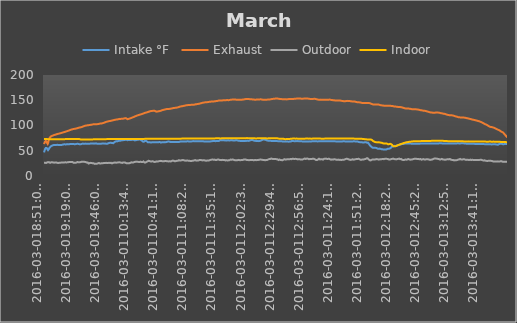
| Category | Intake °F  | Exhaust | Outdoor | Indoor |
|---|---|---|---|---|
| 2016-03-018:51:02 AM | 46.738 | 63.275 | 26.038 | 73.512 |
| 2016-03-018:51:06 AM | 47.412 | 63.725 | 26.15 | 73.512 |
| 2016-03-018:51:10 AM | 47.975 | 64.062 | 26.15 | 73.512 |
| 2016-03-018:51:14 AM | 48.538 | 64.512 | 26.15 | 73.512 |
| 2016-03-018:51:18 AM | 49.1 | 64.963 | 26.262 | 73.512 |
| 2016-03-018:51:23 AM | 49.438 | 65.3 | 26.15 | 73.512 |
| 2016-03-018:51:27 AM | 50 | 65.638 | 26.15 | 73.4 |
| 2016-03-018:51:31 AM | 50.338 | 65.975 | 26.15 | 73.4 |
| 2016-03-018:51:35 AM | 50.788 | 66.2 | 26.038 | 73.4 |
| 2016-03-018:51:39 AM | 51.238 | 66.425 | 26.038 | 73.512 |
| 2016-03-018:51:43 AM | 51.575 | 66.762 | 26.038 | 73.4 |
| 2016-03-018:51:47 AM | 52.025 | 66.988 | 26.038 | 73.4 |
| 2016-03-018:51:51 AM | 52.362 | 67.212 | 26.15 | 73.4 |
| 2016-03-018:51:56 AM | 52.7 | 67.55 | 26.15 | 73.4 |
| 2016-03-018:52:00 AM | 53.038 | 67.662 | 26.262 | 73.4 |
| 2016-03-018:52:04 AM | 53.375 | 67.888 | 26.262 | 73.4 |
| 2016-03-018:52:08 AM | 53.6 | 68.338 | 26.15 | 73.4 |
| 2016-03-018:52:12 AM | 53.938 | 68.45 | 26.15 | 73.4 |
| 2016-03-018:52:16 AM | 54.388 | 68.562 | 26.262 | 73.4 |
| 2016-03-018:52:20 AM | 54.725 | 68.788 | 26.262 | 73.4 |
| 2016-03-018:52:24 AM | 54.838 | 68.9 | 26.262 | 73.4 |
| 2016-03-018:52:29 AM | 55.062 | 69.125 | 26.038 | 73.4 |
| 2016-03-018:52:33 AM | 55.288 | 69.35 | 26.15 | 73.4 |
| 2016-03-018:52:37 AM | 55.4 | 69.462 | 26.038 | 73.4 |
| 2016-03-018:52:41 AM | 55.512 | 69.688 | 25.925 | 73.288 |
| 2016-03-018:52:53 AM | 55.625 | 69.8 | 25.812 | 73.4 |
| 2016-03-018:52:57 AM | 55.738 | 69.8 | 25.812 | 73.288 |
| 2016-03-018:53:02 AM | 55.738 | 69.575 | 25.7 | 73.4 |
| 2016-03-018:53:06 AM | 56.075 | 69.238 | 25.7 | 73.4 |
| 2016-03-018:53:10 AM | 56.075 | 68.9 | 25.812 | 73.288 |
| 2016-03-018:53:21 AM | 56.075 | 68.675 | 25.812 | 73.288 |
| 2016-03-018:53:26 AM | 56.075 | 68.45 | 25.925 | 73.288 |
| 2016-03-018:53:30 AM | 55.962 | 68.225 | 26.038 | 73.288 |
| 2016-03-018:53:34 AM | 55.85 | 67.888 | 26.038 | 73.288 |
| 2016-03-018:53:38 AM | 55.738 | 67.662 | 26.15 | 73.288 |
| 2016-03-018:53:41 AM | 55.512 | 67.438 | 26.15 | 73.175 |
| 2016-03-018:53:45 AM | 55.4 | 67.1 | 26.15 | 73.175 |
| 2016-03-018:53:50 AM | 55.288 | 66.875 | 26.262 | 73.175 |
| 2016-03-018:53:54 AM | 54.95 | 66.65 | 26.375 | 73.175 |
| 2016-03-018:53:58 AM | 54.838 | 66.312 | 26.488 | 73.175 |
| 2016-03-018:54:02 AM | 54.612 | 66.088 | 26.488 | 73.175 |
| 2016-03-018:54:06 AM | 54.388 | 65.862 | 26.6 | 73.175 |
| 2016-03-018:54:10 AM | 54.275 | 65.638 | 26.712 | 73.062 |
| 2016-03-018:54:15 AM | 53.938 | 65.412 | 26.712 | 73.062 |
| 2016-03-018:54:19 AM | 53.712 | 65.188 | 26.712 | 73.062 |
| 2016-03-018:54:23 AM | 53.488 | 64.963 | 26.712 | 73.062 |
| 2016-03-018:54:27 AM | 53.262 | 64.738 | 26.825 | 73.062 |
| 2016-03-018:54:31 AM | 53.038 | 64.512 | 26.938 | 73.062 |
| 2016-03-018:54:35 AM | 52.812 | 64.4 | 26.938 | 73.062 |
| 2016-03-018:54:39 AM | 52.588 | 63.838 | 26.938 | 73.062 |
| 2016-03-018:54:44 AM | 52.362 | 63.613 | 27.05 | 72.95 |
| 2016-03-018:54:48 AM | 52.138 | 63.5 | 27.162 | 72.95 |
| 2016-03-018:54:52 AM | 51.912 | 63.275 | 27.162 | 72.95 |
| 2016-03-018:54:56 AM | 51.688 | 63.05 | 27.275 | 72.95 |
| 2016-03-018:55:00 AM | 51.462 | 62.938 | 27.388 | 72.95 |
| 2016-03-018:55:04 AM | 51.238 | 63.725 | 27.388 | 72.95 |
| 2016-03-018:55:08 AM | 50.9 | 64.738 | 27.5 | 72.95 |
| 2016-03-018:55:13 AM | 50.788 | 65.75 | 27.612 | 72.95 |
| 2016-03-018:55:20 AM | 51.012 | 66.65 | 27.725 | 72.95 |
| 2016-03-018:55:25 AM | 51.238 | 67.325 | 27.725 | 72.95 |
| 2016-03-018:55:29 AM | 51.462 | 68.112 | 27.725 | 72.95 |
| 2016-03-018:55:33 AM | 51.688 | 68.788 | 27.612 | 72.95 |
| 2016-03-018:55:37 AM | 52.138 | 69.462 | 27.5 | 72.95 |
| 2016-03-018:55:41 AM | 52.362 | 70.025 | 27.388 | 72.95 |
| 2016-03-018:55:45 AM | 52.7 | 70.7 | 27.275 | 72.95 |
| 2016-03-018:55:50 AM | 52.925 | 71.15 | 27.162 | 72.95 |
| 2016-03-018:55:54 AM | 53.15 | 71.712 | 27.275 | 72.95 |
| 2016-03-018:55:58 AM | 53.488 | 72.162 | 27.275 | 72.95 |
| 2016-03-018:56:02 AM | 53.712 | 72.612 | 27.275 | 72.95 |
| 2016-03-018:56:06 AM | 54.05 | 72.95 | 27.275 | 72.838 |
| 2016-03-018:56:10 AM | 54.275 | 73.4 | 27.275 | 72.838 |
| 2016-03-018:56:15 AM | 54.5 | 73.738 | 27.162 | 72.838 |
| 2016-03-018:56:19 AM | 54.838 | 74.075 | 27.05 | 72.838 |
| 2016-03-018:56:23 AM | 55.175 | 74.412 | 26.938 | 72.838 |
| 2016-03-018:56:27 AM | 55.288 | 74.638 | 26.825 | 72.838 |
| 2016-03-018:56:31 AM | 55.625 | 74.862 | 26.825 | 72.838 |
| 2016-03-018:56:35 AM | 55.85 | 75.088 | 26.712 | 72.838 |
| 2016-03-018:56:39 AM | 56.075 | 75.312 | 26.6 | 72.838 |
| 2016-03-018:56:48 AM | 56.3 | 75.538 | 26.375 | 72.725 |
| 2016-03-018:56:52 AM | 56.638 | 75.762 | 26.375 | 72.725 |
| 2016-03-018:56:56 AM | 56.75 | 75.988 | 26.262 | 72.725 |
| 2016-03-018:57:00 AM | 56.975 | 76.325 | 26.262 | 72.725 |
| 2016-03-018:57:04 AM | 57.088 | 76.438 | 26.262 | 72.725 |
| 2016-03-018:57:09 AM | 57.2 | 76.662 | 26.15 | 72.725 |
| 2016-03-018:57:13 AM | 57.312 | 76.888 | 26.15 | 72.725 |
| 2016-03-018:57:17 AM | 57.425 | 77 | 26.262 | 72.725 |
| 2016-03-018:57:21 AM | 57.538 | 77.112 | 26.15 | 72.725 |
| 2016-03-018:57:25 AM | 57.65 | 77.225 | 26.262 | 72.725 |
| 2016-03-018:57:29 AM | 57.762 | 77.338 | 26.375 | 72.725 |
| 2016-03-018:57:33 AM | 57.988 | 77.45 | 26.375 | 72.725 |
| 2016-03-018:57:37 AM | 58.1 | 77.675 | 26.488 | 72.725 |
| 2016-03-018:57:42 AM | 58.325 | 77.788 | 26.488 | 72.725 |
| 2016-03-018:57:46 AM | 58.55 | 77.9 | 26.6 | 72.725 |
| 2016-03-018:57:50 AM | 58.662 | 78.012 | 26.6 | 72.612 |
| 2016-03-018:57:54 AM | 58.775 | 78.125 | 26.825 | 72.612 |
| 2016-03-018:57:58 AM | 59 | 78.125 | 26.825 | 72.725 |
| 2016-03-018:58:02 AM | 59.112 | 78.238 | 26.938 | 72.612 |
| 2016-03-018:58:06 AM | 59.225 | 78.35 | 26.938 | 72.725 |
| 2016-03-018:58:10 AM | 59.338 | 78.462 | 27.05 | 72.612 |
| 2016-03-018:58:14 AM | 59.45 | 78.8 | 27.05 | 72.725 |
| 2016-03-018:58:18 AM | 59.45 | 78.912 | 27.05 | 72.612 |
| 2016-03-018:58:22 AM | 59.45 | 78.912 | 27.05 | 72.725 |
| 2016-03-018:58:26 AM | 59.562 | 79.025 | 27.162 | 72.612 |
| 2016-03-018:58:31 AM | 59.562 | 79.025 | 27.05 | 72.725 |
| 2016-03-018:58:35 AM | 59.675 | 79.025 | 27.05 | 72.612 |
| 2016-03-018:58:39 AM | 59.675 | 79.138 | 27.162 | 72.725 |
| 2016-03-018:58:43 AM | 59.788 | 79.25 | 27.162 | 72.612 |
| 2016-03-018:58:47 AM | 59.9 | 79.25 | 27.275 | 72.725 |
| 2016-03-018:58:51 AM | 60.012 | 79.362 | 27.388 | 72.612 |
| 2016-03-018:58:55 AM | 60.012 | 79.362 | 27.388 | 72.725 |
| 2016-03-018:59:02 AM | 60.125 | 79.475 | 27.275 | 72.725 |
| 2016-03-018:59:06 AM | 60.238 | 79.588 | 27.275 | 72.725 |
| 2016-03-018:59:11 AM | 60.238 | 79.7 | 27.275 | 72.725 |
| 2016-03-018:59:15 AM | 60.238 | 79.7 | 27.162 | 72.725 |
| 2016-03-018:59:19 AM | 60.35 | 79.7 | 27.05 | 72.725 |
| 2016-03-018:59:23 AM | 60.35 | 79.812 | 27.05 | 72.725 |
| 2016-03-018:59:27 AM | 60.462 | 79.812 | 27.05 | 72.725 |
| 2016-03-018:59:31 AM | 60.575 | 79.812 | 27.05 | 72.725 |
| 2016-03-018:59:35 AM | 60.575 | 79.925 | 26.938 | 72.725 |
| 2016-03-018:59:43 AM | 60.688 | 80.038 | 26.938 | 72.725 |
| 2016-03-018:59:47 AM | 60.8 | 80.15 | 26.825 | 72.725 |
| 2016-03-018:59:51 AM | 60.8 | 80.262 | 26.712 | 72.725 |
| 2016-03-018:59:56 AM | 60.8 | 80.262 | 26.712 | 72.725 |
| 2016-03-018:59:59 AM | 60.912 | 80.375 | 26.712 | 72.725 |
| 2016-03-019:00:03 AM | 60.912 | 80.488 | 26.712 | 72.725 |
| 2016-03-019:00:07 AM | 61.025 | 80.375 | 26.712 | 72.612 |
| 2016-03-019:00:12 AM | 61.025 | 80.375 | 26.712 | 72.612 |
| 2016-03-019:00:16 AM | 61.138 | 80.488 | 26.712 | 72.612 |
| 2016-03-019:00:20 AM | 61.138 | 80.488 | 26.6 | 72.612 |
| 2016-03-019:00:24 AM | 61.138 | 80.6 | 26.6 | 72.5 |
| 2016-03-019:00:28 AM | 61.138 | 80.712 | 26.6 | 72.5 |
| 2016-03-019:00:32 AM | 61.25 | 80.712 | 26.6 | 72.5 |
| 2016-03-019:00:36 AM | 61.25 | 80.712 | 26.488 | 72.5 |
| 2016-03-019:00:40 AM | 61.25 | 80.825 | 26.375 | 72.5 |
| 2016-03-019:00:44 AM | 61.25 | 80.825 | 26.262 | 72.5 |
| 2016-03-019:00:48 AM | 61.25 | 80.825 | 26.15 | 72.5 |
| 2016-03-019:00:53 AM | 61.138 | 80.938 | 26.375 | 72.612 |
| 2016-03-019:01:00 AM | 61.138 | 80.938 | 26.262 | 72.5 |
| 2016-03-019:01:05 AM | 61.138 | 80.938 | 26.262 | 72.5 |
| 2016-03-019:01:09 AM | 61.138 | 81.05 | 26.262 | 72.612 |
| 2016-03-019:01:13 AM | 61.138 | 81.162 | 26.375 | 72.612 |
| 2016-03-019:01:17 AM | 61.138 | 81.275 | 26.375 | 72.5 |
| 2016-03-019:01:21 AM | 61.138 | 81.275 | 26.375 | 72.612 |
| 2016-03-019:01:29 AM | 61.25 | 81.388 | 26.375 | 72.612 |
| 2016-03-019:01:33 AM | 61.25 | 81.388 | 26.262 | 72.612 |
| 2016-03-019:01:37 AM | 61.25 | 81.5 | 26.262 | 72.612 |
| 2016-03-019:01:41 AM | 61.363 | 81.5 | 26.262 | 72.612 |
| 2016-03-019:01:46 AM | 61.363 | 81.5 | 26.488 | 72.612 |
| 2016-03-019:01:50 AM | 61.363 | 81.612 | 26.375 | 72.612 |
| 2016-03-019:01:54 AM | 61.25 | 81.612 | 26.488 | 72.612 |
| 2016-03-019:01:58 AM | 61.138 | 81.612 | 26.6 | 72.612 |
| 2016-03-019:02:02 AM | 61.025 | 81.725 | 26.6 | 72.612 |
| 2016-03-019:02:10 AM | 61.025 | 81.725 | 26.825 | 72.612 |
| 2016-03-019:02:14 AM | 61.025 | 81.838 | 26.938 | 72.612 |
| 2016-03-019:02:18 AM | 61.138 | 81.838 | 26.825 | 72.612 |
| 2016-03-019:02:23 AM | 61.138 | 81.838 | 26.825 | 72.612 |
| 2016-03-019:02:27 AM | 61.138 | 81.838 | 26.938 | 72.612 |
| 2016-03-019:02:31 AM | 61.138 | 81.95 | 27.05 | 72.612 |
| 2016-03-019:02:35 AM | 61.138 | 81.95 | 27.162 | 72.612 |
| 2016-03-019:02:39 AM | 61.25 | 81.95 | 27.162 | 72.612 |
| 2016-03-019:02:43 AM | 61.363 | 82.062 | 27.162 | 72.612 |
| 2016-03-019:02:47 AM | 61.363 | 82.062 | 27.162 | 72.612 |
| 2016-03-019:02:51 AM | 61.475 | 82.062 | 27.162 | 72.612 |
| 2016-03-019:02:55 AM | 61.475 | 82.175 | 27.05 | 72.612 |
| 2016-03-019:03:00 AM | 61.475 | 82.175 | 26.825 | 72.612 |
| 2016-03-019:03:04 AM | 61.588 | 82.175 | 26.825 | 72.612 |
| 2016-03-019:03:08 AM | 61.588 | 82.288 | 26.712 | 72.612 |
| 2016-03-019:03:12 AM | 61.7 | 82.288 | 26.712 | 72.612 |
| 2016-03-019:03:16 AM | 61.588 | 82.4 | 26.825 | 72.612 |
| 2016-03-019:03:20 AM | 61.588 | 82.512 | 26.712 | 72.612 |
| 2016-03-019:03:24 AM | 61.588 | 82.512 | 26.375 | 72.612 |
| 2016-03-019:03:28 AM | 61.588 | 82.512 | 26.262 | 72.612 |
| 2016-03-019:03:32 AM | 61.588 | 82.512 | 26.375 | 72.612 |
| 2016-03-019:03:36 AM | 61.588 | 82.512 | 26.488 | 72.612 |
| 2016-03-019:03:40 AM | 61.588 | 82.625 | 26.488 | 72.725 |
| 2016-03-019:03:45 AM | 61.588 | 82.625 | 26.6 | 72.612 |
| 2016-03-019:03:49 AM | 61.588 | 82.738 | 26.712 | 72.612 |
| 2016-03-019:03:53 AM | 61.475 | 82.738 | 26.6 | 72.612 |
| 2016-03-019:03:57 AM | 61.475 | 82.85 | 26.488 | 72.725 |
| 2016-03-019:04:01 AM | 61.588 | 82.85 | 26.262 | 72.725 |
| 2016-03-019:04:05 AM | 61.588 | 82.962 | 26.15 | 72.725 |
| 2016-03-019:04:09 AM | 61.588 | 82.962 | 26.15 | 72.725 |
| 2016-03-019:04:13 AM | 61.588 | 83.075 | 26.15 | 72.612 |
| 2016-03-019:04:17 AM | 61.7 | 83.075 | 26.038 | 72.612 |
| 2016-03-019:04:21 AM | 61.7 | 83.188 | 26.038 | 72.725 |
| 2016-03-019:04:25 AM | 61.7 | 83.188 | 25.925 | 72.725 |
| 2016-03-019:04:29 AM | 61.7 | 83.188 | 26.038 | 72.725 |
| 2016-03-019:04:33 AM | 61.812 | 83.188 | 25.925 | 72.725 |
| 2016-03-019:04:37 AM | 61.7 | 83.3 | 25.7 | 72.725 |
| 2016-03-019:04:41 AM | 61.7 | 83.3 | 25.7 | 72.725 |
| 2016-03-019:04:45 AM | 61.7 | 83.3 | 25.7 | 72.725 |
| 2016-03-019:04:49 AM | 61.588 | 83.3 | 25.7 | 72.838 |
| 2016-03-019:04:53 AM | 61.475 | 83.3 | 25.588 | 72.838 |
| 2016-03-019:04:57 AM | 61.363 | 83.412 | 25.588 | 72.838 |
| 2016-03-019:05:02 AM | 61.25 | 83.412 | 25.588 | 72.838 |
| 2016-03-019:05:06 AM | 61.363 | 83.412 | 25.588 | 72.725 |
| 2016-03-019:05:10 AM | 61.363 | 83.525 | 25.7 | 72.838 |
| 2016-03-019:05:14 AM | 61.363 | 83.525 | 25.812 | 72.838 |
| 2016-03-019:05:18 AM | 61.363 | 83.638 | 25.925 | 72.838 |
| 2016-03-019:05:22 AM | 61.363 | 83.638 | 26.038 | 72.838 |
| 2016-03-019:05:26 AM | 61.25 | 83.638 | 26.038 | 72.838 |
| 2016-03-019:05:30 AM | 61.138 | 83.75 | 26.038 | 72.838 |
| 2016-03-019:05:34 AM | 61.138 | 83.638 | 26.15 | 72.838 |
| 2016-03-019:05:38 AM | 61.25 | 83.75 | 26.15 | 72.725 |
| 2016-03-019:05:42 AM | 61.25 | 83.75 | 26.262 | 72.725 |
| 2016-03-019:05:46 AM | 61.363 | 83.75 | 26.375 | 72.838 |
| 2016-03-019:05:50 AM | 61.363 | 83.862 | 26.375 | 72.838 |
| 2016-03-019:05:54 AM | 61.363 | 83.862 | 26.375 | 72.838 |
| 2016-03-019:05:58 AM | 61.363 | 83.975 | 26.375 | 72.838 |
| 2016-03-019:06:02 AM | 61.25 | 83.975 | 26.488 | 72.838 |
| 2016-03-019:06:06 AM | 61.25 | 83.975 | 26.375 | 72.725 |
| 2016-03-019:06:10 AM | 61.363 | 84.088 | 26.375 | 72.838 |
| 2016-03-019:06:14 AM | 61.363 | 84.088 | 26.375 | 72.838 |
| 2016-03-019:06:19 AM | 61.25 | 84.088 | 26.262 | 72.838 |
| 2016-03-019:06:23 AM | 61.25 | 84.2 | 26.15 | 72.838 |
| 2016-03-019:06:27 AM | 61.138 | 84.2 | 26.262 | 72.838 |
| 2016-03-019:06:31 AM | 61.138 | 84.312 | 26.262 | 72.838 |
| 2016-03-019:06:35 AM | 61.138 | 84.312 | 26.262 | 72.838 |
| 2016-03-019:06:39 AM | 61.138 | 84.425 | 26.375 | 72.725 |
| 2016-03-019:06:43 AM | 61.025 | 84.425 | 26.375 | 72.838 |
| 2016-03-019:06:47 AM | 61.025 | 84.425 | 26.262 | 72.838 |
| 2016-03-019:06:51 AM | 60.912 | 84.538 | 26.262 | 72.838 |
| 2016-03-019:06:55 AM | 61.025 | 84.538 | 26.375 | 72.725 |
| 2016-03-019:06:59 AM | 61.025 | 84.538 | 26.375 | 72.838 |
| 2016-03-019:07:03 AM | 61.025 | 84.65 | 26.375 | 72.838 |
| 2016-03-019:07:07 AM | 61.025 | 84.65 | 26.488 | 72.838 |
| 2016-03-019:07:11 AM | 61.138 | 84.65 | 26.6 | 72.838 |
| 2016-03-019:07:15 AM | 61.138 | 84.65 | 26.712 | 72.838 |
| 2016-03-019:07:19 AM | 61.25 | 84.762 | 26.825 | 72.838 |
| 2016-03-019:07:23 AM | 61.25 | 84.762 | 26.712 | 72.838 |
| 2016-03-019:07:27 AM | 61.363 | 84.762 | 26.6 | 72.838 |
| 2016-03-019:07:31 AM | 61.363 | 84.762 | 26.6 | 72.838 |
| 2016-03-019:07:36 AM | 61.475 | 84.875 | 26.488 | 72.838 |
| 2016-03-019:07:40 AM | 61.475 | 84.988 | 26.375 | 72.838 |
| 2016-03-019:07:44 AM | 61.475 | 84.988 | 26.488 | 72.838 |
| 2016-03-019:07:48 AM | 61.588 | 84.988 | 26.488 | 72.838 |
| 2016-03-019:07:52 AM | 61.588 | 85.1 | 26.488 | 72.838 |
| 2016-03-019:07:56 AM | 61.588 | 85.1 | 26.6 | 72.838 |
| 2016-03-019:08:00 AM | 61.475 | 85.212 | 26.6 | 72.838 |
| 2016-03-019:08:04 AM | 61.475 | 85.212 | 26.6 | 72.838 |
| 2016-03-019:08:08 AM | 61.475 | 85.212 | 26.6 | 72.838 |
| 2016-03-019:08:12 AM | 61.475 | 85.325 | 26.712 | 72.838 |
| 2016-03-019:08:16 AM | 61.475 | 85.438 | 26.825 | 72.838 |
| 2016-03-019:08:20 AM | 61.588 | 85.438 | 26.825 | 72.838 |
| 2016-03-019:08:24 AM | 61.588 | 85.438 | 26.938 | 72.838 |
| 2016-03-019:08:28 AM | 61.588 | 85.438 | 26.938 | 72.838 |
| 2016-03-019:08:32 AM | 61.7 | 85.55 | 26.825 | 72.838 |
| 2016-03-019:08:36 AM | 61.7 | 85.55 | 26.825 | 72.95 |
| 2016-03-019:08:40 AM | 61.7 | 85.55 | 26.825 | 72.838 |
| 2016-03-019:08:44 AM | 61.812 | 85.662 | 26.712 | 72.95 |
| 2016-03-019:08:49 AM | 61.812 | 85.662 | 26.825 | 72.838 |
| 2016-03-019:08:53 AM | 61.925 | 85.775 | 26.825 | 72.838 |
| 2016-03-019:08:57 AM | 61.925 | 85.775 | 26.825 | 72.95 |
| 2016-03-019:09:01 AM | 61.925 | 85.888 | 26.712 | 72.838 |
| 2016-03-019:09:05 AM | 61.925 | 85.888 | 26.6 | 72.838 |
| 2016-03-019:09:09 AM | 62.038 | 85.888 | 26.6 | 72.95 |
| 2016-03-019:09:13 AM | 62.038 | 86 | 26.712 | 72.95 |
| 2016-03-019:09:17 AM | 62.15 | 86.112 | 26.712 | 72.95 |
| 2016-03-019:09:21 AM | 62.15 | 86.112 | 26.825 | 72.95 |
| 2016-03-019:09:25 AM | 62.15 | 86.112 | 26.712 | 72.95 |
| 2016-03-019:09:29 AM | 62.15 | 86.112 | 26.712 | 72.95 |
| 2016-03-019:09:33 AM | 62.262 | 86.112 | 26.712 | 72.95 |
| 2016-03-019:09:37 AM | 62.262 | 86.225 | 26.825 | 72.95 |
| 2016-03-019:09:41 AM | 62.262 | 86.225 | 26.825 | 72.95 |
| 2016-03-019:09:45 AM | 62.375 | 86.338 | 26.938 | 72.95 |
| 2016-03-019:09:49 AM | 62.375 | 86.45 | 27.05 | 72.95 |
| 2016-03-019:09:53 AM | 62.488 | 86.45 | 26.938 | 72.95 |
| 2016-03-019:09:57 AM | 62.488 | 86.562 | 26.825 | 72.95 |
| 2016-03-019:10:01 AM | 62.488 | 86.562 | 26.825 | 72.95 |
| 2016-03-019:10:05 AM | 62.488 | 86.562 | 26.938 | 72.95 |
| 2016-03-019:10:09 AM | 62.6 | 86.675 | 26.825 | 72.95 |
| 2016-03-019:10:13 AM | 62.488 | 86.562 | 26.712 | 72.95 |
| 2016-03-019:10:17 AM | 62.488 | 86.675 | 26.712 | 72.95 |
| 2016-03-019:10:21 AM | 62.488 | 86.675 | 26.712 | 72.95 |
| 2016-03-019:10:25 AM | 62.6 | 86.675 | 26.712 | 72.95 |
| 2016-03-019:10:29 AM | 62.6 | 86.788 | 26.712 | 72.95 |
| 2016-03-019:10:33 AM | 62.6 | 86.788 | 26.712 | 72.95 |
| 2016-03-019:10:37 AM | 62.6 | 86.788 | 26.825 | 72.95 |
| 2016-03-019:10:41 AM | 62.6 | 86.9 | 26.825 | 72.95 |
| 2016-03-019:10:45 AM | 62.712 | 86.9 | 26.825 | 72.95 |
| 2016-03-019:10:49 AM | 62.712 | 87.012 | 26.825 | 72.95 |
| 2016-03-019:10:57 AM | 62.712 | 87.012 | 26.938 | 72.95 |
| 2016-03-019:11:01 AM | 62.825 | 87.012 | 26.938 | 72.95 |
| 2016-03-019:11:05 AM | 62.825 | 87.125 | 26.938 | 72.95 |
| 2016-03-019:11:09 AM | 62.825 | 87.238 | 26.938 | 72.95 |
| 2016-03-019:11:13 AM | 62.938 | 87.238 | 27.05 | 73.062 |
| 2016-03-019:11:17 AM | 62.938 | 87.238 | 27.05 | 72.95 |
| 2016-03-019:11:21 AM | 62.938 | 87.35 | 26.938 | 73.062 |
| 2016-03-019:11:25 AM | 62.825 | 87.462 | 26.825 | 72.95 |
| 2016-03-019:11:29 AM | 62.825 | 87.462 | 26.825 | 73.062 |
| 2016-03-019:11:33 AM | 62.825 | 87.462 | 26.825 | 73.062 |
| 2016-03-019:11:37 AM | 62.825 | 87.575 | 26.825 | 73.062 |
| 2016-03-019:11:41 AM | 62.825 | 87.575 | 26.938 | 73.062 |
| 2016-03-019:11:45 AM | 62.825 | 87.688 | 27.05 | 73.062 |
| 2016-03-019:11:49 AM | 62.712 | 87.688 | 27.162 | 73.062 |
| 2016-03-019:11:53 AM | 62.6 | 87.8 | 27.162 | 73.062 |
| 2016-03-019:11:57 AM | 62.488 | 87.8 | 27.05 | 73.062 |
| 2016-03-019:12:01 AM | 62.488 | 87.912 | 27.05 | 73.062 |
| 2016-03-019:12:05 AM | 62.488 | 87.912 | 27.05 | 73.062 |
| 2016-03-019:12:09 AM | 62.375 | 87.912 | 26.938 | 73.062 |
| 2016-03-019:12:13 AM | 62.488 | 87.912 | 26.825 | 73.062 |
| 2016-03-019:12:17 AM | 62.488 | 88.025 | 26.825 | 73.062 |
| 2016-03-019:12:22 AM | 62.488 | 88.025 | 26.825 | 73.062 |
| 2016-03-019:12:26 AM | 62.488 | 88.025 | 26.825 | 73.062 |
| 2016-03-019:12:30 AM | 62.488 | 88.138 | 26.712 | 73.062 |
| 2016-03-019:12:34 AM | 62.6 | 88.25 | 26.712 | 73.062 |
| 2016-03-019:12:38 AM | 62.6 | 88.25 | 26.712 | 73.062 |
| 2016-03-019:12:42 AM | 62.6 | 88.362 | 26.825 | 73.062 |
| 2016-03-019:12:46 AM | 62.712 | 88.362 | 26.825 | 73.062 |
| 2016-03-019:12:50 AM | 62.712 | 88.362 | 26.938 | 73.062 |
| 2016-03-019:12:54 AM | 62.712 | 88.475 | 27.05 | 73.062 |
| 2016-03-019:12:58 AM | 62.712 | 88.475 | 27.05 | 73.062 |
| 2016-03-019:13:02 AM | 62.712 | 88.475 | 27.05 | 73.062 |
| 2016-03-019:13:06 AM | 62.825 | 88.588 | 27.05 | 73.062 |
| 2016-03-019:13:10 AM | 62.825 | 88.588 | 27.05 | 73.175 |
| 2016-03-019:13:14 AM | 62.825 | 88.588 | 27.05 | 73.175 |
| 2016-03-019:13:18 AM | 62.938 | 88.7 | 26.938 | 73.062 |
| 2016-03-019:13:22 AM | 62.938 | 88.7 | 26.825 | 73.175 |
| 2016-03-019:13:26 AM | 62.938 | 88.7 | 26.825 | 73.062 |
| 2016-03-019:13:30 AM | 63.05 | 88.7 | 26.825 | 73.175 |
| 2016-03-019:13:34 AM | 63.05 | 88.7 | 26.825 | 73.175 |
| 2016-03-019:13:38 AM | 63.05 | 88.812 | 26.938 | 73.062 |
| 2016-03-019:13:42 AM | 63.05 | 88.925 | 27.05 | 73.175 |
| 2016-03-019:13:46 AM | 63.05 | 88.925 | 27.05 | 73.175 |
| 2016-03-019:13:50 AM | 63.05 | 89.038 | 27.162 | 73.062 |
| 2016-03-019:13:54 AM | 63.162 | 89.038 | 27.162 | 73.062 |
| 2016-03-019:13:58 AM | 63.162 | 89.15 | 27.162 | 73.175 |
| 2016-03-019:14:02 AM | 63.162 | 89.15 | 27.05 | 73.175 |
| 2016-03-019:14:06 AM | 63.162 | 89.262 | 27.05 | 73.175 |
| 2016-03-019:14:10 AM | 63.162 | 89.262 | 26.938 | 73.175 |
| 2016-03-019:14:14 AM | 63.162 | 89.375 | 27.05 | 73.175 |
| 2016-03-019:14:18 AM | 63.162 | 89.375 | 27.05 | 73.062 |
| 2016-03-019:14:22 AM | 63.162 | 89.375 | 27.162 | 73.175 |
| 2016-03-019:14:26 AM | 62.938 | 89.488 | 27.162 | 73.062 |
| 2016-03-019:14:30 AM | 62.825 | 89.712 | 27.275 | 73.175 |
| 2016-03-019:14:34 AM | 62.825 | 89.712 | 27.388 | 73.175 |
| 2016-03-019:14:38 AM | 62.712 | 89.712 | 27.388 | 73.175 |
| 2016-03-019:14:42 AM | 62.712 | 89.825 | 27.388 | 73.175 |
| 2016-03-019:14:47 AM | 62.712 | 89.825 | 27.5 | 73.175 |
| 2016-03-019:14:51 AM | 62.712 | 89.825 | 27.388 | 73.175 |
| 2016-03-019:14:55 AM | 62.825 | 89.938 | 27.5 | 73.175 |
| 2016-03-019:14:59 AM | 62.825 | 89.938 | 27.5 | 73.175 |
| 2016-03-019:15:03 AM | 62.825 | 90.05 | 27.5 | 73.175 |
| 2016-03-019:15:07 AM | 62.825 | 90.05 | 27.5 | 73.175 |
| 2016-03-019:15:11 AM | 62.825 | 90.163 | 27.5 | 73.175 |
| 2016-03-019:15:15 AM | 62.938 | 90.163 | 27.5 | 73.175 |
| 2016-03-019:15:19 AM | 62.938 | 90.275 | 27.612 | 73.175 |
| 2016-03-019:15:23 AM | 62.938 | 90.388 | 27.725 | 73.175 |
| 2016-03-019:15:27 AM | 63.05 | 90.388 | 27.838 | 73.175 |
| 2016-03-019:15:31 AM | 63.05 | 90.5 | 27.725 | 73.175 |
| 2016-03-019:15:35 AM | 63.162 | 90.5 | 27.725 | 73.175 |
| 2016-03-019:15:39 AM | 63.162 | 90.612 | 27.725 | 73.175 |
| 2016-03-019:15:43 AM | 63.162 | 90.612 | 27.612 | 73.175 |
| 2016-03-019:15:47 AM | 63.162 | 90.725 | 27.612 | 73.175 |
| 2016-03-019:15:51 AM | 63.275 | 90.725 | 27.725 | 73.062 |
| 2016-03-019:15:55 AM | 63.162 | 90.725 | 27.838 | 73.062 |
| 2016-03-019:15:59 AM | 63.275 | 90.838 | 27.725 | 73.062 |
| 2016-03-019:16:03 AM | 63.275 | 90.838 | 27.838 | 73.062 |
| 2016-03-019:16:07 AM | 63.275 | 90.838 | 27.838 | 73.062 |
| 2016-03-019:16:11 AM | 63.275 | 90.95 | 27.95 | 73.062 |
| 2016-03-019:16:15 AM | 63.275 | 91.062 | 27.838 | 73.062 |
| 2016-03-019:16:19 AM | 63.275 | 91.062 | 27.838 | 73.062 |
| 2016-03-019:16:23 AM | 63.275 | 91.175 | 27.725 | 73.062 |
| 2016-03-019:16:27 AM | 63.275 | 91.175 | 27.838 | 73.175 |
| 2016-03-019:16:31 AM | 63.275 | 91.288 | 27.838 | 73.062 |
| 2016-03-019:16:35 AM | 63.162 | 91.4 | 27.725 | 73.062 |
| 2016-03-019:16:39 AM | 63.162 | 91.4 | 27.5 | 73.062 |
| 2016-03-019:16:43 AM | 63.162 | 91.4 | 27.388 | 73.062 |
| 2016-03-019:16:47 AM | 63.05 | 91.512 | 27.388 | 73.062 |
| 2016-03-019:16:51 AM | 63.162 | 91.512 | 27.388 | 73.062 |
| 2016-03-019:16:55 AM | 63.162 | 91.512 | 27.388 | 73.062 |
| 2016-03-019:17:00 AM | 63.05 | 91.625 | 27.388 | 73.062 |
| 2016-03-019:17:04 AM | 63.05 | 91.625 | 27.612 | 73.175 |
| 2016-03-019:17:08 AM | 63.05 | 91.625 | 27.612 | 73.062 |
| 2016-03-019:17:12 AM | 63.05 | 91.625 | 27.612 | 73.175 |
| 2016-03-019:17:16 AM | 63.05 | 91.738 | 27.612 | 73.062 |
| 2016-03-019:17:20 AM | 63.05 | 91.738 | 27.725 | 73.062 |
| 2016-03-019:17:24 AM | 63.162 | 91.85 | 27.725 | 73.062 |
| 2016-03-019:17:28 AM | 63.162 | 91.962 | 27.725 | 73.062 |
| 2016-03-019:17:32 AM | 63.162 | 91.962 | 27.5 | 73.062 |
| 2016-03-019:17:36 AM | 63.162 | 92.075 | 27.5 | 73.062 |
| 2016-03-019:17:40 AM | 63.162 | 92.075 | 27.5 | 73.062 |
| 2016-03-019:17:44 AM | 63.275 | 92.075 | 27.388 | 73.062 |
| 2016-03-019:17:48 AM | 63.275 | 92.075 | 27.5 | 73.062 |
| 2016-03-019:17:52 AM | 63.275 | 92.188 | 27.612 | 73.175 |
| 2016-03-019:17:56 AM | 63.275 | 92.3 | 27.612 | 73.062 |
| 2016-03-019:18:00 AM | 63.275 | 92.3 | 27.612 | 73.175 |
| 2016-03-019:18:04 AM | 63.275 | 92.413 | 27.725 | 73.062 |
| 2016-03-019:18:08 AM | 63.388 | 92.413 | 27.838 | 73.062 |
| 2016-03-019:18:12 AM | 63.388 | 92.413 | 27.838 | 73.062 |
| 2016-03-019:18:16 AM | 63.388 | 92.413 | 27.838 | 73.062 |
| 2016-03-019:18:20 AM | 63.388 | 92.525 | 27.838 | 73.062 |
| 2016-03-019:18:24 AM | 63.5 | 92.525 | 27.838 | 73.062 |
| 2016-03-019:18:28 AM | 63.5 | 92.638 | 27.725 | 73.062 |
| 2016-03-019:18:32 AM | 63.5 | 92.638 | 27.725 | 73.062 |
| 2016-03-019:18:36 AM | 63.5 | 92.638 | 27.5 | 73.062 |
| 2016-03-019:18:40 AM | 63.5 | 92.75 | 27.388 | 73.062 |
| 2016-03-019:18:44 AM | 63.5 | 92.75 | 27.275 | 73.062 |
| 2016-03-019:18:48 AM | 63.5 | 92.75 | 27.05 | 73.062 |
| 2016-03-019:18:52 AM | 63.613 | 92.75 | 26.825 | 73.062 |
| 2016-03-019:18:56 AM | 63.613 | 92.862 | 26.825 | 73.062 |
| 2016-03-019:19:00 AM | 63.5 | 92.862 | 26.712 | 73.062 |
| 2016-03-019:19:05 AM | 63.5 | 92.862 | 26.6 | 73.062 |
| 2016-03-019:19:09 AM | 63.5 | 92.975 | 26.712 | 73.062 |
| 2016-03-019:19:13 AM | 63.5 | 92.975 | 26.6 | 73.062 |
| 2016-03-019:19:17 AM | 63.388 | 92.975 | 26.488 | 73.062 |
| 2016-03-019:19:21 AM | 63.275 | 93.088 | 26.375 | 73.062 |
| 2016-03-019:19:25 AM | 63.275 | 93.088 | 26.262 | 73.062 |
| 2016-03-019:19:29 AM | 63.275 | 93.088 | 26.262 | 73.062 |
| 2016-03-019:19:33 AM | 63.275 | 93.088 | 26.375 | 73.062 |
| 2016-03-019:19:37 AM | 63.162 | 93.088 | 26.375 | 73.062 |
| 2016-03-019:19:41 AM | 63.05 | 93.088 | 26.488 | 73.062 |
| 2016-03-019:19:45 AM | 63.05 | 93.2 | 26.375 | 73.062 |
| 2016-03-019:19:49 AM | 62.938 | 93.312 | 26.375 | 73.062 |
| 2016-03-019:19:53 AM | 62.938 | 93.312 | 26.488 | 73.062 |
| 2016-03-019:19:57 AM | 62.938 | 93.425 | 26.488 | 73.175 |
| 2016-03-019:20:01 AM | 62.938 | 93.425 | 26.375 | 73.062 |
| 2016-03-019:20:05 AM | 62.938 | 93.425 | 26.262 | 73.062 |
| 2016-03-019:20:09 AM | 62.825 | 93.425 | 26.15 | 73.062 |
| 2016-03-019:20:13 AM | 62.825 | 93.425 | 26.262 | 73.175 |
| 2016-03-019:20:17 AM | 62.938 | 93.425 | 26.262 | 73.175 |
| 2016-03-019:20:21 AM | 62.938 | 93.425 | 26.375 | 73.175 |
| 2016-03-019:20:25 AM | 62.938 | 93.425 | 26.375 | 73.175 |
| 2016-03-019:20:29 AM | 62.938 | 93.538 | 26.375 | 73.175 |
| 2016-03-019:20:33 AM | 62.938 | 93.538 | 26.375 | 73.175 |
| 2016-03-019:20:37 AM | 63.05 | 93.538 | 26.375 | 73.175 |
| 2016-03-019:20:41 AM | 63.05 | 93.65 | 26.262 | 73.175 |
| 2016-03-019:20:45 AM | 63.05 | 93.65 | 26.262 | 73.175 |
| 2016-03-019:20:49 AM | 63.162 | 93.65 | 26.262 | 73.175 |
| 2016-03-019:20:53 AM | 63.162 | 93.65 | 26.15 | 73.175 |
| 2016-03-019:20:57 AM | 63.162 | 93.762 | 26.15 | 73.175 |
| 2016-03-019:21:01 AM | 63.275 | 93.762 | 26.15 | 73.175 |
| 2016-03-019:21:05 AM | 63.162 | 93.762 | 26.15 | 73.175 |
| 2016-03-019:21:09 AM | 63.275 | 93.762 | 26.038 | 73.175 |
| 2016-03-019:21:13 AM | 63.162 | 93.762 | 26.038 | 73.175 |
| 2016-03-019:21:18 AM | 63.162 | 93.762 | 26.038 | 73.175 |
| 2016-03-019:21:22 AM | 63.162 | 93.762 | 26.038 | 73.175 |
| 2016-03-019:21:26 AM | 63.162 | 93.762 | 26.15 | 73.175 |
| 2016-03-019:21:30 AM | 63.275 | 93.762 | 26.262 | 73.175 |
| 2016-03-019:21:34 AM | 63.275 | 93.875 | 26.262 | 73.062 |
| 2016-03-019:21:38 AM | 63.275 | 93.875 | 26.262 | 73.062 |
| 2016-03-019:21:42 AM | 63.388 | 93.988 | 26.375 | 73.062 |
| 2016-03-019:21:46 AM | 63.388 | 93.988 | 26.488 | 73.062 |
| 2016-03-019:21:50 AM | 63.388 | 94.1 | 26.6 | 73.062 |
| 2016-03-019:21:54 AM | 63.388 | 94.1 | 26.6 | 73.062 |
| 2016-03-019:21:58 AM | 63.388 | 94.212 | 26.6 | 73.062 |
| 2016-03-019:22:02 AM | 63.388 | 94.212 | 26.6 | 73.175 |
| 2016-03-019:22:06 AM | 63.388 | 94.325 | 26.712 | 73.175 |
| 2016-03-019:22:10 AM | 63.5 | 94.325 | 26.712 | 73.175 |
| 2016-03-019:22:14 AM | 63.5 | 94.325 | 26.712 | 73.175 |
| 2016-03-019:22:18 AM | 63.5 | 94.325 | 26.825 | 73.175 |
| 2016-03-019:22:22 AM | 63.613 | 94.325 | 26.825 | 73.175 |
| 2016-03-019:22:26 AM | 63.5 | 94.438 | 26.825 | 73.175 |
| 2016-03-019:22:30 AM | 63.613 | 94.438 | 26.825 | 73.062 |
| 2016-03-019:22:34 AM | 63.613 | 94.438 | 26.938 | 73.062 |
| 2016-03-019:22:38 AM | 63.613 | 94.55 | 27.162 | 73.175 |
| 2016-03-019:22:42 AM | 63.613 | 94.55 | 27.275 | 73.062 |
| 2016-03-019:22:46 AM | 63.725 | 94.55 | 27.388 | 73.062 |
| 2016-03-019:22:50 AM | 63.725 | 94.55 | 27.388 | 73.175 |
| 2016-03-019:22:54 AM | 63.838 | 94.663 | 27.388 | 73.062 |
| 2016-03-019:22:58 AM | 63.838 | 94.775 | 27.5 | 73.175 |
| 2016-03-019:23:02 AM | 63.838 | 94.775 | 27.612 | 73.062 |
| 2016-03-019:23:06 AM | 63.838 | 94.775 | 27.725 | 73.062 |
| 2016-03-019:23:10 AM | 63.725 | 94.888 | 27.725 | 73.062 |
| 2016-03-019:23:14 AM | 63.725 | 94.888 | 27.725 | 73.062 |
| 2016-03-019:23:18 AM | 63.838 | 95 | 27.5 | 73.062 |
| 2016-03-019:23:22 AM | 63.838 | 95 | 27.275 | 73.062 |
| 2016-03-019:23:26 AM | 63.838 | 95.112 | 27.162 | 73.062 |
| 2016-03-019:23:30 AM | 63.838 | 95.112 | 27.162 | 73.062 |
| 2016-03-019:23:34 AM | 63.725 | 95.112 | 27.275 | 73.062 |
| 2016-03-019:23:38 AM | 63.613 | 95.225 | 27.275 | 73.062 |
| 2016-03-019:23:42 AM | 63.5 | 95.225 | 27.388 | 73.062 |
| 2016-03-019:23:46 AM | 63.162 | 95.338 | 27.388 | 73.062 |
| 2016-03-019:23:51 AM | 63.162 | 95.338 | 27.275 | 73.175 |
| 2016-03-019:23:55 AM | 63.05 | 95.45 | 27.162 | 73.062 |
| 2016-03-019:23:59 AM | 63.162 | 95.45 | 27.275 | 73.062 |
| 2016-03-019:24:03 AM | 63.05 | 95.45 | 27.162 | 73.175 |
| 2016-03-019:24:07 AM | 63.162 | 95.562 | 27.162 | 73.175 |
| 2016-03-019:24:11 AM | 63.275 | 95.562 | 27.275 | 73.175 |
| 2016-03-019:24:15 AM | 63.275 | 95.675 | 27.275 | 73.175 |
| 2016-03-019:24:19 AM | 63.388 | 95.675 | 27.05 | 73.175 |
| 2016-03-019:24:23 AM | 63.275 | 95.675 | 27.05 | 73.175 |
| 2016-03-019:24:27 AM | 63.275 | 95.675 | 26.938 | 73.175 |
| 2016-03-019:24:31 AM | 63.162 | 95.788 | 26.938 | 73.175 |
| 2016-03-019:24:35 AM | 63.162 | 95.788 | 26.938 | 73.175 |
| 2016-03-019:24:39 AM | 63.05 | 95.788 | 27.05 | 73.175 |
| 2016-03-019:24:43 AM | 63.05 | 95.9 | 27.05 | 73.175 |
| 2016-03-019:24:47 AM | 63.05 | 95.9 | 27.162 | 73.175 |
| 2016-03-019:24:51 AM | 63.05 | 95.9 | 27.05 | 73.062 |
| 2016-03-019:24:55 AM | 63.05 | 95.9 | 27.162 | 73.062 |
| 2016-03-019:24:59 AM | 62.938 | 96.012 | 27.05 | 73.062 |
| 2016-03-019:25:03 AM | 62.938 | 96.012 | 27.05 | 72.95 |
| 2016-03-019:25:07 AM | 62.938 | 96.012 | 26.938 | 72.838 |
| 2016-03-019:25:11 AM | 62.825 | 96.125 | 26.938 | 72.725 |
| 2016-03-019:25:15 AM | 62.825 | 96.125 | 26.938 | 72.612 |
| 2016-03-019:25:19 AM | 62.825 | 96.125 | 26.938 | 72.5 |
| 2016-03-019:25:23 AM | 62.825 | 96.125 | 26.825 | 72.612 |
| 2016-03-019:25:27 AM | 62.825 | 96.238 | 26.938 | 72.612 |
| 2016-03-019:25:31 AM | 62.825 | 96.238 | 27.05 | 72.5 |
| 2016-03-019:25:35 AM | 62.825 | 96.238 | 27.05 | 72.612 |
| 2016-03-019:25:39 AM | 62.938 | 96.238 | 27.162 | 72.5 |
| 2016-03-019:25:43 AM | 62.938 | 96.35 | 27.275 | 72.5 |
| 2016-03-019:25:47 AM | 62.938 | 96.35 | 27.275 | 72.388 |
| 2016-03-019:25:51 AM | 62.938 | 96.35 | 27.388 | 72.388 |
| 2016-03-019:25:55 AM | 62.938 | 96.462 | 27.5 | 72.388 |
| 2016-03-019:25:59 AM | 62.938 | 96.462 | 27.612 | 72.388 |
| 2016-03-019:26:03 AM | 62.938 | 96.462 | 27.612 | 72.388 |
| 2016-03-019:26:07 AM | 62.938 | 96.575 | 27.725 | 72.388 |
| 2016-03-019:26:11 AM | 62.938 | 96.575 | 27.725 | 72.275 |
| 2016-03-019:26:15 AM | 62.938 | 96.688 | 27.725 | 72.275 |
| 2016-03-019:26:19 AM | 63.05 | 96.688 | 27.725 | 72.275 |
| 2016-03-019:26:23 AM | 63.05 | 96.8 | 27.838 | 72.275 |
| 2016-03-019:26:27 AM | 63.05 | 96.8 | 27.838 | 72.275 |
| 2016-03-019:26:31 AM | 63.162 | 96.8 | 27.95 | 72.275 |
| 2016-03-019:26:35 AM | 63.162 | 96.8 | 27.95 | 72.162 |
| 2016-03-019:26:39 AM | 63.162 | 96.8 | 27.95 | 72.275 |
| 2016-03-019:26:43 AM | 63.275 | 96.8 | 27.95 | 72.162 |
| 2016-03-019:26:47 AM | 63.275 | 96.913 | 28.062 | 72.162 |
| 2016-03-019:26:51 AM | 63.388 | 96.913 | 28.175 | 72.162 |
| 2016-03-019:26:55 AM | 63.388 | 97.025 | 28.288 | 72.162 |
| 2016-03-019:26:59 AM | 63.5 | 97.025 | 28.288 | 72.05 |
| 2016-03-019:27:04 AM | 63.5 | 97.138 | 28.288 | 72.05 |
| 2016-03-019:27:08 AM | 63.5 | 97.138 | 28.288 | 72.05 |
| 2016-03-019:27:12 AM | 63.613 | 97.25 | 28.4 | 72.05 |
| 2016-03-019:27:16 AM | 63.725 | 97.25 | 28.512 | 72.05 |
| 2016-03-019:27:20 AM | 63.725 | 97.25 | 28.512 | 72.162 |
| 2016-03-019:27:24 AM | 63.838 | 97.362 | 28.512 | 72.05 |
| 2016-03-019:27:28 AM | 63.95 | 97.362 | 28.4 | 72.05 |
| 2016-03-019:27:32 AM | 63.95 | 97.475 | 28.4 | 72.05 |
| 2016-03-019:27:36 AM | 64.062 | 97.475 | 28.512 | 72.05 |
| 2016-03-019:27:40 AM | 64.175 | 97.588 | 28.4 | 72.05 |
| 2016-03-019:27:44 AM | 64.175 | 97.588 | 28.288 | 72.05 |
| 2016-03-019:27:48 AM | 64.287 | 97.588 | 28.062 | 72.05 |
| 2016-03-019:27:52 AM | 64.287 | 97.7 | 28.062 | 72.05 |
| 2016-03-019:27:56 AM | 64.4 | 97.7 | 28.062 | 72.05 |
| 2016-03-019:28:00 AM | 64.287 | 97.7 | 28.062 | 72.05 |
| 2016-03-019:28:04 AM | 64.4 | 97.812 | 27.95 | 72.05 |
| 2016-03-019:28:08 AM | 64.4 | 97.925 | 27.95 | 72.05 |
| 2016-03-019:28:12 AM | 64.287 | 98.038 | 27.95 | 72.05 |
| 2016-03-019:28:16 AM | 64.287 | 98.038 | 28.062 | 72.05 |
| 2016-03-019:28:20 AM | 64.175 | 98.15 | 28.062 | 72.05 |
| 2016-03-019:28:24 AM | 64.175 | 98.15 | 28.175 | 72.05 |
| 2016-03-019:28:28 AM | 64.175 | 98.262 | 28.175 | 72.05 |
| 2016-03-019:28:32 AM | 64.062 | 98.262 | 28.175 | 72.05 |
| 2016-03-019:28:37 AM | 63.95 | 98.375 | 28.288 | 72.05 |
| 2016-03-019:28:41 AM | 63.95 | 98.488 | 28.4 | 72.05 |
| 2016-03-019:28:45 AM | 63.838 | 98.488 | 28.4 | 72.05 |
| 2016-03-019:28:49 AM | 63.725 | 98.6 | 28.512 | 72.05 |
| 2016-03-019:28:53 AM | 63.725 | 98.6 | 28.512 | 72.162 |
| 2016-03-019:28:57 AM | 63.725 | 98.6 | 28.512 | 72.162 |
| 2016-03-019:29:01 AM | 63.725 | 98.712 | 28.512 | 72.162 |
| 2016-03-019:29:05 AM | 63.725 | 98.825 | 28.625 | 72.162 |
| 2016-03-019:29:09 AM | 63.613 | 98.938 | 28.625 | 72.162 |
| 2016-03-019:29:13 AM | 63.613 | 98.938 | 28.625 | 72.162 |
| 2016-03-019:29:17 AM | 63.613 | 99.05 | 28.625 | 72.162 |
| 2016-03-019:29:21 AM | 63.613 | 99.163 | 28.512 | 72.162 |
| 2016-03-019:29:25 AM | 63.613 | 99.163 | 28.4 | 72.162 |
| 2016-03-019:29:29 AM | 63.613 | 99.163 | 28.288 | 72.162 |
| 2016-03-019:29:33 AM | 63.613 | 99.275 | 28.175 | 72.275 |
| 2016-03-019:29:38 AM | 63.613 | 99.275 | 27.95 | 72.275 |
| 2016-03-019:29:42 AM | 63.613 | 99.275 | 27.95 | 72.162 |
| 2016-03-019:29:46 AM | 63.725 | 99.388 | 27.95 | 72.162 |
| 2016-03-019:29:50 AM | 63.725 | 99.388 | 27.95 | 72.162 |
| 2016-03-019:29:54 AM | 63.725 | 99.388 | 27.95 | 72.275 |
| 2016-03-019:29:58 AM | 63.725 | 99.388 | 27.95 | 72.275 |
| 2016-03-019:30:02 AM | 63.725 | 99.5 | 27.95 | 72.162 |
| 2016-03-019:30:06 AM | 63.725 | 99.5 | 27.95 | 72.275 |
| 2016-03-019:30:10 AM | 63.838 | 99.5 | 28.062 | 72.275 |
| 2016-03-019:30:14 AM | 63.838 | 99.5 | 27.95 | 72.275 |
| 2016-03-019:30:18 AM | 63.838 | 99.612 | 27.95 | 72.275 |
| 2016-03-019:30:22 AM | 63.838 | 99.612 | 27.838 | 72.275 |
| 2016-03-019:30:26 AM | 63.838 | 99.612 | 27.838 | 72.275 |
| 2016-03-019:30:30 AM | 63.95 | 99.612 | 27.838 | 72.275 |
| 2016-03-019:30:34 AM | 64.062 | 99.725 | 27.838 | 72.275 |
| 2016-03-019:30:38 AM | 64.062 | 99.725 | 27.725 | 72.275 |
| 2016-03-019:30:43 AM | 64.062 | 99.725 | 27.612 | 72.275 |
| 2016-03-019:30:47 AM | 64.175 | 99.838 | 27.725 | 72.275 |
| 2016-03-019:30:51 AM | 64.175 | 99.838 | 27.725 | 72.275 |
| 2016-03-019:30:55 AM | 64.287 | 99.95 | 27.725 | 72.275 |
| 2016-03-019:30:59 AM | 64.175 | 99.95 | 27.612 | 72.275 |
| 2016-03-019:31:03 AM | 64.287 | 99.95 | 27.5 | 72.275 |
| 2016-03-019:31:07 AM | 64.287 | 99.95 | 27.388 | 72.275 |
| 2016-03-019:31:11 AM | 64.287 | 99.95 | 27.05 | 72.275 |
| 2016-03-019:31:15 AM | 64.4 | 100.062 | 26.825 | 72.275 |
| 2016-03-019:31:19 AM | 64.4 | 100.062 | 26.6 | 72.275 |
| 2016-03-019:31:23 AM | 64.4 | 100.062 | 26.488 | 72.275 |
| 2016-03-019:31:27 AM | 64.287 | 100.175 | 26.488 | 72.275 |
| 2016-03-019:31:31 AM | 64.287 | 100.175 | 26.488 | 72.275 |
| 2016-03-019:31:35 AM | 64.062 | 100.175 | 26.6 | 72.388 |
| 2016-03-019:31:39 AM | 63.95 | 100.288 | 26.712 | 72.275 |
| 2016-03-019:31:44 AM | 63.838 | 100.175 | 26.6 | 72.388 |
| 2016-03-019:31:48 AM | 63.725 | 100.288 | 26.6 | 72.388 |
| 2016-03-019:31:52 AM | 63.725 | 100.288 | 26.6 | 72.388 |
| 2016-03-019:31:56 AM | 63.725 | 100.288 | 26.488 | 72.275 |
| 2016-03-019:32:00 AM | 63.725 | 100.288 | 26.375 | 72.388 |
| 2016-03-019:32:04 AM | 63.725 | 100.288 | 26.375 | 72.388 |
| 2016-03-019:32:08 AM | 63.725 | 100.288 | 26.488 | 72.388 |
| 2016-03-019:32:12 AM | 63.838 | 100.288 | 26.375 | 72.388 |
| 2016-03-019:32:16 AM | 63.725 | 100.288 | 26.375 | 72.388 |
| 2016-03-019:32:20 AM | 63.838 | 100.4 | 26.488 | 72.388 |
| 2016-03-019:32:24 AM | 63.838 | 100.288 | 26.6 | 72.388 |
| 2016-03-019:32:28 AM | 63.838 | 100.4 | 26.6 | 72.388 |
| 2016-03-019:32:32 AM | 63.838 | 100.4 | 26.6 | 72.388 |
| 2016-03-019:32:36 AM | 63.95 | 100.4 | 26.6 | 72.388 |
| 2016-03-019:32:40 AM | 63.95 | 100.4 | 26.262 | 72.388 |
| 2016-03-019:32:44 AM | 63.95 | 100.512 | 26.038 | 72.388 |
| 2016-03-019:32:48 AM | 63.95 | 100.512 | 25.925 | 72.388 |
| 2016-03-019:32:52 AM | 63.95 | 100.512 | 25.7 | 72.388 |
| 2016-03-019:32:56 AM | 63.95 | 100.512 | 25.588 | 72.5 |
| 2016-03-019:33:00 AM | 63.95 | 100.512 | 25.362 | 72.388 |
| 2016-03-019:33:05 AM | 63.95 | 100.512 | 25.25 | 72.5 |
| 2016-03-019:33:09 AM | 63.95 | 100.625 | 25.25 | 72.388 |
| 2016-03-019:33:13 AM | 63.95 | 100.625 | 25.25 | 72.388 |
| 2016-03-019:33:17 AM | 63.95 | 100.738 | 25.138 | 72.388 |
| 2016-03-019:33:21 AM | 63.95 | 100.625 | 24.912 | 72.388 |
| 2016-03-019:33:25 AM | 64.062 | 100.738 | 24.688 | 72.5 |
| 2016-03-019:33:29 AM | 63.95 | 100.738 | 24.688 | 72.5 |
| 2016-03-019:33:33 AM | 63.95 | 100.738 | 24.912 | 72.5 |
| 2016-03-019:33:37 AM | 63.838 | 100.738 | 24.912 | 72.388 |
| 2016-03-019:33:41 AM | 63.838 | 100.738 | 25.025 | 72.5 |
| 2016-03-019:33:45 AM | 63.838 | 100.738 | 25.138 | 72.5 |
| 2016-03-019:33:49 AM | 63.838 | 100.738 | 25.25 | 72.5 |
| 2016-03-019:33:53 AM | 63.725 | 100.738 | 25.362 | 72.5 |
| 2016-03-019:33:57 AM | 63.725 | 100.85 | 25.362 | 72.5 |
| 2016-03-019:34:01 AM | 63.725 | 100.85 | 25.475 | 72.5 |
| 2016-03-019:34:06 AM | 63.838 | 100.85 | 25.7 | 72.5 |
| 2016-03-019:34:10 AM | 63.838 | 100.85 | 25.588 | 72.388 |
| 2016-03-019:34:14 AM | 63.838 | 100.962 | 25.7 | 72.5 |
| 2016-03-019:34:18 AM | 63.838 | 100.962 | 25.7 | 72.5 |
| 2016-03-019:34:22 AM | 63.838 | 100.962 | 25.7 | 72.5 |
| 2016-03-019:34:26 AM | 63.95 | 100.962 | 25.812 | 72.5 |
| 2016-03-019:34:30 AM | 63.95 | 100.962 | 25.812 | 72.5 |
| 2016-03-019:34:34 AM | 63.95 | 100.962 | 25.925 | 72.5 |
| 2016-03-019:34:38 AM | 64.062 | 100.962 | 25.812 | 72.5 |
| 2016-03-019:34:42 AM | 64.062 | 101.075 | 25.812 | 72.5 |
| 2016-03-019:34:46 AM | 64.175 | 101.075 | 25.7 | 72.5 |
| 2016-03-019:34:50 AM | 64.062 | 101.075 | 25.7 | 72.5 |
| 2016-03-019:34:54 AM | 64.062 | 101.075 | 25.812 | 72.5 |
| 2016-03-019:34:58 AM | 64.175 | 101.188 | 25.812 | 72.5 |
| 2016-03-019:35:06 AM | 64.175 | 101.075 | 25.925 | 72.5 |
| 2016-03-019:35:11 AM | 64.175 | 101.188 | 26.038 | 72.5 |
| 2016-03-019:35:15 AM | 64.175 | 101.3 | 26.038 | 72.5 |
| 2016-03-019:35:19 AM | 64.175 | 101.3 | 26.038 | 72.5 |
| 2016-03-019:35:23 AM | 64.175 | 101.3 | 26.038 | 72.5 |
| 2016-03-019:35:27 AM | 64.287 | 101.3 | 26.038 | 72.5 |
| 2016-03-019:35:31 AM | 64.287 | 101.413 | 26.15 | 72.5 |
| 2016-03-019:35:35 AM | 64.287 | 101.413 | 26.038 | 72.5 |
| 2016-03-019:35:39 AM | 64.287 | 101.525 | 26.038 | 72.5 |
| 2016-03-019:35:43 AM | 64.175 | 101.525 | 25.588 | 72.5 |
| 2016-03-019:35:47 AM | 64.175 | 101.525 | 25.25 | 72.5 |
| 2016-03-019:35:51 AM | 64.175 | 101.638 | 25.362 | 72.5 |
| 2016-03-019:35:55 AM | 64.287 | 101.638 | 25.362 | 72.5 |
| 2016-03-019:35:59 AM | 64.175 | 101.525 | 25.475 | 72.5 |
| 2016-03-019:36:03 AM | 64.175 | 101.525 | 25.475 | 72.5 |
| 2016-03-019:36:07 AM | 64.062 | 101.638 | 25.588 | 72.5 |
| 2016-03-019:36:12 AM | 64.062 | 101.638 | 25.7 | 72.5 |
| 2016-03-019:36:16 AM | 64.062 | 101.638 | 25.588 | 72.5 |
| 2016-03-019:36:20 AM | 64.062 | 101.75 | 25.588 | 72.5 |
| 2016-03-019:36:24 AM | 64.062 | 101.75 | 25.588 | 72.5 |
| 2016-03-019:36:28 AM | 64.062 | 101.75 | 25.7 | 72.5 |
| 2016-03-019:36:32 AM | 64.175 | 101.75 | 25.812 | 72.5 |
| 2016-03-019:36:36 AM | 64.175 | 101.75 | 25.925 | 72.5 |
| 2016-03-019:36:40 AM | 64.175 | 101.862 | 25.812 | 72.5 |
| 2016-03-019:36:44 AM | 64.287 | 101.75 | 25.812 | 72.5 |
| 2016-03-019:36:48 AM | 64.287 | 101.862 | 25.812 | 72.5 |
| 2016-03-019:36:52 AM | 64.287 | 101.862 | 25.7 | 72.5 |
| 2016-03-019:36:56 AM | 64.287 | 101.862 | 25.7 | 72.5 |
| 2016-03-019:37:00 AM | 64.287 | 101.862 | 25.588 | 72.612 |
| 2016-03-019:37:04 AM | 64.4 | 101.975 | 25.588 | 72.5 |
| 2016-03-019:37:08 AM | 64.512 | 101.975 | 25.475 | 72.5 |
| 2016-03-019:37:12 AM | 64.4 | 102.088 | 25.362 | 72.612 |
| 2016-03-019:37:16 AM | 64.512 | 102.088 | 25.362 | 72.612 |
| 2016-03-019:37:20 AM | 64.512 | 102.088 | 25.362 | 72.5 |
| 2016-03-019:37:24 AM | 64.512 | 102.088 | 25.25 | 72.612 |
| 2016-03-019:37:28 AM | 64.512 | 102.2 | 25.25 | 72.612 |
| 2016-03-019:37:32 AM | 64.4 | 102.2 | 25.362 | 72.612 |
| 2016-03-019:37:36 AM | 64.4 | 102.2 | 25.362 | 72.5 |
| 2016-03-019:37:40 AM | 64.287 | 102.2 | 25.475 | 72.612 |
| 2016-03-019:37:44 AM | 64.287 | 102.2 | 25.475 | 72.612 |
| 2016-03-019:37:48 AM | 64.287 | 102.312 | 25.25 | 72.612 |
| 2016-03-019:37:52 AM | 64.287 | 102.312 | 25.138 | 72.612 |
| 2016-03-019:37:56 AM | 64.175 | 102.312 | 25.25 | 72.612 |
| 2016-03-019:38:01 AM | 64.175 | 102.425 | 25.138 | 72.612 |
| 2016-03-019:38:05 AM | 64.175 | 102.425 | 25.138 | 72.612 |
| 2016-03-019:38:09 AM | 64.175 | 102.425 | 24.912 | 72.612 |
| 2016-03-019:38:13 AM | 64.175 | 102.425 | 25.025 | 72.612 |
| 2016-03-019:38:17 AM | 64.062 | 102.425 | 25.025 | 72.612 |
| 2016-03-019:38:21 AM | 64.062 | 102.425 | 25.025 | 72.725 |
| 2016-03-019:38:25 AM | 64.062 | 102.425 | 24.912 | 72.612 |
| 2016-03-019:38:29 AM | 64.062 | 102.425 | 25.025 | 72.612 |
| 2016-03-019:38:33 AM | 64.062 | 102.425 | 25.025 | 72.612 |
| 2016-03-019:38:37 AM | 64.175 | 102.425 | 25.025 | 72.612 |
| 2016-03-019:38:41 AM | 64.175 | 102.425 | 24.8 | 72.612 |
| 2016-03-019:38:45 AM | 64.175 | 102.538 | 24.8 | 72.612 |
| 2016-03-019:38:49 AM | 64.175 | 102.538 | 24.8 | 72.725 |
| 2016-03-019:38:53 AM | 64.287 | 102.538 | 24.8 | 72.725 |
| 2016-03-019:38:57 AM | 64.287 | 102.538 | 24.8 | 72.725 |
| 2016-03-019:39:01 AM | 64.287 | 102.538 | 24.688 | 72.725 |
| 2016-03-019:39:05 AM | 64.287 | 102.538 | 24.35 | 72.725 |
| 2016-03-019:39:09 AM | 64.287 | 102.538 | 24.238 | 72.725 |
| 2016-03-019:39:13 AM | 64.287 | 102.538 | 24.012 | 72.725 |
| 2016-03-019:39:17 AM | 64.287 | 102.538 | 24.012 | 72.725 |
| 2016-03-019:39:21 AM | 64.4 | 102.425 | 24.012 | 72.725 |
| 2016-03-019:39:25 AM | 64.287 | 102.538 | 24.125 | 72.725 |
| 2016-03-019:39:29 AM | 64.4 | 102.538 | 24.125 | 72.612 |
| 2016-03-019:39:33 AM | 64.4 | 102.538 | 24.238 | 72.725 |
| 2016-03-019:39:37 AM | 64.4 | 102.538 | 24.125 | 72.725 |
| 2016-03-019:39:41 AM | 64.4 | 102.538 | 24.125 | 72.725 |
| 2016-03-019:39:45 AM | 64.4 | 102.538 | 24.012 | 72.725 |
| 2016-03-019:39:49 AM | 64.4 | 102.538 | 24.012 | 72.725 |
| 2016-03-019:39:53 AM | 64.4 | 102.538 | 24.012 | 72.725 |
| 2016-03-019:39:57 AM | 64.512 | 102.425 | 24.125 | 72.725 |
| 2016-03-019:40:01 AM | 64.512 | 102.425 | 24.238 | 72.725 |
| 2016-03-019:40:05 AM | 64.512 | 102.425 | 24.35 | 72.725 |
| 2016-03-019:40:09 AM | 64.512 | 102.538 | 24.462 | 72.725 |
| 2016-03-019:40:13 AM | 64.512 | 102.538 | 24.575 | 72.725 |
| 2016-03-019:40:18 AM | 64.512 | 102.538 | 24.688 | 72.725 |
| 2016-03-019:40:22 AM | 64.625 | 102.538 | 24.688 | 72.725 |
| 2016-03-019:40:26 AM | 64.625 | 102.538 | 24.688 | 72.725 |
| 2016-03-019:40:30 AM | 64.625 | 102.538 | 24.575 | 72.725 |
| 2016-03-019:40:34 AM | 64.625 | 102.538 | 24.462 | 72.838 |
| 2016-03-019:40:38 AM | 64.625 | 102.538 | 24.462 | 72.838 |
| 2016-03-019:40:42 AM | 64.625 | 102.538 | 24.575 | 72.838 |
| 2016-03-019:40:46 AM | 64.512 | 102.538 | 24.575 | 72.838 |
| 2016-03-019:40:50 AM | 64.512 | 102.538 | 24.462 | 72.838 |
| 2016-03-019:40:54 AM | 64.4 | 102.538 | 24.35 | 72.95 |
| 2016-03-019:40:58 AM | 64.287 | 102.65 | 24.35 | 72.95 |
| 2016-03-019:41:02 AM | 64.175 | 102.538 | 24.238 | 72.838 |
| 2016-03-019:41:06 AM | 64.062 | 102.65 | 24.238 | 72.838 |
| 2016-03-019:41:10 AM | 64.175 | 102.538 | 24.238 | 72.838 |
| 2016-03-019:41:14 AM | 64.062 | 102.65 | 24.238 | 72.95 |
| 2016-03-019:41:18 AM | 64.062 | 102.538 | 24.35 | 72.95 |
| 2016-03-019:41:22 AM | 64.062 | 102.538 | 24.238 | 72.95 |
| 2016-03-019:41:26 AM | 64.062 | 102.538 | 24.35 | 72.95 |
| 2016-03-019:41:30 AM | 64.062 | 102.538 | 24.462 | 72.95 |
| 2016-03-019:41:34 AM | 64.062 | 102.538 | 24.575 | 72.838 |
| 2016-03-019:41:38 AM | 64.175 | 102.65 | 24.575 | 72.95 |
| 2016-03-019:41:42 AM | 64.175 | 102.65 | 24.688 | 72.95 |
| 2016-03-019:41:46 AM | 64.175 | 102.762 | 24.688 | 72.95 |
| 2016-03-019:41:50 AM | 64.287 | 102.762 | 24.8 | 72.95 |
| 2016-03-019:41:54 AM | 64.287 | 102.762 | 24.8 | 72.95 |
| 2016-03-019:41:58 AM | 64.175 | 102.762 | 24.8 | 72.95 |
| 2016-03-019:42:02 AM | 64.062 | 102.762 | 24.912 | 72.95 |
| 2016-03-019:42:06 AM | 63.95 | 102.762 | 25.025 | 72.95 |
| 2016-03-019:42:10 AM | 63.95 | 102.762 | 25.025 | 72.95 |
| 2016-03-019:42:14 AM | 63.95 | 102.875 | 25.138 | 72.95 |
| 2016-03-019:42:18 AM | 63.95 | 102.875 | 25.25 | 72.95 |
| 2016-03-019:42:22 AM | 63.95 | 102.875 | 25.25 | 72.95 |
| 2016-03-019:42:26 AM | 63.95 | 102.988 | 25.362 | 72.95 |
| 2016-03-019:42:31 AM | 63.95 | 102.988 | 25.362 | 72.95 |
| 2016-03-019:42:35 AM | 63.95 | 103.1 | 25.362 | 72.95 |
| 2016-03-019:42:39 AM | 63.95 | 103.1 | 25.362 | 72.95 |
| 2016-03-019:42:43 AM | 63.95 | 103.1 | 25.475 | 72.95 |
| 2016-03-019:42:47 AM | 63.95 | 103.1 | 25.588 | 72.95 |
| 2016-03-019:42:51 AM | 63.95 | 103.212 | 25.588 | 72.95 |
| 2016-03-019:42:55 AM | 63.95 | 103.212 | 25.7 | 72.95 |
| 2016-03-019:42:59 AM | 64.062 | 103.325 | 25.812 | 72.95 |
| 2016-03-019:43:03 AM | 63.95 | 103.325 | 25.7 | 72.838 |
| 2016-03-019:43:07 AM | 63.95 | 103.325 | 25.812 | 72.838 |
| 2016-03-019:43:11 AM | 64.062 | 103.325 | 25.812 | 72.95 |
| 2016-03-019:43:15 AM | 63.95 | 103.438 | 25.7 | 72.95 |
| 2016-03-019:43:19 AM | 64.062 | 103.438 | 25.588 | 72.95 |
| 2016-03-019:43:23 AM | 64.062 | 103.55 | 25.475 | 72.95 |
| 2016-03-019:43:27 AM | 64.062 | 103.55 | 25.25 | 72.95 |
| 2016-03-019:43:31 AM | 64.062 | 103.663 | 25.025 | 72.838 |
| 2016-03-019:43:39 AM | 63.95 | 103.55 | 24.8 | 72.838 |
| 2016-03-019:43:43 AM | 63.838 | 103.663 | 24.688 | 72.838 |
| 2016-03-019:43:47 AM | 63.725 | 103.663 | 24.8 | 72.95 |
| 2016-03-019:43:51 AM | 63.613 | 103.663 | 24.8 | 72.95 |
| 2016-03-019:43:55 AM | 63.613 | 103.663 | 24.912 | 72.838 |
| 2016-03-019:43:59 AM | 63.613 | 103.775 | 24.912 | 72.95 |
| 2016-03-019:44:03 AM | 63.5 | 103.775 | 25.138 | 72.95 |
| 2016-03-019:44:07 AM | 63.5 | 103.775 | 25.138 | 72.95 |
| 2016-03-019:44:11 AM | 63.613 | 103.775 | 25.138 | 72.95 |
| 2016-03-019:44:15 AM | 63.5 | 103.775 | 25.362 | 72.95 |
| 2016-03-019:44:19 AM | 63.613 | 103.775 | 25.475 | 72.95 |
| 2016-03-019:44:23 AM | 63.613 | 103.775 | 25.362 | 72.95 |
| 2016-03-019:44:27 AM | 63.613 | 103.775 | 25.25 | 72.95 |
| 2016-03-019:44:31 AM | 63.613 | 103.888 | 25.138 | 72.95 |
| 2016-03-019:44:35 AM | 63.613 | 103.888 | 25.138 | 72.95 |
| 2016-03-019:44:40 AM | 63.725 | 103.888 | 25.025 | 72.95 |
| 2016-03-019:44:44 AM | 63.725 | 103.888 | 25.025 | 72.95 |
| 2016-03-019:44:48 AM | 63.838 | 104 | 24.912 | 72.95 |
| 2016-03-019:44:52 AM | 63.838 | 104 | 24.912 | 72.95 |
| 2016-03-019:44:56 AM | 63.838 | 104 | 24.912 | 72.95 |
| 2016-03-019:45:00 AM | 63.838 | 104.112 | 25.025 | 72.95 |
| 2016-03-019:45:04 AM | 63.838 | 104 | 24.912 | 72.95 |
| 2016-03-019:45:08 AM | 63.838 | 104 | 24.8 | 72.95 |
| 2016-03-019:45:12 AM | 63.95 | 104 | 24.912 | 72.95 |
| 2016-03-019:45:16 AM | 63.95 | 104.112 | 25.025 | 72.95 |
| 2016-03-019:45:20 AM | 64.062 | 104.112 | 25.138 | 72.95 |
| 2016-03-019:45:24 AM | 64.062 | 104.112 | 25.138 | 72.95 |
| 2016-03-019:45:28 AM | 64.175 | 104.112 | 25.25 | 72.95 |
| 2016-03-019:45:32 AM | 64.175 | 104.112 | 25.25 | 72.95 |
| 2016-03-019:45:36 AM | 64.175 | 104.112 | 25.362 | 72.95 |
| 2016-03-019:45:40 AM | 64.287 | 104.112 | 25.25 | 72.95 |
| 2016-03-019:45:44 AM | 64.287 | 104.225 | 25.25 | 72.95 |
| 2016-03-019:45:48 AM | 64.4 | 104.225 | 25.25 | 72.95 |
| 2016-03-019:45:52 AM | 64.4 | 104.225 | 25.25 | 72.95 |
| 2016-03-019:45:56 AM | 64.4 | 104.225 | 25.25 | 72.95 |
| 2016-03-019:46:00 AM | 64.512 | 104.225 | 25.25 | 72.95 |
| 2016-03-019:46:04 AM | 64.4 | 104.338 | 25.138 | 72.95 |
| 2016-03-019:46:08 AM | 64.512 | 104.338 | 25.25 | 72.838 |
| 2016-03-019:46:12 AM | 64.512 | 104.338 | 25.25 | 72.95 |
| 2016-03-019:46:16 AM | 64.512 | 104.45 | 25.25 | 72.95 |
| 2016-03-019:46:20 AM | 64.512 | 104.45 | 25.25 | 72.95 |
| 2016-03-019:46:24 AM | 64.625 | 104.45 | 25.362 | 72.95 |
| 2016-03-019:46:28 AM | 64.625 | 104.45 | 25.362 | 72.95 |
| 2016-03-019:46:32 AM | 64.625 | 104.562 | 25.25 | 72.95 |
| 2016-03-019:46:36 AM | 64.625 | 104.562 | 25.25 | 72.95 |
| 2016-03-019:46:40 AM | 64.738 | 104.562 | 25.025 | 72.95 |
| 2016-03-019:46:45 AM | 64.625 | 104.675 | 25.025 | 72.95 |
| 2016-03-019:46:49 AM | 64.512 | 104.675 | 25.138 | 72.95 |
| 2016-03-019:46:53 AM | 64.4 | 104.675 | 25.25 | 72.95 |
| 2016-03-019:46:57 AM | 64.4 | 104.788 | 25.25 | 72.95 |
| 2016-03-019:47:01 AM | 64.287 | 104.788 | 25.362 | 72.95 |
| 2016-03-019:47:05 AM | 64.287 | 104.9 | 25.362 | 72.95 |
| 2016-03-019:47:09 AM | 64.062 | 104.9 | 25.362 | 72.95 |
| 2016-03-019:47:13 AM | 64.062 | 105.012 | 25.475 | 72.95 |
| 2016-03-019:47:17 AM | 64.062 | 105.125 | 25.588 | 72.95 |
| 2016-03-019:47:21 AM | 64.062 | 105.125 | 25.588 | 72.95 |
| 2016-03-019:47:25 AM | 64.062 | 105.238 | 25.588 | 72.95 |
| 2016-03-019:47:29 AM | 64.062 | 105.238 | 25.588 | 72.95 |
| 2016-03-019:47:33 AM | 63.95 | 105.238 | 25.7 | 72.95 |
| 2016-03-019:47:37 AM | 63.95 | 105.35 | 25.812 | 72.95 |
| 2016-03-019:47:41 AM | 63.95 | 105.35 | 25.812 | 72.95 |
| 2016-03-019:47:45 AM | 63.95 | 105.462 | 25.925 | 72.95 |
| 2016-03-019:47:49 AM | 64.062 | 105.575 | 26.038 | 72.95 |
| 2016-03-019:47:53 AM | 64.062 | 105.575 | 25.925 | 72.95 |
| 2016-03-019:47:57 AM | 64.062 | 105.575 | 25.7 | 72.95 |
| 2016-03-019:48:01 AM | 64.175 | 105.688 | 25.7 | 72.95 |
| 2016-03-019:48:09 AM | 64.175 | 105.688 | 25.812 | 72.95 |
| 2016-03-019:48:13 AM | 64.175 | 105.8 | 25.925 | 72.95 |
| 2016-03-019:48:17 AM | 64.287 | 105.8 | 26.038 | 72.95 |
| 2016-03-019:48:21 AM | 64.287 | 105.8 | 26.038 | 72.95 |
| 2016-03-019:48:25 AM | 64.287 | 105.913 | 26.038 | 72.95 |
| 2016-03-019:48:29 AM | 64.287 | 105.913 | 26.15 | 72.95 |
| 2016-03-019:48:33 AM | 64.287 | 106.025 | 26.038 | 72.95 |
| 2016-03-019:48:37 AM | 64.287 | 106.025 | 25.925 | 72.95 |
| 2016-03-019:48:41 AM | 64.287 | 106.025 | 25.812 | 72.95 |
| 2016-03-019:48:45 AM | 64.287 | 106.138 | 25.812 | 72.95 |
| 2016-03-019:48:49 AM | 64.4 | 106.25 | 25.925 | 72.95 |
| 2016-03-019:48:53 AM | 64.4 | 106.25 | 26.038 | 72.95 |
| 2016-03-019:48:57 AM | 64.4 | 106.25 | 26.15 | 72.95 |
| 2016-03-019:49:01 AM | 64.4 | 106.25 | 26.262 | 72.95 |
| 2016-03-019:49:05 AM | 64.287 | 106.362 | 26.375 | 72.95 |
| 2016-03-019:49:09 AM | 64.175 | 106.475 | 26.375 | 72.95 |
| 2016-03-019:49:13 AM | 64.175 | 106.588 | 26.488 | 73.062 |
| 2016-03-019:49:17 AM | 64.062 | 106.588 | 26.6 | 72.95 |
| 2016-03-019:49:21 AM | 64.062 | 106.7 | 26.6 | 72.95 |
| 2016-03-019:49:25 AM | 63.95 | 106.812 | 26.488 | 72.95 |
| 2016-03-019:49:29 AM | 63.95 | 106.812 | 26.262 | 72.95 |
| 2016-03-019:49:33 AM | 63.95 | 106.812 | 26.15 | 72.95 |
| 2016-03-019:49:37 AM | 63.838 | 106.925 | 26.038 | 72.95 |
| 2016-03-019:49:41 AM | 63.838 | 106.925 | 26.038 | 72.95 |
| 2016-03-019:49:45 AM | 63.838 | 107.038 | 26.262 | 72.95 |
| 2016-03-019:49:49 AM | 63.725 | 107.15 | 26.262 | 72.95 |
| 2016-03-019:49:53 AM | 63.725 | 107.15 | 26.375 | 73.062 |
| 2016-03-019:49:57 AM | 63.725 | 107.15 | 26.375 | 73.062 |
| 2016-03-019:50:02 AM | 63.725 | 107.262 | 26.488 | 72.95 |
| 2016-03-019:50:06 AM | 63.725 | 107.262 | 26.375 | 72.95 |
| 2016-03-019:50:10 AM | 63.613 | 107.262 | 26.262 | 72.95 |
| 2016-03-019:50:14 AM | 63.725 | 107.262 | 26.262 | 72.95 |
| 2016-03-019:50:18 AM | 63.725 | 107.375 | 26.15 | 72.95 |
| 2016-03-019:50:22 AM | 63.838 | 107.375 | 26.15 | 73.062 |
| 2016-03-019:50:26 AM | 63.838 | 107.488 | 26.15 | 73.062 |
| 2016-03-019:50:30 AM | 63.838 | 107.488 | 26.15 | 73.062 |
| 2016-03-019:50:34 AM | 63.725 | 107.6 | 25.925 | 72.95 |
| 2016-03-019:50:38 AM | 63.725 | 107.6 | 25.925 | 73.062 |
| 2016-03-019:50:42 AM | 63.725 | 107.712 | 25.925 | 73.062 |
| 2016-03-019:50:46 AM | 63.725 | 107.712 | 25.812 | 73.062 |
| 2016-03-019:50:50 AM | 63.838 | 107.825 | 25.812 | 73.062 |
| 2016-03-019:50:54 AM | 63.838 | 107.825 | 25.7 | 73.062 |
| 2016-03-019:50:58 AM | 63.95 | 107.825 | 25.7 | 73.062 |
| 2016-03-019:51:02 AM | 63.95 | 107.938 | 25.812 | 73.062 |
| 2016-03-019:51:06 AM | 64.062 | 107.938 | 25.812 | 73.062 |
| 2016-03-019:51:10 AM | 64.062 | 107.938 | 25.812 | 73.175 |
| 2016-03-019:51:14 AM | 64.175 | 107.938 | 25.812 | 73.175 |
| 2016-03-019:51:18 AM | 64.287 | 108.05 | 25.812 | 73.175 |
| 2016-03-019:51:22 AM | 64.287 | 108.05 | 25.812 | 73.175 |
| 2016-03-019:51:26 AM | 64.287 | 108.05 | 25.812 | 73.175 |
| 2016-03-019:51:30 AM | 64.4 | 108.05 | 25.812 | 73.175 |
| 2016-03-019:51:34 AM | 64.512 | 108.163 | 25.812 | 73.175 |
| 2016-03-019:51:38 AM | 64.625 | 108.163 | 25.7 | 73.175 |
| 2016-03-019:51:42 AM | 64.625 | 108.163 | 25.7 | 73.175 |
| 2016-03-019:51:47 AM | 64.738 | 108.275 | 25.812 | 73.175 |
| 2016-03-019:51:51 AM | 64.738 | 108.275 | 25.925 | 73.175 |
| 2016-03-019:51:55 AM | 64.85 | 108.275 | 26.038 | 73.175 |
| 2016-03-019:51:59 AM | 64.85 | 108.275 | 26.038 | 73.175 |
| 2016-03-019:52:03 AM | 64.963 | 108.275 | 26.15 | 73.175 |
| 2016-03-019:52:07 AM | 64.963 | 108.388 | 26.15 | 73.175 |
| 2016-03-019:52:11 AM | 64.963 | 108.275 | 26.15 | 73.175 |
| 2016-03-019:52:15 AM | 65.075 | 108.388 | 26.15 | 73.175 |
| 2016-03-019:52:19 AM | 65.075 | 108.388 | 26.262 | 73.175 |
| 2016-03-019:52:23 AM | 65.188 | 108.5 | 26.262 | 73.175 |
| 2016-03-019:52:27 AM | 65.188 | 108.5 | 26.262 | 73.175 |
| 2016-03-019:52:31 AM | 65.188 | 108.5 | 26.15 | 73.175 |
| 2016-03-019:52:35 AM | 65.3 | 108.612 | 26.038 | 73.175 |
| 2016-03-019:52:39 AM | 65.412 | 108.612 | 25.925 | 73.175 |
| 2016-03-019:52:43 AM | 65.412 | 108.612 | 25.812 | 73.062 |
| 2016-03-019:52:47 AM | 65.412 | 108.612 | 25.7 | 73.175 |
| 2016-03-019:52:51 AM | 65.525 | 108.725 | 25.812 | 73.175 |
| 2016-03-019:52:55 AM | 65.525 | 108.725 | 25.7 | 73.175 |
| 2016-03-019:52:59 AM | 65.638 | 108.725 | 25.812 | 73.175 |
| 2016-03-019:53:03 AM | 65.638 | 108.725 | 25.812 | 73.175 |
| 2016-03-019:53:08 AM | 65.638 | 108.725 | 25.7 | 73.175 |
| 2016-03-019:53:12 AM | 65.638 | 108.838 | 25.7 | 73.175 |
| 2016-03-019:53:16 AM | 65.638 | 108.838 | 25.588 | 73.175 |
| 2016-03-019:53:20 AM | 65.638 | 108.838 | 25.7 | 73.175 |
| 2016-03-019:53:24 AM | 65.75 | 108.838 | 25.812 | 73.175 |
| 2016-03-019:53:28 AM | 65.75 | 108.838 | 25.812 | 73.175 |
| 2016-03-019:53:32 AM | 65.75 | 108.95 | 25.812 | 73.175 |
| 2016-03-019:53:36 AM | 65.862 | 108.95 | 25.812 | 73.175 |
| 2016-03-019:53:40 AM | 65.862 | 109.062 | 25.925 | 73.175 |
| 2016-03-019:53:44 AM | 65.862 | 109.062 | 26.038 | 73.175 |
| 2016-03-019:53:48 AM | 65.862 | 109.062 | 26.15 | 73.175 |
| 2016-03-019:53:56 AM | 65.862 | 109.062 | 26.15 | 73.175 |
| 2016-03-019:54:00 AM | 65.862 | 109.175 | 26.15 | 73.175 |
| 2016-03-019:54:04 AM | 65.862 | 109.175 | 26.262 | 73.175 |
| 2016-03-019:54:08 AM | 65.75 | 109.175 | 26.375 | 73.175 |
| 2016-03-019:54:12 AM | 65.75 | 109.175 | 26.262 | 73.175 |
| 2016-03-019:54:16 AM | 65.75 | 109.288 | 26.375 | 73.175 |
| 2016-03-019:54:20 AM | 65.638 | 109.288 | 26.262 | 73.175 |
| 2016-03-019:54:24 AM | 65.638 | 109.4 | 26.262 | 73.175 |
| 2016-03-019:54:28 AM | 65.638 | 109.4 | 26.15 | 73.175 |
| 2016-03-019:54:32 AM | 65.638 | 109.4 | 26.262 | 73.175 |
| 2016-03-019:54:36 AM | 65.638 | 109.4 | 26.375 | 73.288 |
| 2016-03-019:54:40 AM | 65.638 | 109.4 | 26.488 | 73.175 |
| 2016-03-019:54:44 AM | 65.638 | 109.512 | 26.262 | 73.175 |
| 2016-03-019:54:49 AM | 65.525 | 109.512 | 26.038 | 73.175 |
| 2016-03-019:54:53 AM | 65.525 | 109.625 | 25.925 | 73.175 |
| 2016-03-019:54:57 AM | 65.412 | 109.512 | 25.7 | 73.175 |
| 2016-03-019:55:01 AM | 65.412 | 109.625 | 25.588 | 73.175 |
| 2016-03-019:55:05 AM | 65.412 | 109.625 | 25.475 | 73.175 |
| 2016-03-019:55:09 AM | 65.412 | 109.738 | 25.362 | 73.175 |
| 2016-03-019:55:13 AM | 65.412 | 109.738 | 25.25 | 73.175 |
| 2016-03-019:55:17 AM | 65.412 | 109.738 | 24.912 | 73.175 |
| 2016-03-019:55:21 AM | 65.412 | 109.738 | 24.8 | 73.175 |
| 2016-03-019:55:25 AM | 65.412 | 109.85 | 24.912 | 73.175 |
| 2016-03-019:55:29 AM | 65.412 | 109.85 | 25.025 | 73.175 |
| 2016-03-019:55:33 AM | 65.412 | 109.85 | 25.025 | 73.175 |
| 2016-03-019:55:37 AM | 65.3 | 109.85 | 25.138 | 73.175 |
| 2016-03-019:55:41 AM | 65.3 | 109.962 | 25.25 | 73.175 |
| 2016-03-019:55:45 AM | 65.3 | 109.962 | 25.362 | 73.175 |
| 2016-03-019:55:49 AM | 65.3 | 109.962 | 25.475 | 73.288 |
| 2016-03-019:55:53 AM | 65.3 | 110.075 | 25.588 | 73.175 |
| 2016-03-019:55:57 AM | 65.3 | 110.075 | 25.7 | 73.175 |
| 2016-03-019:56:01 AM | 65.188 | 110.075 | 25.925 | 73.175 |
| 2016-03-019:56:06 AM | 65.3 | 110.075 | 26.038 | 73.175 |
| 2016-03-019:56:10 AM | 65.3 | 110.188 | 26.038 | 73.175 |
| 2016-03-019:56:14 AM | 65.188 | 110.188 | 26.038 | 73.175 |
| 2016-03-019:56:18 AM | 65.075 | 110.3 | 26.038 | 73.288 |
| 2016-03-019:56:22 AM | 65.075 | 110.3 | 26.038 | 73.288 |
| 2016-03-019:56:26 AM | 64.963 | 110.413 | 26.038 | 73.288 |
| 2016-03-019:56:30 AM | 64.963 | 110.413 | 26.038 | 73.288 |
| 2016-03-019:56:34 AM | 64.963 | 110.525 | 26.038 | 73.288 |
| 2016-03-019:56:38 AM | 65.075 | 110.525 | 26.038 | 73.288 |
| 2016-03-019:56:42 AM | 65.188 | 110.638 | 26.038 | 73.175 |
| 2016-03-019:56:46 AM | 65.188 | 110.638 | 26.15 | 73.175 |
| 2016-03-019:56:50 AM | 65.3 | 110.638 | 26.15 | 73.175 |
| 2016-03-019:56:54 AM | 65.412 | 110.75 | 26.262 | 73.175 |
| 2016-03-019:56:58 AM | 65.525 | 110.75 | 26.262 | 73.175 |
| 2016-03-019:57:02 AM | 65.638 | 110.862 | 26.262 | 73.175 |
| 2016-03-019:57:06 AM | 65.75 | 110.862 | 26.262 | 73.175 |
| 2016-03-019:57:10 AM | 65.862 | 110.862 | 26.262 | 73.175 |
| 2016-03-019:57:14 AM | 66.088 | 110.975 | 26.375 | 73.175 |
| 2016-03-019:57:18 AM | 66.2 | 110.975 | 26.375 | 73.175 |
| 2016-03-019:57:22 AM | 66.425 | 110.975 | 26.262 | 73.175 |
| 2016-03-019:57:26 AM | 66.425 | 110.975 | 26.375 | 73.288 |
| 2016-03-019:57:30 AM | 66.65 | 110.975 | 26.375 | 73.288 |
| 2016-03-019:57:34 AM | 66.762 | 110.975 | 26.375 | 73.175 |
| 2016-03-019:57:39 AM | 66.875 | 110.975 | 26.488 | 73.288 |
| 2016-03-019:57:43 AM | 66.988 | 110.975 | 26.6 | 73.175 |
| 2016-03-019:57:47 AM | 67.1 | 111.088 | 26.488 | 73.288 |
| 2016-03-019:57:51 AM | 67.212 | 111.088 | 26.375 | 73.288 |
| 2016-03-019:57:55 AM | 67.325 | 111.088 | 26.488 | 73.288 |
| 2016-03-019:57:59 AM | 67.438 | 111.2 | 26.375 | 73.175 |
| 2016-03-019:58:03 AM | 67.55 | 111.2 | 26.488 | 73.288 |
| 2016-03-019:58:07 AM | 67.662 | 111.2 | 26.488 | 73.288 |
| 2016-03-019:58:11 AM | 67.775 | 111.312 | 26.6 | 73.175 |
| 2016-03-019:58:15 AM | 67.775 | 111.312 | 26.712 | 73.288 |
| 2016-03-019:58:19 AM | 67.888 | 111.312 | 26.712 | 73.175 |
| 2016-03-019:58:23 AM | 68 | 111.312 | 26.6 | 73.288 |
| 2016-03-019:58:27 AM | 68.112 | 111.425 | 26.6 | 73.288 |
| 2016-03-019:58:31 AM | 68.112 | 111.425 | 26.488 | 73.175 |
| 2016-03-019:58:35 AM | 68.225 | 111.538 | 26.038 | 73.288 |
| 2016-03-019:58:39 AM | 68.338 | 111.538 | 25.7 | 73.288 |
| 2016-03-019:58:43 AM | 68.338 | 111.538 | 25.475 | 73.288 |
| 2016-03-019:58:47 AM | 68.45 | 111.65 | 25.475 | 73.288 |
| 2016-03-019:58:51 AM | 68.562 | 111.65 | 25.7 | 73.288 |
| 2016-03-019:58:55 AM | 68.562 | 111.65 | 25.812 | 73.288 |
| 2016-03-019:58:59 AM | 68.675 | 111.762 | 25.812 | 73.4 |
| 2016-03-019:59:03 AM | 68.675 | 111.762 | 26.038 | 73.4 |
| 2016-03-019:59:07 AM | 68.788 | 111.762 | 26.15 | 73.288 |
| 2016-03-019:59:11 AM | 68.788 | 111.762 | 26.262 | 73.4 |
| 2016-03-019:59:15 AM | 68.788 | 111.762 | 26.375 | 73.4 |
| 2016-03-019:59:19 AM | 68.788 | 111.762 | 26.375 | 73.4 |
| 2016-03-019:59:23 AM | 68.788 | 111.762 | 26.375 | 73.288 |
| 2016-03-019:59:27 AM | 68.9 | 111.875 | 26.262 | 73.4 |
| 2016-03-019:59:31 AM | 68.9 | 111.875 | 26.038 | 73.4 |
| 2016-03-019:59:35 AM | 68.9 | 111.875 | 26.038 | 73.4 |
| 2016-03-019:59:39 AM | 68.9 | 111.875 | 26.15 | 73.4 |
| 2016-03-019:59:44 AM | 68.9 | 111.875 | 26.15 | 73.4 |
| 2016-03-019:59:48 AM | 68.788 | 111.875 | 26.262 | 73.4 |
| 2016-03-019:59:52 AM | 68.562 | 111.875 | 26.375 | 73.4 |
| 2016-03-019:59:56 AM | 68.45 | 111.875 | 26.488 | 73.4 |
| 2016-03-0110:00:00 AM | 68.45 | 111.875 | 26.712 | 73.4 |
| 2016-03-0110:00:04 AM | 68.45 | 111.875 | 26.712 | 73.4 |
| 2016-03-0110:00:08 AM | 68.45 | 111.875 | 26.6 | 73.4 |
| 2016-03-0110:00:12 AM | 68.562 | 111.875 | 26.712 | 73.288 |
| 2016-03-0110:00:16 AM | 68.562 | 111.875 | 26.712 | 73.288 |
| 2016-03-0110:00:20 AM | 68.562 | 111.875 | 26.6 | 73.4 |
| 2016-03-0110:00:24 AM | 68.675 | 111.988 | 26.6 | 73.4 |
| 2016-03-0110:00:28 AM | 68.788 | 111.988 | 26.6 | 73.288 |
| 2016-03-0110:00:32 AM | 68.788 | 111.988 | 26.6 | 73.4 |
| 2016-03-0110:00:36 AM | 68.9 | 112.1 | 26.712 | 73.4 |
| 2016-03-0110:00:40 AM | 68.9 | 112.1 | 26.825 | 73.4 |
| 2016-03-0110:00:44 AM | 69.012 | 112.1 | 26.825 | 73.4 |
| 2016-03-0110:00:48 AM | 69.012 | 112.212 | 26.825 | 73.4 |
| 2016-03-0110:00:52 AM | 69.012 | 112.212 | 26.825 | 73.4 |
| 2016-03-0110:00:56 AM | 69.125 | 112.325 | 26.825 | 73.4 |
| 2016-03-0110:01:00 AM | 69.238 | 112.325 | 26.825 | 73.512 |
| 2016-03-0110:01:04 AM | 69.238 | 112.325 | 26.938 | 73.4 |
| 2016-03-0110:01:08 AM | 69.238 | 112.325 | 26.938 | 73.4 |
| 2016-03-0110:01:12 AM | 69.35 | 112.438 | 27.05 | 73.4 |
| 2016-03-0110:01:16 AM | 69.462 | 112.438 | 27.162 | 73.4 |
| 2016-03-0110:01:20 AM | 69.462 | 112.55 | 27.162 | 73.4 |
| 2016-03-0110:01:24 AM | 69.575 | 112.55 | 27.275 | 73.4 |
| 2016-03-0110:01:28 AM | 69.575 | 112.55 | 27.275 | 73.4 |
| 2016-03-0110:01:33 AM | 69.575 | 112.663 | 27.162 | 73.4 |
| 2016-03-0110:01:37 AM | 69.688 | 112.663 | 27.05 | 73.4 |
| 2016-03-0110:01:41 AM | 69.688 | 112.663 | 26.938 | 73.4 |
| 2016-03-0110:01:45 AM | 69.8 | 112.775 | 26.938 | 73.4 |
| 2016-03-0110:01:49 AM | 69.8 | 112.775 | 26.938 | 73.4 |
| 2016-03-0110:01:53 AM | 69.912 | 112.775 | 27.05 | 73.4 |
| 2016-03-0110:01:57 AM | 69.912 | 112.888 | 27.05 | 73.4 |
| 2016-03-0110:02:01 AM | 69.912 | 113 | 27.05 | 73.4 |
| 2016-03-0110:02:05 AM | 69.912 | 113 | 27.05 | 73.4 |
| 2016-03-0110:02:09 AM | 69.912 | 113.112 | 27.05 | 73.4 |
| 2016-03-0110:02:13 AM | 69.912 | 113.112 | 27.05 | 73.4 |
| 2016-03-0110:02:17 AM | 69.912 | 113.112 | 27.05 | 73.4 |
| 2016-03-0110:02:21 AM | 69.912 | 113.112 | 27.05 | 73.4 |
| 2016-03-0110:02:25 AM | 69.8 | 113 | 27.05 | 73.4 |
| 2016-03-0110:02:29 AM | 69.8 | 113 | 27.05 | 73.4 |
| 2016-03-0110:02:33 AM | 69.8 | 113 | 27.05 | 73.4 |
| 2016-03-0110:02:37 AM | 69.8 | 113 | 27.162 | 73.4 |
| 2016-03-0110:02:41 AM | 69.8 | 113 | 27.05 | 73.4 |
| 2016-03-0110:02:45 AM | 69.912 | 113 | 26.938 | 73.4 |
| 2016-03-0110:02:49 AM | 69.912 | 113 | 26.938 | 73.4 |
| 2016-03-0110:02:53 AM | 69.912 | 113 | 26.938 | 73.4 |
| 2016-03-0110:02:57 AM | 69.912 | 112.888 | 26.938 | 73.4 |
| 2016-03-0110:03:02 AM | 69.912 | 112.888 | 26.938 | 73.4 |
| 2016-03-0110:03:05 AM | 69.912 | 112.888 | 26.825 | 73.4 |
| 2016-03-0110:03:09 AM | 69.912 | 113 | 26.825 | 73.4 |
| 2016-03-0110:03:13 AM | 70.025 | 113 | 26.825 | 73.4 |
| 2016-03-0110:03:17 AM | 70.025 | 113 | 26.712 | 73.4 |
| 2016-03-0110:03:25 AM | 70.138 | 113 | 26.712 | 73.4 |
| 2016-03-0110:03:29 AM | 70.138 | 113 | 26.712 | 73.288 |
| 2016-03-0110:03:33 AM | 70.138 | 113.112 | 26.712 | 73.4 |
| 2016-03-0110:03:37 AM | 70.25 | 113.112 | 26.488 | 73.288 |
| 2016-03-0110:03:41 AM | 70.25 | 113.112 | 26.375 | 73.288 |
| 2016-03-0110:03:45 AM | 70.362 | 113.225 | 26.15 | 73.4 |
| 2016-03-0110:03:49 AM | 70.362 | 113.225 | 26.262 | 73.4 |
| 2016-03-0110:03:53 AM | 70.362 | 113.225 | 26.262 | 73.4 |
| 2016-03-0110:03:57 AM | 70.362 | 113.225 | 26.262 | 73.4 |
| 2016-03-0110:04:01 AM | 70.475 | 113.338 | 26.15 | 73.512 |
| 2016-03-0110:04:05 AM | 70.475 | 113.338 | 26.15 | 73.512 |
| 2016-03-0110:04:09 AM | 70.588 | 113.338 | 26.038 | 73.512 |
| 2016-03-0110:04:13 AM | 70.588 | 113.338 | 25.812 | 73.512 |
| 2016-03-0110:04:17 AM | 70.588 | 113.338 | 25.588 | 73.512 |
| 2016-03-0110:04:21 AM | 70.588 | 113.338 | 25.588 | 73.512 |
| 2016-03-0110:04:25 AM | 70.588 | 113.45 | 25.7 | 73.512 |
| 2016-03-0110:04:30 AM | 70.588 | 113.45 | 25.7 | 73.512 |
| 2016-03-0110:04:34 AM | 70.588 | 113.45 | 25.7 | 73.512 |
| 2016-03-0110:04:38 AM | 70.588 | 113.562 | 25.588 | 73.512 |
| 2016-03-0110:04:42 AM | 70.7 | 113.45 | 25.7 | 73.512 |
| 2016-03-0110:04:46 AM | 70.7 | 113.562 | 25.812 | 73.512 |
| 2016-03-0110:04:50 AM | 70.7 | 113.562 | 25.925 | 73.512 |
| 2016-03-0110:04:54 AM | 70.7 | 113.562 | 25.925 | 73.512 |
| 2016-03-0110:04:58 AM | 70.7 | 113.562 | 26.038 | 73.512 |
| 2016-03-0110:05:02 AM | 70.7 | 113.562 | 26.038 | 73.512 |
| 2016-03-0110:05:06 AM | 70.812 | 113.675 | 26.15 | 73.512 |
| 2016-03-0110:05:10 AM | 70.812 | 113.675 | 26.262 | 73.512 |
| 2016-03-0110:05:14 AM | 70.812 | 113.562 | 26.375 | 73.512 |
| 2016-03-0110:05:18 AM | 70.812 | 113.45 | 26.375 | 73.512 |
| 2016-03-0110:05:22 AM | 70.812 | 113.45 | 26.375 | 73.512 |
| 2016-03-0110:05:26 AM | 70.812 | 113.45 | 26.488 | 73.512 |
| 2016-03-0110:05:30 AM | 70.925 | 113.45 | 26.6 | 73.512 |
| 2016-03-0110:05:34 AM | 71.038 | 113.45 | 26.6 | 73.512 |
| 2016-03-0110:05:38 AM | 70.925 | 113.45 | 26.712 | 73.512 |
| 2016-03-0110:05:42 AM | 71.038 | 113.45 | 26.825 | 73.4 |
| 2016-03-0110:05:46 AM | 71.038 | 113.45 | 26.938 | 73.512 |
| 2016-03-0110:05:50 AM | 71.038 | 113.562 | 26.938 | 73.512 |
| 2016-03-0110:05:54 AM | 71.038 | 113.562 | 27.05 | 73.512 |
| 2016-03-0110:05:58 AM | 71.038 | 113.562 | 27.162 | 73.512 |
| 2016-03-0110:06:02 AM | 71.038 | 113.562 | 27.162 | 73.512 |
| 2016-03-0110:06:06 AM | 71.15 | 113.675 | 27.05 | 73.512 |
| 2016-03-0110:06:10 AM | 71.15 | 113.675 | 27.05 | 73.512 |
| 2016-03-0110:06:14 AM | 71.15 | 113.675 | 27.05 | 73.512 |
| 2016-03-0110:06:18 AM | 71.15 | 113.788 | 27.05 | 73.512 |
| 2016-03-0110:06:22 AM | 71.15 | 113.788 | 27.05 | 73.4 |
| 2016-03-0110:06:26 AM | 71.262 | 113.788 | 26.938 | 73.512 |
| 2016-03-0110:06:30 AM | 71.262 | 113.9 | 26.938 | 73.4 |
| 2016-03-0110:06:34 AM | 71.262 | 113.9 | 26.825 | 73.4 |
| 2016-03-0110:06:38 AM | 71.262 | 113.9 | 26.712 | 73.4 |
| 2016-03-0110:06:42 AM | 71.262 | 114.012 | 26.712 | 73.4 |
| 2016-03-0110:06:46 AM | 71.375 | 114.012 | 26.825 | 73.4 |
| 2016-03-0110:06:51 AM | 71.375 | 114.125 | 26.938 | 73.4 |
| 2016-03-0110:06:55 AM | 71.375 | 114.125 | 27.05 | 73.4 |
| 2016-03-0110:06:59 AM | 71.375 | 114.238 | 27.05 | 73.512 |
| 2016-03-0110:07:03 AM | 71.375 | 114.238 | 27.162 | 73.4 |
| 2016-03-0110:07:07 AM | 71.488 | 114.35 | 26.938 | 73.512 |
| 2016-03-0110:07:14 AM | 71.488 | 114.35 | 26.6 | 73.512 |
| 2016-03-0110:07:18 AM | 71.488 | 114.462 | 26.488 | 73.512 |
| 2016-03-0110:07:22 AM | 71.488 | 114.462 | 26.488 | 73.4 |
| 2016-03-0110:07:26 AM | 71.488 | 114.575 | 26.488 | 73.4 |
| 2016-03-0110:07:30 AM | 71.488 | 114.575 | 26.6 | 73.512 |
| 2016-03-0110:07:34 AM | 71.488 | 114.575 | 26.488 | 73.4 |
| 2016-03-0110:07:38 AM | 71.488 | 114.575 | 26.488 | 73.4 |
| 2016-03-0110:07:42 AM | 71.6 | 114.575 | 26.6 | 73.4 |
| 2016-03-0110:07:46 AM | 71.488 | 114.575 | 26.6 | 73.4 |
| 2016-03-0110:07:50 AM | 71.6 | 114.575 | 26.712 | 73.4 |
| 2016-03-0110:07:54 AM | 71.6 | 114.575 | 26.825 | 73.4 |
| 2016-03-0110:07:58 AM | 71.6 | 114.575 | 26.938 | 73.512 |
| 2016-03-0110:08:02 AM | 71.6 | 114.575 | 26.938 | 73.4 |
| 2016-03-0110:08:10 AM | 71.6 | 114.688 | 26.6 | 73.4 |
| 2016-03-0110:08:14 AM | 71.6 | 114.688 | 26.375 | 73.4 |
| 2016-03-0110:08:18 AM | 71.6 | 114.688 | 26.375 | 73.4 |
| 2016-03-0110:08:22 AM | 71.6 | 114.8 | 26.375 | 73.4 |
| 2016-03-0110:08:26 AM | 71.6 | 114.8 | 26.15 | 73.4 |
| 2016-03-0110:08:30 AM | 71.6 | 114.8 | 26.038 | 73.4 |
| 2016-03-0110:08:34 AM | 71.6 | 114.8 | 25.925 | 73.4 |
| 2016-03-0110:08:38 AM | 71.712 | 114.8 | 25.7 | 73.4 |
| 2016-03-0110:08:42 AM | 71.712 | 114.688 | 25.588 | 73.4 |
| 2016-03-0110:08:46 AM | 71.712 | 114.575 | 25.475 | 73.4 |
| 2016-03-0110:08:51 AM | 71.712 | 114.35 | 25.362 | 73.4 |
| 2016-03-0110:08:55 AM | 71.712 | 114.125 | 25.138 | 73.4 |
| 2016-03-0110:08:59 AM | 71.712 | 114.012 | 25.025 | 73.4 |
| 2016-03-0110:09:03 AM | 71.825 | 113.675 | 24.912 | 73.4 |
| 2016-03-0110:09:07 AM | 71.825 | 113.562 | 24.8 | 73.4 |
| 2016-03-0110:09:11 AM | 71.825 | 113.338 | 24.8 | 73.4 |
| 2016-03-0110:09:15 AM | 71.825 | 113.225 | 24.8 | 73.4 |
| 2016-03-0110:09:19 AM | 71.825 | 113.112 | 24.8 | 73.288 |
| 2016-03-0110:09:23 AM | 71.825 | 113 | 24.912 | 73.288 |
| 2016-03-0110:09:31 AM | 71.825 | 112.888 | 24.688 | 73.288 |
| 2016-03-0110:09:35 AM | 71.712 | 112.775 | 24.8 | 73.288 |
| 2016-03-0110:09:39 AM | 71.6 | 112.775 | 24.912 | 73.288 |
| 2016-03-0110:09:43 AM | 71.488 | 112.663 | 25.025 | 73.4 |
| 2016-03-0110:09:47 AM | 71.262 | 112.663 | 25.25 | 73.288 |
| 2016-03-0110:09:51 AM | 71.15 | 112.55 | 25.362 | 73.288 |
| 2016-03-0110:09:55 AM | 70.925 | 112.55 | 25.475 | 73.288 |
| 2016-03-0110:09:59 AM | 70.925 | 112.55 | 25.588 | 73.288 |
| 2016-03-0110:10:04 AM | 70.812 | 112.663 | 25.812 | 73.288 |
| 2016-03-0110:10:12 AM | 70.925 | 112.55 | 25.925 | 73.288 |
| 2016-03-0110:10:16 AM | 70.925 | 112.663 | 25.812 | 73.288 |
| 2016-03-0110:10:20 AM | 70.925 | 112.663 | 25.475 | 73.288 |
| 2016-03-0110:10:24 AM | 70.925 | 112.663 | 25.25 | 73.288 |
| 2016-03-0110:10:28 AM | 71.038 | 112.663 | 25.25 | 73.288 |
| 2016-03-0110:10:32 AM | 71.038 | 112.663 | 25.362 | 73.288 |
| 2016-03-0110:10:36 AM | 71.038 | 112.775 | 25.362 | 73.288 |
| 2016-03-0110:10:40 AM | 71.038 | 112.888 | 25.475 | 73.288 |
| 2016-03-0110:10:44 AM | 71.038 | 112.888 | 25.475 | 73.288 |
| 2016-03-0110:10:48 AM | 71.038 | 112.888 | 25.475 | 73.288 |
| 2016-03-0110:10:52 AM | 71.15 | 113 | 25.588 | 73.288 |
| 2016-03-0110:10:56 AM | 71.15 | 113 | 25.588 | 73.288 |
| 2016-03-0110:11:00 AM | 71.15 | 113 | 25.7 | 73.288 |
| 2016-03-0110:11:04 AM | 71.15 | 113.112 | 25.812 | 73.288 |
| 2016-03-0110:11:08 AM | 71.15 | 113.112 | 25.812 | 73.288 |
| 2016-03-0110:11:12 AM | 71.15 | 113.112 | 25.588 | 73.288 |
| 2016-03-0110:11:16 AM | 71.15 | 113.225 | 25.475 | 73.288 |
| 2016-03-0110:11:20 AM | 71.15 | 113.225 | 25.588 | 73.288 |
| 2016-03-0110:11:24 AM | 71.15 | 113.338 | 25.588 | 73.288 |
| 2016-03-0110:11:28 AM | 71.038 | 113.338 | 25.588 | 73.288 |
| 2016-03-0110:11:32 AM | 71.038 | 113.45 | 25.475 | 73.288 |
| 2016-03-0110:11:36 AM | 71.038 | 113.562 | 25.362 | 73.288 |
| 2016-03-0110:11:40 AM | 71.038 | 113.562 | 25.362 | 73.288 |
| 2016-03-0110:11:44 AM | 71.15 | 113.562 | 25.362 | 73.288 |
| 2016-03-0110:11:48 AM | 71.15 | 113.675 | 25.475 | 73.288 |
| 2016-03-0110:11:52 AM | 71.15 | 113.675 | 25.475 | 73.288 |
| 2016-03-0110:11:56 AM | 71.262 | 113.788 | 25.475 | 73.288 |
| 2016-03-0110:12:00 AM | 71.262 | 113.675 | 25.475 | 73.288 |
| 2016-03-0110:12:04 AM | 71.262 | 113.9 | 25.588 | 73.288 |
| 2016-03-0110:12:09 AM | 71.262 | 113.9 | 25.7 | 73.288 |
| 2016-03-0110:12:13 AM | 71.262 | 113.9 | 25.812 | 73.288 |
| 2016-03-0110:12:17 AM | 71.15 | 113.9 | 25.925 | 73.288 |
| 2016-03-0110:12:21 AM | 71.038 | 113.9 | 25.812 | 73.288 |
| 2016-03-0110:12:25 AM | 70.925 | 114.012 | 25.812 | 73.288 |
| 2016-03-0110:12:29 AM | 70.812 | 114.012 | 25.7 | 73.288 |
| 2016-03-0110:12:33 AM | 70.925 | 114.012 | 25.7 | 73.288 |
| 2016-03-0110:12:37 AM | 70.925 | 114.012 | 25.812 | 73.288 |
| 2016-03-0110:12:41 AM | 70.925 | 114.125 | 25.925 | 73.288 |
| 2016-03-0110:12:45 AM | 70.925 | 114.238 | 26.038 | 73.288 |
| 2016-03-0110:12:49 AM | 70.925 | 114.238 | 26.15 | 73.288 |
| 2016-03-0110:12:53 AM | 71.038 | 114.238 | 26.15 | 73.288 |
| 2016-03-0110:12:57 AM | 71.038 | 114.35 | 26.15 | 73.288 |
| 2016-03-0110:13:01 AM | 71.15 | 114.35 | 26.262 | 73.288 |
| 2016-03-0110:13:05 AM | 71.15 | 114.462 | 26.375 | 73.288 |
| 2016-03-0110:13:09 AM | 71.15 | 114.462 | 26.488 | 73.288 |
| 2016-03-0110:13:13 AM | 71.262 | 114.575 | 26.712 | 73.4 |
| 2016-03-0110:13:21 AM | 71.262 | 114.575 | 26.825 | 73.288 |
| 2016-03-0110:13:25 AM | 71.262 | 114.688 | 26.825 | 73.288 |
| 2016-03-0110:13:29 AM | 71.262 | 114.688 | 26.938 | 73.288 |
| 2016-03-0110:13:37 AM | 71.375 | 114.8 | 26.938 | 73.288 |
| 2016-03-0110:13:41 AM | 71.375 | 114.8 | 27.05 | 73.288 |
| 2016-03-0110:13:45 AM | 71.375 | 114.913 | 27.05 | 73.288 |
| 2016-03-0110:13:49 AM | 71.375 | 114.913 | 27.162 | 73.288 |
| 2016-03-0110:13:53 AM | 71.488 | 115.025 | 27.05 | 73.288 |
| 2016-03-0110:13:57 AM | 71.488 | 115.025 | 27.162 | 73.288 |
| 2016-03-0110:14:05 AM | 71.6 | 115.025 | 27.388 | 73.288 |
| 2016-03-0110:14:09 AM | 71.6 | 115.138 | 27.388 | 73.288 |
| 2016-03-0110:14:13 AM | 71.6 | 115.25 | 27.388 | 73.288 |
| 2016-03-0110:14:18 AM | 71.6 | 115.362 | 27.388 | 73.288 |
| 2016-03-0110:14:22 AM | 71.6 | 115.362 | 27.275 | 73.288 |
| 2016-03-0110:14:26 AM | 71.712 | 115.475 | 27.275 | 73.288 |
| 2016-03-0110:14:30 AM | 71.712 | 115.475 | 27.5 | 73.288 |
| 2016-03-0110:14:34 AM | 71.712 | 115.588 | 27.388 | 73.288 |
| 2016-03-0110:14:38 AM | 71.825 | 115.588 | 27.05 | 73.288 |
| 2016-03-0110:14:42 AM | 71.825 | 115.7 | 26.825 | 73.288 |
| 2016-03-0110:14:46 AM | 71.825 | 115.7 | 26.825 | 73.288 |
| 2016-03-0110:14:50 AM | 71.825 | 115.925 | 26.6 | 73.288 |
| 2016-03-0110:14:54 AM | 71.938 | 115.925 | 26.712 | 73.288 |
| 2016-03-0110:14:58 AM | 71.938 | 116.038 | 26.6 | 73.288 |
| 2016-03-0110:15:02 AM | 71.938 | 116.038 | 26.488 | 73.288 |
| 2016-03-0110:15:06 AM | 71.938 | 116.038 | 26.375 | 73.288 |
| 2016-03-0110:15:10 AM | 71.938 | 116.15 | 26.375 | 73.288 |
| 2016-03-0110:15:14 AM | 71.938 | 116.262 | 26.488 | 73.288 |
| 2016-03-0110:15:18 AM | 71.938 | 116.262 | 26.6 | 73.288 |
| 2016-03-0110:15:22 AM | 71.938 | 116.375 | 26.6 | 73.288 |
| 2016-03-0110:15:30 AM | 71.825 | 116.375 | 26.6 | 73.288 |
| 2016-03-0110:15:34 AM | 71.825 | 116.488 | 26.6 | 73.288 |
| 2016-03-0110:15:39 AM | 71.712 | 116.488 | 26.712 | 73.288 |
| 2016-03-0110:15:43 AM | 71.712 | 116.488 | 26.825 | 73.288 |
| 2016-03-0110:15:51 AM | 71.712 | 116.6 | 26.825 | 73.175 |
| 2016-03-0110:15:55 AM | 71.712 | 116.6 | 26.938 | 73.288 |
| 2016-03-0110:15:59 AM | 71.712 | 116.6 | 26.938 | 73.288 |
| 2016-03-0110:16:03 AM | 71.825 | 116.712 | 27.05 | 73.175 |
| 2016-03-0110:16:07 AM | 71.825 | 116.712 | 27.162 | 73.175 |
| 2016-03-0110:16:11 AM | 71.825 | 116.825 | 27.162 | 73.175 |
| 2016-03-0110:16:15 AM | 71.712 | 116.825 | 27.162 | 73.288 |
| 2016-03-0110:16:19 AM | 71.488 | 116.938 | 27.388 | 73.175 |
| 2016-03-0110:16:23 AM | 71.375 | 117.05 | 27.5 | 73.288 |
| 2016-03-0110:16:27 AM | 71.262 | 117.163 | 27.612 | 73.288 |
| 2016-03-0110:16:35 AM | 71.262 | 117.163 | 27.612 | 73.288 |
| 2016-03-0110:16:39 AM | 71.262 | 117.163 | 27.5 | 73.175 |
| 2016-03-0110:16:43 AM | 71.262 | 117.275 | 27.5 | 73.288 |
| 2016-03-0110:16:48 AM | 71.15 | 117.388 | 27.5 | 73.288 |
| 2016-03-0110:16:52 AM | 71.038 | 117.388 | 27.612 | 73.288 |
| 2016-03-0110:16:56 AM | 70.812 | 117.5 | 27.725 | 73.288 |
| 2016-03-0110:17:00 AM | 70.588 | 117.612 | 27.725 | 73.288 |
| 2016-03-0110:17:04 AM | 70.588 | 117.725 | 27.725 | 73.288 |
| 2016-03-0110:17:08 AM | 70.588 | 117.725 | 27.838 | 73.288 |
| 2016-03-0110:17:12 AM | 70.588 | 117.838 | 27.838 | 73.288 |
| 2016-03-0110:17:16 AM | 70.588 | 117.838 | 27.95 | 73.288 |
| 2016-03-0110:17:20 AM | 70.7 | 117.95 | 27.95 | 73.288 |
| 2016-03-0110:17:24 AM | 70.7 | 117.95 | 27.95 | 73.288 |
| 2016-03-0110:17:28 AM | 70.7 | 117.95 | 27.95 | 73.288 |
| 2016-03-0110:17:32 AM | 70.7 | 118.062 | 27.95 | 73.288 |
| 2016-03-0110:17:36 AM | 70.588 | 118.175 | 28.062 | 73.288 |
| 2016-03-0110:17:40 AM | 70.588 | 118.175 | 28.062 | 73.288 |
| 2016-03-0110:17:44 AM | 70.588 | 118.288 | 28.062 | 73.288 |
| 2016-03-0110:17:48 AM | 70.588 | 118.288 | 28.175 | 73.288 |
| 2016-03-0110:17:52 AM | 70.588 | 118.4 | 28.062 | 73.288 |
| 2016-03-0110:17:56 AM | 70.7 | 118.512 | 27.95 | 73.4 |
| 2016-03-0110:18:00 AM | 70.812 | 118.512 | 27.95 | 73.288 |
| 2016-03-0110:18:05 AM | 70.812 | 118.625 | 27.95 | 73.288 |
| 2016-03-0110:18:09 AM | 70.925 | 118.625 | 27.95 | 73.4 |
| 2016-03-0110:18:13 AM | 70.925 | 118.738 | 27.95 | 73.288 |
| 2016-03-0110:18:17 AM | 71.038 | 118.738 | 27.95 | 73.288 |
| 2016-03-0110:18:21 AM | 71.038 | 118.85 | 27.95 | 73.288 |
| 2016-03-0110:18:25 AM | 71.038 | 118.962 | 28.175 | 73.288 |
| 2016-03-0110:18:29 AM | 71.262 | 118.962 | 28.288 | 73.288 |
| 2016-03-0110:18:33 AM | 71.262 | 119.075 | 28.288 | 73.288 |
| 2016-03-0110:18:37 AM | 71.262 | 119.075 | 28.4 | 73.288 |
| 2016-03-0110:18:41 AM | 71.375 | 119.188 | 28.4 | 73.288 |
| 2016-03-0110:18:45 AM | 71.375 | 119.188 | 28.512 | 73.288 |
| 2016-03-0110:18:53 AM | 71.375 | 119.3 | 28.625 | 73.288 |
| 2016-03-0110:18:57 AM | 71.375 | 119.3 | 28.625 | 73.288 |
| 2016-03-0110:19:01 AM | 71.262 | 119.413 | 28.512 | 73.288 |
| 2016-03-0110:19:05 AM | 71.15 | 119.413 | 28.4 | 73.288 |
| 2016-03-0110:19:09 AM | 71.15 | 119.413 | 28.288 | 73.288 |
| 2016-03-0110:19:13 AM | 71.262 | 119.525 | 28.4 | 73.288 |
| 2016-03-0110:19:17 AM | 71.262 | 119.525 | 28.4 | 73.288 |
| 2016-03-0110:19:21 AM | 71.262 | 119.638 | 28.4 | 73.288 |
| 2016-03-0110:19:25 AM | 71.262 | 119.638 | 28.288 | 73.288 |
| 2016-03-0110:19:29 AM | 71.375 | 119.75 | 28.175 | 73.288 |
| 2016-03-0110:19:33 AM | 71.375 | 119.75 | 28.175 | 73.288 |
| 2016-03-0110:19:37 AM | 71.375 | 119.862 | 28.062 | 73.288 |
| 2016-03-0110:19:41 AM | 71.488 | 119.862 | 27.95 | 73.288 |
| 2016-03-0110:19:46 AM | 71.488 | 119.862 | 28.062 | 73.288 |
| 2016-03-0110:19:50 AM | 71.488 | 119.975 | 28.062 | 73.288 |
| 2016-03-0110:19:54 AM | 71.6 | 119.975 | 28.175 | 73.288 |
| 2016-03-0110:19:58 AM | 71.712 | 120.088 | 28.288 | 73.175 |
| 2016-03-0110:20:02 AM | 71.712 | 120.088 | 28.4 | 73.288 |
| 2016-03-0110:20:06 AM | 71.825 | 120.2 | 28.4 | 73.288 |
| 2016-03-0110:20:10 AM | 71.825 | 120.2 | 28.288 | 73.288 |
| 2016-03-0110:20:14 AM | 71.825 | 120.2 | 28.175 | 73.288 |
| 2016-03-0110:20:18 AM | 71.825 | 120.2 | 28.062 | 73.288 |
| 2016-03-0110:20:22 AM | 71.938 | 120.312 | 28.062 | 73.288 |
| 2016-03-0110:20:26 AM | 71.938 | 120.312 | 28.062 | 73.288 |
| 2016-03-0110:20:30 AM | 71.938 | 120.425 | 28.062 | 73.288 |
| 2016-03-0110:20:35 AM | 72.05 | 120.425 | 28.062 | 73.288 |
| 2016-03-0110:20:39 AM | 72.05 | 120.538 | 28.062 | 73.288 |
| 2016-03-0110:20:43 AM | 72.05 | 120.65 | 27.95 | 73.288 |
| 2016-03-0110:20:47 AM | 72.05 | 120.65 | 27.95 | 73.175 |
| 2016-03-0110:20:51 AM | 72.05 | 120.762 | 27.95 | 73.288 |
| 2016-03-0110:20:55 AM | 72.05 | 120.762 | 27.95 | 73.288 |
| 2016-03-0110:20:59 AM | 72.162 | 120.762 | 27.838 | 73.288 |
| 2016-03-0110:21:03 AM | 72.162 | 120.762 | 27.838 | 73.288 |
| 2016-03-0110:21:07 AM | 72.162 | 120.875 | 27.838 | 73.288 |
| 2016-03-0110:21:11 AM | 72.162 | 120.875 | 27.95 | 73.288 |
| 2016-03-0110:21:15 AM | 72.275 | 120.988 | 27.838 | 73.288 |
| 2016-03-0110:21:19 AM | 72.275 | 120.988 | 27.725 | 73.288 |
| 2016-03-0110:21:23 AM | 72.275 | 121.1 | 27.725 | 73.288 |
| 2016-03-0110:21:27 AM | 72.388 | 121.1 | 27.725 | 73.288 |
| 2016-03-0110:21:31 AM | 72.275 | 121.212 | 27.612 | 73.288 |
| 2016-03-0110:21:36 AM | 72.275 | 121.212 | 27.612 | 73.288 |
| 2016-03-0110:21:40 AM | 72.388 | 121.212 | 27.5 | 73.4 |
| 2016-03-0110:21:44 AM | 72.388 | 121.212 | 27.5 | 73.4 |
| 2016-03-0110:21:48 AM | 72.388 | 121.325 | 27.612 | 73.4 |
| 2016-03-0110:21:52 AM | 72.388 | 121.325 | 27.838 | 73.4 |
| 2016-03-0110:21:56 AM | 72.5 | 121.325 | 27.95 | 73.4 |
| 2016-03-0110:22:00 AM | 72.5 | 121.438 | 27.95 | 73.4 |
| 2016-03-0110:22:04 AM | 72.5 | 121.55 | 28.062 | 73.288 |
| 2016-03-0110:22:08 AM | 72.5 | 121.55 | 28.062 | 73.288 |
| 2016-03-0110:22:12 AM | 72.612 | 121.55 | 28.175 | 73.288 |
| 2016-03-0110:22:16 AM | 72.612 | 121.55 | 28.288 | 73.4 |
| 2016-03-0110:22:20 AM | 72.5 | 121.663 | 28.4 | 73.4 |
| 2016-03-0110:22:24 AM | 72.388 | 121.663 | 28.4 | 73.288 |
| 2016-03-0110:22:28 AM | 72.388 | 121.663 | 28.4 | 73.4 |
| 2016-03-0110:22:32 AM | 72.275 | 121.663 | 28.288 | 73.4 |
| 2016-03-0110:22:37 AM | 72.162 | 121.775 | 28.4 | 73.4 |
| 2016-03-0110:22:41 AM | 71.938 | 121.775 | 28.512 | 73.4 |
| 2016-03-0110:22:45 AM | 71.938 | 121.888 | 28.512 | 73.4 |
| 2016-03-0110:22:49 AM | 71.712 | 122 | 28.512 | 73.4 |
| 2016-03-0110:22:53 AM | 71.488 | 122 | 28.512 | 73.4 |
| 2016-03-0110:22:57 AM | 71.375 | 122 | 28.512 | 73.4 |
| 2016-03-0110:23:01 AM | 71.15 | 122.112 | 28.4 | 73.4 |
| 2016-03-0110:23:05 AM | 70.925 | 122.112 | 28.288 | 73.4 |
| 2016-03-0110:23:09 AM | 70.812 | 122.225 | 28.062 | 73.4 |
| 2016-03-0110:23:13 AM | 70.588 | 122.225 | 28.175 | 73.4 |
| 2016-03-0110:23:17 AM | 70.588 | 122.225 | 28.175 | 73.4 |
| 2016-03-0110:23:21 AM | 70.475 | 122.338 | 28.062 | 73.4 |
| 2016-03-0110:23:25 AM | 70.475 | 122.338 | 28.062 | 73.4 |
| 2016-03-0110:23:29 AM | 70.588 | 122.338 | 28.062 | 73.4 |
| 2016-03-0110:23:33 AM | 70.588 | 122.45 | 27.838 | 73.4 |
| 2016-03-0110:23:37 AM | 70.475 | 122.45 | 27.612 | 73.288 |
| 2016-03-0110:23:42 AM | 70.475 | 122.562 | 27.388 | 73.4 |
| 2016-03-0110:23:46 AM | 70.362 | 122.562 | 27.275 | 73.288 |
| 2016-03-0110:23:50 AM | 70.25 | 122.562 | 27.275 | 73.4 |
| 2016-03-0110:23:54 AM | 70.25 | 122.675 | 27.275 | 73.4 |
| 2016-03-0110:23:58 AM | 70.138 | 122.675 | 27.162 | 73.4 |
| 2016-03-0110:24:02 AM | 69.912 | 122.675 | 27.162 | 73.4 |
| 2016-03-0110:24:06 AM | 69.688 | 122.788 | 27.162 | 73.4 |
| 2016-03-0110:24:10 AM | 69.462 | 122.788 | 27.162 | 73.288 |
| 2016-03-0110:24:14 AM | 69.238 | 122.9 | 27.275 | 73.4 |
| 2016-03-0110:24:18 AM | 69.125 | 122.9 | 27.388 | 73.4 |
| 2016-03-0110:24:22 AM | 69.012 | 123.012 | 27.5 | 73.4 |
| 2016-03-0110:24:26 AM | 68.788 | 123.012 | 27.612 | 73.4 |
| 2016-03-0110:24:30 AM | 68.675 | 123.125 | 27.725 | 73.4 |
| 2016-03-0110:24:34 AM | 68.45 | 123.125 | 27.725 | 73.4 |
| 2016-03-0110:24:38 AM | 68.45 | 123.125 | 27.725 | 73.4 |
| 2016-03-0110:24:43 AM | 68.338 | 123.238 | 27.725 | 73.4 |
| 2016-03-0110:24:47 AM | 68.225 | 123.238 | 27.725 | 73.4 |
| 2016-03-0110:24:51 AM | 68.225 | 123.35 | 27.838 | 73.4 |
| 2016-03-0110:24:55 AM | 68.338 | 123.35 | 27.838 | 73.4 |
| 2016-03-0110:24:59 AM | 68.338 | 123.462 | 27.95 | 73.4 |
| 2016-03-0110:25:03 AM | 68.45 | 123.462 | 28.062 | 73.4 |
| 2016-03-0110:25:07 AM | 68.562 | 123.575 | 28.175 | 73.4 |
| 2016-03-0110:25:11 AM | 68.675 | 123.575 | 28.288 | 73.512 |
| 2016-03-0110:25:15 AM | 68.675 | 123.575 | 28.4 | 73.512 |
| 2016-03-0110:25:19 AM | 68.788 | 123.688 | 28.625 | 73.512 |
| 2016-03-0110:25:23 AM | 68.562 | 123.8 | 28.738 | 73.512 |
| 2016-03-0110:25:27 AM | 68.45 | 123.8 | 28.85 | 73.512 |
| 2016-03-0110:25:31 AM | 68.338 | 123.913 | 28.738 | 73.512 |
| 2016-03-0110:25:35 AM | 68.112 | 124.025 | 28.738 | 73.512 |
| 2016-03-0110:25:39 AM | 67.888 | 124.138 | 28.738 | 73.512 |
| 2016-03-0110:25:43 AM | 67.775 | 124.138 | 28.512 | 73.512 |
| 2016-03-0110:25:47 AM | 67.775 | 124.25 | 28.288 | 73.512 |
| 2016-03-0110:25:51 AM | 67.775 | 124.362 | 28.062 | 73.512 |
| 2016-03-0110:25:55 AM | 67.888 | 124.362 | 27.838 | 73.512 |
| 2016-03-0110:25:59 AM | 68 | 124.475 | 27.725 | 73.512 |
| 2016-03-0110:26:04 AM | 68.112 | 124.588 | 27.5 | 73.512 |
| 2016-03-0110:26:08 AM | 68.225 | 124.588 | 27.275 | 73.512 |
| 2016-03-0110:26:12 AM | 68.45 | 124.7 | 27.162 | 73.512 |
| 2016-03-0110:26:16 AM | 68.562 | 124.7 | 26.938 | 73.512 |
| 2016-03-0110:26:20 AM | 68.788 | 124.812 | 26.825 | 73.512 |
| 2016-03-0110:26:24 AM | 68.788 | 124.812 | 26.6 | 73.512 |
| 2016-03-0110:26:28 AM | 69.012 | 124.925 | 26.488 | 73.512 |
| 2016-03-0110:26:32 AM | 69.125 | 124.925 | 26.262 | 73.512 |
| 2016-03-0110:26:36 AM | 69.238 | 124.925 | 26.262 | 73.512 |
| 2016-03-0110:26:40 AM | 69.35 | 124.925 | 26.375 | 73.512 |
| 2016-03-0110:26:44 AM | 69.238 | 124.925 | 26.488 | 73.512 |
| 2016-03-0110:26:48 AM | 69.125 | 124.925 | 26.375 | 73.512 |
| 2016-03-0110:26:52 AM | 69.125 | 124.925 | 26.375 | 73.512 |
| 2016-03-0110:26:56 AM | 69.125 | 125.038 | 26.262 | 73.512 |
| 2016-03-0110:27:00 AM | 69.238 | 125.038 | 26.262 | 73.512 |
| 2016-03-0110:27:04 AM | 69.35 | 125.038 | 26.375 | 73.512 |
| 2016-03-0110:27:08 AM | 69.462 | 125.038 | 26.375 | 73.512 |
| 2016-03-0110:27:12 AM | 69.462 | 125.15 | 26.488 | 73.625 |
| 2016-03-0110:27:17 AM | 69.575 | 125.15 | 26.6 | 73.625 |
| 2016-03-0110:27:21 AM | 69.688 | 125.262 | 26.712 | 73.625 |
| 2016-03-0110:27:25 AM | 69.8 | 125.262 | 26.712 | 73.512 |
| 2016-03-0110:27:29 AM | 69.8 | 125.375 | 26.825 | 73.512 |
| 2016-03-0110:27:33 AM | 69.8 | 125.375 | 26.825 | 73.625 |
| 2016-03-0110:27:37 AM | 69.912 | 125.488 | 26.938 | 73.625 |
| 2016-03-0110:27:41 AM | 69.912 | 125.488 | 27.05 | 73.625 |
| 2016-03-0110:27:45 AM | 69.912 | 125.488 | 27.162 | 73.625 |
| 2016-03-0110:27:49 AM | 69.912 | 125.488 | 27.162 | 73.625 |
| 2016-03-0110:27:53 AM | 69.8 | 125.6 | 27.275 | 73.625 |
| 2016-03-0110:27:57 AM | 69.8 | 125.6 | 27.388 | 73.512 |
| 2016-03-0110:28:01 AM | 69.688 | 125.712 | 27.5 | 73.625 |
| 2016-03-0110:28:05 AM | 69.462 | 125.712 | 27.725 | 73.625 |
| 2016-03-0110:28:09 AM | 69.35 | 125.712 | 27.725 | 73.625 |
| 2016-03-0110:28:13 AM | 69.125 | 125.825 | 27.95 | 73.625 |
| 2016-03-0110:28:17 AM | 69.012 | 125.825 | 28.062 | 73.625 |
| 2016-03-0110:28:21 AM | 68.788 | 125.825 | 28.062 | 73.625 |
| 2016-03-0110:28:25 AM | 68.788 | 125.825 | 28.062 | 73.625 |
| 2016-03-0110:28:29 AM | 68.675 | 125.938 | 27.95 | 73.625 |
| 2016-03-0110:28:33 AM | 68.675 | 125.938 | 27.95 | 73.625 |
| 2016-03-0110:28:37 AM | 68.562 | 126.05 | 28.062 | 73.625 |
| 2016-03-0110:28:41 AM | 68.45 | 126.163 | 28.175 | 73.625 |
| 2016-03-0110:28:46 AM | 68.225 | 126.163 | 28.175 | 73.625 |
| 2016-03-0110:28:50 AM | 68 | 126.163 | 28.288 | 73.625 |
| 2016-03-0110:28:54 AM | 68 | 126.163 | 28.4 | 73.625 |
| 2016-03-0110:28:58 AM | 67.775 | 126.275 | 28.512 | 73.625 |
| 2016-03-0110:29:02 AM | 67.55 | 126.388 | 28.625 | 73.625 |
| 2016-03-0110:29:06 AM | 67.212 | 126.388 | 28.738 | 73.625 |
| 2016-03-0110:29:10 AM | 66.988 | 126.388 | 28.85 | 73.625 |
| 2016-03-0110:29:14 AM | 66.875 | 126.5 | 28.85 | 73.625 |
| 2016-03-0110:29:18 AM | 66.875 | 126.5 | 28.962 | 73.625 |
| 2016-03-0110:29:22 AM | 66.875 | 126.612 | 28.962 | 73.625 |
| 2016-03-0110:29:26 AM | 66.762 | 126.612 | 29.188 | 73.625 |
| 2016-03-0110:29:30 AM | 66.762 | 126.725 | 29.3 | 73.625 |
| 2016-03-0110:29:34 AM | 66.762 | 126.725 | 29.3 | 73.625 |
| 2016-03-0110:29:38 AM | 66.762 | 126.725 | 29.412 | 73.625 |
| 2016-03-0110:29:42 AM | 66.762 | 126.838 | 29.525 | 73.625 |
| 2016-03-0110:29:46 AM | 66.762 | 126.838 | 29.638 | 73.625 |
| 2016-03-0110:29:50 AM | 66.762 | 126.95 | 29.638 | 73.625 |
| 2016-03-0110:29:54 AM | 66.762 | 126.95 | 29.638 | 73.625 |
| 2016-03-0110:29:58 AM | 66.762 | 127.062 | 29.75 | 73.625 |
| 2016-03-0110:30:02 AM | 66.762 | 127.062 | 29.975 | 73.625 |
| 2016-03-0110:30:06 AM | 66.762 | 127.062 | 30.088 | 73.625 |
| 2016-03-0110:30:10 AM | 66.762 | 127.175 | 29.975 | 73.625 |
| 2016-03-0110:30:14 AM | 66.875 | 127.175 | 29.975 | 73.625 |
| 2016-03-0110:30:18 AM | 66.875 | 127.288 | 29.975 | 73.625 |
| 2016-03-0110:30:23 AM | 66.875 | 127.4 | 30.088 | 73.625 |
| 2016-03-0110:30:27 AM | 66.875 | 127.4 | 30.088 | 73.625 |
| 2016-03-0110:30:31 AM | 66.875 | 127.512 | 30.088 | 73.625 |
| 2016-03-0110:30:35 AM | 66.875 | 127.512 | 29.975 | 73.625 |
| 2016-03-0110:30:39 AM | 66.875 | 127.625 | 29.975 | 73.625 |
| 2016-03-0110:30:43 AM | 66.875 | 127.625 | 29.975 | 73.625 |
| 2016-03-0110:30:47 AM | 66.875 | 127.738 | 29.862 | 73.625 |
| 2016-03-0110:30:51 AM | 66.875 | 127.738 | 29.862 | 73.625 |
| 2016-03-0110:30:59 AM | 66.875 | 127.85 | 29.638 | 73.625 |
| 2016-03-0110:31:03 AM | 66.875 | 127.85 | 29.638 | 73.625 |
| 2016-03-0110:31:07 AM | 66.875 | 127.962 | 29.638 | 73.625 |
| 2016-03-0110:31:11 AM | 66.875 | 127.962 | 29.638 | 73.625 |
| 2016-03-0110:31:15 AM | 66.875 | 127.962 | 29.525 | 73.625 |
| 2016-03-0110:31:19 AM | 66.988 | 127.962 | 29.3 | 73.625 |
| 2016-03-0110:31:23 AM | 66.988 | 127.962 | 29.188 | 73.738 |
| 2016-03-0110:31:27 AM | 66.988 | 128.075 | 29.075 | 73.738 |
| 2016-03-0110:31:31 AM | 66.988 | 128.075 | 29.075 | 73.738 |
| 2016-03-0110:31:35 AM | 66.988 | 128.188 | 28.962 | 73.625 |
| 2016-03-0110:31:39 AM | 66.988 | 128.188 | 28.962 | 73.738 |
| 2016-03-0110:31:44 AM | 66.988 | 128.3 | 28.962 | 73.625 |
| 2016-03-0110:31:48 AM | 66.875 | 128.3 | 28.962 | 73.625 |
| 2016-03-0110:31:52 AM | 66.762 | 128.3 | 28.962 | 73.625 |
| 2016-03-0110:31:56 AM | 66.65 | 128.3 | 28.962 | 73.738 |
| 2016-03-0110:32:00 AM | 66.538 | 128.412 | 28.85 | 73.625 |
| 2016-03-0110:32:04 AM | 66.312 | 128.412 | 28.85 | 73.625 |
| 2016-03-0110:32:08 AM | 66.312 | 128.525 | 28.962 | 73.625 |
| 2016-03-0110:32:12 AM | 66.312 | 128.525 | 28.962 | 73.625 |
| 2016-03-0110:32:16 AM | 66.312 | 128.525 | 29.075 | 73.625 |
| 2016-03-0110:32:20 AM | 66.312 | 128.637 | 29.188 | 73.625 |
| 2016-03-0110:32:24 AM | 66.312 | 128.637 | 29.188 | 73.625 |
| 2016-03-0110:32:28 AM | 66.312 | 128.637 | 29.075 | 73.738 |
| 2016-03-0110:32:32 AM | 66.425 | 128.637 | 28.962 | 73.738 |
| 2016-03-0110:32:36 AM | 66.425 | 128.637 | 28.962 | 73.738 |
| 2016-03-0110:32:40 AM | 66.538 | 128.637 | 28.962 | 73.738 |
| 2016-03-0110:32:44 AM | 66.538 | 128.75 | 28.85 | 73.738 |
| 2016-03-0110:32:48 AM | 66.538 | 128.75 | 28.738 | 73.738 |
| 2016-03-0110:32:52 AM | 66.65 | 128.863 | 28.738 | 73.738 |
| 2016-03-0110:32:56 AM | 66.538 | 128.75 | 28.738 | 73.625 |
| 2016-03-0110:33:00 AM | 66.538 | 128.863 | 28.85 | 73.625 |
| 2016-03-0110:33:04 AM | 66.65 | 128.863 | 28.962 | 73.625 |
| 2016-03-0110:33:08 AM | 66.65 | 128.863 | 28.962 | 73.738 |
| 2016-03-0110:33:12 AM | 66.65 | 128.863 | 28.962 | 73.738 |
| 2016-03-0110:33:16 AM | 66.65 | 128.863 | 29.075 | 73.738 |
| 2016-03-0110:33:21 AM | 66.762 | 128.863 | 29.188 | 73.738 |
| 2016-03-0110:33:25 AM | 66.65 | 128.863 | 29.3 | 73.738 |
| 2016-03-0110:33:29 AM | 66.762 | 128.75 | 29.3 | 73.738 |
| 2016-03-0110:33:33 AM | 66.762 | 128.863 | 29.3 | 73.738 |
| 2016-03-0110:33:37 AM | 66.762 | 128.863 | 29.412 | 73.738 |
| 2016-03-0110:33:41 AM | 66.875 | 128.863 | 29.525 | 73.738 |
| 2016-03-0110:33:45 AM | 66.762 | 128.863 | 29.525 | 73.738 |
| 2016-03-0110:33:49 AM | 66.875 | 128.863 | 29.525 | 73.738 |
| 2016-03-0110:33:53 AM | 66.875 | 128.863 | 29.412 | 73.738 |
| 2016-03-0110:33:57 AM | 66.762 | 128.863 | 29.3 | 73.738 |
| 2016-03-0110:34:01 AM | 66.762 | 128.863 | 29.3 | 73.738 |
| 2016-03-0110:34:05 AM | 66.762 | 128.975 | 29.412 | 73.738 |
| 2016-03-0110:34:09 AM | 66.762 | 128.975 | 29.412 | 73.738 |
| 2016-03-0110:34:13 AM | 66.875 | 128.975 | 29.3 | 73.738 |
| 2016-03-0110:34:17 AM | 66.875 | 128.975 | 29.3 | 73.738 |
| 2016-03-0110:34:21 AM | 66.875 | 128.975 | 28.962 | 73.738 |
| 2016-03-0110:34:25 AM | 66.875 | 129.088 | 28.738 | 73.738 |
| 2016-03-0110:34:29 AM | 66.875 | 129.088 | 28.625 | 73.738 |
| 2016-03-0110:34:33 AM | 66.988 | 129.088 | 28.625 | 73.738 |
| 2016-03-0110:34:37 AM | 66.875 | 129.088 | 28.625 | 73.738 |
| 2016-03-0110:34:41 AM | 66.988 | 129.088 | 28.738 | 73.738 |
| 2016-03-0110:34:45 AM | 66.988 | 129.088 | 28.625 | 73.625 |
| 2016-03-0110:34:49 AM | 66.988 | 129.088 | 28.512 | 73.738 |
| 2016-03-0110:34:53 AM | 66.988 | 129.088 | 28.4 | 73.738 |
| 2016-03-0110:34:58 AM | 66.988 | 129.088 | 28.288 | 73.738 |
| 2016-03-0110:35:02 AM | 66.875 | 129.088 | 27.95 | 73.738 |
| 2016-03-0110:35:06 AM | 66.875 | 129.088 | 27.612 | 73.625 |
| 2016-03-0110:35:10 AM | 66.875 | 128.975 | 27.5 | 73.738 |
| 2016-03-0110:35:14 AM | 66.875 | 128.975 | 27.388 | 73.738 |
| 2016-03-0110:35:18 AM | 66.875 | 129.088 | 27.388 | 73.738 |
| 2016-03-0110:35:22 AM | 66.875 | 129.088 | 27.388 | 73.738 |
| 2016-03-0110:35:26 AM | 66.988 | 129.088 | 27.5 | 73.738 |
| 2016-03-0110:35:30 AM | 66.988 | 129.088 | 27.612 | 73.625 |
| 2016-03-0110:35:34 AM | 66.988 | 128.975 | 27.725 | 73.625 |
| 2016-03-0110:35:38 AM | 66.875 | 128.975 | 27.725 | 73.625 |
| 2016-03-0110:35:42 AM | 66.875 | 128.975 | 27.725 | 73.625 |
| 2016-03-0110:35:46 AM | 66.875 | 128.975 | 27.838 | 73.625 |
| 2016-03-0110:35:50 AM | 66.762 | 128.975 | 27.838 | 73.625 |
| 2016-03-0110:35:54 AM | 66.875 | 128.975 | 27.95 | 73.738 |
| 2016-03-0110:35:58 AM | 66.875 | 128.975 | 28.062 | 73.625 |
| 2016-03-0110:36:02 AM | 66.875 | 128.975 | 28.062 | 73.625 |
| 2016-03-0110:36:06 AM | 66.875 | 128.975 | 28.288 | 73.738 |
| 2016-03-0110:36:10 AM | 66.875 | 128.975 | 28.4 | 73.738 |
| 2016-03-0110:36:14 AM | 66.988 | 128.975 | 28.4 | 73.738 |
| 2016-03-0110:36:18 AM | 66.988 | 128.975 | 28.4 | 73.625 |
| 2016-03-0110:36:22 AM | 66.988 | 128.975 | 28.288 | 73.738 |
| 2016-03-0110:36:26 AM | 66.988 | 128.975 | 28.062 | 73.738 |
| 2016-03-0110:36:30 AM | 67.1 | 128.863 | 27.95 | 73.738 |
| 2016-03-0110:36:35 AM | 67.1 | 128.75 | 27.838 | 73.738 |
| 2016-03-0110:36:39 AM | 67.1 | 128.525 | 27.95 | 73.738 |
| 2016-03-0110:36:43 AM | 67.1 | 128.3 | 27.95 | 73.738 |
| 2016-03-0110:36:47 AM | 66.988 | 128.075 | 28.062 | 73.738 |
| 2016-03-0110:36:51 AM | 66.988 | 128.075 | 28.175 | 73.738 |
| 2016-03-0110:36:55 AM | 66.988 | 127.85 | 28.175 | 73.738 |
| 2016-03-0110:36:59 AM | 66.988 | 127.85 | 28.175 | 73.738 |
| 2016-03-0110:37:03 AM | 66.875 | 127.738 | 28.175 | 73.738 |
| 2016-03-0110:37:07 AM | 66.875 | 127.625 | 28.288 | 73.738 |
| 2016-03-0110:37:11 AM | 66.875 | 127.625 | 28.288 | 73.738 |
| 2016-03-0110:37:15 AM | 66.762 | 127.512 | 28.512 | 73.738 |
| 2016-03-0110:37:19 AM | 66.762 | 127.512 | 28.512 | 73.738 |
| 2016-03-0110:37:23 AM | 66.762 | 127.512 | 28.625 | 73.738 |
| 2016-03-0110:37:27 AM | 66.65 | 127.512 | 28.738 | 73.738 |
| 2016-03-0110:37:31 AM | 66.538 | 127.512 | 28.738 | 73.738 |
| 2016-03-0110:37:35 AM | 66.538 | 127.512 | 28.738 | 73.738 |
| 2016-03-0110:37:39 AM | 66.538 | 127.4 | 28.85 | 73.738 |
| 2016-03-0110:37:43 AM | 66.538 | 127.4 | 28.962 | 73.738 |
| 2016-03-0110:37:47 AM | 66.65 | 127.4 | 28.962 | 73.738 |
| 2016-03-0110:37:51 AM | 66.65 | 127.4 | 28.962 | 73.738 |
| 2016-03-0110:37:55 AM | 66.65 | 127.4 | 28.962 | 73.738 |
| 2016-03-0110:37:59 AM | 66.65 | 127.4 | 28.85 | 73.738 |
| 2016-03-0110:38:03 AM | 66.65 | 127.4 | 28.85 | 73.738 |
| 2016-03-0110:38:07 AM | 66.65 | 127.4 | 28.85 | 73.738 |
| 2016-03-0110:38:11 AM | 66.65 | 127.512 | 28.738 | 73.738 |
| 2016-03-0110:38:16 AM | 66.65 | 127.512 | 28.738 | 73.738 |
| 2016-03-0110:38:20 AM | 66.65 | 127.512 | 28.85 | 73.738 |
| 2016-03-0110:38:24 AM | 66.65 | 127.512 | 28.85 | 73.738 |
| 2016-03-0110:38:28 AM | 66.65 | 127.625 | 28.85 | 73.738 |
| 2016-03-0110:38:32 AM | 66.65 | 127.625 | 28.625 | 73.738 |
| 2016-03-0110:38:36 AM | 66.762 | 127.738 | 28.4 | 73.738 |
| 2016-03-0110:38:40 AM | 66.762 | 127.738 | 28.512 | 73.738 |
| 2016-03-0110:38:44 AM | 66.762 | 127.738 | 28.4 | 73.625 |
| 2016-03-0110:38:48 AM | 66.762 | 127.738 | 28.512 | 73.738 |
| 2016-03-0110:38:52 AM | 66.762 | 127.85 | 28.625 | 73.738 |
| 2016-03-0110:38:56 AM | 66.762 | 127.85 | 28.625 | 73.738 |
| 2016-03-0110:39:00 AM | 66.762 | 127.85 | 28.738 | 73.738 |
| 2016-03-0110:39:04 AM | 66.762 | 127.85 | 28.962 | 73.738 |
| 2016-03-0110:39:08 AM | 66.762 | 127.962 | 28.962 | 73.738 |
| 2016-03-0110:39:12 AM | 66.875 | 127.962 | 28.962 | 73.738 |
| 2016-03-0110:39:16 AM | 66.875 | 127.962 | 29.075 | 73.738 |
| 2016-03-0110:39:20 AM | 66.988 | 127.962 | 29.075 | 73.738 |
| 2016-03-0110:39:24 AM | 66.988 | 127.962 | 29.075 | 73.738 |
| 2016-03-0110:39:28 AM | 67.1 | 128.075 | 29.075 | 73.738 |
| 2016-03-0110:39:32 AM | 67.1 | 128.075 | 29.075 | 73.738 |
| 2016-03-0110:39:36 AM | 67.1 | 128.075 | 29.188 | 73.738 |
| 2016-03-0110:39:40 AM | 67.212 | 128.188 | 29.3 | 73.738 |
| 2016-03-0110:39:45 AM | 67.212 | 128.188 | 29.412 | 73.738 |
| 2016-03-0110:39:49 AM | 67.212 | 128.3 | 29.525 | 73.738 |
| 2016-03-0110:39:53 AM | 67.1 | 128.3 | 29.525 | 73.738 |
| 2016-03-0110:39:57 AM | 67.1 | 128.3 | 29.638 | 73.738 |
| 2016-03-0110:40:01 AM | 66.988 | 128.3 | 29.638 | 73.738 |
| 2016-03-0110:40:05 AM | 67.1 | 128.412 | 29.75 | 73.738 |
| 2016-03-0110:40:09 AM | 67.1 | 128.3 | 29.862 | 73.738 |
| 2016-03-0110:40:13 AM | 67.1 | 128.412 | 29.75 | 73.738 |
| 2016-03-0110:40:17 AM | 67.1 | 128.525 | 29.638 | 73.738 |
| 2016-03-0110:40:21 AM | 67.212 | 128.412 | 29.638 | 73.738 |
| 2016-03-0110:40:25 AM | 67.212 | 128.525 | 29.75 | 73.738 |
| 2016-03-0110:40:29 AM | 67.212 | 128.525 | 29.75 | 73.738 |
| 2016-03-0110:40:33 AM | 67.212 | 128.637 | 29.638 | 73.738 |
| 2016-03-0110:40:37 AM | 67.212 | 128.637 | 29.638 | 73.738 |
| 2016-03-0110:40:41 AM | 67.212 | 128.637 | 29.525 | 73.738 |
| 2016-03-0110:40:45 AM | 67.212 | 128.637 | 29.412 | 73.738 |
| 2016-03-0110:40:49 AM | 67.212 | 128.75 | 29.412 | 73.738 |
| 2016-03-0110:40:53 AM | 67.212 | 128.75 | 29.412 | 73.738 |
| 2016-03-0110:40:57 AM | 67.1 | 128.75 | 29.412 | 73.738 |
| 2016-03-0110:41:02 AM | 67.1 | 128.75 | 29.412 | 73.738 |
| 2016-03-0110:41:06 AM | 66.988 | 128.863 | 29.638 | 73.738 |
| 2016-03-0110:41:10 AM | 66.762 | 128.975 | 29.638 | 73.738 |
| 2016-03-0110:41:14 AM | 66.65 | 128.975 | 29.638 | 73.738 |
| 2016-03-0110:41:18 AM | 66.425 | 128.975 | 29.75 | 73.738 |
| 2016-03-0110:41:22 AM | 66.2 | 128.975 | 29.862 | 73.738 |
| 2016-03-0110:41:26 AM | 66.2 | 129.088 | 29.975 | 73.738 |
| 2016-03-0110:41:30 AM | 66.2 | 129.2 | 29.975 | 73.738 |
| 2016-03-0110:41:34 AM | 66.2 | 129.2 | 29.975 | 73.738 |
| 2016-03-0110:41:38 AM | 66.2 | 129.312 | 30.088 | 73.738 |
| 2016-03-0110:41:42 AM | 66.2 | 129.312 | 30.312 | 73.85 |
| 2016-03-0110:41:46 AM | 66.2 | 129.425 | 30.312 | 73.738 |
| 2016-03-0110:41:50 AM | 66.312 | 129.425 | 30.312 | 73.738 |
| 2016-03-0110:41:54 AM | 66.312 | 129.538 | 30.312 | 73.738 |
| 2016-03-0110:41:58 AM | 66.312 | 129.538 | 30.2 | 73.738 |
| 2016-03-0110:42:02 AM | 66.425 | 129.65 | 29.862 | 73.738 |
| 2016-03-0110:42:06 AM | 66.425 | 129.65 | 29.75 | 73.738 |
| 2016-03-0110:42:10 AM | 66.425 | 129.762 | 29.638 | 73.738 |
| 2016-03-0110:42:15 AM | 66.538 | 129.762 | 29.525 | 73.738 |
| 2016-03-0110:42:19 AM | 66.65 | 129.762 | 29.638 | 73.738 |
| 2016-03-0110:42:23 AM | 66.65 | 129.875 | 29.638 | 73.738 |
| 2016-03-0110:42:27 AM | 66.762 | 129.875 | 29.638 | 73.738 |
| 2016-03-0110:42:31 AM | 66.875 | 129.988 | 29.638 | 73.738 |
| 2016-03-0110:42:35 AM | 66.762 | 129.988 | 29.638 | 73.738 |
| 2016-03-0110:42:39 AM | 66.762 | 130.1 | 29.638 | 73.738 |
| 2016-03-0110:42:43 AM | 66.762 | 130.1 | 29.638 | 73.738 |
| 2016-03-0110:42:47 AM | 66.875 | 130.212 | 29.75 | 73.738 |
| 2016-03-0110:42:51 AM | 66.875 | 130.212 | 29.75 | 73.738 |
| 2016-03-0110:42:55 AM | 66.875 | 130.325 | 29.75 | 73.738 |
| 2016-03-0110:42:59 AM | 66.875 | 130.325 | 29.75 | 73.738 |
| 2016-03-0110:43:03 AM | 66.875 | 130.325 | 29.75 | 73.738 |
| 2016-03-0110:43:07 AM | 66.762 | 130.438 | 29.75 | 73.738 |
| 2016-03-0110:43:11 AM | 66.762 | 130.438 | 29.525 | 73.738 |
| 2016-03-0110:43:15 AM | 66.875 | 130.55 | 29.412 | 73.738 |
| 2016-03-0110:43:19 AM | 66.875 | 130.662 | 29.188 | 73.738 |
| 2016-03-0110:43:23 AM | 66.875 | 130.662 | 28.962 | 73.738 |
| 2016-03-0110:43:27 AM | 66.875 | 130.662 | 28.738 | 73.738 |
| 2016-03-0110:43:31 AM | 66.988 | 130.662 | 28.512 | 73.625 |
| 2016-03-0110:43:35 AM | 66.988 | 130.775 | 28.4 | 73.738 |
| 2016-03-0110:43:39 AM | 66.988 | 130.775 | 28.288 | 73.738 |
| 2016-03-0110:43:43 AM | 66.988 | 130.887 | 28.288 | 73.738 |
| 2016-03-0110:43:48 AM | 66.988 | 130.887 | 28.4 | 73.625 |
| 2016-03-0110:43:52 AM | 66.988 | 130.887 | 28.4 | 73.738 |
| 2016-03-0110:43:56 AM | 67.1 | 131 | 28.512 | 73.738 |
| 2016-03-0110:44:00 AM | 66.988 | 131 | 28.512 | 73.738 |
| 2016-03-0110:44:04 AM | 66.988 | 131 | 28.512 | 73.738 |
| 2016-03-0110:44:08 AM | 66.988 | 131 | 28.625 | 73.738 |
| 2016-03-0110:44:12 AM | 66.875 | 131.112 | 28.738 | 73.738 |
| 2016-03-0110:44:16 AM | 66.875 | 131.112 | 28.85 | 73.738 |
| 2016-03-0110:44:20 AM | 66.875 | 131.112 | 28.962 | 73.738 |
| 2016-03-0110:44:24 AM | 66.875 | 131.225 | 28.962 | 73.625 |
| 2016-03-0110:44:28 AM | 66.875 | 131.225 | 28.85 | 73.625 |
| 2016-03-0110:44:32 AM | 66.875 | 131.225 | 28.962 | 73.625 |
| 2016-03-0110:44:36 AM | 66.875 | 131.338 | 28.962 | 73.625 |
| 2016-03-0110:44:40 AM | 66.875 | 131.338 | 29.075 | 73.625 |
| 2016-03-0110:44:44 AM | 66.875 | 131.338 | 29.188 | 73.625 |
| 2016-03-0110:44:48 AM | 66.875 | 131.45 | 29.075 | 73.625 |
| 2016-03-0110:44:52 AM | 66.875 | 131.45 | 29.075 | 73.625 |
| 2016-03-0110:44:56 AM | 66.875 | 131.45 | 29.188 | 73.625 |
| 2016-03-0110:45:00 AM | 66.875 | 131.45 | 29.3 | 73.625 |
| 2016-03-0110:45:04 AM | 66.875 | 131.562 | 29.412 | 73.625 |
| 2016-03-0110:45:08 AM | 66.875 | 131.562 | 29.525 | 73.738 |
| 2016-03-0110:45:12 AM | 66.875 | 131.562 | 29.638 | 73.625 |
| 2016-03-0110:45:17 AM | 66.988 | 131.562 | 29.525 | 73.625 |
| 2016-03-0110:45:21 AM | 66.988 | 131.562 | 29.525 | 73.625 |
| 2016-03-0110:45:25 AM | 66.988 | 131.675 | 29.638 | 73.625 |
| 2016-03-0110:45:29 AM | 67.1 | 131.675 | 29.638 | 73.738 |
| 2016-03-0110:45:33 AM | 67.1 | 131.788 | 29.75 | 73.625 |
| 2016-03-0110:45:37 AM | 67.212 | 131.788 | 29.75 | 73.738 |
| 2016-03-0110:45:41 AM | 67.212 | 131.788 | 29.862 | 73.738 |
| 2016-03-0110:45:45 AM | 67.212 | 131.788 | 29.862 | 73.738 |
| 2016-03-0110:45:49 AM | 67.325 | 131.9 | 29.862 | 73.738 |
| 2016-03-0110:45:53 AM | 67.325 | 131.9 | 29.862 | 73.738 |
| 2016-03-0110:45:57 AM | 67.325 | 131.9 | 29.75 | 73.738 |
| 2016-03-0110:46:01 AM | 67.325 | 131.9 | 29.638 | 73.738 |
| 2016-03-0110:46:05 AM | 67.325 | 132.012 | 29.638 | 73.625 |
| 2016-03-0110:46:09 AM | 67.325 | 132.012 | 29.638 | 73.738 |
| 2016-03-0110:46:13 AM | 67.212 | 132.125 | 29.75 | 73.625 |
| 2016-03-0110:46:18 AM | 67.1 | 132.125 | 29.862 | 73.738 |
| 2016-03-0110:46:22 AM | 67.1 | 132.125 | 29.975 | 73.738 |
| 2016-03-0110:46:26 AM | 66.988 | 132.238 | 29.975 | 73.738 |
| 2016-03-0110:46:30 AM | 66.988 | 132.238 | 30.088 | 73.738 |
| 2016-03-0110:46:34 AM | 66.988 | 132.238 | 30.2 | 73.738 |
| 2016-03-0110:46:38 AM | 66.988 | 132.35 | 30.2 | 73.738 |
| 2016-03-0110:46:42 AM | 66.988 | 132.462 | 30.312 | 73.738 |
| 2016-03-0110:46:46 AM | 67.1 | 132.462 | 30.2 | 73.738 |
| 2016-03-0110:46:50 AM | 67.1 | 132.462 | 30.2 | 73.738 |
| 2016-03-0110:46:54 AM | 67.1 | 132.462 | 30.088 | 73.738 |
| 2016-03-0110:46:58 AM | 67.212 | 132.462 | 29.75 | 73.738 |
| 2016-03-0110:47:02 AM | 67.212 | 132.575 | 29.525 | 73.625 |
| 2016-03-0110:47:06 AM | 67.438 | 132.575 | 29.525 | 73.738 |
| 2016-03-0110:47:10 AM | 67.438 | 132.575 | 29.3 | 73.625 |
| 2016-03-0110:47:14 AM | 67.55 | 132.688 | 29.075 | 73.738 |
| 2016-03-0110:47:19 AM | 67.662 | 132.688 | 28.85 | 73.625 |
| 2016-03-0110:47:23 AM | 67.662 | 132.688 | 28.85 | 73.625 |
| 2016-03-0110:47:27 AM | 67.662 | 132.688 | 28.962 | 73.625 |
| 2016-03-0110:47:31 AM | 67.662 | 132.688 | 28.962 | 73.625 |
| 2016-03-0110:47:35 AM | 67.775 | 132.688 | 29.075 | 73.738 |
| 2016-03-0110:47:39 AM | 67.775 | 132.688 | 29.075 | 73.625 |
| 2016-03-0110:47:43 AM | 67.775 | 132.688 | 29.075 | 73.625 |
| 2016-03-0110:47:47 AM | 67.888 | 132.688 | 29.075 | 73.625 |
| 2016-03-0110:47:51 AM | 68 | 132.688 | 29.188 | 73.625 |
| 2016-03-0110:47:55 AM | 68 | 132.688 | 29.3 | 73.625 |
| 2016-03-0110:47:59 AM | 67.888 | 132.688 | 29.188 | 73.625 |
| 2016-03-0110:48:03 AM | 68.112 | 132.688 | 29.188 | 73.625 |
| 2016-03-0110:48:07 AM | 68.112 | 132.688 | 29.188 | 73.625 |
| 2016-03-0110:48:11 AM | 68.112 | 132.688 | 29.188 | 73.625 |
| 2016-03-0110:48:15 AM | 68.225 | 132.688 | 29.188 | 73.625 |
| 2016-03-0110:48:20 AM | 68.225 | 132.8 | 29.075 | 73.625 |
| 2016-03-0110:48:24 AM | 68.225 | 132.8 | 29.075 | 73.625 |
| 2016-03-0110:48:28 AM | 68.225 | 132.8 | 28.962 | 73.625 |
| 2016-03-0110:48:32 AM | 68.225 | 132.8 | 28.85 | 73.625 |
| 2016-03-0110:48:36 AM | 68.112 | 132.8 | 28.738 | 73.625 |
| 2016-03-0110:48:40 AM | 68.112 | 132.688 | 28.738 | 73.625 |
| 2016-03-0110:48:44 AM | 68.112 | 132.688 | 28.738 | 73.625 |
| 2016-03-0110:48:48 AM | 68.112 | 132.688 | 28.738 | 73.512 |
| 2016-03-0110:48:52 AM | 68 | 132.688 | 28.85 | 73.512 |
| 2016-03-0110:48:56 AM | 68 | 132.688 | 28.962 | 73.512 |
| 2016-03-0110:49:00 AM | 68 | 132.688 | 28.962 | 73.512 |
| 2016-03-0110:49:04 AM | 68 | 132.8 | 28.738 | 73.512 |
| 2016-03-0110:49:08 AM | 68 | 132.8 | 28.738 | 73.512 |
| 2016-03-0110:49:12 AM | 68.112 | 132.8 | 28.625 | 73.512 |
| 2016-03-0110:49:16 AM | 68 | 132.8 | 28.512 | 73.625 |
| 2016-03-0110:49:20 AM | 68.112 | 132.8 | 28.512 | 73.512 |
| 2016-03-0110:49:24 AM | 68 | 132.8 | 28.625 | 73.512 |
| 2016-03-0110:49:28 AM | 68 | 132.912 | 28.738 | 73.512 |
| 2016-03-0110:49:32 AM | 68 | 132.912 | 28.85 | 73.625 |
| 2016-03-0110:49:36 AM | 67.888 | 132.912 | 28.85 | 73.625 |
| 2016-03-0110:49:40 AM | 67.888 | 132.912 | 28.962 | 73.625 |
| 2016-03-0110:49:45 AM | 67.888 | 132.912 | 29.075 | 73.625 |
| 2016-03-0110:49:49 AM | 67.775 | 132.912 | 29.188 | 73.625 |
| 2016-03-0110:49:53 AM | 67.775 | 132.912 | 29.3 | 73.625 |
| 2016-03-0110:49:57 AM | 67.775 | 132.912 | 29.188 | 73.625 |
| 2016-03-0110:50:01 AM | 67.775 | 133.025 | 29.3 | 73.625 |
| 2016-03-0110:50:05 AM | 67.775 | 133.025 | 29.3 | 73.625 |
| 2016-03-0110:50:09 AM | 67.775 | 133.025 | 29.3 | 73.625 |
| 2016-03-0110:50:13 AM | 67.662 | 133.025 | 29.188 | 73.625 |
| 2016-03-0110:50:17 AM | 67.662 | 133.138 | 29.075 | 73.625 |
| 2016-03-0110:50:21 AM | 67.55 | 133.025 | 28.962 | 73.625 |
| 2016-03-0110:50:25 AM | 67.55 | 133.138 | 28.962 | 73.625 |
| 2016-03-0110:50:29 AM | 67.325 | 133.25 | 28.738 | 73.625 |
| 2016-03-0110:50:33 AM | 67.212 | 133.25 | 28.85 | 73.625 |
| 2016-03-0110:50:37 AM | 67.1 | 133.25 | 28.738 | 73.625 |
| 2016-03-0110:50:41 AM | 67.1 | 133.25 | 28.738 | 73.625 |
| 2016-03-0110:50:45 AM | 67.1 | 133.25 | 28.625 | 73.625 |
| 2016-03-0110:50:49 AM | 67.1 | 133.25 | 28.625 | 73.625 |
| 2016-03-0110:50:53 AM | 67.1 | 133.25 | 28.625 | 73.738 |
| 2016-03-0110:50:57 AM | 67.1 | 133.362 | 28.738 | 73.738 |
| 2016-03-0110:51:01 AM | 67.1 | 133.362 | 28.85 | 73.625 |
| 2016-03-0110:51:05 AM | 67.1 | 133.362 | 29.075 | 73.738 |
| 2016-03-0110:51:10 AM | 67.1 | 133.475 | 29.188 | 73.625 |
| 2016-03-0110:51:14 AM | 67.1 | 133.475 | 29.3 | 73.625 |
| 2016-03-0110:51:18 AM | 66.988 | 133.475 | 29.3 | 73.738 |
| 2016-03-0110:51:22 AM | 67.1 | 133.475 | 29.412 | 73.625 |
| 2016-03-0110:51:26 AM | 67.1 | 133.475 | 29.3 | 73.738 |
| 2016-03-0110:51:30 AM | 67.1 | 133.588 | 29.412 | 73.738 |
| 2016-03-0110:51:34 AM | 67.1 | 133.588 | 29.525 | 73.738 |
| 2016-03-0110:51:38 AM | 67.1 | 133.588 | 29.525 | 73.738 |
| 2016-03-0110:51:42 AM | 67.1 | 133.588 | 29.638 | 73.738 |
| 2016-03-0110:51:46 AM | 67.1 | 133.7 | 29.75 | 73.738 |
| 2016-03-0110:51:50 AM | 67.212 | 133.7 | 29.75 | 73.738 |
| 2016-03-0110:51:58 AM | 67.212 | 133.7 | 29.862 | 73.738 |
| 2016-03-0110:52:02 AM | 67.212 | 133.7 | 29.975 | 73.738 |
| 2016-03-0110:52:06 AM | 67.212 | 133.7 | 30.088 | 73.738 |
| 2016-03-0110:52:10 AM | 67.325 | 133.812 | 30.2 | 73.738 |
| 2016-03-0110:52:15 AM | 67.325 | 133.812 | 30.312 | 73.738 |
| 2016-03-0110:52:19 AM | 67.325 | 133.925 | 30.312 | 73.625 |
| 2016-03-0110:52:23 AM | 67.325 | 133.925 | 30.312 | 73.738 |
| 2016-03-0110:52:27 AM | 67.212 | 133.925 | 30.312 | 73.738 |
| 2016-03-0110:52:31 AM | 67.325 | 133.925 | 30.312 | 73.738 |
| 2016-03-0110:52:35 AM | 67.325 | 134.038 | 30.312 | 73.738 |
| 2016-03-0110:52:39 AM | 67.325 | 134.038 | 30.312 | 73.738 |
| 2016-03-0110:52:43 AM | 67.438 | 134.15 | 30.312 | 73.738 |
| 2016-03-0110:52:47 AM | 67.325 | 134.15 | 30.425 | 73.738 |
| 2016-03-0110:52:51 AM | 67.212 | 134.15 | 30.425 | 73.738 |
| 2016-03-0110:52:55 AM | 67.212 | 134.262 | 30.538 | 73.625 |
| 2016-03-0110:52:59 AM | 67.212 | 134.375 | 30.538 | 73.738 |
| 2016-03-0110:53:03 AM | 67.212 | 134.375 | 30.538 | 73.738 |
| 2016-03-0110:53:07 AM | 67.212 | 134.375 | 30.538 | 73.738 |
| 2016-03-0110:53:11 AM | 67.325 | 134.488 | 30.538 | 73.738 |
| 2016-03-0110:53:16 AM | 67.325 | 134.488 | 30.538 | 73.738 |
| 2016-03-0110:53:20 AM | 67.438 | 134.488 | 30.65 | 73.738 |
| 2016-03-0110:53:24 AM | 67.325 | 134.488 | 30.538 | 73.738 |
| 2016-03-0110:53:28 AM | 67.438 | 134.6 | 30.65 | 73.738 |
| 2016-03-0110:53:32 AM | 67.438 | 134.488 | 30.762 | 73.738 |
| 2016-03-0110:53:36 AM | 67.438 | 134.6 | 30.538 | 73.738 |
| 2016-03-0110:53:40 AM | 67.438 | 134.6 | 30.312 | 73.738 |
| 2016-03-0110:53:44 AM | 67.438 | 134.712 | 30.312 | 73.738 |
| 2016-03-0110:53:48 AM | 67.438 | 134.712 | 30.312 | 73.738 |
| 2016-03-0110:53:52 AM | 67.438 | 134.712 | 30.088 | 73.738 |
| 2016-03-0110:53:56 AM | 67.438 | 134.712 | 29.75 | 73.738 |
| 2016-03-0110:54:00 AM | 67.438 | 134.825 | 29.412 | 73.738 |
| 2016-03-0110:54:04 AM | 67.438 | 134.825 | 28.962 | 73.738 |
| 2016-03-0110:54:08 AM | 67.438 | 134.825 | 28.85 | 73.738 |
| 2016-03-0110:54:12 AM | 67.438 | 134.825 | 28.738 | 73.738 |
| 2016-03-0110:54:16 AM | 67.438 | 134.825 | 28.738 | 73.738 |
| 2016-03-0110:54:21 AM | 67.438 | 134.938 | 28.85 | 73.738 |
| 2016-03-0110:54:25 AM | 67.438 | 134.938 | 28.85 | 73.738 |
| 2016-03-0110:54:29 AM | 67.55 | 134.938 | 28.962 | 73.738 |
| 2016-03-0110:54:33 AM | 67.438 | 134.938 | 29.075 | 73.738 |
| 2016-03-0110:54:37 AM | 67.438 | 134.938 | 29.075 | 73.625 |
| 2016-03-0110:54:41 AM | 67.438 | 134.938 | 29.075 | 73.738 |
| 2016-03-0110:54:45 AM | 67.438 | 134.938 | 29.075 | 73.625 |
| 2016-03-0110:54:49 AM | 67.438 | 134.938 | 29.188 | 73.625 |
| 2016-03-0110:54:53 AM | 67.438 | 134.938 | 29.3 | 73.625 |
| 2016-03-0110:54:57 AM | 67.438 | 134.938 | 29.412 | 73.625 |
| 2016-03-0110:55:01 AM | 67.55 | 134.938 | 29.412 | 73.738 |
| 2016-03-0110:55:05 AM | 67.438 | 135.05 | 29.412 | 73.738 |
| 2016-03-0110:55:09 AM | 67.55 | 134.938 | 29.3 | 73.738 |
| 2016-03-0110:55:13 AM | 67.438 | 135.05 | 29.188 | 73.738 |
| 2016-03-0110:55:17 AM | 67.438 | 135.05 | 29.3 | 73.738 |
| 2016-03-0110:55:21 AM | 67.55 | 135.05 | 29.3 | 73.738 |
| 2016-03-0110:55:25 AM | 67.438 | 135.05 | 29.412 | 73.625 |
| 2016-03-0110:55:29 AM | 67.438 | 135.05 | 29.525 | 73.625 |
| 2016-03-0110:55:33 AM | 67.438 | 135.05 | 29.525 | 73.738 |
| 2016-03-0110:55:37 AM | 67.438 | 135.162 | 29.638 | 73.738 |
| 2016-03-0110:55:41 AM | 67.438 | 135.162 | 29.638 | 73.738 |
| 2016-03-0110:55:45 AM | 67.438 | 135.162 | 29.525 | 73.625 |
| 2016-03-0110:55:49 AM | 67.438 | 135.162 | 29.525 | 73.625 |
| 2016-03-0110:55:53 AM | 67.438 | 135.275 | 29.412 | 73.625 |
| 2016-03-0110:55:57 AM | 67.438 | 135.162 | 29.3 | 73.738 |
| 2016-03-0110:56:01 AM | 67.438 | 135.275 | 29.3 | 73.738 |
| 2016-03-0110:56:05 AM | 67.438 | 135.275 | 29.3 | 73.625 |
| 2016-03-0110:56:09 AM | 67.438 | 135.275 | 29.525 | 73.625 |
| 2016-03-0110:56:13 AM | 67.438 | 135.275 | 29.638 | 73.738 |
| 2016-03-0110:56:17 AM | 67.325 | 135.388 | 29.638 | 73.738 |
| 2016-03-0110:56:21 AM | 67.438 | 135.275 | 29.638 | 73.738 |
| 2016-03-0110:56:25 AM | 67.438 | 135.388 | 29.75 | 73.738 |
| 2016-03-0110:56:29 AM | 67.438 | 135.388 | 29.75 | 73.738 |
| 2016-03-0110:56:33 AM | 67.438 | 135.5 | 29.862 | 73.625 |
| 2016-03-0110:56:37 AM | 67.325 | 135.5 | 29.975 | 73.625 |
| 2016-03-0110:56:41 AM | 67.438 | 135.5 | 30.088 | 73.625 |
| 2016-03-0110:56:45 AM | 67.438 | 135.5 | 30.2 | 73.625 |
| 2016-03-0110:56:49 AM | 67.438 | 135.612 | 30.088 | 73.625 |
| 2016-03-0110:56:54 AM | 67.325 | 135.612 | 30.088 | 73.738 |
| 2016-03-0110:56:58 AM | 67.438 | 135.612 | 30.088 | 73.738 |
| 2016-03-0110:57:02 AM | 67.325 | 135.725 | 29.975 | 73.738 |
| 2016-03-0110:57:06 AM | 67.438 | 135.725 | 29.862 | 73.738 |
| 2016-03-0110:57:10 AM | 67.438 | 135.725 | 29.75 | 73.738 |
| 2016-03-0110:57:14 AM | 67.325 | 135.725 | 29.75 | 73.738 |
| 2016-03-0110:57:18 AM | 67.438 | 135.838 | 29.75 | 73.738 |
| 2016-03-0110:57:22 AM | 67.325 | 135.838 | 29.862 | 73.738 |
| 2016-03-0110:57:26 AM | 67.325 | 135.95 | 29.975 | 73.738 |
| 2016-03-0110:57:30 AM | 67.325 | 135.95 | 30.2 | 73.738 |
| 2016-03-0110:57:34 AM | 67.438 | 135.95 | 30.2 | 73.738 |
| 2016-03-0110:57:38 AM | 67.438 | 135.95 | 30.2 | 73.738 |
| 2016-03-0110:57:42 AM | 67.325 | 136.062 | 30.088 | 73.738 |
| 2016-03-0110:57:46 AM | 67.438 | 136.062 | 30.2 | 73.738 |
| 2016-03-0110:57:50 AM | 67.438 | 136.062 | 30.312 | 73.738 |
| 2016-03-0110:57:54 AM | 67.325 | 136.175 | 30.425 | 73.85 |
| 2016-03-0110:57:58 AM | 67.325 | 136.288 | 30.538 | 73.738 |
| 2016-03-0110:58:02 AM | 67.438 | 136.288 | 30.538 | 73.738 |
| 2016-03-0110:58:06 AM | 67.325 | 136.4 | 30.65 | 73.738 |
| 2016-03-0110:58:10 AM | 67.325 | 136.4 | 30.65 | 73.85 |
| 2016-03-0110:58:14 AM | 67.438 | 136.4 | 30.762 | 73.85 |
| 2016-03-0110:58:18 AM | 67.438 | 136.512 | 30.762 | 73.738 |
| 2016-03-0110:58:22 AM | 67.438 | 136.512 | 30.875 | 73.85 |
| 2016-03-0110:58:26 AM | 67.438 | 136.625 | 30.988 | 73.85 |
| 2016-03-0110:58:30 AM | 67.438 | 136.625 | 31.212 | 73.85 |
| 2016-03-0110:58:34 AM | 67.55 | 136.738 | 31.325 | 73.85 |
| 2016-03-0110:58:38 AM | 67.438 | 136.738 | 31.438 | 73.85 |
| 2016-03-0110:58:42 AM | 67.438 | 136.85 | 31.55 | 73.85 |
| 2016-03-0110:58:46 AM | 67.55 | 136.85 | 31.662 | 73.85 |
| 2016-03-0110:58:50 AM | 67.55 | 136.85 | 31.662 | 73.85 |
| 2016-03-0110:58:54 AM | 67.438 | 136.962 | 31.662 | 73.85 |
| 2016-03-0110:58:58 AM | 67.55 | 137.075 | 31.662 | 73.85 |
| 2016-03-0110:59:02 AM | 67.55 | 137.075 | 31.438 | 73.85 |
| 2016-03-0110:59:06 AM | 67.55 | 137.188 | 31.325 | 73.85 |
| 2016-03-0110:59:10 AM | 67.55 | 137.188 | 31.1 | 73.85 |
| 2016-03-0110:59:14 AM | 67.662 | 137.3 | 30.988 | 73.85 |
| 2016-03-0110:59:18 AM | 67.662 | 137.3 | 30.988 | 73.85 |
| 2016-03-0110:59:22 AM | 67.775 | 137.3 | 30.875 | 73.85 |
| 2016-03-0110:59:26 AM | 67.888 | 137.3 | 30.762 | 73.85 |
| 2016-03-0110:59:30 AM | 68 | 137.412 | 30.65 | 73.85 |
| 2016-03-0110:59:34 AM | 68 | 137.412 | 30.538 | 73.962 |
| 2016-03-0110:59:38 AM | 68 | 137.412 | 30.538 | 73.962 |
| 2016-03-0110:59:42 AM | 68.112 | 137.525 | 30.65 | 73.962 |
| 2016-03-0110:59:46 AM | 68.112 | 137.638 | 30.65 | 73.962 |
| 2016-03-0110:59:50 AM | 68.225 | 137.75 | 30.65 | 73.962 |
| 2016-03-0110:59:54 AM | 68.225 | 137.75 | 30.762 | 73.962 |
| 2016-03-0110:59:58 AM | 68.225 | 137.75 | 30.762 | 73.962 |
| 2016-03-0111:00:02 AM | 68.225 | 137.75 | 30.875 | 73.962 |
| 2016-03-0111:00:06 AM | 68.225 | 137.75 | 30.875 | 73.962 |
| 2016-03-0111:00:10 AM | 68.225 | 137.862 | 30.988 | 73.962 |
| 2016-03-0111:00:14 AM | 68.225 | 137.862 | 30.875 | 73.962 |
| 2016-03-0111:00:18 AM | 68.225 | 137.862 | 30.875 | 73.962 |
| 2016-03-0111:00:22 AM | 68.225 | 137.862 | 30.875 | 73.962 |
| 2016-03-0111:00:26 AM | 68.112 | 137.862 | 30.875 | 73.962 |
| 2016-03-0111:00:30 AM | 68.225 | 137.862 | 30.762 | 73.962 |
| 2016-03-0111:00:34 AM | 68.112 | 137.862 | 30.875 | 73.962 |
| 2016-03-0111:00:38 AM | 68.225 | 137.862 | 30.875 | 73.962 |
| 2016-03-0111:00:42 AM | 68.225 | 137.862 | 30.988 | 73.962 |
| 2016-03-0111:00:46 AM | 68.225 | 137.975 | 30.988 | 73.962 |
| 2016-03-0111:00:50 AM | 68.338 | 137.975 | 30.988 | 74.075 |
| 2016-03-0111:00:54 AM | 68.338 | 138.088 | 31.212 | 73.962 |
| 2016-03-0111:00:58 AM | 68.338 | 138.088 | 31.212 | 73.962 |
| 2016-03-0111:01:03 AM | 68.338 | 138.088 | 31.212 | 73.962 |
| 2016-03-0111:01:07 AM | 68.338 | 138.088 | 31.212 | 74.075 |
| 2016-03-0111:01:11 AM | 68.338 | 138.088 | 31.325 | 74.075 |
| 2016-03-0111:01:15 AM | 68.338 | 138.2 | 31.438 | 73.962 |
| 2016-03-0111:01:19 AM | 68.338 | 138.2 | 31.325 | 74.075 |
| 2016-03-0111:01:23 AM | 68.338 | 138.2 | 31.325 | 74.075 |
| 2016-03-0111:01:27 AM | 68.338 | 138.2 | 31.212 | 74.075 |
| 2016-03-0111:01:31 AM | 68.338 | 138.2 | 31.325 | 74.075 |
| 2016-03-0111:01:35 AM | 68.225 | 138.2 | 31.325 | 74.075 |
| 2016-03-0111:01:39 AM | 68.225 | 138.2 | 31.325 | 74.075 |
| 2016-03-0111:01:43 AM | 68.225 | 138.2 | 31.325 | 74.075 |
| 2016-03-0111:01:50 AM | 68.225 | 138.312 | 31.662 | 73.962 |
| 2016-03-0111:01:54 AM | 68.225 | 138.312 | 31.662 | 74.075 |
| 2016-03-0111:01:58 AM | 68.225 | 138.312 | 31.775 | 74.075 |
| 2016-03-0111:02:02 AM | 68.338 | 138.312 | 31.888 | 74.075 |
| 2016-03-0111:02:06 AM | 68.338 | 138.312 | 32 | 74.075 |
| 2016-03-0111:02:10 AM | 68.338 | 138.425 | 32 | 74.075 |
| 2016-03-0111:02:14 AM | 68.338 | 138.425 | 32 | 74.075 |
| 2016-03-0111:02:18 AM | 68.338 | 138.538 | 32 | 74.075 |
| 2016-03-0111:02:26 AM | 68.225 | 138.538 | 31.662 | 74.075 |
| 2016-03-0111:02:30 AM | 68.225 | 138.538 | 31.662 | 74.075 |
| 2016-03-0111:02:35 AM | 68.225 | 138.538 | 31.662 | 74.075 |
| 2016-03-0111:02:39 AM | 68.338 | 138.65 | 31.55 | 74.075 |
| 2016-03-0111:02:47 AM | 68.225 | 138.65 | 31.212 | 74.075 |
| 2016-03-0111:02:51 AM | 68.338 | 138.762 | 31.212 | 74.075 |
| 2016-03-0111:02:55 AM | 68.338 | 138.762 | 31.212 | 74.188 |
| 2016-03-0111:02:59 AM | 68.225 | 138.875 | 31.325 | 74.188 |
| 2016-03-0111:03:03 AM | 68.225 | 138.875 | 31.325 | 74.075 |
| 2016-03-0111:03:07 AM | 68.225 | 138.875 | 31.325 | 74.188 |
| 2016-03-0111:03:11 AM | 68.225 | 138.875 | 31.1 | 74.188 |
| 2016-03-0111:03:15 AM | 68.225 | 138.988 | 31.1 | 74.188 |
| 2016-03-0111:03:19 AM | 68.338 | 138.988 | 31.212 | 74.188 |
| 2016-03-0111:03:23 AM | 68.225 | 138.988 | 31.1 | 74.188 |
| 2016-03-0111:03:27 AM | 68.338 | 139.1 | 30.988 | 74.188 |
| 2016-03-0111:03:31 AM | 68.225 | 139.1 | 30.762 | 74.188 |
| 2016-03-0111:03:35 AM | 68.338 | 139.1 | 30.538 | 74.188 |
| 2016-03-0111:03:39 AM | 68.225 | 139.1 | 30.425 | 74.188 |
| 2016-03-0111:03:43 AM | 68.225 | 139.1 | 30.425 | 74.188 |
| 2016-03-0111:03:47 AM | 68.225 | 139.212 | 30.425 | 74.188 |
| 2016-03-0111:03:51 AM | 68.225 | 139.212 | 30.312 | 74.188 |
| 2016-03-0111:03:55 AM | 68.112 | 139.325 | 30.312 | 74.188 |
| 2016-03-0111:03:59 AM | 68.112 | 139.325 | 30.425 | 74.188 |
| 2016-03-0111:04:03 AM | 68.112 | 139.438 | 30.425 | 74.188 |
| 2016-03-0111:04:07 AM | 68.112 | 139.438 | 30.538 | 74.188 |
| 2016-03-0111:04:11 AM | 68.112 | 139.438 | 30.425 | 74.188 |
| 2016-03-0111:04:15 AM | 68.112 | 139.438 | 30.425 | 74.188 |
| 2016-03-0111:04:19 AM | 68.112 | 139.438 | 30.538 | 74.188 |
| 2016-03-0111:04:23 AM | 68.112 | 139.55 | 30.538 | 74.188 |
| 2016-03-0111:04:27 AM | 68.112 | 139.55 | 30.538 | 74.188 |
| 2016-03-0111:04:31 AM | 68.112 | 139.55 | 30.538 | 74.188 |
| 2016-03-0111:04:35 AM | 68.112 | 139.55 | 30.65 | 74.188 |
| 2016-03-0111:04:39 AM | 68.112 | 139.662 | 30.65 | 74.188 |
| 2016-03-0111:04:43 AM | 68.112 | 139.662 | 30.762 | 74.188 |
| 2016-03-0111:04:47 AM | 68.112 | 139.662 | 30.762 | 74.188 |
| 2016-03-0111:04:51 AM | 68.112 | 139.662 | 30.762 | 74.188 |
| 2016-03-0111:04:55 AM | 68.112 | 139.662 | 30.762 | 74.188 |
| 2016-03-0111:04:59 AM | 68.225 | 139.662 | 30.875 | 74.188 |
| 2016-03-0111:05:03 AM | 68.225 | 139.775 | 30.762 | 74.188 |
| 2016-03-0111:05:07 AM | 68.225 | 139.775 | 30.65 | 74.188 |
| 2016-03-0111:05:11 AM | 68.225 | 139.775 | 30.425 | 74.188 |
| 2016-03-0111:05:15 AM | 68.338 | 139.888 | 30.425 | 74.188 |
| 2016-03-0111:05:19 AM | 68.338 | 139.888 | 30.312 | 74.188 |
| 2016-03-0111:05:23 AM | 68.338 | 139.888 | 30.2 | 74.188 |
| 2016-03-0111:05:28 AM | 68.338 | 140 | 30.2 | 74.188 |
| 2016-03-0111:05:32 AM | 68.338 | 140 | 30.2 | 74.188 |
| 2016-03-0111:05:36 AM | 68.338 | 140 | 30.2 | 74.188 |
| 2016-03-0111:05:40 AM | 68.338 | 140 | 30.2 | 74.188 |
| 2016-03-0111:05:44 AM | 68.338 | 140 | 30.312 | 74.188 |
| 2016-03-0111:05:48 AM | 68.338 | 140 | 30.312 | 74.188 |
| 2016-03-0111:05:52 AM | 68.45 | 140 | 30.312 | 74.3 |
| 2016-03-0111:05:56 AM | 68.45 | 140 | 30.312 | 74.188 |
| 2016-03-0111:06:00 AM | 68.45 | 140 | 30.425 | 74.3 |
| 2016-03-0111:06:04 AM | 68.562 | 140.112 | 30.425 | 74.3 |
| 2016-03-0111:06:08 AM | 68.562 | 140.112 | 30.65 | 74.3 |
| 2016-03-0111:06:12 AM | 68.562 | 140.112 | 30.65 | 74.188 |
| 2016-03-0111:06:16 AM | 68.675 | 140.112 | 30.65 | 74.3 |
| 2016-03-0111:06:20 AM | 68.675 | 140.225 | 30.762 | 74.3 |
| 2016-03-0111:06:24 AM | 68.675 | 140.225 | 30.762 | 74.188 |
| 2016-03-0111:06:28 AM | 68.675 | 140.225 | 30.988 | 74.3 |
| 2016-03-0111:06:32 AM | 68.788 | 140.225 | 31.1 | 74.188 |
| 2016-03-0111:06:36 AM | 68.675 | 140.338 | 31.1 | 74.188 |
| 2016-03-0111:06:40 AM | 68.788 | 140.338 | 31.212 | 74.3 |
| 2016-03-0111:06:44 AM | 68.675 | 140.338 | 31.212 | 74.3 |
| 2016-03-0111:06:48 AM | 68.675 | 140.338 | 30.988 | 74.3 |
| 2016-03-0111:06:52 AM | 68.675 | 140.338 | 30.875 | 74.3 |
| 2016-03-0111:06:56 AM | 68.675 | 140.338 | 30.65 | 74.3 |
| 2016-03-0111:07:00 AM | 68.562 | 140.45 | 30.425 | 74.3 |
| 2016-03-0111:07:04 AM | 68.562 | 140.45 | 30.425 | 74.3 |
| 2016-03-0111:07:08 AM | 68.562 | 140.45 | 30.425 | 74.3 |
| 2016-03-0111:07:12 AM | 68.562 | 140.45 | 30.425 | 74.3 |
| 2016-03-0111:07:16 AM | 68.562 | 140.45 | 30.425 | 74.3 |
| 2016-03-0111:07:20 AM | 68.562 | 140.562 | 30.312 | 74.188 |
| 2016-03-0111:07:24 AM | 68.562 | 140.562 | 29.975 | 74.3 |
| 2016-03-0111:07:28 AM | 68.562 | 140.562 | 29.75 | 74.3 |
| 2016-03-0111:07:32 AM | 68.562 | 140.562 | 29.862 | 74.3 |
| 2016-03-0111:07:36 AM | 68.562 | 140.562 | 29.862 | 74.3 |
| 2016-03-0111:07:40 AM | 68.562 | 140.562 | 29.975 | 74.3 |
| 2016-03-0111:07:44 AM | 68.562 | 140.562 | 30.088 | 74.3 |
| 2016-03-0111:07:48 AM | 68.562 | 140.562 | 30.2 | 74.3 |
| 2016-03-0111:07:52 AM | 68.562 | 140.562 | 30.312 | 74.3 |
| 2016-03-0111:07:56 AM | 68.45 | 140.675 | 30.312 | 74.3 |
| 2016-03-0111:08:00 AM | 68.45 | 140.675 | 30.312 | 74.3 |
| 2016-03-0111:08:04 AM | 68.45 | 140.675 | 30.312 | 74.3 |
| 2016-03-0111:08:08 AM | 68.45 | 140.675 | 30.312 | 74.3 |
| 2016-03-0111:08:12 AM | 68.45 | 140.675 | 30.425 | 74.3 |
| 2016-03-0111:08:16 AM | 68.45 | 140.675 | 30.425 | 74.3 |
| 2016-03-0111:08:20 AM | 68.45 | 140.675 | 30.538 | 74.3 |
| 2016-03-0111:08:25 AM | 68.562 | 140.675 | 30.425 | 74.3 |
| 2016-03-0111:08:29 AM | 68.562 | 140.675 | 30.312 | 74.3 |
| 2016-03-0111:08:33 AM | 68.562 | 140.788 | 30.2 | 74.3 |
| 2016-03-0111:08:37 AM | 68.562 | 140.788 | 30.2 | 74.3 |
| 2016-03-0111:08:41 AM | 68.562 | 140.788 | 30.088 | 74.3 |
| 2016-03-0111:08:45 AM | 68.562 | 140.788 | 30.2 | 74.3 |
| 2016-03-0111:08:49 AM | 68.562 | 140.788 | 30.2 | 74.3 |
| 2016-03-0111:08:53 AM | 68.562 | 140.788 | 30.088 | 74.3 |
| 2016-03-0111:08:57 AM | 68.562 | 140.675 | 29.862 | 74.3 |
| 2016-03-0111:09:01 AM | 68.562 | 140.675 | 29.862 | 74.3 |
| 2016-03-0111:09:05 AM | 68.562 | 140.788 | 29.862 | 74.3 |
| 2016-03-0111:09:09 AM | 68.675 | 140.788 | 29.975 | 74.3 |
| 2016-03-0111:09:13 AM | 68.562 | 140.788 | 29.975 | 74.3 |
| 2016-03-0111:09:17 AM | 68.675 | 140.788 | 30.088 | 74.3 |
| 2016-03-0111:09:21 AM | 68.562 | 140.788 | 30.2 | 74.3 |
| 2016-03-0111:09:25 AM | 68.562 | 140.788 | 30.2 | 74.3 |
| 2016-03-0111:09:29 AM | 68.562 | 140.788 | 30.2 | 74.3 |
| 2016-03-0111:09:33 AM | 68.562 | 140.788 | 30.2 | 74.412 |
| 2016-03-0111:09:37 AM | 68.562 | 140.9 | 30.2 | 74.3 |
| 2016-03-0111:09:41 AM | 68.562 | 140.788 | 30.2 | 74.3 |
| 2016-03-0111:09:45 AM | 68.562 | 140.788 | 30.088 | 74.3 |
| 2016-03-0111:09:49 AM | 68.562 | 140.788 | 29.75 | 74.412 |
| 2016-03-0111:09:53 AM | 68.562 | 140.788 | 29.525 | 74.3 |
| 2016-03-0111:09:57 AM | 68.562 | 140.9 | 29.412 | 74.3 |
| 2016-03-0111:10:01 AM | 68.562 | 140.788 | 29.525 | 74.3 |
| 2016-03-0111:10:05 AM | 68.562 | 140.788 | 29.525 | 74.3 |
| 2016-03-0111:10:09 AM | 68.45 | 140.9 | 29.75 | 74.3 |
| 2016-03-0111:10:13 AM | 68.562 | 140.9 | 29.862 | 74.3 |
| 2016-03-0111:10:17 AM | 68.45 | 140.9 | 29.75 | 74.3 |
| 2016-03-0111:10:21 AM | 68.45 | 140.9 | 29.862 | 74.3 |
| 2016-03-0111:10:25 AM | 68.45 | 140.9 | 29.862 | 74.3 |
| 2016-03-0111:10:29 AM | 68.45 | 140.9 | 29.975 | 74.412 |
| 2016-03-0111:10:33 AM | 68.45 | 140.9 | 29.975 | 74.3 |
| 2016-03-0111:10:37 AM | 68.562 | 141.012 | 30.088 | 74.412 |
| 2016-03-0111:10:41 AM | 68.562 | 140.9 | 30.088 | 74.3 |
| 2016-03-0111:10:45 AM | 68.562 | 140.9 | 30.2 | 74.412 |
| 2016-03-0111:10:49 AM | 68.562 | 140.9 | 30.2 | 74.3 |
| 2016-03-0111:10:53 AM | 68.562 | 141.012 | 30.088 | 74.3 |
| 2016-03-0111:10:57 AM | 68.675 | 141.012 | 30.088 | 74.3 |
| 2016-03-0111:11:01 AM | 68.675 | 141.125 | 30.088 | 74.3 |
| 2016-03-0111:11:05 AM | 68.788 | 141.238 | 30.088 | 74.3 |
| 2016-03-0111:11:09 AM | 68.788 | 141.238 | 30.2 | 74.3 |
| 2016-03-0111:11:13 AM | 68.788 | 141.238 | 30.312 | 74.3 |
| 2016-03-0111:11:18 AM | 68.788 | 141.125 | 30.312 | 74.3 |
| 2016-03-0111:11:22 AM | 68.9 | 141.125 | 30.312 | 74.3 |
| 2016-03-0111:11:26 AM | 68.9 | 141.238 | 30.312 | 74.3 |
| 2016-03-0111:11:30 AM | 69.012 | 141.125 | 30.312 | 74.3 |
| 2016-03-0111:11:34 AM | 69.012 | 141.125 | 30.312 | 74.3 |
| 2016-03-0111:11:38 AM | 69.012 | 141.012 | 30.312 | 74.3 |
| 2016-03-0111:11:42 AM | 69.125 | 141.125 | 30.2 | 74.3 |
| 2016-03-0111:11:46 AM | 69.125 | 141.125 | 30.2 | 74.3 |
| 2016-03-0111:11:50 AM | 69.125 | 141.125 | 30.2 | 74.412 |
| 2016-03-0111:11:54 AM | 69.238 | 141.125 | 30.312 | 74.3 |
| 2016-03-0111:11:58 AM | 69.125 | 141.125 | 30.312 | 74.3 |
| 2016-03-0111:12:02 AM | 69.125 | 141.125 | 30.425 | 74.3 |
| 2016-03-0111:12:06 AM | 69.125 | 141.012 | 30.425 | 74.3 |
| 2016-03-0111:12:10 AM | 69.125 | 141.012 | 30.425 | 74.3 |
| 2016-03-0111:12:14 AM | 69.012 | 141.125 | 30.425 | 74.3 |
| 2016-03-0111:12:18 AM | 69.012 | 141.125 | 30.312 | 74.3 |
| 2016-03-0111:12:22 AM | 69.012 | 141.238 | 30.312 | 74.3 |
| 2016-03-0111:12:25 AM | 69.012 | 141.238 | 30.312 | 74.3 |
| 2016-03-0111:12:29 AM | 68.9 | 141.238 | 30.538 | 74.3 |
| 2016-03-0111:12:33 AM | 69.012 | 141.238 | 30.538 | 74.3 |
| 2016-03-0111:12:37 AM | 68.9 | 141.238 | 30.65 | 74.3 |
| 2016-03-0111:12:41 AM | 68.9 | 141.238 | 30.65 | 74.3 |
| 2016-03-0111:12:45 AM | 68.9 | 141.238 | 30.875 | 74.3 |
| 2016-03-0111:12:49 AM | 68.9 | 141.238 | 30.988 | 74.3 |
| 2016-03-0111:12:53 AM | 68.9 | 141.238 | 31.1 | 74.3 |
| 2016-03-0111:12:57 AM | 68.788 | 141.238 | 31.212 | 74.3 |
| 2016-03-0111:13:01 AM | 68.788 | 141.35 | 31.325 | 74.3 |
| 2016-03-0111:13:05 AM | 68.788 | 141.35 | 31.438 | 74.188 |
| 2016-03-0111:13:09 AM | 68.788 | 141.35 | 31.55 | 74.3 |
| 2016-03-0111:13:14 AM | 68.788 | 141.462 | 31.662 | 74.3 |
| 2016-03-0111:13:18 AM | 68.788 | 141.575 | 31.662 | 74.3 |
| 2016-03-0111:13:22 AM | 68.788 | 141.462 | 31.55 | 74.188 |
| 2016-03-0111:13:26 AM | 68.788 | 141.575 | 31.438 | 74.3 |
| 2016-03-0111:13:30 AM | 68.788 | 141.575 | 31.438 | 74.3 |
| 2016-03-0111:13:34 AM | 68.788 | 141.688 | 31.55 | 74.3 |
| 2016-03-0111:13:38 AM | 68.788 | 141.688 | 31.55 | 74.3 |
| 2016-03-0111:13:42 AM | 68.788 | 141.8 | 31.55 | 74.188 |
| 2016-03-0111:13:46 AM | 68.788 | 141.8 | 31.438 | 74.3 |
| 2016-03-0111:13:50 AM | 68.788 | 141.8 | 31.212 | 74.3 |
| 2016-03-0111:13:54 AM | 68.788 | 141.912 | 31.1 | 74.3 |
| 2016-03-0111:13:58 AM | 68.788 | 141.912 | 30.875 | 74.3 |
| 2016-03-0111:14:02 AM | 68.788 | 142.025 | 30.875 | 74.3 |
| 2016-03-0111:14:06 AM | 68.788 | 142.025 | 30.875 | 74.3 |
| 2016-03-0111:14:10 AM | 68.788 | 142.025 | 30.875 | 74.3 |
| 2016-03-0111:14:14 AM | 68.788 | 142.025 | 30.65 | 74.3 |
| 2016-03-0111:14:18 AM | 68.788 | 142.025 | 30.538 | 74.3 |
| 2016-03-0111:14:22 AM | 68.675 | 142.025 | 30.425 | 74.3 |
| 2016-03-0111:14:26 AM | 68.675 | 142.025 | 30.425 | 74.3 |
| 2016-03-0111:14:30 AM | 68.788 | 142.025 | 30.425 | 74.3 |
| 2016-03-0111:14:34 AM | 68.675 | 142.025 | 30.312 | 74.3 |
| 2016-03-0111:14:38 AM | 68.675 | 142.025 | 30.312 | 74.3 |
| 2016-03-0111:14:42 AM | 68.675 | 142.025 | 30.425 | 74.3 |
| 2016-03-0111:14:46 AM | 68.675 | 142.025 | 30.425 | 74.3 |
| 2016-03-0111:14:50 AM | 68.675 | 142.025 | 30.312 | 74.3 |
| 2016-03-0111:14:54 AM | 68.788 | 142.138 | 30.312 | 74.3 |
| 2016-03-0111:14:58 AM | 68.675 | 142.25 | 30.312 | 74.3 |
| 2016-03-0111:15:02 AM | 68.788 | 142.138 | 30.312 | 74.3 |
| 2016-03-0111:15:06 AM | 68.675 | 142.138 | 30.425 | 74.3 |
| 2016-03-0111:15:10 AM | 68.675 | 142.138 | 30.538 | 74.3 |
| 2016-03-0111:15:15 AM | 68.675 | 142.25 | 30.538 | 74.3 |
| 2016-03-0111:15:19 AM | 68.675 | 142.25 | 30.538 | 74.188 |
| 2016-03-0111:15:23 AM | 68.675 | 142.362 | 30.538 | 74.3 |
| 2016-03-0111:15:27 AM | 68.675 | 142.362 | 30.538 | 74.3 |
| 2016-03-0111:15:31 AM | 68.562 | 142.362 | 30.538 | 74.3 |
| 2016-03-0111:15:35 AM | 68.562 | 142.362 | 30.65 | 74.3 |
| 2016-03-0111:15:39 AM | 68.562 | 142.475 | 30.65 | 74.3 |
| 2016-03-0111:15:43 AM | 68.562 | 142.475 | 30.762 | 74.3 |
| 2016-03-0111:15:47 AM | 68.562 | 142.588 | 30.762 | 74.188 |
| 2016-03-0111:15:51 AM | 68.562 | 142.588 | 30.762 | 74.3 |
| 2016-03-0111:15:55 AM | 68.562 | 142.588 | 30.762 | 74.3 |
| 2016-03-0111:15:59 AM | 68.562 | 142.588 | 30.65 | 74.3 |
| 2016-03-0111:16:03 AM | 68.562 | 142.588 | 30.65 | 74.3 |
| 2016-03-0111:16:07 AM | 68.562 | 142.588 | 30.65 | 74.3 |
| 2016-03-0111:16:11 AM | 68.562 | 142.588 | 30.65 | 74.3 |
| 2016-03-0111:16:15 AM | 68.675 | 142.7 | 30.762 | 74.3 |
| 2016-03-0111:16:19 AM | 68.675 | 142.588 | 30.65 | 74.3 |
| 2016-03-0111:16:23 AM | 68.675 | 142.7 | 30.65 | 74.3 |
| 2016-03-0111:16:27 AM | 68.675 | 142.588 | 30.65 | 74.3 |
| 2016-03-0111:16:31 AM | 68.675 | 142.7 | 30.65 | 74.3 |
| 2016-03-0111:16:35 AM | 68.562 | 142.7 | 30.65 | 74.3 |
| 2016-03-0111:16:39 AM | 68.562 | 142.812 | 30.65 | 74.3 |
| 2016-03-0111:16:43 AM | 68.675 | 142.812 | 30.762 | 74.3 |
| 2016-03-0111:16:47 AM | 68.788 | 142.812 | 30.762 | 74.3 |
| 2016-03-0111:16:51 AM | 68.788 | 142.812 | 30.762 | 74.3 |
| 2016-03-0111:16:55 AM | 68.788 | 142.925 | 30.875 | 74.3 |
| 2016-03-0111:16:59 AM | 68.9 | 142.925 | 30.988 | 74.3 |
| 2016-03-0111:17:03 AM | 68.9 | 142.812 | 30.988 | 74.3 |
| 2016-03-0111:17:07 AM | 68.9 | 142.925 | 30.988 | 74.3 |
| 2016-03-0111:17:11 AM | 68.9 | 142.925 | 31.1 | 74.3 |
| 2016-03-0111:17:16 AM | 68.9 | 143.038 | 31.1 | 74.3 |
| 2016-03-0111:17:20 AM | 68.9 | 143.038 | 31.1 | 74.3 |
| 2016-03-0111:17:24 AM | 68.9 | 143.15 | 31.1 | 74.412 |
| 2016-03-0111:17:28 AM | 68.788 | 143.15 | 31.325 | 74.3 |
| 2016-03-0111:17:32 AM | 68.9 | 143.15 | 31.438 | 74.3 |
| 2016-03-0111:17:36 AM | 68.788 | 143.262 | 31.438 | 74.3 |
| 2016-03-0111:17:40 AM | 68.788 | 143.262 | 31.438 | 74.3 |
| 2016-03-0111:17:44 AM | 68.788 | 143.262 | 31.325 | 74.3 |
| 2016-03-0111:17:48 AM | 68.788 | 143.375 | 31.325 | 74.3 |
| 2016-03-0111:17:52 AM | 68.788 | 143.375 | 31.325 | 74.3 |
| 2016-03-0111:17:56 AM | 68.788 | 143.375 | 31.325 | 74.3 |
| 2016-03-0111:18:00 AM | 68.788 | 143.375 | 31.438 | 74.3 |
| 2016-03-0111:18:04 AM | 68.788 | 143.375 | 31.55 | 74.3 |
| 2016-03-0111:18:08 AM | 68.788 | 143.375 | 31.662 | 74.3 |
| 2016-03-0111:18:12 AM | 68.788 | 143.6 | 31.662 | 74.412 |
| 2016-03-0111:18:16 AM | 68.788 | 143.6 | 31.662 | 74.412 |
| 2016-03-0111:18:20 AM | 68.788 | 143.6 | 31.662 | 74.412 |
| 2016-03-0111:18:24 AM | 68.788 | 143.6 | 31.775 | 74.3 |
| 2016-03-0111:18:28 AM | 68.675 | 143.712 | 31.888 | 74.3 |
| 2016-03-0111:18:32 AM | 68.788 | 143.712 | 31.888 | 74.3 |
| 2016-03-0111:18:36 AM | 68.788 | 143.825 | 31.888 | 74.3 |
| 2016-03-0111:18:40 AM | 68.788 | 143.825 | 31.775 | 74.412 |
| 2016-03-0111:18:44 AM | 68.788 | 143.825 | 31.775 | 74.412 |
| 2016-03-0111:18:48 AM | 68.788 | 143.938 | 31.775 | 74.3 |
| 2016-03-0111:18:52 AM | 68.788 | 143.938 | 31.662 | 74.412 |
| 2016-03-0111:18:57 AM | 68.788 | 143.938 | 31.55 | 74.412 |
| 2016-03-0111:19:01 AM | 68.9 | 143.938 | 31.55 | 74.412 |
| 2016-03-0111:19:05 AM | 69.012 | 144.05 | 31.55 | 74.412 |
| 2016-03-0111:19:09 AM | 69.012 | 144.05 | 31.438 | 74.3 |
| 2016-03-0111:19:13 AM | 69.125 | 144.162 | 31.438 | 74.3 |
| 2016-03-0111:19:17 AM | 69.012 | 144.162 | 31.438 | 74.3 |
| 2016-03-0111:19:21 AM | 69.012 | 144.162 | 31.438 | 74.412 |
| 2016-03-0111:19:25 AM | 69.012 | 144.162 | 31.438 | 74.3 |
| 2016-03-0111:19:29 AM | 69.012 | 144.162 | 31.55 | 74.412 |
| 2016-03-0111:19:33 AM | 69.012 | 144.275 | 31.662 | 74.412 |
| 2016-03-0111:19:37 AM | 69.012 | 144.388 | 31.775 | 74.412 |
| 2016-03-0111:19:41 AM | 69.012 | 144.388 | 31.775 | 74.412 |
| 2016-03-0111:19:45 AM | 69.012 | 144.388 | 31.888 | 74.412 |
| 2016-03-0111:19:49 AM | 69.012 | 144.5 | 31.888 | 74.3 |
| 2016-03-0111:19:53 AM | 69.012 | 144.5 | 31.775 | 74.3 |
| 2016-03-0111:19:57 AM | 69.012 | 144.612 | 31.662 | 74.412 |
| 2016-03-0111:20:01 AM | 68.9 | 144.612 | 31.55 | 74.3 |
| 2016-03-0111:20:05 AM | 68.9 | 144.612 | 31.438 | 74.3 |
| 2016-03-0111:20:09 AM | 68.9 | 144.725 | 31.325 | 74.3 |
| 2016-03-0111:20:13 AM | 68.9 | 144.725 | 31.212 | 74.3 |
| 2016-03-0111:20:17 AM | 68.9 | 144.725 | 31.1 | 74.412 |
| 2016-03-0111:20:21 AM | 68.9 | 144.838 | 30.875 | 74.412 |
| 2016-03-0111:20:25 AM | 68.9 | 144.95 | 30.538 | 74.3 |
| 2016-03-0111:20:29 AM | 68.9 | 144.95 | 30.425 | 74.412 |
| 2016-03-0111:20:33 AM | 68.788 | 145.062 | 30.425 | 74.3 |
| 2016-03-0111:20:37 AM | 68.788 | 145.062 | 30.538 | 74.412 |
| 2016-03-0111:20:42 AM | 68.788 | 145.062 | 30.425 | 74.412 |
| 2016-03-0111:20:46 AM | 68.788 | 145.062 | 30.425 | 74.3 |
| 2016-03-0111:20:50 AM | 68.788 | 145.062 | 30.425 | 74.412 |
| 2016-03-0111:20:54 AM | 68.788 | 145.062 | 30.538 | 74.412 |
| 2016-03-0111:20:58 AM | 68.788 | 145.062 | 30.538 | 74.3 |
| 2016-03-0111:21:02 AM | 68.788 | 145.062 | 30.65 | 74.412 |
| 2016-03-0111:21:06 AM | 68.675 | 145.175 | 30.762 | 74.412 |
| 2016-03-0111:21:10 AM | 68.675 | 145.175 | 30.875 | 74.412 |
| 2016-03-0111:21:14 AM | 68.675 | 145.288 | 30.988 | 74.412 |
| 2016-03-0111:21:18 AM | 68.675 | 145.175 | 31.1 | 74.412 |
| 2016-03-0111:21:22 AM | 68.675 | 145.175 | 30.988 | 74.412 |
| 2016-03-0111:21:26 AM | 68.562 | 145.288 | 31.1 | 74.3 |
| 2016-03-0111:21:30 AM | 68.675 | 145.288 | 31.1 | 74.412 |
| 2016-03-0111:21:34 AM | 68.562 | 145.288 | 31.212 | 74.412 |
| 2016-03-0111:21:38 AM | 68.562 | 145.288 | 31.325 | 74.412 |
| 2016-03-0111:21:42 AM | 68.562 | 145.4 | 31.325 | 74.412 |
| 2016-03-0111:21:46 AM | 68.562 | 145.4 | 31.438 | 74.3 |
| 2016-03-0111:21:50 AM | 68.562 | 145.4 | 31.55 | 74.3 |
| 2016-03-0111:21:54 AM | 68.562 | 145.512 | 31.662 | 74.3 |
| 2016-03-0111:21:58 AM | 68.562 | 145.4 | 31.775 | 74.3 |
| 2016-03-0111:22:02 AM | 68.562 | 145.512 | 31.662 | 74.3 |
| 2016-03-0111:22:06 AM | 68.45 | 145.512 | 31.662 | 74.3 |
| 2016-03-0111:22:10 AM | 68.45 | 145.512 | 31.325 | 74.3 |
| 2016-03-0111:22:14 AM | 68.45 | 145.625 | 31.1 | 74.3 |
| 2016-03-0111:22:18 AM | 68.45 | 145.738 | 30.988 | 74.3 |
| 2016-03-0111:22:22 AM | 68.45 | 145.625 | 30.762 | 74.3 |
| 2016-03-0111:22:26 AM | 68.45 | 145.738 | 30.762 | 74.3 |
| 2016-03-0111:22:30 AM | 68.338 | 145.738 | 30.875 | 74.3 |
| 2016-03-0111:22:34 AM | 68.338 | 145.738 | 30.875 | 74.3 |
| 2016-03-0111:22:39 AM | 68.45 | 145.85 | 30.762 | 74.3 |
| 2016-03-0111:22:43 AM | 68.45 | 145.85 | 30.65 | 74.3 |
| 2016-03-0111:22:47 AM | 68.45 | 145.85 | 30.65 | 74.412 |
| 2016-03-0111:22:51 AM | 68.45 | 145.85 | 30.65 | 74.412 |
| 2016-03-0111:22:55 AM | 68.45 | 145.962 | 30.762 | 74.412 |
| 2016-03-0111:22:59 AM | 68.45 | 145.962 | 30.875 | 74.3 |
| 2016-03-0111:23:03 AM | 68.45 | 145.962 | 30.875 | 74.3 |
| 2016-03-0111:23:07 AM | 68.45 | 145.962 | 30.762 | 74.3 |
| 2016-03-0111:23:11 AM | 68.562 | 146.075 | 30.538 | 74.3 |
| 2016-03-0111:23:15 AM | 68.562 | 146.075 | 30.538 | 74.3 |
| 2016-03-0111:23:19 AM | 68.562 | 145.962 | 30.425 | 74.3 |
| 2016-03-0111:23:23 AM | 68.45 | 145.962 | 30.312 | 74.3 |
| 2016-03-0111:23:27 AM | 68.45 | 145.962 | 30.2 | 74.3 |
| 2016-03-0111:23:31 AM | 68.45 | 145.962 | 30.2 | 74.3 |
| 2016-03-0111:23:35 AM | 68.45 | 145.962 | 30.2 | 74.3 |
| 2016-03-0111:23:39 AM | 68.45 | 145.962 | 30.2 | 74.3 |
| 2016-03-0111:23:43 AM | 68.45 | 145.962 | 30.312 | 74.3 |
| 2016-03-0111:23:47 AM | 68.45 | 146.075 | 30.312 | 74.3 |
| 2016-03-0111:23:51 AM | 68.45 | 145.962 | 30.425 | 74.3 |
| 2016-03-0111:23:55 AM | 68.45 | 146.075 | 30.425 | 74.3 |
| 2016-03-0111:23:59 AM | 68.45 | 146.075 | 30.425 | 74.3 |
| 2016-03-0111:24:03 AM | 68.338 | 146.075 | 30.312 | 74.3 |
| 2016-03-0111:24:07 AM | 68.45 | 146.188 | 30.2 | 74.3 |
| 2016-03-0111:24:11 AM | 68.45 | 146.188 | 30.088 | 74.3 |
| 2016-03-0111:24:15 AM | 68.45 | 146.075 | 30.2 | 74.3 |
| 2016-03-0111:24:19 AM | 68.45 | 146.075 | 30.312 | 74.3 |
| 2016-03-0111:24:23 AM | 68.45 | 146.075 | 30.425 | 74.3 |
| 2016-03-0111:24:27 AM | 68.45 | 146.075 | 30.425 | 74.3 |
| 2016-03-0111:24:31 AM | 68.45 | 146.075 | 30.538 | 74.3 |
| 2016-03-0111:24:35 AM | 68.45 | 146.188 | 30.65 | 74.3 |
| 2016-03-0111:24:39 AM | 68.338 | 146.188 | 30.762 | 74.3 |
| 2016-03-0111:24:43 AM | 68.45 | 146.188 | 30.875 | 74.3 |
| 2016-03-0111:24:47 AM | 68.45 | 146.188 | 30.762 | 74.3 |
| 2016-03-0111:24:51 AM | 68.45 | 146.075 | 30.762 | 74.3 |
| 2016-03-0111:24:55 AM | 68.45 | 146.188 | 30.875 | 74.3 |
| 2016-03-0111:24:59 AM | 68.45 | 146.075 | 30.875 | 74.3 |
| 2016-03-0111:25:03 AM | 68.45 | 146.188 | 30.875 | 74.3 |
| 2016-03-0111:25:08 AM | 68.45 | 146.188 | 30.762 | 74.412 |
| 2016-03-0111:25:12 AM | 68.45 | 146.3 | 30.875 | 74.412 |
| 2016-03-0111:25:16 AM | 68.45 | 146.3 | 30.762 | 74.412 |
| 2016-03-0111:25:20 AM | 68.45 | 146.3 | 30.762 | 74.412 |
| 2016-03-0111:25:24 AM | 68.45 | 146.3 | 30.875 | 74.412 |
| 2016-03-0111:25:28 AM | 68.45 | 146.3 | 30.988 | 74.412 |
| 2016-03-0111:25:32 AM | 68.562 | 146.412 | 30.988 | 74.412 |
| 2016-03-0111:25:36 AM | 68.45 | 146.412 | 30.988 | 74.412 |
| 2016-03-0111:25:40 AM | 68.45 | 146.412 | 30.988 | 74.412 |
| 2016-03-0111:25:44 AM | 68.45 | 146.412 | 30.988 | 74.412 |
| 2016-03-0111:25:48 AM | 68.45 | 146.412 | 30.988 | 74.412 |
| 2016-03-0111:25:52 AM | 68.45 | 146.525 | 30.875 | 74.412 |
| 2016-03-0111:25:56 AM | 68.45 | 146.525 | 30.762 | 74.412 |
| 2016-03-0111:26:00 AM | 68.45 | 146.525 | 30.538 | 74.412 |
| 2016-03-0111:26:04 AM | 68.45 | 146.525 | 30.425 | 74.412 |
| 2016-03-0111:26:08 AM | 68.45 | 146.525 | 30.312 | 74.412 |
| 2016-03-0111:26:12 AM | 68.45 | 146.638 | 30.312 | 74.412 |
| 2016-03-0111:26:16 AM | 68.45 | 146.638 | 30.312 | 74.412 |
| 2016-03-0111:26:20 AM | 68.45 | 146.638 | 30.425 | 74.412 |
| 2016-03-0111:26:24 AM | 68.45 | 146.638 | 30.538 | 74.412 |
| 2016-03-0111:26:28 AM | 68.45 | 146.75 | 30.65 | 74.412 |
| 2016-03-0111:26:32 AM | 68.45 | 146.75 | 30.65 | 74.412 |
| 2016-03-0111:26:36 AM | 68.45 | 146.75 | 30.875 | 74.412 |
| 2016-03-0111:26:40 AM | 68.45 | 146.75 | 30.988 | 74.412 |
| 2016-03-0111:26:44 AM | 68.45 | 146.75 | 31.1 | 74.412 |
| 2016-03-0111:26:48 AM | 68.45 | 146.75 | 31.1 | 74.412 |
| 2016-03-0111:26:52 AM | 68.45 | 146.862 | 30.988 | 74.3 |
| 2016-03-0111:26:56 AM | 68.45 | 146.862 | 31.1 | 74.412 |
| 2016-03-0111:27:00 AM | 68.45 | 146.862 | 31.1 | 74.3 |
| 2016-03-0111:27:04 AM | 68.45 | 146.975 | 30.988 | 74.3 |
| 2016-03-0111:27:08 AM | 68.45 | 146.975 | 30.875 | 74.3 |
| 2016-03-0111:27:12 AM | 68.45 | 146.975 | 30.875 | 74.412 |
| 2016-03-0111:27:16 AM | 68.45 | 146.975 | 31.1 | 74.412 |
| 2016-03-0111:27:20 AM | 68.45 | 146.975 | 31.1 | 74.3 |
| 2016-03-0111:27:25 AM | 68.45 | 147.088 | 31.212 | 74.3 |
| 2016-03-0111:27:29 AM | 68.45 | 146.975 | 31.212 | 74.3 |
| 2016-03-0111:27:33 AM | 68.338 | 147.088 | 31.325 | 74.3 |
| 2016-03-0111:27:37 AM | 68.45 | 146.975 | 31.325 | 74.3 |
| 2016-03-0111:27:41 AM | 68.45 | 147.088 | 31.55 | 74.3 |
| 2016-03-0111:27:45 AM | 68.45 | 147.088 | 31.662 | 74.3 |
| 2016-03-0111:27:49 AM | 68.45 | 147.2 | 31.775 | 74.3 |
| 2016-03-0111:27:53 AM | 68.45 | 147.2 | 31.775 | 74.3 |
| 2016-03-0111:27:57 AM | 68.45 | 147.2 | 31.888 | 74.3 |
| 2016-03-0111:28:01 AM | 68.45 | 147.2 | 32 | 74.3 |
| 2016-03-0111:28:05 AM | 68.562 | 147.2 | 32 | 74.3 |
| 2016-03-0111:28:09 AM | 68.562 | 147.2 | 32 | 74.3 |
| 2016-03-0111:28:13 AM | 68.562 | 147.2 | 32.112 | 74.3 |
| 2016-03-0111:28:17 AM | 68.562 | 147.2 | 32.112 | 74.412 |
| 2016-03-0111:28:21 AM | 68.675 | 147.312 | 32 | 74.412 |
| 2016-03-0111:28:25 AM | 68.675 | 147.425 | 32 | 74.412 |
| 2016-03-0111:28:29 AM | 68.788 | 147.425 | 32.225 | 74.412 |
| 2016-03-0111:28:33 AM | 68.675 | 147.425 | 32.225 | 74.3 |
| 2016-03-0111:28:37 AM | 68.788 | 147.538 | 32.112 | 74.412 |
| 2016-03-0111:28:41 AM | 68.788 | 147.538 | 32.225 | 74.3 |
| 2016-03-0111:28:45 AM | 68.788 | 147.65 | 32.338 | 74.3 |
| 2016-03-0111:28:49 AM | 68.788 | 147.538 | 32.338 | 74.3 |
| 2016-03-0111:28:53 AM | 68.9 | 147.538 | 32.338 | 74.3 |
| 2016-03-0111:28:57 AM | 68.9 | 147.538 | 32.45 | 74.3 |
| 2016-03-0111:29:01 AM | 68.9 | 147.538 | 32.45 | 74.3 |
| 2016-03-0111:29:05 AM | 68.9 | 147.538 | 32.45 | 74.3 |
| 2016-03-0111:29:09 AM | 68.9 | 147.538 | 32.45 | 74.412 |
| 2016-03-0111:29:13 AM | 68.9 | 147.538 | 32.45 | 74.3 |
| 2016-03-0111:29:17 AM | 68.9 | 147.538 | 32.45 | 74.412 |
| 2016-03-0111:29:21 AM | 68.9 | 147.538 | 32.562 | 74.3 |
| 2016-03-0111:29:25 AM | 68.9 | 147.538 | 32.562 | 74.412 |
| 2016-03-0111:29:29 AM | 69.012 | 147.538 | 32.562 | 74.3 |
| 2016-03-0111:29:33 AM | 69.012 | 147.538 | 32.562 | 74.3 |
| 2016-03-0111:29:37 AM | 69.012 | 147.65 | 32.675 | 74.412 |
| 2016-03-0111:29:41 AM | 69.012 | 147.65 | 32.562 | 74.412 |
| 2016-03-0111:29:46 AM | 69.125 | 147.763 | 32.562 | 74.412 |
| 2016-03-0111:29:50 AM | 69.125 | 147.763 | 32.45 | 74.412 |
| 2016-03-0111:29:54 AM | 69.012 | 147.763 | 32.45 | 74.412 |
| 2016-03-0111:29:58 AM | 69.125 | 147.763 | 32.225 | 74.412 |
| 2016-03-0111:30:02 AM | 69.125 | 147.763 | 32.338 | 74.412 |
| 2016-03-0111:30:06 AM | 69.125 | 147.763 | 32.225 | 74.412 |
| 2016-03-0111:30:10 AM | 69.125 | 147.875 | 32.112 | 74.412 |
| 2016-03-0111:30:14 AM | 69.125 | 147.875 | 32 | 74.412 |
| 2016-03-0111:30:18 AM | 69.125 | 147.875 | 32 | 74.412 |
| 2016-03-0111:30:22 AM | 69.125 | 147.875 | 32 | 74.412 |
| 2016-03-0111:30:26 AM | 69.125 | 147.875 | 32 | 74.412 |
| 2016-03-0111:30:30 AM | 69.125 | 147.875 | 32.112 | 74.412 |
| 2016-03-0111:30:34 AM | 69.125 | 147.875 | 32.112 | 74.412 |
| 2016-03-0111:30:38 AM | 69.238 | 147.875 | 32.225 | 74.412 |
| 2016-03-0111:30:42 AM | 69.238 | 147.763 | 32.338 | 74.412 |
| 2016-03-0111:30:46 AM | 69.238 | 147.763 | 32.338 | 74.412 |
| 2016-03-0111:30:50 AM | 69.35 | 147.763 | 32.338 | 74.412 |
| 2016-03-0111:30:54 AM | 69.35 | 147.65 | 32.338 | 74.412 |
| 2016-03-0111:30:58 AM | 69.35 | 147.763 | 32.45 | 74.412 |
| 2016-03-0111:31:02 AM | 69.35 | 147.763 | 32.45 | 74.412 |
| 2016-03-0111:31:06 AM | 69.35 | 147.875 | 32.45 | 74.412 |
| 2016-03-0111:31:10 AM | 69.35 | 147.763 | 32.562 | 74.412 |
| 2016-03-0111:31:14 AM | 69.35 | 147.763 | 32.562 | 74.412 |
| 2016-03-0111:31:18 AM | 69.35 | 147.763 | 32.45 | 74.412 |
| 2016-03-0111:31:22 AM | 69.238 | 147.763 | 32.338 | 74.412 |
| 2016-03-0111:31:26 AM | 69.238 | 147.763 | 32.338 | 74.412 |
| 2016-03-0111:31:30 AM | 69.238 | 147.763 | 32.45 | 74.412 |
| 2016-03-0111:31:34 AM | 69.238 | 147.875 | 32.45 | 74.412 |
| 2016-03-0111:31:38 AM | 69.238 | 147.875 | 32.45 | 74.412 |
| 2016-03-0111:31:42 AM | 69.125 | 147.875 | 32.562 | 74.412 |
| 2016-03-0111:31:46 AM | 69.125 | 147.763 | 32.45 | 74.525 |
| 2016-03-0111:31:50 AM | 69.125 | 147.875 | 32.338 | 74.412 |
| 2016-03-0111:31:54 AM | 69.125 | 147.875 | 32.338 | 74.525 |
| 2016-03-0111:31:58 AM | 69.125 | 147.988 | 32.225 | 74.412 |
| 2016-03-0111:32:02 AM | 69.125 | 147.988 | 32.112 | 74.525 |
| 2016-03-0111:32:06 AM | 69.125 | 147.988 | 32.112 | 74.525 |
| 2016-03-0111:32:11 AM | 69.125 | 147.988 | 32.112 | 74.525 |
| 2016-03-0111:32:15 AM | 69.012 | 148.1 | 32 | 74.412 |
| 2016-03-0111:32:19 AM | 69.012 | 148.1 | 31.775 | 74.412 |
| 2016-03-0111:32:23 AM | 69.012 | 148.1 | 31.775 | 74.412 |
| 2016-03-0111:32:27 AM | 69.012 | 148.1 | 31.775 | 74.412 |
| 2016-03-0111:32:31 AM | 69.012 | 148.1 | 31.775 | 74.412 |
| 2016-03-0111:32:35 AM | 69.012 | 148.1 | 31.775 | 74.412 |
| 2016-03-0111:32:39 AM | 69.012 | 148.212 | 31.775 | 74.525 |
| 2016-03-0111:32:43 AM | 69.012 | 148.212 | 31.775 | 74.525 |
| 2016-03-0111:32:47 AM | 69.125 | 148.212 | 31.662 | 74.525 |
| 2016-03-0111:32:51 AM | 69.012 | 148.325 | 31.662 | 74.525 |
| 2016-03-0111:32:55 AM | 69.125 | 148.325 | 31.662 | 74.525 |
| 2016-03-0111:32:59 AM | 69.125 | 148.325 | 31.775 | 74.525 |
| 2016-03-0111:33:03 AM | 69.125 | 148.438 | 31.888 | 74.525 |
| 2016-03-0111:33:07 AM | 69.125 | 148.325 | 32 | 74.525 |
| 2016-03-0111:33:11 AM | 69.125 | 148.438 | 32 | 74.525 |
| 2016-03-0111:33:15 AM | 69.238 | 148.438 | 31.888 | 74.525 |
| 2016-03-0111:33:19 AM | 69.238 | 148.438 | 31.775 | 74.525 |
| 2016-03-0111:33:23 AM | 69.35 | 148.438 | 31.662 | 74.525 |
| 2016-03-0111:33:27 AM | 69.35 | 148.438 | 31.662 | 74.525 |
| 2016-03-0111:33:31 AM | 69.35 | 148.55 | 31.775 | 74.525 |
| 2016-03-0111:33:35 AM | 69.35 | 148.438 | 31.888 | 74.525 |
| 2016-03-0111:33:39 AM | 69.35 | 148.438 | 32 | 74.525 |
| 2016-03-0111:33:43 AM | 69.462 | 148.55 | 32 | 74.525 |
| 2016-03-0111:33:47 AM | 69.462 | 148.55 | 32.112 | 74.525 |
| 2016-03-0111:33:51 AM | 69.35 | 148.55 | 32.112 | 74.525 |
| 2016-03-0111:33:55 AM | 69.35 | 148.55 | 32 | 74.525 |
| 2016-03-0111:33:59 AM | 69.35 | 148.55 | 32 | 74.525 |
| 2016-03-0111:34:03 AM | 69.35 | 148.55 | 32 | 74.525 |
| 2016-03-0111:34:07 AM | 69.35 | 148.662 | 32.225 | 74.525 |
| 2016-03-0111:34:11 AM | 69.35 | 148.662 | 32.225 | 74.525 |
| 2016-03-0111:34:15 AM | 69.35 | 148.662 | 32.338 | 74.525 |
| 2016-03-0111:34:19 AM | 69.238 | 148.662 | 32.338 | 74.525 |
| 2016-03-0111:34:23 AM | 69.238 | 148.662 | 32.338 | 74.525 |
| 2016-03-0111:34:27 AM | 69.238 | 148.662 | 32.45 | 74.525 |
| 2016-03-0111:34:31 AM | 69.238 | 148.662 | 32.675 | 74.525 |
| 2016-03-0111:34:35 AM | 69.238 | 148.662 | 32.788 | 74.525 |
| 2016-03-0111:34:39 AM | 69.125 | 148.775 | 32.9 | 74.525 |
| 2016-03-0111:34:43 AM | 69.238 | 148.775 | 33.012 | 74.525 |
| 2016-03-0111:34:47 AM | 69.125 | 148.888 | 33.012 | 74.525 |
| 2016-03-0111:34:51 AM | 69.125 | 148.888 | 33.125 | 74.525 |
| 2016-03-0111:34:56 AM | 69.125 | 149 | 33.012 | 74.525 |
| 2016-03-0111:34:59 AM | 69.125 | 149 | 33.012 | 74.525 |
| 2016-03-0111:35:03 AM | 69.125 | 149 | 33.012 | 74.525 |
| 2016-03-0111:35:07 AM | 69.012 | 149.112 | 32.9 | 74.525 |
| 2016-03-0111:35:11 AM | 69.125 | 149.112 | 32.788 | 74.525 |
| 2016-03-0111:35:15 AM | 69.125 | 149.225 | 32.675 | 74.525 |
| 2016-03-0111:35:19 AM | 69.125 | 149.225 | 32.675 | 74.525 |
| 2016-03-0111:35:23 AM | 69.012 | 149.338 | 32.675 | 74.525 |
| 2016-03-0111:35:28 AM | 69.125 | 149.338 | 32.675 | 74.525 |
| 2016-03-0111:35:32 AM | 69.125 | 149.45 | 32.675 | 74.525 |
| 2016-03-0111:35:36 AM | 69.238 | 149.562 | 32.562 | 74.525 |
| 2016-03-0111:35:40 AM | 69.238 | 149.562 | 32.675 | 74.525 |
| 2016-03-0111:35:44 AM | 69.35 | 149.562 | 32.562 | 74.525 |
| 2016-03-0111:35:48 AM | 69.35 | 149.562 | 32.675 | 74.525 |
| 2016-03-0111:35:52 AM | 69.462 | 149.562 | 32.562 | 74.525 |
| 2016-03-0111:35:56 AM | 69.575 | 149.562 | 32.562 | 74.525 |
| 2016-03-0111:36:00 AM | 69.688 | 149.562 | 32.562 | 74.525 |
| 2016-03-0111:36:04 AM | 69.8 | 149.45 | 32.562 | 74.525 |
| 2016-03-0111:36:08 AM | 70.025 | 149.45 | 32.225 | 74.525 |
| 2016-03-0111:36:12 AM | 70.138 | 149.45 | 32.112 | 74.525 |
| 2016-03-0111:36:16 AM | 70.362 | 149.45 | 32 | 74.525 |
| 2016-03-0111:36:20 AM | 70.475 | 149.338 | 31.888 | 74.525 |
| 2016-03-0111:36:24 AM | 70.588 | 149.45 | 31.888 | 74.525 |
| 2016-03-0111:36:28 AM | 70.7 | 149.45 | 32 | 74.525 |
| 2016-03-0111:36:32 AM | 70.812 | 149.45 | 32 | 74.525 |
| 2016-03-0111:36:36 AM | 70.925 | 149.45 | 32 | 74.638 |
| 2016-03-0111:36:40 AM | 71.15 | 149.45 | 32.112 | 74.525 |
| 2016-03-0111:36:44 AM | 71.262 | 149.338 | 32.112 | 74.525 |
| 2016-03-0111:36:49 AM | 71.375 | 149.338 | 32.112 | 74.525 |
| 2016-03-0111:36:53 AM | 71.262 | 149.45 | 31.888 | 74.525 |
| 2016-03-0111:36:57 AM | 71.375 | 149.338 | 31.775 | 74.525 |
| 2016-03-0111:37:01 AM | 71.262 | 149.338 | 31.55 | 74.525 |
| 2016-03-0111:37:05 AM | 71.15 | 149.338 | 31.325 | 74.525 |
| 2016-03-0111:37:12 AM | 71.15 | 149.45 | 31.325 | 74.525 |
| 2016-03-0111:37:16 AM | 71.15 | 149.562 | 31.438 | 74.525 |
| 2016-03-0111:37:20 AM | 71.038 | 149.562 | 31.55 | 74.525 |
| 2016-03-0111:37:24 AM | 71.038 | 149.562 | 31.55 | 74.412 |
| 2016-03-0111:37:28 AM | 70.925 | 149.562 | 31.662 | 74.412 |
| 2016-03-0111:37:32 AM | 70.812 | 149.675 | 31.662 | 74.525 |
| 2016-03-0111:37:36 AM | 70.812 | 149.562 | 31.662 | 74.412 |
| 2016-03-0111:37:41 AM | 70.7 | 149.562 | 31.662 | 74.412 |
| 2016-03-0111:37:45 AM | 70.7 | 149.562 | 31.662 | 74.412 |
| 2016-03-0111:37:49 AM | 70.588 | 149.562 | 31.438 | 74.412 |
| 2016-03-0111:37:53 AM | 70.588 | 149.562 | 31.325 | 74.412 |
| 2016-03-0111:37:57 AM | 70.588 | 149.562 | 31.212 | 74.412 |
| 2016-03-0111:38:01 AM | 70.588 | 149.562 | 31.212 | 74.525 |
| 2016-03-0111:38:05 AM | 70.588 | 149.45 | 31.325 | 74.525 |
| 2016-03-0111:38:09 AM | 70.588 | 149.45 | 31.325 | 74.525 |
| 2016-03-0111:38:13 AM | 70.588 | 149.45 | 31.325 | 74.525 |
| 2016-03-0111:38:17 AM | 70.7 | 149.45 | 31.438 | 74.525 |
| 2016-03-0111:38:21 AM | 70.7 | 149.338 | 31.55 | 74.525 |
| 2016-03-0111:38:25 AM | 70.7 | 149.338 | 31.55 | 74.525 |
| 2016-03-0111:38:29 AM | 70.7 | 149.338 | 31.662 | 74.525 |
| 2016-03-0111:38:33 AM | 70.7 | 149.45 | 31.662 | 74.525 |
| 2016-03-0111:38:37 AM | 70.588 | 149.45 | 31.662 | 74.638 |
| 2016-03-0111:38:41 AM | 70.7 | 149.562 | 31.55 | 74.525 |
| 2016-03-0111:38:45 AM | 70.7 | 149.562 | 31.662 | 74.638 |
| 2016-03-0111:38:49 AM | 70.7 | 149.562 | 31.662 | 74.638 |
| 2016-03-0111:38:53 AM | 70.7 | 149.562 | 31.662 | 74.638 |
| 2016-03-0111:38:57 AM | 70.7 | 149.562 | 31.662 | 74.638 |
| 2016-03-0111:39:01 AM | 70.7 | 149.562 | 31.775 | 74.638 |
| 2016-03-0111:39:05 AM | 70.812 | 149.675 | 31.775 | 74.638 |
| 2016-03-0111:39:09 AM | 70.812 | 149.675 | 31.888 | 74.638 |
| 2016-03-0111:39:13 AM | 70.812 | 149.675 | 32 | 74.638 |
| 2016-03-0111:39:17 AM | 70.925 | 149.675 | 32.112 | 74.638 |
| 2016-03-0111:39:21 AM | 70.925 | 149.788 | 32.225 | 74.525 |
| 2016-03-0111:39:25 AM | 71.038 | 149.9 | 32.338 | 74.525 |
| 2016-03-0111:39:29 AM | 71.038 | 149.9 | 32.338 | 74.525 |
| 2016-03-0111:39:33 AM | 71.15 | 149.9 | 32.225 | 74.525 |
| 2016-03-0111:39:37 AM | 71.15 | 149.9 | 32.225 | 74.525 |
| 2016-03-0111:39:41 AM | 71.15 | 149.9 | 32.112 | 74.525 |
| 2016-03-0111:39:45 AM | 71.15 | 149.9 | 32.112 | 74.525 |
| 2016-03-0111:39:49 AM | 71.15 | 149.9 | 32 | 74.525 |
| 2016-03-0111:39:54 AM | 71.15 | 149.9 | 31.662 | 74.638 |
| 2016-03-0111:39:58 AM | 71.15 | 149.9 | 31.55 | 74.638 |
| 2016-03-0111:40:02 AM | 71.15 | 149.9 | 31.438 | 74.638 |
| 2016-03-0111:40:06 AM | 71.15 | 150.013 | 31.438 | 74.638 |
| 2016-03-0111:40:10 AM | 71.15 | 150.013 | 31.55 | 74.638 |
| 2016-03-0111:40:14 AM | 71.15 | 150.125 | 31.55 | 74.638 |
| 2016-03-0111:40:18 AM | 71.15 | 150.125 | 31.662 | 74.638 |
| 2016-03-0111:40:22 AM | 71.038 | 150.125 | 31.775 | 74.638 |
| 2016-03-0111:40:26 AM | 71.038 | 150.013 | 31.775 | 74.638 |
| 2016-03-0111:40:34 AM | 71.038 | 150.013 | 31.775 | 74.638 |
| 2016-03-0111:40:38 AM | 70.925 | 150.013 | 31.888 | 74.75 |
| 2016-03-0111:40:42 AM | 70.925 | 150.013 | 31.888 | 74.638 |
| 2016-03-0111:40:46 AM | 70.812 | 150.013 | 31.775 | 74.638 |
| 2016-03-0111:40:50 AM | 70.812 | 150.013 | 31.662 | 74.638 |
| 2016-03-0111:40:54 AM | 70.7 | 150.125 | 31.662 | 74.75 |
| 2016-03-0111:40:58 AM | 70.7 | 150.125 | 31.662 | 74.75 |
| 2016-03-0111:41:02 AM | 70.7 | 150.125 | 31.55 | 74.75 |
| 2016-03-0111:41:06 AM | 70.588 | 150.125 | 31.438 | 74.75 |
| 2016-03-0111:41:10 AM | 70.588 | 150.125 | 31.438 | 74.75 |
| 2016-03-0111:41:14 AM | 70.475 | 150.125 | 31.55 | 74.75 |
| 2016-03-0111:41:18 AM | 70.475 | 150.125 | 31.662 | 74.638 |
| 2016-03-0111:41:22 AM | 70.475 | 150.125 | 31.775 | 74.638 |
| 2016-03-0111:41:26 AM | 70.362 | 150.125 | 31.775 | 74.638 |
| 2016-03-0111:41:30 AM | 70.362 | 150.125 | 31.55 | 74.75 |
| 2016-03-0111:41:34 AM | 70.362 | 150.238 | 31.212 | 74.638 |
| 2016-03-0111:41:38 AM | 70.362 | 150.238 | 30.988 | 74.75 |
| 2016-03-0111:41:42 AM | 70.362 | 150.238 | 30.762 | 74.75 |
| 2016-03-0111:41:46 AM | 70.362 | 150.238 | 30.65 | 74.75 |
| 2016-03-0111:41:50 AM | 70.362 | 150.238 | 30.538 | 74.75 |
| 2016-03-0111:41:55 AM | 70.362 | 150.125 | 30.538 | 74.75 |
| 2016-03-0111:41:59 AM | 70.25 | 150.125 | 30.65 | 74.75 |
| 2016-03-0111:42:03 AM | 70.25 | 150.125 | 30.875 | 74.75 |
| 2016-03-0111:42:07 AM | 70.362 | 150.125 | 30.875 | 74.75 |
| 2016-03-0111:42:11 AM | 70.475 | 150.125 | 31.1 | 74.75 |
| 2016-03-0111:42:15 AM | 70.588 | 150.125 | 31.1 | 74.75 |
| 2016-03-0111:42:19 AM | 70.588 | 150.013 | 31.1 | 74.75 |
| 2016-03-0111:42:23 AM | 70.588 | 150.125 | 30.988 | 74.75 |
| 2016-03-0111:42:27 AM | 70.475 | 150.125 | 30.988 | 74.75 |
| 2016-03-0111:42:31 AM | 70.475 | 150.125 | 30.988 | 74.75 |
| 2016-03-0111:42:35 AM | 70.362 | 150.125 | 30.988 | 74.75 |
| 2016-03-0111:42:39 AM | 70.475 | 150.125 | 30.762 | 74.75 |
| 2016-03-0111:42:43 AM | 70.362 | 150.238 | 30.762 | 74.75 |
| 2016-03-0111:42:47 AM | 70.362 | 150.35 | 30.988 | 74.75 |
| 2016-03-0111:42:51 AM | 70.362 | 150.238 | 30.988 | 74.75 |
| 2016-03-0111:42:55 AM | 70.362 | 150.238 | 30.988 | 74.75 |
| 2016-03-0111:42:59 AM | 70.362 | 150.35 | 31.1 | 74.75 |
| 2016-03-0111:43:03 AM | 70.362 | 150.462 | 31.212 | 74.638 |
| 2016-03-0111:43:07 AM | 70.362 | 150.462 | 31.438 | 74.638 |
| 2016-03-0111:43:11 AM | 70.362 | 150.462 | 31.438 | 74.75 |
| 2016-03-0111:43:15 AM | 70.362 | 150.462 | 31.55 | 74.75 |
| 2016-03-0111:43:19 AM | 70.362 | 150.462 | 31.662 | 74.75 |
| 2016-03-0111:43:23 AM | 70.475 | 150.35 | 31.775 | 74.638 |
| 2016-03-0111:43:27 AM | 70.588 | 150.35 | 31.775 | 74.638 |
| 2016-03-0111:43:31 AM | 70.588 | 150.35 | 31.775 | 74.638 |
| 2016-03-0111:43:35 AM | 70.588 | 150.462 | 31.55 | 74.638 |
| 2016-03-0111:43:39 AM | 70.588 | 150.462 | 31.438 | 74.638 |
| 2016-03-0111:43:43 AM | 70.7 | 150.35 | 31.325 | 74.638 |
| 2016-03-0111:43:47 AM | 70.7 | 150.35 | 31.212 | 74.638 |
| 2016-03-0111:43:51 AM | 70.7 | 150.35 | 30.875 | 74.638 |
| 2016-03-0111:43:55 AM | 70.7 | 150.238 | 30.762 | 74.638 |
| 2016-03-0111:43:59 AM | 70.7 | 150.238 | 30.762 | 74.638 |
| 2016-03-0111:44:04 AM | 70.7 | 150.35 | 30.65 | 74.638 |
| 2016-03-0111:44:08 AM | 70.7 | 150.238 | 30.65 | 74.638 |
| 2016-03-0111:44:12 AM | 70.7 | 150.238 | 30.65 | 74.638 |
| 2016-03-0111:44:16 AM | 70.7 | 150.238 | 30.425 | 74.638 |
| 2016-03-0111:44:20 AM | 70.7 | 150.238 | 30.312 | 74.638 |
| 2016-03-0111:44:24 AM | 70.7 | 150.238 | 30.312 | 74.638 |
| 2016-03-0111:44:28 AM | 70.7 | 150.238 | 30.312 | 74.638 |
| 2016-03-0111:44:32 AM | 70.588 | 150.238 | 30.425 | 74.638 |
| 2016-03-0111:44:36 AM | 70.588 | 150.238 | 30.538 | 74.638 |
| 2016-03-0111:44:40 AM | 70.588 | 150.238 | 30.762 | 74.638 |
| 2016-03-0111:44:44 AM | 70.475 | 150.238 | 30.875 | 74.638 |
| 2016-03-0111:44:48 AM | 70.588 | 150.238 | 30.988 | 74.638 |
| 2016-03-0111:44:52 AM | 70.475 | 150.238 | 30.988 | 74.638 |
| 2016-03-0111:44:56 AM | 70.588 | 150.238 | 31.1 | 74.638 |
| 2016-03-0111:45:00 AM | 70.588 | 150.238 | 31.212 | 74.638 |
| 2016-03-0111:45:04 AM | 70.588 | 150.238 | 31.325 | 74.75 |
| 2016-03-0111:45:08 AM | 70.475 | 150.238 | 31.438 | 74.75 |
| 2016-03-0111:45:12 AM | 70.475 | 150.35 | 31.325 | 74.75 |
| 2016-03-0111:45:16 AM | 70.588 | 150.35 | 31.212 | 74.638 |
| 2016-03-0111:45:20 AM | 70.588 | 150.35 | 31.212 | 74.638 |
| 2016-03-0111:45:24 AM | 70.588 | 150.35 | 31.212 | 74.638 |
| 2016-03-0111:45:28 AM | 70.588 | 150.35 | 31.212 | 74.638 |
| 2016-03-0111:45:32 AM | 70.588 | 150.462 | 31.212 | 74.75 |
| 2016-03-0111:45:36 AM | 70.588 | 150.462 | 31.212 | 74.638 |
| 2016-03-0111:45:40 AM | 70.475 | 150.462 | 31.438 | 74.75 |
| 2016-03-0111:45:44 AM | 70.475 | 150.462 | 31.55 | 74.638 |
| 2016-03-0111:45:48 AM | 70.475 | 150.575 | 31.55 | 74.638 |
| 2016-03-0111:45:52 AM | 70.475 | 150.575 | 31.438 | 74.638 |
| 2016-03-0111:45:56 AM | 70.475 | 150.688 | 31.325 | 74.638 |
| 2016-03-0111:46:00 AM | 70.475 | 150.688 | 31.438 | 74.638 |
| 2016-03-0111:46:04 AM | 70.475 | 150.688 | 31.55 | 74.638 |
| 2016-03-0111:46:08 AM | 70.475 | 150.8 | 31.662 | 74.638 |
| 2016-03-0111:46:12 AM | 70.475 | 150.8 | 31.888 | 74.75 |
| 2016-03-0111:46:16 AM | 70.475 | 150.8 | 31.888 | 74.75 |
| 2016-03-0111:46:21 AM | 70.475 | 150.8 | 32 | 74.75 |
| 2016-03-0111:46:25 AM | 70.362 | 151.025 | 32.112 | 74.638 |
| 2016-03-0111:46:29 AM | 70.362 | 151.025 | 32.225 | 74.75 |
| 2016-03-0111:46:33 AM | 70.362 | 151.025 | 32.338 | 74.638 |
| 2016-03-0111:46:37 AM | 70.362 | 151.025 | 32.338 | 74.638 |
| 2016-03-0111:46:41 AM | 70.362 | 151.025 | 32.338 | 74.75 |
| 2016-03-0111:46:45 AM | 70.475 | 151.025 | 32.45 | 74.638 |
| 2016-03-0111:46:49 AM | 70.475 | 151.025 | 32.562 | 74.638 |
| 2016-03-0111:46:53 AM | 70.588 | 151.025 | 32.562 | 74.638 |
| 2016-03-0111:46:57 AM | 70.588 | 151.138 | 32.562 | 74.638 |
| 2016-03-0111:47:01 AM | 70.7 | 151.138 | 32.562 | 74.638 |
| 2016-03-0111:47:05 AM | 70.7 | 151.138 | 32.562 | 74.638 |
| 2016-03-0111:47:09 AM | 70.7 | 151.138 | 32.562 | 74.638 |
| 2016-03-0111:47:13 AM | 70.812 | 151.138 | 32.675 | 74.638 |
| 2016-03-0111:47:17 AM | 70.812 | 151.138 | 32.788 | 74.638 |
| 2016-03-0111:47:21 AM | 70.925 | 151.25 | 32.9 | 74.638 |
| 2016-03-0111:47:25 AM | 70.925 | 151.25 | 32.9 | 74.525 |
| 2016-03-0111:47:29 AM | 71.038 | 151.362 | 32.675 | 74.525 |
| 2016-03-0111:47:33 AM | 71.038 | 151.362 | 32.45 | 74.525 |
| 2016-03-0111:47:37 AM | 71.038 | 151.25 | 32.225 | 74.525 |
| 2016-03-0111:47:41 AM | 71.038 | 151.25 | 32.225 | 74.525 |
| 2016-03-0111:47:45 AM | 71.038 | 151.25 | 32.225 | 74.525 |
| 2016-03-0111:47:49 AM | 71.038 | 151.25 | 32.112 | 74.525 |
| 2016-03-0111:47:53 AM | 71.038 | 151.25 | 32.112 | 74.525 |
| 2016-03-0111:47:57 AM | 70.925 | 151.25 | 32.225 | 74.525 |
| 2016-03-0111:48:01 AM | 70.925 | 151.362 | 32.112 | 74.525 |
| 2016-03-0111:48:05 AM | 70.925 | 151.475 | 32.225 | 74.525 |
| 2016-03-0111:48:09 AM | 70.925 | 151.475 | 32.225 | 74.638 |
| 2016-03-0111:48:13 AM | 70.812 | 151.475 | 32.338 | 74.638 |
| 2016-03-0111:48:17 AM | 70.812 | 151.475 | 32.338 | 74.638 |
| 2016-03-0111:48:22 AM | 70.812 | 151.475 | 32.338 | 74.525 |
| 2016-03-0111:48:26 AM | 70.7 | 151.362 | 32.45 | 74.638 |
| 2016-03-0111:48:30 AM | 70.7 | 151.475 | 32.562 | 74.638 |
| 2016-03-0111:48:34 AM | 70.588 | 151.475 | 32.562 | 74.525 |
| 2016-03-0111:48:38 AM | 70.588 | 151.588 | 32.562 | 74.638 |
| 2016-03-0111:48:42 AM | 70.475 | 151.588 | 32.675 | 74.638 |
| 2016-03-0111:48:46 AM | 70.475 | 151.588 | 32.675 | 74.638 |
| 2016-03-0111:48:50 AM | 70.475 | 151.7 | 32.562 | 74.638 |
| 2016-03-0111:48:54 AM | 70.475 | 151.7 | 32.675 | 74.638 |
| 2016-03-0111:48:58 AM | 70.362 | 151.812 | 32.788 | 74.638 |
| 2016-03-0111:49:02 AM | 70.475 | 151.812 | 32.675 | 74.638 |
| 2016-03-0111:49:06 AM | 70.475 | 151.812 | 32.562 | 74.638 |
| 2016-03-0111:49:10 AM | 70.588 | 151.812 | 32.562 | 74.638 |
| 2016-03-0111:49:14 AM | 70.475 | 151.812 | 32.562 | 74.638 |
| 2016-03-0111:49:18 AM | 70.588 | 151.812 | 32.45 | 74.638 |
| 2016-03-0111:49:22 AM | 70.588 | 151.812 | 32.338 | 74.638 |
| 2016-03-0111:49:26 AM | 70.588 | 151.812 | 32.225 | 74.638 |
| 2016-03-0111:49:30 AM | 70.588 | 151.812 | 32.112 | 74.638 |
| 2016-03-0111:49:34 AM | 70.588 | 151.7 | 32 | 74.638 |
| 2016-03-0111:49:38 AM | 70.588 | 151.7 | 32 | 74.638 |
| 2016-03-0111:49:42 AM | 70.588 | 151.7 | 32 | 74.638 |
| 2016-03-0111:49:46 AM | 70.588 | 151.588 | 32.225 | 74.638 |
| 2016-03-0111:49:50 AM | 70.475 | 151.7 | 32.225 | 74.638 |
| 2016-03-0111:49:54 AM | 70.475 | 151.812 | 32.338 | 74.638 |
| 2016-03-0111:49:58 AM | 70.475 | 151.7 | 32.338 | 74.638 |
| 2016-03-0111:50:02 AM | 70.475 | 151.7 | 32.112 | 74.638 |
| 2016-03-0111:50:06 AM | 70.362 | 151.7 | 31.888 | 74.638 |
| 2016-03-0111:50:10 AM | 70.362 | 151.588 | 31.775 | 74.638 |
| 2016-03-0111:50:14 AM | 70.362 | 151.7 | 31.662 | 74.638 |
| 2016-03-0111:50:18 AM | 70.362 | 151.812 | 31.662 | 74.638 |
| 2016-03-0111:50:22 AM | 70.362 | 151.812 | 31.662 | 74.638 |
| 2016-03-0111:50:26 AM | 70.362 | 151.925 | 31.55 | 74.638 |
| 2016-03-0111:50:30 AM | 70.25 | 151.925 | 31.55 | 74.638 |
| 2016-03-0111:50:34 AM | 70.25 | 151.812 | 31.325 | 74.75 |
| 2016-03-0111:50:39 AM | 70.25 | 151.812 | 31.1 | 74.638 |
| 2016-03-0111:50:43 AM | 70.25 | 151.812 | 30.988 | 74.638 |
| 2016-03-0111:50:47 AM | 70.25 | 151.7 | 30.875 | 74.75 |
| 2016-03-0111:50:51 AM | 70.362 | 151.588 | 30.988 | 74.638 |
| 2016-03-0111:50:55 AM | 70.475 | 151.588 | 30.988 | 74.638 |
| 2016-03-0111:50:59 AM | 70.475 | 151.588 | 31.1 | 74.638 |
| 2016-03-0111:51:03 AM | 70.588 | 151.475 | 31.212 | 74.638 |
| 2016-03-0111:51:11 AM | 70.7 | 151.588 | 31.1 | 74.638 |
| 2016-03-0111:51:19 AM | 70.7 | 151.588 | 31.1 | 74.638 |
| 2016-03-0111:51:23 AM | 70.812 | 151.588 | 30.988 | 74.638 |
| 2016-03-0111:51:27 AM | 70.7 | 151.588 | 30.988 | 74.638 |
| 2016-03-0111:51:31 AM | 70.7 | 151.475 | 30.988 | 74.525 |
| 2016-03-0111:51:35 AM | 70.812 | 151.362 | 31.1 | 74.638 |
| 2016-03-0111:51:39 AM | 70.812 | 151.362 | 31.1 | 74.638 |
| 2016-03-0111:51:43 AM | 70.812 | 151.362 | 31.1 | 74.525 |
| 2016-03-0111:51:47 AM | 70.812 | 151.25 | 30.988 | 74.525 |
| 2016-03-0111:51:51 AM | 70.812 | 151.138 | 30.875 | 74.638 |
| 2016-03-0111:51:55 AM | 70.812 | 151.025 | 30.65 | 74.525 |
| 2016-03-0111:51:59 AM | 70.812 | 150.912 | 30.65 | 74.525 |
| 2016-03-0111:52:03 AM | 70.7 | 150.8 | 30.65 | 74.525 |
| 2016-03-0111:52:07 AM | 70.7 | 150.8 | 30.762 | 74.525 |
| 2016-03-0111:52:11 AM | 70.7 | 150.688 | 30.875 | 74.525 |
| 2016-03-0111:52:15 AM | 70.7 | 150.688 | 30.875 | 74.525 |
| 2016-03-0111:52:19 AM | 70.7 | 150.688 | 30.875 | 74.525 |
| 2016-03-0111:52:23 AM | 70.7 | 150.8 | 30.988 | 74.638 |
| 2016-03-0111:52:27 AM | 70.588 | 150.8 | 31.1 | 74.638 |
| 2016-03-0111:52:32 AM | 70.7 | 150.8 | 31.1 | 74.638 |
| 2016-03-0111:52:36 AM | 70.7 | 150.8 | 31.1 | 74.638 |
| 2016-03-0111:52:40 AM | 70.588 | 150.8 | 30.988 | 74.525 |
| 2016-03-0111:52:44 AM | 70.588 | 150.8 | 30.875 | 74.525 |
| 2016-03-0111:52:48 AM | 70.588 | 150.8 | 30.762 | 74.525 |
| 2016-03-0111:52:52 AM | 70.588 | 150.8 | 30.762 | 74.638 |
| 2016-03-0111:52:56 AM | 70.475 | 150.8 | 30.875 | 74.525 |
| 2016-03-0111:53:00 AM | 70.475 | 150.8 | 30.875 | 74.525 |
| 2016-03-0111:53:04 AM | 70.362 | 150.8 | 30.875 | 74.525 |
| 2016-03-0111:53:08 AM | 70.362 | 150.912 | 30.988 | 74.638 |
| 2016-03-0111:53:12 AM | 70.25 | 150.912 | 31.1 | 74.638 |
| 2016-03-0111:53:16 AM | 70.362 | 150.912 | 31.212 | 74.638 |
| 2016-03-0111:53:20 AM | 70.25 | 150.912 | 31.325 | 74.525 |
| 2016-03-0111:53:24 AM | 70.25 | 151.025 | 31.438 | 74.525 |
| 2016-03-0111:53:28 AM | 70.25 | 150.912 | 31.55 | 74.525 |
| 2016-03-0111:53:32 AM | 70.138 | 150.912 | 31.55 | 74.525 |
| 2016-03-0111:53:36 AM | 70.138 | 150.912 | 31.438 | 74.525 |
| 2016-03-0111:53:40 AM | 70.025 | 150.912 | 31.325 | 74.525 |
| 2016-03-0111:53:44 AM | 70.025 | 150.8 | 31.212 | 74.638 |
| 2016-03-0111:53:48 AM | 70.025 | 150.688 | 31.212 | 74.525 |
| 2016-03-0111:53:52 AM | 70.025 | 150.688 | 31.325 | 74.638 |
| 2016-03-0111:53:56 AM | 69.912 | 150.688 | 31.438 | 74.525 |
| 2016-03-0111:54:00 AM | 69.912 | 150.688 | 31.55 | 74.525 |
| 2016-03-0111:54:04 AM | 69.912 | 150.688 | 31.55 | 74.525 |
| 2016-03-0111:54:08 AM | 69.912 | 150.688 | 31.55 | 74.525 |
| 2016-03-0111:54:12 AM | 69.912 | 150.688 | 31.775 | 74.525 |
| 2016-03-0111:54:16 AM | 69.912 | 150.688 | 31.662 | 74.525 |
| 2016-03-0111:54:20 AM | 69.912 | 150.688 | 31.662 | 74.525 |
| 2016-03-0111:54:24 AM | 69.8 | 150.8 | 31.775 | 74.525 |
| 2016-03-0111:54:28 AM | 69.8 | 150.8 | 31.888 | 74.525 |
| 2016-03-0111:54:32 AM | 69.8 | 150.8 | 32 | 74.525 |
| 2016-03-0111:54:36 AM | 69.912 | 150.912 | 32 | 74.525 |
| 2016-03-0111:54:40 AM | 69.912 | 150.912 | 32.112 | 74.525 |
| 2016-03-0111:54:44 AM | 69.8 | 150.912 | 32.112 | 74.525 |
| 2016-03-0111:54:48 AM | 69.8 | 151.025 | 32.112 | 74.525 |
| 2016-03-0111:54:52 AM | 69.8 | 151.025 | 31.775 | 74.525 |
| 2016-03-0111:54:56 AM | 69.688 | 151.025 | 31.662 | 74.525 |
| 2016-03-0111:55:00 AM | 69.688 | 151.025 | 31.55 | 74.525 |
| 2016-03-0111:55:04 AM | 69.688 | 151.025 | 31.438 | 74.525 |
| 2016-03-0111:55:08 AM | 69.688 | 151.025 | 31.325 | 74.525 |
| 2016-03-0111:55:12 AM | 69.575 | 151.138 | 31.212 | 74.525 |
| 2016-03-0111:55:17 AM | 69.575 | 151.138 | 31.212 | 74.525 |
| 2016-03-0111:55:21 AM | 69.575 | 151.138 | 31.325 | 74.525 |
| 2016-03-0111:55:25 AM | 69.462 | 151.025 | 31.325 | 74.525 |
| 2016-03-0111:55:29 AM | 69.462 | 151.025 | 31.438 | 74.525 |
| 2016-03-0111:55:33 AM | 69.462 | 151.025 | 31.55 | 74.525 |
| 2016-03-0111:55:37 AM | 69.462 | 151.025 | 31.662 | 74.638 |
| 2016-03-0111:55:41 AM | 69.462 | 151.025 | 31.775 | 74.638 |
| 2016-03-0111:55:47 AM | 69.462 | 150.912 | 31.888 | 74.638 |
| 2016-03-0111:55:51 AM | 69.462 | 150.912 | 32 | 74.638 |
| 2016-03-0111:55:55 AM | 69.462 | 150.912 | 32 | 74.638 |
| 2016-03-0111:55:59 AM | 69.462 | 150.912 | 32 | 74.638 |
| 2016-03-0111:56:03 AM | 69.462 | 151.025 | 32 | 74.638 |
| 2016-03-0111:56:07 AM | 69.462 | 151.025 | 32.112 | 74.638 |
| 2016-03-0111:56:11 AM | 69.462 | 150.912 | 32.112 | 74.638 |
| 2016-03-0111:56:16 AM | 69.462 | 150.8 | 31.888 | 74.638 |
| 2016-03-0111:56:20 AM | 69.462 | 150.8 | 31.662 | 74.638 |
| 2016-03-0111:56:24 AM | 69.462 | 150.8 | 31.438 | 74.75 |
| 2016-03-0111:56:28 AM | 69.462 | 150.8 | 31.438 | 74.638 |
| 2016-03-0111:56:32 AM | 69.35 | 150.8 | 31.438 | 74.75 |
| 2016-03-0111:56:36 AM | 69.35 | 150.8 | 31.325 | 74.638 |
| 2016-03-0111:56:40 AM | 69.35 | 150.8 | 31.325 | 74.75 |
| 2016-03-0111:56:44 AM | 69.35 | 150.8 | 31.325 | 74.75 |
| 2016-03-0111:56:48 AM | 69.35 | 150.8 | 31.438 | 74.638 |
| 2016-03-0111:56:52 AM | 69.238 | 150.688 | 31.438 | 74.75 |
| 2016-03-0111:56:56 AM | 69.238 | 150.8 | 31.325 | 74.75 |
| 2016-03-0111:57:00 AM | 69.238 | 150.688 | 31.325 | 74.75 |
| 2016-03-0111:57:04 AM | 69.238 | 150.8 | 31.438 | 74.75 |
| 2016-03-0111:57:08 AM | 69.238 | 150.8 | 31.438 | 74.75 |
| 2016-03-0111:57:12 AM | 69.238 | 150.912 | 31.438 | 74.75 |
| 2016-03-0111:57:16 AM | 69.238 | 150.912 | 31.438 | 74.75 |
| 2016-03-0111:57:20 AM | 69.238 | 150.912 | 31.438 | 74.862 |
| 2016-03-0111:57:24 AM | 69.238 | 151.025 | 31.438 | 74.75 |
| 2016-03-0111:57:28 AM | 69.125 | 151.025 | 31.212 | 74.862 |
| 2016-03-0111:57:32 AM | 69.125 | 151.025 | 31.212 | 74.862 |
| 2016-03-0111:57:36 AM | 69.125 | 151.138 | 31.212 | 74.862 |
| 2016-03-0111:57:40 AM | 69.125 | 151.138 | 31.325 | 74.862 |
| 2016-03-0111:57:44 AM | 69.238 | 151.25 | 31.438 | 74.862 |
| 2016-03-0111:57:48 AM | 69.238 | 151.25 | 31.438 | 74.862 |
| 2016-03-0111:57:52 AM | 69.238 | 151.362 | 31.662 | 74.862 |
| 2016-03-0111:57:56 AM | 69.125 | 151.362 | 31.775 | 74.862 |
| 2016-03-0111:58:00 AM | 69.238 | 151.362 | 31.775 | 74.862 |
| 2016-03-0111:58:04 AM | 69.125 | 151.362 | 31.662 | 74.862 |
| 2016-03-0111:58:08 AM | 69.238 | 151.475 | 31.775 | 74.862 |
| 2016-03-0111:58:12 AM | 69.238 | 151.588 | 31.775 | 74.862 |
| 2016-03-0111:58:16 AM | 69.238 | 151.588 | 31.775 | 74.862 |
| 2016-03-0111:58:20 AM | 69.238 | 151.588 | 31.775 | 74.862 |
| 2016-03-0111:58:27 AM | 69.238 | 151.588 | 31.775 | 74.862 |
| 2016-03-0111:58:31 AM | 69.238 | 151.7 | 31.888 | 74.862 |
| 2016-03-0111:58:35 AM | 69.238 | 151.588 | 32.112 | 74.862 |
| 2016-03-0111:58:39 AM | 69.238 | 151.588 | 32.225 | 74.862 |
| 2016-03-0111:58:43 AM | 69.238 | 151.588 | 32.338 | 74.862 |
| 2016-03-0111:58:48 AM | 69.238 | 151.588 | 32.338 | 74.862 |
| 2016-03-0111:58:52 AM | 69.238 | 151.7 | 32.338 | 74.862 |
| 2016-03-0111:58:56 AM | 69.238 | 151.7 | 32.338 | 74.862 |
| 2016-03-0111:59:00 AM | 69.238 | 151.7 | 32.562 | 74.862 |
| 2016-03-0111:59:04 AM | 69.238 | 151.7 | 32.675 | 74.862 |
| 2016-03-0111:59:08 AM | 69.238 | 151.7 | 32.788 | 74.862 |
| 2016-03-0111:59:12 AM | 69.125 | 151.7 | 32.9 | 74.862 |
| 2016-03-0111:59:16 AM | 69.238 | 151.812 | 32.9 | 74.862 |
| 2016-03-0111:59:20 AM | 69.238 | 151.812 | 32.9 | 74.862 |
| 2016-03-0111:59:24 AM | 69.238 | 151.812 | 32.675 | 74.862 |
| 2016-03-0111:59:28 AM | 69.238 | 151.7 | 32.675 | 74.862 |
| 2016-03-0111:59:32 AM | 69.238 | 151.7 | 32.788 | 74.862 |
| 2016-03-0111:59:36 AM | 69.238 | 151.7 | 32.9 | 74.862 |
| 2016-03-0111:59:40 AM | 69.238 | 151.7 | 32.9 | 74.862 |
| 2016-03-0111:59:44 AM | 69.238 | 151.7 | 33.012 | 74.862 |
| 2016-03-0111:59:48 AM | 69.238 | 151.7 | 33.012 | 74.975 |
| 2016-03-0111:59:52 AM | 69.35 | 151.812 | 33.125 | 74.862 |
| 2016-03-0111:59:56 AM | 69.35 | 151.812 | 33.238 | 74.862 |
| 2016-03-0112:00:00 PM | 69.462 | 151.925 | 33.238 | 74.862 |
| 2016-03-0112:00:04 PM | 69.462 | 151.925 | 33.238 | 74.862 |
| 2016-03-0112:00:08 PM | 69.462 | 151.925 | 33.012 | 74.862 |
| 2016-03-0112:00:12 PM | 69.462 | 152.038 | 32.675 | 74.975 |
| 2016-03-0112:00:16 PM | 69.462 | 152.038 | 32.562 | 74.862 |
| 2016-03-0112:00:20 PM | 69.462 | 152.038 | 32.338 | 74.862 |
| 2016-03-0112:00:24 PM | 69.575 | 152.038 | 32.338 | 74.862 |
| 2016-03-0112:00:29 PM | 69.575 | 152.038 | 32.45 | 74.862 |
| 2016-03-0112:00:33 PM | 69.575 | 152.038 | 32.45 | 74.862 |
| 2016-03-0112:00:37 PM | 69.575 | 152.15 | 32.45 | 74.862 |
| 2016-03-0112:00:41 PM | 69.575 | 152.263 | 32.338 | 74.862 |
| 2016-03-0112:00:45 PM | 69.575 | 152.263 | 32.45 | 74.862 |
| 2016-03-0112:00:49 PM | 69.575 | 152.263 | 32.562 | 74.862 |
| 2016-03-0112:00:53 PM | 69.575 | 152.375 | 32.562 | 74.862 |
| 2016-03-0112:00:57 PM | 69.575 | 152.375 | 32.675 | 74.862 |
| 2016-03-0112:01:01 PM | 69.575 | 152.488 | 32.562 | 74.862 |
| 2016-03-0112:01:05 PM | 69.462 | 152.488 | 32.562 | 74.862 |
| 2016-03-0112:01:09 PM | 69.575 | 152.488 | 32.562 | 74.862 |
| 2016-03-0112:01:13 PM | 69.462 | 152.6 | 32.562 | 74.862 |
| 2016-03-0112:01:17 PM | 69.575 | 152.6 | 32.45 | 74.862 |
| 2016-03-0112:01:21 PM | 69.575 | 152.6 | 32.225 | 74.862 |
| 2016-03-0112:01:25 PM | 69.462 | 152.6 | 32.112 | 74.975 |
| 2016-03-0112:01:29 PM | 69.575 | 152.712 | 31.888 | 74.975 |
| 2016-03-0112:01:34 PM | 69.462 | 152.825 | 31.775 | 74.975 |
| 2016-03-0112:01:38 PM | 69.575 | 152.712 | 31.662 | 74.975 |
| 2016-03-0112:01:42 PM | 69.575 | 152.712 | 31.55 | 75.088 |
| 2016-03-0112:01:46 PM | 69.575 | 152.712 | 31.325 | 75.088 |
| 2016-03-0112:01:50 PM | 69.688 | 152.6 | 31.212 | 75.088 |
| 2016-03-0112:01:54 PM | 69.8 | 152.712 | 31.212 | 75.088 |
| 2016-03-0112:01:58 PM | 69.8 | 152.712 | 31.325 | 75.088 |
| 2016-03-0112:02:02 PM | 69.8 | 152.712 | 31.325 | 75.088 |
| 2016-03-0112:02:06 PM | 69.688 | 152.712 | 31.55 | 75.088 |
| 2016-03-0112:02:10 PM | 69.688 | 152.6 | 31.662 | 75.088 |
| 2016-03-0112:02:14 PM | 69.688 | 152.6 | 31.662 | 75.088 |
| 2016-03-0112:02:18 PM | 69.8 | 152.6 | 31.775 | 75.088 |
| 2016-03-0112:02:22 PM | 69.8 | 152.6 | 31.775 | 75.088 |
| 2016-03-0112:02:26 PM | 69.8 | 152.712 | 31.888 | 75.088 |
| 2016-03-0112:02:30 PM | 69.8 | 152.712 | 31.888 | 75.088 |
| 2016-03-0112:02:35 PM | 69.688 | 152.825 | 32 | 75.088 |
| 2016-03-0112:02:39 PM | 69.688 | 152.712 | 32 | 75.088 |
| 2016-03-0112:02:43 PM | 69.688 | 152.6 | 31.888 | 75.088 |
| 2016-03-0112:02:47 PM | 69.688 | 152.6 | 31.888 | 74.975 |
| 2016-03-0112:02:51 PM | 69.688 | 152.6 | 32 | 74.975 |
| 2016-03-0112:02:55 PM | 69.688 | 152.712 | 32 | 74.975 |
| 2016-03-0112:02:59 PM | 69.688 | 152.6 | 31.775 | 74.975 |
| 2016-03-0112:03:03 PM | 69.575 | 152.6 | 31.55 | 74.975 |
| 2016-03-0112:03:07 PM | 69.575 | 152.6 | 31.55 | 74.862 |
| 2016-03-0112:03:11 PM | 69.575 | 152.6 | 31.662 | 74.975 |
| 2016-03-0112:03:15 PM | 69.575 | 152.488 | 31.662 | 74.862 |
| 2016-03-0112:03:19 PM | 69.462 | 152.488 | 31.775 | 74.862 |
| 2016-03-0112:03:23 PM | 69.462 | 152.375 | 31.775 | 74.862 |
| 2016-03-0112:03:27 PM | 69.462 | 152.375 | 31.888 | 74.975 |
| 2016-03-0112:03:31 PM | 69.462 | 152.375 | 31.888 | 74.862 |
| 2016-03-0112:03:35 PM | 69.462 | 152.263 | 31.888 | 74.862 |
| 2016-03-0112:03:39 PM | 69.575 | 152.263 | 31.662 | 74.862 |
| 2016-03-0112:03:44 PM | 69.462 | 152.263 | 31.662 | 74.862 |
| 2016-03-0112:03:48 PM | 69.575 | 152.263 | 31.775 | 74.862 |
| 2016-03-0112:03:52 PM | 69.688 | 152.15 | 31.662 | 74.862 |
| 2016-03-0112:03:56 PM | 69.688 | 152.15 | 31.438 | 74.862 |
| 2016-03-0112:04:00 PM | 69.688 | 152.15 | 31.325 | 74.975 |
| 2016-03-0112:04:04 PM | 69.8 | 152.15 | 31.212 | 74.975 |
| 2016-03-0112:04:08 PM | 69.8 | 152.263 | 31.212 | 74.862 |
| 2016-03-0112:04:12 PM | 69.8 | 152.263 | 31.325 | 74.862 |
| 2016-03-0112:04:16 PM | 69.8 | 152.263 | 31.438 | 74.862 |
| 2016-03-0112:04:20 PM | 69.8 | 152.263 | 31.55 | 74.862 |
| 2016-03-0112:04:24 PM | 69.8 | 152.263 | 31.662 | 74.862 |
| 2016-03-0112:04:28 PM | 69.8 | 152.263 | 31.662 | 74.862 |
| 2016-03-0112:04:32 PM | 69.8 | 152.263 | 31.55 | 74.862 |
| 2016-03-0112:04:36 PM | 69.8 | 152.375 | 31.438 | 74.862 |
| 2016-03-0112:04:40 PM | 69.8 | 152.263 | 31.438 | 74.862 |
| 2016-03-0112:04:44 PM | 69.912 | 152.15 | 31.438 | 74.862 |
| 2016-03-0112:04:48 PM | 70.025 | 152.15 | 31.438 | 74.862 |
| 2016-03-0112:04:52 PM | 70.025 | 152.038 | 31.438 | 74.862 |
| 2016-03-0112:04:56 PM | 70.025 | 151.925 | 31.55 | 74.75 |
| 2016-03-0112:05:05 PM | 70.25 | 151.925 | 31.775 | 74.862 |
| 2016-03-0112:05:09 PM | 70.362 | 151.925 | 31.775 | 74.75 |
| 2016-03-0112:05:13 PM | 70.475 | 151.925 | 31.888 | 74.862 |
| 2016-03-0112:05:17 PM | 70.7 | 151.925 | 31.662 | 74.75 |
| 2016-03-0112:05:21 PM | 70.7 | 151.812 | 31.662 | 74.862 |
| 2016-03-0112:05:25 PM | 70.812 | 151.812 | 31.662 | 74.862 |
| 2016-03-0112:05:29 PM | 70.812 | 151.7 | 31.662 | 74.862 |
| 2016-03-0112:05:33 PM | 71.038 | 151.812 | 31.662 | 74.862 |
| 2016-03-0112:05:37 PM | 71.15 | 151.7 | 31.662 | 74.862 |
| 2016-03-0112:05:41 PM | 71.262 | 151.7 | 31.662 | 74.862 |
| 2016-03-0112:05:45 PM | 71.15 | 151.7 | 31.55 | 74.862 |
| 2016-03-0112:05:49 PM | 71.15 | 151.588 | 31.438 | 74.862 |
| 2016-03-0112:05:53 PM | 71.15 | 151.588 | 31.55 | 74.862 |
| 2016-03-0112:05:57 PM | 71.038 | 151.7 | 31.438 | 74.862 |
| 2016-03-0112:06:01 PM | 71.038 | 151.7 | 31.55 | 74.75 |
| 2016-03-0112:06:06 PM | 71.038 | 151.812 | 31.55 | 74.75 |
| 2016-03-0112:06:10 PM | 71.038 | 151.925 | 31.55 | 74.75 |
| 2016-03-0112:06:14 PM | 71.038 | 151.925 | 31.438 | 74.75 |
| 2016-03-0112:06:18 PM | 71.038 | 151.925 | 31.325 | 74.862 |
| 2016-03-0112:06:22 PM | 71.15 | 151.812 | 31.212 | 74.862 |
| 2016-03-0112:06:26 PM | 71.262 | 151.7 | 31.212 | 74.75 |
| 2016-03-0112:06:30 PM | 71.375 | 151.7 | 31.212 | 74.75 |
| 2016-03-0112:06:34 PM | 71.488 | 151.588 | 31.438 | 74.75 |
| 2016-03-0112:06:38 PM | 71.712 | 151.588 | 31.55 | 74.75 |
| 2016-03-0112:06:42 PM | 71.712 | 151.588 | 31.775 | 74.75 |
| 2016-03-0112:06:46 PM | 71.712 | 151.475 | 31.888 | 74.75 |
| 2016-03-0112:06:50 PM | 71.712 | 151.588 | 32 | 74.75 |
| 2016-03-0112:06:54 PM | 71.712 | 151.588 | 31.888 | 74.638 |
| 2016-03-0112:06:58 PM | 71.488 | 151.7 | 31.888 | 74.75 |
| 2016-03-0112:07:02 PM | 71.488 | 151.7 | 31.888 | 74.75 |
| 2016-03-0112:07:06 PM | 71.488 | 151.7 | 31.888 | 74.75 |
| 2016-03-0112:07:11 PM | 71.262 | 151.7 | 31.888 | 74.75 |
| 2016-03-0112:07:15 PM | 71.262 | 151.7 | 31.775 | 74.75 |
| 2016-03-0112:07:19 PM | 71.15 | 151.588 | 31.775 | 74.75 |
| 2016-03-0112:07:23 PM | 71.038 | 151.588 | 31.888 | 74.638 |
| 2016-03-0112:07:27 PM | 71.038 | 151.475 | 32 | 74.638 |
| 2016-03-0112:07:31 PM | 70.925 | 151.362 | 32 | 74.638 |
| 2016-03-0112:07:35 PM | 70.925 | 151.362 | 31.775 | 74.638 |
| 2016-03-0112:07:39 PM | 70.925 | 151.25 | 31.662 | 74.638 |
| 2016-03-0112:07:43 PM | 70.812 | 151.25 | 31.662 | 74.638 |
| 2016-03-0112:07:47 PM | 70.7 | 151.362 | 31.55 | 74.638 |
| 2016-03-0112:07:51 PM | 70.7 | 151.362 | 31.438 | 74.638 |
| 2016-03-0112:07:55 PM | 70.588 | 151.25 | 31.1 | 74.638 |
| 2016-03-0112:07:59 PM | 70.588 | 151.25 | 30.65 | 74.638 |
| 2016-03-0112:08:03 PM | 70.475 | 151.25 | 30.425 | 74.638 |
| 2016-03-0112:08:07 PM | 70.475 | 151.25 | 30.425 | 74.525 |
| 2016-03-0112:08:11 PM | 70.362 | 151.138 | 30.425 | 74.525 |
| 2016-03-0112:08:15 PM | 70.362 | 151.138 | 30.312 | 74.525 |
| 2016-03-0112:08:20 PM | 70.362 | 151.025 | 30.425 | 74.525 |
| 2016-03-0112:08:24 PM | 70.25 | 151.138 | 30.65 | 74.525 |
| 2016-03-0112:08:28 PM | 70.25 | 151.138 | 30.875 | 74.525 |
| 2016-03-0112:08:32 PM | 70.138 | 151.025 | 30.875 | 74.638 |
| 2016-03-0112:08:36 PM | 70.138 | 151.025 | 30.762 | 74.638 |
| 2016-03-0112:08:40 PM | 70.138 | 151.025 | 30.762 | 74.638 |
| 2016-03-0112:08:44 PM | 70.025 | 151.138 | 30.988 | 74.638 |
| 2016-03-0112:08:48 PM | 70.025 | 151.138 | 31.212 | 74.638 |
| 2016-03-0112:08:52 PM | 70.025 | 151.138 | 31.212 | 74.525 |
| 2016-03-0112:08:56 PM | 70.025 | 151.138 | 31.325 | 74.525 |
| 2016-03-0112:09:00 PM | 69.912 | 151.25 | 31.438 | 74.525 |
| 2016-03-0112:09:04 PM | 69.912 | 151.25 | 31.662 | 74.525 |
| 2016-03-0112:09:08 PM | 69.912 | 151.362 | 31.775 | 74.525 |
| 2016-03-0112:09:12 PM | 69.912 | 151.362 | 31.888 | 74.525 |
| 2016-03-0112:09:16 PM | 69.8 | 151.362 | 32 | 74.525 |
| 2016-03-0112:09:20 PM | 69.8 | 151.362 | 32 | 74.525 |
| 2016-03-0112:09:24 PM | 69.8 | 151.362 | 32.112 | 74.525 |
| 2016-03-0112:09:28 PM | 69.8 | 151.362 | 32 | 74.525 |
| 2016-03-0112:09:32 PM | 69.8 | 151.362 | 31.888 | 74.525 |
| 2016-03-0112:09:36 PM | 69.688 | 151.25 | 31.775 | 74.525 |
| 2016-03-0112:09:40 PM | 69.688 | 151.25 | 31.775 | 74.525 |
| 2016-03-0112:09:44 PM | 69.575 | 151.25 | 31.775 | 74.412 |
| 2016-03-0112:09:48 PM | 69.575 | 151.138 | 31.775 | 74.525 |
| 2016-03-0112:09:53 PM | 69.575 | 151.138 | 31.55 | 74.412 |
| 2016-03-0112:09:57 PM | 69.575 | 151.138 | 31.55 | 74.525 |
| 2016-03-0112:10:01 PM | 69.575 | 151.138 | 31.662 | 74.412 |
| 2016-03-0112:10:05 PM | 69.462 | 151.138 | 31.662 | 74.525 |
| 2016-03-0112:10:09 PM | 69.462 | 151.138 | 31.775 | 74.412 |
| 2016-03-0112:10:13 PM | 69.462 | 151.138 | 31.888 | 74.525 |
| 2016-03-0112:10:17 PM | 69.462 | 151.138 | 32 | 74.525 |
| 2016-03-0112:10:21 PM | 69.462 | 151.138 | 32 | 74.525 |
| 2016-03-0112:10:25 PM | 69.462 | 151.138 | 32 | 74.525 |
| 2016-03-0112:10:29 PM | 69.462 | 151.138 | 31.888 | 74.525 |
| 2016-03-0112:10:33 PM | 69.575 | 151.138 | 31.55 | 74.525 |
| 2016-03-0112:10:37 PM | 69.462 | 151.138 | 31.438 | 74.412 |
| 2016-03-0112:10:41 PM | 69.462 | 151.25 | 31.325 | 74.525 |
| 2016-03-0112:10:45 PM | 69.462 | 151.362 | 31.212 | 74.412 |
| 2016-03-0112:10:49 PM | 69.462 | 151.25 | 31.1 | 74.525 |
| 2016-03-0112:10:53 PM | 69.462 | 151.25 | 31.1 | 74.412 |
| 2016-03-0112:10:57 PM | 69.462 | 151.25 | 31.212 | 74.412 |
| 2016-03-0112:11:01 PM | 69.462 | 151.25 | 31.325 | 74.525 |
| 2016-03-0112:11:05 PM | 69.35 | 151.25 | 31.325 | 74.525 |
| 2016-03-0112:11:09 PM | 69.462 | 151.25 | 31.212 | 74.525 |
| 2016-03-0112:11:13 PM | 69.462 | 151.362 | 31.1 | 74.525 |
| 2016-03-0112:11:18 PM | 69.35 | 151.362 | 31.212 | 74.525 |
| 2016-03-0112:11:22 PM | 69.35 | 151.362 | 31.438 | 74.525 |
| 2016-03-0112:11:26 PM | 69.35 | 151.475 | 31.438 | 74.525 |
| 2016-03-0112:11:30 PM | 69.35 | 151.475 | 31.438 | 74.525 |
| 2016-03-0112:11:34 PM | 69.238 | 151.588 | 31.438 | 74.525 |
| 2016-03-0112:11:38 PM | 69.238 | 151.588 | 31.55 | 74.525 |
| 2016-03-0112:11:42 PM | 69.35 | 151.588 | 31.662 | 74.525 |
| 2016-03-0112:11:46 PM | 69.238 | 151.588 | 31.888 | 74.525 |
| 2016-03-0112:11:50 PM | 69.238 | 151.475 | 31.888 | 74.525 |
| 2016-03-0112:11:54 PM | 69.238 | 151.475 | 32.112 | 74.525 |
| 2016-03-0112:11:58 PM | 69.238 | 151.475 | 32.112 | 74.638 |
| 2016-03-0112:12:02 PM | 69.238 | 151.475 | 32 | 74.638 |
| 2016-03-0112:12:06 PM | 69.125 | 151.475 | 31.775 | 74.638 |
| 2016-03-0112:12:10 PM | 69.238 | 151.475 | 31.662 | 74.638 |
| 2016-03-0112:12:14 PM | 69.238 | 151.475 | 31.662 | 74.638 |
| 2016-03-0112:12:18 PM | 69.125 | 151.475 | 31.775 | 74.638 |
| 2016-03-0112:12:22 PM | 69.125 | 151.475 | 31.775 | 74.638 |
| 2016-03-0112:12:26 PM | 69.125 | 151.475 | 31.775 | 74.638 |
| 2016-03-0112:12:30 PM | 69.125 | 151.475 | 31.775 | 74.638 |
| 2016-03-0112:12:34 PM | 69.125 | 151.475 | 31.775 | 74.638 |
| 2016-03-0112:12:38 PM | 69.125 | 151.475 | 31.662 | 74.638 |
| 2016-03-0112:12:42 PM | 69.125 | 151.475 | 31.662 | 74.75 |
| 2016-03-0112:12:46 PM | 69.125 | 151.475 | 31.662 | 74.638 |
| 2016-03-0112:12:51 PM | 69.012 | 151.588 | 31.775 | 74.638 |
| 2016-03-0112:12:55 PM | 69.012 | 151.7 | 31.775 | 74.75 |
| 2016-03-0112:12:59 PM | 69.012 | 151.812 | 31.888 | 74.638 |
| 2016-03-0112:13:03 PM | 69.012 | 151.812 | 31.662 | 74.75 |
| 2016-03-0112:13:07 PM | 69.012 | 151.812 | 31.662 | 74.638 |
| 2016-03-0112:13:11 PM | 69.012 | 151.925 | 31.775 | 74.638 |
| 2016-03-0112:13:15 PM | 69.012 | 151.925 | 31.775 | 74.75 |
| 2016-03-0112:13:19 PM | 69.125 | 151.812 | 31.775 | 74.75 |
| 2016-03-0112:13:23 PM | 69.125 | 151.7 | 31.888 | 74.638 |
| 2016-03-0112:13:27 PM | 69.125 | 151.7 | 32.112 | 74.75 |
| 2016-03-0112:13:31 PM | 69.125 | 151.588 | 32.112 | 74.75 |
| 2016-03-0112:13:35 PM | 69.238 | 151.588 | 32.112 | 74.75 |
| 2016-03-0112:13:39 PM | 69.238 | 151.588 | 32 | 74.75 |
| 2016-03-0112:13:43 PM | 69.35 | 151.588 | 32.112 | 74.75 |
| 2016-03-0112:13:47 PM | 69.35 | 151.588 | 32.225 | 74.75 |
| 2016-03-0112:13:51 PM | 69.35 | 151.588 | 32.225 | 74.75 |
| 2016-03-0112:13:55 PM | 69.35 | 151.588 | 32.225 | 74.75 |
| 2016-03-0112:13:59 PM | 69.35 | 151.588 | 32.225 | 74.75 |
| 2016-03-0112:14:03 PM | 69.462 | 151.588 | 32.338 | 74.75 |
| 2016-03-0112:14:07 PM | 69.462 | 151.588 | 32.225 | 74.75 |
| 2016-03-0112:14:12 PM | 69.462 | 151.588 | 32.225 | 74.75 |
| 2016-03-0112:14:16 PM | 69.462 | 151.588 | 32.225 | 74.75 |
| 2016-03-0112:14:20 PM | 69.462 | 151.588 | 32.338 | 74.75 |
| 2016-03-0112:14:24 PM | 69.462 | 151.7 | 32.338 | 74.75 |
| 2016-03-0112:14:28 PM | 69.575 | 151.7 | 32.562 | 74.75 |
| 2016-03-0112:14:32 PM | 69.575 | 151.7 | 32.45 | 74.75 |
| 2016-03-0112:14:36 PM | 69.575 | 151.7 | 32.45 | 74.75 |
| 2016-03-0112:14:40 PM | 69.575 | 151.812 | 32.45 | 74.75 |
| 2016-03-0112:14:44 PM | 69.688 | 151.812 | 32.338 | 74.862 |
| 2016-03-0112:14:48 PM | 69.688 | 151.812 | 32.45 | 74.862 |
| 2016-03-0112:14:52 PM | 69.8 | 151.812 | 32.45 | 74.862 |
| 2016-03-0112:14:56 PM | 69.912 | 151.7 | 32.45 | 74.862 |
| 2016-03-0112:15:00 PM | 70.025 | 151.7 | 32.45 | 74.862 |
| 2016-03-0112:15:04 PM | 70.025 | 151.588 | 32.45 | 74.862 |
| 2016-03-0112:15:08 PM | 70.138 | 151.588 | 32.45 | 74.862 |
| 2016-03-0112:15:12 PM | 70.25 | 151.588 | 32.45 | 74.862 |
| 2016-03-0112:15:16 PM | 70.25 | 151.588 | 32.45 | 74.75 |
| 2016-03-0112:15:20 PM | 70.362 | 151.475 | 32.45 | 74.75 |
| 2016-03-0112:15:24 PM | 70.475 | 151.475 | 32.45 | 74.862 |
| 2016-03-0112:15:28 PM | 70.475 | 151.588 | 32.45 | 74.862 |
| 2016-03-0112:15:33 PM | 70.588 | 151.7 | 32.45 | 74.75 |
| 2016-03-0112:15:37 PM | 70.812 | 151.7 | 32.45 | 74.75 |
| 2016-03-0112:15:41 PM | 70.812 | 151.7 | 32.562 | 74.75 |
| 2016-03-0112:15:45 PM | 70.812 | 151.7 | 32.562 | 74.75 |
| 2016-03-0112:15:49 PM | 70.925 | 151.588 | 32.225 | 74.75 |
| 2016-03-0112:15:53 PM | 71.038 | 151.588 | 32 | 74.638 |
| 2016-03-0112:15:57 PM | 71.15 | 151.588 | 31.888 | 74.638 |
| 2016-03-0112:16:01 PM | 71.262 | 151.588 | 31.888 | 74.638 |
| 2016-03-0112:16:05 PM | 71.375 | 151.588 | 31.888 | 74.638 |
| 2016-03-0112:16:09 PM | 71.488 | 151.7 | 32.112 | 74.638 |
| 2016-03-0112:16:13 PM | 71.488 | 151.7 | 32.112 | 74.638 |
| 2016-03-0112:16:17 PM | 71.488 | 151.588 | 32.225 | 74.638 |
| 2016-03-0112:16:21 PM | 71.6 | 151.475 | 32.225 | 74.638 |
| 2016-03-0112:16:25 PM | 71.6 | 151.362 | 32.112 | 74.638 |
| 2016-03-0112:16:29 PM | 71.712 | 151.362 | 32.112 | 74.638 |
| 2016-03-0112:16:33 PM | 71.712 | 151.25 | 32 | 74.638 |
| 2016-03-0112:16:37 PM | 71.825 | 151.25 | 31.775 | 74.638 |
| 2016-03-0112:16:41 PM | 71.938 | 151.25 | 31.662 | 74.638 |
| 2016-03-0112:16:45 PM | 71.938 | 151.25 | 31.55 | 74.638 |
| 2016-03-0112:16:50 PM | 71.938 | 151.138 | 31.438 | 74.638 |
| 2016-03-0112:16:54 PM | 71.938 | 151.25 | 31.325 | 74.638 |
| 2016-03-0112:16:58 PM | 72.05 | 151.25 | 31.212 | 74.638 |
| 2016-03-0112:17:02 PM | 72.05 | 151.25 | 31.212 | 74.638 |
| 2016-03-0112:17:06 PM | 72.162 | 151.138 | 31.212 | 74.638 |
| 2016-03-0112:17:10 PM | 72.162 | 151.138 | 31.438 | 74.638 |
| 2016-03-0112:17:14 PM | 72.162 | 151.025 | 31.55 | 74.638 |
| 2016-03-0112:17:18 PM | 72.275 | 151.025 | 31.55 | 74.638 |
| 2016-03-0112:17:22 PM | 72.275 | 151.025 | 31.438 | 74.638 |
| 2016-03-0112:17:26 PM | 72.388 | 150.912 | 31.325 | 74.638 |
| 2016-03-0112:17:30 PM | 72.388 | 150.912 | 31.325 | 74.638 |
| 2016-03-0112:17:34 PM | 72.5 | 150.912 | 31.212 | 74.525 |
| 2016-03-0112:17:38 PM | 72.5 | 150.912 | 31.212 | 74.525 |
| 2016-03-0112:17:42 PM | 72.612 | 150.912 | 31.212 | 74.525 |
| 2016-03-0112:17:46 PM | 72.612 | 150.912 | 31.212 | 74.638 |
| 2016-03-0112:17:50 PM | 72.725 | 150.912 | 31.325 | 74.525 |
| 2016-03-0112:17:55 PM | 72.838 | 150.912 | 31.438 | 74.525 |
| 2016-03-0112:17:59 PM | 72.838 | 150.912 | 31.55 | 74.525 |
| 2016-03-0112:18:03 PM | 72.838 | 150.912 | 31.662 | 74.525 |
| 2016-03-0112:18:07 PM | 72.725 | 150.912 | 31.775 | 74.525 |
| 2016-03-0112:18:11 PM | 72.612 | 150.912 | 31.775 | 74.525 |
| 2016-03-0112:18:15 PM | 72.612 | 150.912 | 31.775 | 74.525 |
| 2016-03-0112:18:19 PM | 72.5 | 151.025 | 31.662 | 74.638 |
| 2016-03-0112:18:23 PM | 72.388 | 151.025 | 31.55 | 74.638 |
| 2016-03-0112:18:27 PM | 72.275 | 151.025 | 31.55 | 74.525 |
| 2016-03-0112:18:31 PM | 72.162 | 151.025 | 31.662 | 74.525 |
| 2016-03-0112:18:35 PM | 72.05 | 151.025 | 31.662 | 74.525 |
| 2016-03-0112:18:39 PM | 71.938 | 151.025 | 31.662 | 74.525 |
| 2016-03-0112:18:43 PM | 71.825 | 151.025 | 31.662 | 74.525 |
| 2016-03-0112:18:47 PM | 71.825 | 151.025 | 31.662 | 74.525 |
| 2016-03-0112:18:51 PM | 71.712 | 151.025 | 31.662 | 74.525 |
| 2016-03-0112:18:55 PM | 71.712 | 151.025 | 31.55 | 74.525 |
| 2016-03-0112:19:00 PM | 71.6 | 151.138 | 31.438 | 74.638 |
| 2016-03-0112:19:04 PM | 71.6 | 151.138 | 31.438 | 74.638 |
| 2016-03-0112:19:08 PM | 71.488 | 151.138 | 31.212 | 74.638 |
| 2016-03-0112:19:12 PM | 71.488 | 151.138 | 31.1 | 74.525 |
| 2016-03-0112:19:16 PM | 71.488 | 151.138 | 31.325 | 74.525 |
| 2016-03-0112:19:20 PM | 71.488 | 151.138 | 31.438 | 74.525 |
| 2016-03-0112:19:24 PM | 71.488 | 151.138 | 31.55 | 74.525 |
| 2016-03-0112:19:28 PM | 71.6 | 151.25 | 31.662 | 74.525 |
| 2016-03-0112:19:32 PM | 71.6 | 151.25 | 31.775 | 74.525 |
| 2016-03-0112:19:36 PM | 71.488 | 151.362 | 31.888 | 74.525 |
| 2016-03-0112:19:40 PM | 71.488 | 151.25 | 32 | 74.525 |
| 2016-03-0112:19:44 PM | 71.375 | 151.25 | 32 | 74.525 |
| 2016-03-0112:19:48 PM | 71.375 | 151.25 | 32 | 74.525 |
| 2016-03-0112:19:52 PM | 71.262 | 151.25 | 32.112 | 74.525 |
| 2016-03-0112:19:56 PM | 71.262 | 151.138 | 32.112 | 74.525 |
| 2016-03-0112:20:01 PM | 71.15 | 151.138 | 32.112 | 74.525 |
| 2016-03-0112:20:05 PM | 71.15 | 151.138 | 32 | 74.525 |
| 2016-03-0112:20:09 PM | 71.038 | 151.138 | 31.888 | 74.525 |
| 2016-03-0112:20:13 PM | 71.038 | 151.138 | 31.55 | 74.525 |
| 2016-03-0112:20:17 PM | 70.925 | 151.138 | 31.212 | 74.525 |
| 2016-03-0112:20:21 PM | 70.925 | 151.138 | 30.988 | 74.525 |
| 2016-03-0112:20:25 PM | 70.812 | 151.138 | 30.762 | 74.638 |
| 2016-03-0112:20:29 PM | 70.812 | 151.138 | 30.762 | 74.525 |
| 2016-03-0112:20:33 PM | 70.7 | 151.138 | 30.875 | 74.525 |
| 2016-03-0112:20:37 PM | 70.7 | 151.138 | 30.988 | 74.525 |
| 2016-03-0112:20:41 PM | 70.588 | 151.25 | 31.1 | 74.525 |
| 2016-03-0112:20:45 PM | 70.588 | 151.25 | 31.212 | 74.525 |
| 2016-03-0112:20:49 PM | 70.588 | 151.25 | 31.325 | 74.525 |
| 2016-03-0112:20:53 PM | 70.475 | 151.138 | 31.55 | 74.525 |
| 2016-03-0112:20:57 PM | 70.475 | 151.138 | 31.662 | 74.525 |
| 2016-03-0112:21:01 PM | 70.362 | 151.138 | 31.775 | 74.525 |
| 2016-03-0112:21:06 PM | 70.362 | 151.138 | 31.775 | 74.525 |
| 2016-03-0112:21:10 PM | 70.25 | 151.25 | 31.888 | 74.412 |
| 2016-03-0112:21:14 PM | 70.25 | 151.25 | 32 | 74.412 |
| 2016-03-0112:21:18 PM | 70.138 | 151.25 | 32.112 | 74.412 |
| 2016-03-0112:21:22 PM | 70.138 | 151.362 | 32.225 | 74.412 |
| 2016-03-0112:21:26 PM | 70.025 | 151.362 | 32.225 | 74.412 |
| 2016-03-0112:21:30 PM | 70.025 | 151.362 | 32.338 | 74.412 |
| 2016-03-0112:21:34 PM | 70.025 | 151.362 | 32.338 | 74.412 |
| 2016-03-0112:21:38 PM | 70.025 | 151.25 | 32.45 | 74.412 |
| 2016-03-0112:21:42 PM | 69.912 | 151.25 | 32.562 | 74.412 |
| 2016-03-0112:21:46 PM | 69.912 | 151.362 | 32.562 | 74.412 |
| 2016-03-0112:21:50 PM | 69.912 | 151.362 | 32.675 | 74.412 |
| 2016-03-0112:21:54 PM | 70.025 | 151.362 | 32.675 | 74.412 |
| 2016-03-0112:21:58 PM | 69.912 | 151.362 | 32.788 | 74.412 |
| 2016-03-0112:22:02 PM | 69.912 | 151.362 | 32.788 | 74.525 |
| 2016-03-0112:22:06 PM | 69.8 | 151.25 | 33.012 | 74.525 |
| 2016-03-0112:22:10 PM | 69.8 | 151.362 | 33.125 | 74.525 |
| 2016-03-0112:22:14 PM | 69.8 | 151.475 | 33.238 | 74.525 |
| 2016-03-0112:22:18 PM | 69.8 | 151.475 | 33.35 | 74.525 |
| 2016-03-0112:22:23 PM | 69.8 | 151.475 | 33.35 | 74.525 |
| 2016-03-0112:22:27 PM | 69.8 | 151.475 | 33.462 | 74.525 |
| 2016-03-0112:22:31 PM | 69.8 | 151.475 | 33.575 | 74.525 |
| 2016-03-0112:22:35 PM | 69.8 | 151.588 | 33.462 | 74.525 |
| 2016-03-0112:22:39 PM | 69.912 | 151.588 | 33.462 | 74.638 |
| 2016-03-0112:22:43 PM | 69.912 | 151.475 | 33.238 | 74.638 |
| 2016-03-0112:22:47 PM | 69.912 | 151.475 | 33.238 | 74.638 |
| 2016-03-0112:22:51 PM | 69.912 | 151.588 | 33.238 | 74.638 |
| 2016-03-0112:22:55 PM | 69.912 | 151.475 | 33.35 | 74.638 |
| 2016-03-0112:22:59 PM | 69.912 | 151.475 | 33.462 | 74.638 |
| 2016-03-0112:23:03 PM | 69.912 | 151.475 | 33.575 | 74.638 |
| 2016-03-0112:23:07 PM | 69.912 | 151.475 | 33.575 | 74.638 |
| 2016-03-0112:23:11 PM | 69.912 | 151.475 | 33.688 | 74.75 |
| 2016-03-0112:23:15 PM | 69.912 | 151.362 | 33.688 | 74.638 |
| 2016-03-0112:23:19 PM | 69.8 | 151.475 | 33.8 | 74.638 |
| 2016-03-0112:23:23 PM | 69.8 | 151.475 | 33.912 | 74.75 |
| 2016-03-0112:23:27 PM | 69.8 | 151.475 | 34.025 | 74.75 |
| 2016-03-0112:23:32 PM | 69.8 | 151.588 | 34.025 | 74.75 |
| 2016-03-0112:23:36 PM | 69.8 | 151.588 | 34.25 | 74.75 |
| 2016-03-0112:23:40 PM | 69.688 | 151.588 | 34.362 | 74.75 |
| 2016-03-0112:23:44 PM | 69.688 | 151.475 | 34.362 | 74.75 |
| 2016-03-0112:23:48 PM | 69.688 | 151.588 | 33.912 | 74.638 |
| 2016-03-0112:23:52 PM | 69.688 | 151.588 | 33.688 | 74.75 |
| 2016-03-0112:23:56 PM | 69.688 | 151.7 | 33.575 | 74.75 |
| 2016-03-0112:24:00 PM | 69.688 | 151.7 | 33.462 | 74.75 |
| 2016-03-0112:24:04 PM | 69.575 | 151.7 | 33.462 | 74.75 |
| 2016-03-0112:24:08 PM | 69.688 | 151.812 | 33.575 | 74.75 |
| 2016-03-0112:24:12 PM | 69.688 | 151.812 | 33.575 | 74.75 |
| 2016-03-0112:24:16 PM | 69.575 | 151.812 | 33.8 | 74.75 |
| 2016-03-0112:24:20 PM | 69.575 | 151.812 | 33.8 | 74.75 |
| 2016-03-0112:24:24 PM | 69.575 | 151.925 | 33.912 | 74.75 |
| 2016-03-0112:24:28 PM | 69.462 | 151.812 | 34.025 | 74.75 |
| 2016-03-0112:24:33 PM | 69.575 | 151.925 | 34.138 | 74.75 |
| 2016-03-0112:24:37 PM | 69.462 | 152.038 | 34.25 | 74.75 |
| 2016-03-0112:24:41 PM | 69.575 | 152.038 | 34.362 | 74.75 |
| 2016-03-0112:24:45 PM | 69.462 | 152.15 | 34.475 | 74.75 |
| 2016-03-0112:24:49 PM | 69.462 | 152.15 | 34.588 | 74.75 |
| 2016-03-0112:24:53 PM | 69.462 | 152.15 | 34.7 | 74.75 |
| 2016-03-0112:24:57 PM | 69.462 | 152.263 | 34.7 | 74.75 |
| 2016-03-0112:25:01 PM | 69.35 | 152.263 | 34.7 | 74.75 |
| 2016-03-0112:25:05 PM | 69.462 | 152.263 | 34.362 | 74.75 |
| 2016-03-0112:25:09 PM | 69.35 | 152.263 | 34.138 | 74.75 |
| 2016-03-0112:25:13 PM | 69.35 | 152.263 | 34.025 | 74.75 |
| 2016-03-0112:25:17 PM | 69.35 | 152.263 | 34.025 | 74.75 |
| 2016-03-0112:25:21 PM | 69.35 | 152.375 | 33.912 | 74.75 |
| 2016-03-0112:25:25 PM | 69.35 | 152.375 | 33.8 | 74.75 |
| 2016-03-0112:25:29 PM | 69.238 | 152.375 | 33.8 | 74.75 |
| 2016-03-0112:25:34 PM | 69.35 | 152.375 | 33.912 | 74.75 |
| 2016-03-0112:25:38 PM | 69.35 | 152.488 | 33.912 | 74.75 |
| 2016-03-0112:25:42 PM | 69.238 | 152.488 | 33.912 | 74.75 |
| 2016-03-0112:25:46 PM | 69.35 | 152.488 | 33.912 | 74.75 |
| 2016-03-0112:25:50 PM | 69.35 | 152.488 | 33.912 | 74.75 |
| 2016-03-0112:25:54 PM | 69.35 | 152.488 | 33.8 | 74.75 |
| 2016-03-0112:25:58 PM | 69.35 | 152.6 | 33.8 | 74.75 |
| 2016-03-0112:26:02 PM | 69.462 | 152.6 | 33.912 | 74.75 |
| 2016-03-0112:26:06 PM | 69.462 | 152.6 | 33.8 | 74.75 |
| 2016-03-0112:26:10 PM | 69.462 | 152.6 | 33.688 | 74.75 |
| 2016-03-0112:26:14 PM | 69.35 | 152.6 | 33.575 | 74.75 |
| 2016-03-0112:26:18 PM | 69.35 | 152.712 | 33.575 | 74.75 |
| 2016-03-0112:26:22 PM | 69.35 | 152.712 | 33.575 | 74.75 |
| 2016-03-0112:26:26 PM | 69.35 | 152.712 | 33.35 | 74.75 |
| 2016-03-0112:26:30 PM | 69.35 | 152.712 | 33.125 | 74.75 |
| 2016-03-0112:26:34 PM | 69.35 | 152.712 | 33.125 | 74.75 |
| 2016-03-0112:26:39 PM | 69.35 | 152.712 | 33.125 | 74.75 |
| 2016-03-0112:26:43 PM | 69.35 | 152.712 | 33.238 | 74.75 |
| 2016-03-0112:26:47 PM | 69.35 | 152.712 | 33.462 | 74.862 |
| 2016-03-0112:26:51 PM | 69.35 | 152.712 | 33.688 | 74.75 |
| 2016-03-0112:26:55 PM | 69.35 | 152.825 | 33.688 | 74.862 |
| 2016-03-0112:26:59 PM | 69.35 | 152.825 | 33.575 | 74.75 |
| 2016-03-0112:27:03 PM | 69.238 | 152.825 | 33.688 | 74.862 |
| 2016-03-0112:27:07 PM | 69.35 | 152.825 | 33.688 | 74.75 |
| 2016-03-0112:27:11 PM | 69.35 | 152.825 | 33.8 | 74.862 |
| 2016-03-0112:27:15 PM | 69.35 | 152.825 | 33.688 | 74.862 |
| 2016-03-0112:27:19 PM | 69.35 | 152.825 | 33.688 | 74.862 |
| 2016-03-0112:27:23 PM | 69.35 | 152.938 | 33.688 | 74.862 |
| 2016-03-0112:27:27 PM | 69.238 | 152.825 | 33.688 | 74.862 |
| 2016-03-0112:27:31 PM | 69.35 | 152.825 | 33.8 | 74.75 |
| 2016-03-0112:27:35 PM | 69.35 | 152.825 | 33.912 | 74.862 |
| 2016-03-0112:27:39 PM | 69.35 | 152.825 | 33.912 | 74.862 |
| 2016-03-0112:27:43 PM | 69.35 | 152.938 | 33.688 | 74.862 |
| 2016-03-0112:27:47 PM | 69.35 | 152.938 | 33.688 | 74.862 |
| 2016-03-0112:27:51 PM | 69.238 | 153.05 | 33.912 | 74.862 |
| 2016-03-0112:27:56 PM | 69.238 | 153.05 | 33.912 | 74.862 |
| 2016-03-0112:28:00 PM | 69.238 | 153.05 | 34.025 | 74.862 |
| 2016-03-0112:28:04 PM | 69.35 | 153.05 | 34.138 | 74.862 |
| 2016-03-0112:28:08 PM | 69.238 | 153.05 | 34.138 | 74.862 |
| 2016-03-0112:28:12 PM | 69.35 | 153.162 | 34.025 | 74.862 |
| 2016-03-0112:28:16 PM | 69.35 | 153.162 | 33.912 | 74.862 |
| 2016-03-0112:28:20 PM | 69.35 | 153.162 | 33.8 | 74.862 |
| 2016-03-0112:28:24 PM | 69.35 | 153.275 | 33.8 | 74.862 |
| 2016-03-0112:28:28 PM | 69.35 | 153.275 | 33.8 | 74.862 |
| 2016-03-0112:28:32 PM | 69.35 | 153.275 | 33.8 | 74.862 |
| 2016-03-0112:28:36 PM | 69.35 | 153.275 | 33.8 | 74.862 |
| 2016-03-0112:28:40 PM | 69.238 | 153.388 | 33.688 | 74.862 |
| 2016-03-0112:28:44 PM | 69.462 | 153.388 | 33.688 | 74.862 |
| 2016-03-0112:28:48 PM | 69.462 | 153.388 | 33.688 | 74.862 |
| 2016-03-0112:28:52 PM | 69.462 | 153.388 | 33.462 | 74.75 |
| 2016-03-0112:28:56 PM | 69.575 | 153.388 | 33.238 | 74.75 |
| 2016-03-0112:29:00 PM | 69.688 | 153.5 | 33.125 | 74.862 |
| 2016-03-0112:29:04 PM | 69.688 | 153.5 | 33.012 | 74.75 |
| 2016-03-0112:29:08 PM | 69.8 | 153.388 | 33.012 | 74.75 |
| 2016-03-0112:29:12 PM | 69.912 | 153.388 | 33.012 | 74.75 |
| 2016-03-0112:29:16 PM | 69.912 | 153.388 | 32.9 | 74.75 |
| 2016-03-0112:29:20 PM | 69.912 | 153.275 | 33.012 | 74.75 |
| 2016-03-0112:29:24 PM | 69.8 | 153.275 | 33.125 | 74.75 |
| 2016-03-0112:29:28 PM | 69.8 | 153.275 | 33.238 | 74.75 |
| 2016-03-0112:29:32 PM | 69.688 | 153.275 | 33.35 | 74.75 |
| 2016-03-0112:29:36 PM | 69.688 | 153.275 | 33.35 | 74.862 |
| 2016-03-0112:29:40 PM | 69.575 | 153.275 | 33.125 | 74.862 |
| 2016-03-0112:29:44 PM | 69.462 | 153.388 | 33.125 | 74.862 |
| 2016-03-0112:29:48 PM | 69.35 | 153.388 | 33.012 | 74.862 |
| 2016-03-0112:29:52 PM | 69.238 | 153.388 | 32.9 | 74.75 |
| 2016-03-0112:29:56 PM | 69.238 | 153.275 | 32.562 | 74.75 |
| 2016-03-0112:30:00 PM | 69.238 | 153.388 | 32.562 | 74.75 |
| 2016-03-0112:30:04 PM | 69.125 | 153.388 | 32.562 | 74.75 |
| 2016-03-0112:30:08 PM | 69.012 | 153.275 | 32.675 | 74.75 |
| 2016-03-0112:30:12 PM | 69.012 | 153.275 | 32.788 | 74.862 |
| 2016-03-0112:30:16 PM | 68.9 | 153.275 | 32.9 | 74.862 |
| 2016-03-0112:30:20 PM | 68.9 | 153.275 | 32.9 | 74.75 |
| 2016-03-0112:30:25 PM | 68.9 | 153.275 | 32.9 | 74.75 |
| 2016-03-0112:30:29 PM | 68.9 | 153.275 | 33.012 | 74.75 |
| 2016-03-0112:30:33 PM | 68.9 | 153.275 | 33.125 | 74.75 |
| 2016-03-0112:30:37 PM | 68.9 | 153.162 | 33.35 | 74.638 |
| 2016-03-0112:30:41 PM | 68.9 | 153.162 | 33.35 | 74.638 |
| 2016-03-0112:30:45 PM | 68.9 | 153.275 | 33.012 | 74.638 |
| 2016-03-0112:30:49 PM | 69.012 | 153.162 | 32.675 | 74.525 |
| 2016-03-0112:30:53 PM | 68.9 | 153.162 | 32.45 | 74.525 |
| 2016-03-0112:30:57 PM | 69.012 | 153.162 | 32.45 | 74.525 |
| 2016-03-0112:31:01 PM | 69.125 | 153.162 | 32.45 | 74.412 |
| 2016-03-0112:31:05 PM | 69.125 | 153.162 | 32.338 | 74.412 |
| 2016-03-0112:31:09 PM | 69.125 | 153.162 | 32.112 | 74.412 |
| 2016-03-0112:31:13 PM | 69.012 | 153.162 | 31.775 | 74.3 |
| 2016-03-0112:31:17 PM | 69.125 | 153.162 | 31.55 | 74.3 |
| 2016-03-0112:31:21 PM | 69.125 | 153.162 | 31.55 | 74.3 |
| 2016-03-0112:31:25 PM | 69.125 | 153.162 | 31.662 | 74.188 |
| 2016-03-0112:31:29 PM | 69.012 | 153.05 | 31.662 | 74.188 |
| 2016-03-0112:31:33 PM | 69.012 | 153.05 | 31.775 | 74.075 |
| 2016-03-0112:31:37 PM | 69.012 | 153.05 | 31.888 | 74.075 |
| 2016-03-0112:31:41 PM | 68.9 | 153.05 | 32.112 | 74.075 |
| 2016-03-0112:31:45 PM | 68.9 | 153.05 | 32.225 | 73.962 |
| 2016-03-0112:31:49 PM | 68.9 | 152.938 | 32.225 | 73.962 |
| 2016-03-0112:31:54 PM | 68.9 | 152.938 | 32.338 | 73.962 |
| 2016-03-0112:31:58 PM | 68.9 | 152.938 | 32.338 | 73.962 |
| 2016-03-0112:32:02 PM | 68.9 | 152.825 | 32.225 | 73.962 |
| 2016-03-0112:32:06 PM | 68.9 | 152.825 | 32.338 | 73.962 |
| 2016-03-0112:32:10 PM | 68.9 | 152.825 | 32.45 | 73.85 |
| 2016-03-0112:32:14 PM | 68.9 | 152.712 | 32.675 | 73.85 |
| 2016-03-0112:32:18 PM | 68.9 | 152.712 | 32.675 | 73.85 |
| 2016-03-0112:32:22 PM | 68.9 | 152.712 | 32.788 | 73.85 |
| 2016-03-0112:32:26 PM | 68.9 | 152.712 | 32.675 | 73.85 |
| 2016-03-0112:32:30 PM | 68.9 | 152.712 | 32.675 | 73.85 |
| 2016-03-0112:32:34 PM | 68.9 | 152.712 | 32.675 | 73.85 |
| 2016-03-0112:32:38 PM | 68.9 | 152.6 | 32.45 | 73.738 |
| 2016-03-0112:32:42 PM | 68.9 | 152.6 | 32.225 | 73.738 |
| 2016-03-0112:32:46 PM | 68.9 | 152.6 | 32.112 | 73.85 |
| 2016-03-0112:32:50 PM | 68.788 | 152.6 | 31.888 | 73.85 |
| 2016-03-0112:32:54 PM | 68.788 | 152.6 | 31.888 | 73.738 |
| 2016-03-0112:32:58 PM | 68.788 | 152.6 | 31.775 | 73.738 |
| 2016-03-0112:33:02 PM | 68.9 | 152.6 | 31.662 | 73.738 |
| 2016-03-0112:33:06 PM | 68.9 | 152.6 | 31.662 | 73.738 |
| 2016-03-0112:33:10 PM | 68.9 | 152.488 | 31.55 | 73.738 |
| 2016-03-0112:33:14 PM | 68.9 | 152.488 | 31.55 | 73.738 |
| 2016-03-0112:33:18 PM | 68.9 | 152.488 | 31.662 | 73.738 |
| 2016-03-0112:33:22 PM | 68.9 | 152.6 | 31.662 | 73.738 |
| 2016-03-0112:33:26 PM | 68.9 | 152.488 | 31.775 | 73.738 |
| 2016-03-0112:33:30 PM | 68.9 | 152.488 | 31.888 | 73.738 |
| 2016-03-0112:33:34 PM | 68.9 | 152.488 | 32.225 | 73.738 |
| 2016-03-0112:33:38 PM | 68.9 | 152.375 | 32.112 | 73.738 |
| 2016-03-0112:33:42 PM | 68.9 | 152.375 | 32 | 73.738 |
| 2016-03-0112:33:46 PM | 68.9 | 152.263 | 32.112 | 73.738 |
| 2016-03-0112:33:50 PM | 68.788 | 152.263 | 32.112 | 73.738 |
| 2016-03-0112:33:54 PM | 68.788 | 152.263 | 32.112 | 73.738 |
| 2016-03-0112:33:58 PM | 68.788 | 152.375 | 32.112 | 73.738 |
| 2016-03-0112:34:02 PM | 68.9 | 152.375 | 31.888 | 73.738 |
| 2016-03-0112:34:06 PM | 68.788 | 152.488 | 31.775 | 73.738 |
| 2016-03-0112:34:10 PM | 68.788 | 152.488 | 31.662 | 73.738 |
| 2016-03-0112:34:14 PM | 68.9 | 152.488 | 31.662 | 73.738 |
| 2016-03-0112:34:19 PM | 68.9 | 152.375 | 31.55 | 73.625 |
| 2016-03-0112:34:23 PM | 68.9 | 152.375 | 31.325 | 73.625 |
| 2016-03-0112:34:27 PM | 68.9 | 152.375 | 31.1 | 73.625 |
| 2016-03-0112:34:31 PM | 68.9 | 152.263 | 30.875 | 73.625 |
| 2016-03-0112:34:35 PM | 68.9 | 152.263 | 30.762 | 73.625 |
| 2016-03-0112:34:39 PM | 69.012 | 152.263 | 30.65 | 73.625 |
| 2016-03-0112:34:43 PM | 68.9 | 152.15 | 30.538 | 73.625 |
| 2016-03-0112:34:47 PM | 68.9 | 152.15 | 30.65 | 73.625 |
| 2016-03-0112:34:51 PM | 68.788 | 152.038 | 30.875 | 73.625 |
| 2016-03-0112:34:55 PM | 68.788 | 152.038 | 30.875 | 73.625 |
| 2016-03-0112:34:59 PM | 68.788 | 152.038 | 30.875 | 73.512 |
| 2016-03-0112:35:03 PM | 68.675 | 152.038 | 30.875 | 73.625 |
| 2016-03-0112:35:07 PM | 68.675 | 152.038 | 30.988 | 73.625 |
| 2016-03-0112:35:11 PM | 68.562 | 151.925 | 31.1 | 73.625 |
| 2016-03-0112:35:15 PM | 68.338 | 151.925 | 31.1 | 73.625 |
| 2016-03-0112:35:19 PM | 68.225 | 151.925 | 31.212 | 73.625 |
| 2016-03-0112:35:23 PM | 68.225 | 151.925 | 31.212 | 73.625 |
| 2016-03-0112:35:27 PM | 68.225 | 151.925 | 31.438 | 73.625 |
| 2016-03-0112:35:32 PM | 68.112 | 151.812 | 31.438 | 73.625 |
| 2016-03-0112:35:36 PM | 68.112 | 151.812 | 31.775 | 73.625 |
| 2016-03-0112:35:40 PM | 68.112 | 151.812 | 31.888 | 73.625 |
| 2016-03-0112:35:44 PM | 68.225 | 151.7 | 32 | 73.625 |
| 2016-03-0112:35:48 PM | 68.112 | 151.812 | 32 | 73.625 |
| 2016-03-0112:35:52 PM | 68.112 | 151.7 | 32 | 73.625 |
| 2016-03-0112:35:56 PM | 68.112 | 151.812 | 32.112 | 73.625 |
| 2016-03-0112:36:00 PM | 68.112 | 151.812 | 32.225 | 73.625 |
| 2016-03-0112:36:04 PM | 68.112 | 151.812 | 32.225 | 73.625 |
| 2016-03-0112:36:08 PM | 68.112 | 151.812 | 32.338 | 73.625 |
| 2016-03-0112:36:12 PM | 68.112 | 151.812 | 32.45 | 73.625 |
| 2016-03-0112:36:16 PM | 68.112 | 151.812 | 32.45 | 73.625 |
| 2016-03-0112:36:20 PM | 68.112 | 151.812 | 32.45 | 73.625 |
| 2016-03-0112:36:24 PM | 68 | 151.925 | 32.45 | 73.625 |
| 2016-03-0112:36:28 PM | 68.112 | 151.925 | 32.562 | 73.512 |
| 2016-03-0112:36:32 PM | 68.112 | 151.925 | 32.675 | 73.512 |
| 2016-03-0112:36:36 PM | 68 | 152.038 | 32.788 | 73.512 |
| 2016-03-0112:36:40 PM | 68 | 152.038 | 32.9 | 73.4 |
| 2016-03-0112:36:45 PM | 68 | 152.038 | 32.9 | 73.4 |
| 2016-03-0112:36:49 PM | 68 | 152.038 | 32.788 | 73.288 |
| 2016-03-0112:36:53 PM | 68 | 152.038 | 32.9 | 73.288 |
| 2016-03-0112:36:57 PM | 68 | 152.038 | 33.012 | 73.175 |
| 2016-03-0112:37:01 PM | 68.112 | 152.038 | 33.125 | 73.175 |
| 2016-03-0112:37:05 PM | 68 | 152.038 | 33.238 | 73.062 |
| 2016-03-0112:37:09 PM | 68.112 | 152.15 | 33.35 | 73.062 |
| 2016-03-0112:37:13 PM | 68 | 152.15 | 33.35 | 73.062 |
| 2016-03-0112:37:17 PM | 68.112 | 152.038 | 33.575 | 73.062 |
| 2016-03-0112:37:21 PM | 68.112 | 152.038 | 33.575 | 73.062 |
| 2016-03-0112:37:25 PM | 68.112 | 152.038 | 33.462 | 73.062 |
| 2016-03-0112:37:29 PM | 68.112 | 152.15 | 33.35 | 73.062 |
| 2016-03-0112:37:33 PM | 68.112 | 152.15 | 33.462 | 72.95 |
| 2016-03-0112:37:37 PM | 68.112 | 152.15 | 33.462 | 72.95 |
| 2016-03-0112:37:41 PM | 68.112 | 152.15 | 33.462 | 72.95 |
| 2016-03-0112:37:45 PM | 68.112 | 152.15 | 33.462 | 72.95 |
| 2016-03-0112:37:49 PM | 68.112 | 152.15 | 33.462 | 72.95 |
| 2016-03-0112:37:53 PM | 68.112 | 152.038 | 33.125 | 72.95 |
| 2016-03-0112:37:57 PM | 68.112 | 152.038 | 32.788 | 73.062 |
| 2016-03-0112:38:01 PM | 68.112 | 152.038 | 32.45 | 73.062 |
| 2016-03-0112:38:05 PM | 68.112 | 152.15 | 32.45 | 72.95 |
| 2016-03-0112:38:09 PM | 68.112 | 152.15 | 32.562 | 72.95 |
| 2016-03-0112:38:13 PM | 68.112 | 152.15 | 32.45 | 72.95 |
| 2016-03-0112:38:17 PM | 68.112 | 152.15 | 32.338 | 73.062 |
| 2016-03-0112:38:21 PM | 68.112 | 152.038 | 32.45 | 72.95 |
| 2016-03-0112:38:26 PM | 68.225 | 152.038 | 32.338 | 72.95 |
| 2016-03-0112:38:30 PM | 68.225 | 151.925 | 32.338 | 72.95 |
| 2016-03-0112:38:34 PM | 68.225 | 151.925 | 32.338 | 72.95 |
| 2016-03-0112:38:38 PM | 68.225 | 151.812 | 32.45 | 72.95 |
| 2016-03-0112:38:42 PM | 68.225 | 151.812 | 32.562 | 73.062 |
| 2016-03-0112:38:46 PM | 68.225 | 151.812 | 32.675 | 72.95 |
| 2016-03-0112:38:50 PM | 68.225 | 151.812 | 32.788 | 73.062 |
| 2016-03-0112:38:54 PM | 68.225 | 151.7 | 32.788 | 73.062 |
| 2016-03-0112:38:58 PM | 68.225 | 151.7 | 32.9 | 73.062 |
| 2016-03-0112:39:02 PM | 68.225 | 151.7 | 32.9 | 73.062 |
| 2016-03-0112:39:06 PM | 68.112 | 151.7 | 32.9 | 73.175 |
| 2016-03-0112:39:10 PM | 68.112 | 151.7 | 33.125 | 73.175 |
| 2016-03-0112:39:14 PM | 68.112 | 151.7 | 33.125 | 73.062 |
| 2016-03-0112:39:18 PM | 68.225 | 151.7 | 33.238 | 73.175 |
| 2016-03-0112:39:22 PM | 68.225 | 151.7 | 33.35 | 73.175 |
| 2016-03-0112:39:26 PM | 68.112 | 151.588 | 33.238 | 73.062 |
| 2016-03-0112:39:30 PM | 68.112 | 151.7 | 33.012 | 73.175 |
| 2016-03-0112:39:34 PM | 68.112 | 151.7 | 32.9 | 73.175 |
| 2016-03-0112:39:38 PM | 68.112 | 151.7 | 32.788 | 73.175 |
| 2016-03-0112:39:42 PM | 68.225 | 151.7 | 32.788 | 73.062 |
| 2016-03-0112:39:46 PM | 68.112 | 151.7 | 32.9 | 73.175 |
| 2016-03-0112:39:50 PM | 68.225 | 151.7 | 33.012 | 73.175 |
| 2016-03-0112:39:55 PM | 68.112 | 151.7 | 33.012 | 73.175 |
| 2016-03-0112:39:59 PM | 68.112 | 151.7 | 33.125 | 73.175 |
| 2016-03-0112:40:03 PM | 68.112 | 151.812 | 33.125 | 73.175 |
| 2016-03-0112:40:07 PM | 68.112 | 151.812 | 33.012 | 73.175 |
| 2016-03-0112:40:11 PM | 68.112 | 151.812 | 32.9 | 73.175 |
| 2016-03-0112:40:15 PM | 68.112 | 151.812 | 32.9 | 73.175 |
| 2016-03-0112:40:19 PM | 68.112 | 151.925 | 32.9 | 73.175 |
| 2016-03-0112:40:23 PM | 68 | 151.925 | 32.9 | 73.288 |
| 2016-03-0112:40:27 PM | 68.112 | 151.925 | 32.9 | 73.288 |
| 2016-03-0112:40:31 PM | 68 | 151.925 | 32.9 | 73.288 |
| 2016-03-0112:40:35 PM | 68 | 152.038 | 33.012 | 73.288 |
| 2016-03-0112:40:39 PM | 68 | 152.15 | 33.012 | 73.288 |
| 2016-03-0112:40:43 PM | 68 | 152.15 | 33.012 | 73.288 |
| 2016-03-0112:40:47 PM | 68 | 152.15 | 33.125 | 73.175 |
| 2016-03-0112:40:51 PM | 68 | 152.263 | 33.125 | 73.175 |
| 2016-03-0112:40:55 PM | 68 | 152.263 | 33.238 | 73.175 |
| 2016-03-0112:40:59 PM | 68 | 152.375 | 33.238 | 73.175 |
| 2016-03-0112:41:03 PM | 68 | 152.375 | 33.35 | 73.288 |
| 2016-03-0112:41:07 PM | 68 | 152.375 | 33.35 | 73.288 |
| 2016-03-0112:41:11 PM | 68 | 152.375 | 33.35 | 73.288 |
| 2016-03-0112:41:15 PM | 68 | 152.488 | 33.462 | 73.288 |
| 2016-03-0112:41:20 PM | 68 | 152.488 | 33.462 | 73.288 |
| 2016-03-0112:41:24 PM | 68.112 | 152.488 | 33.575 | 73.288 |
| 2016-03-0112:41:28 PM | 68 | 152.488 | 33.462 | 73.288 |
| 2016-03-0112:41:32 PM | 68 | 152.488 | 33.462 | 73.288 |
| 2016-03-0112:41:36 PM | 68.112 | 152.488 | 33.35 | 73.288 |
| 2016-03-0112:41:40 PM | 68.112 | 152.488 | 33.238 | 73.288 |
| 2016-03-0112:41:44 PM | 68.112 | 152.488 | 33.238 | 73.288 |
| 2016-03-0112:41:48 PM | 68.112 | 152.488 | 33.125 | 73.4 |
| 2016-03-0112:41:52 PM | 68.112 | 152.488 | 33.012 | 73.4 |
| 2016-03-0112:41:56 PM | 68.112 | 152.488 | 33.125 | 73.4 |
| 2016-03-0112:42:00 PM | 68.112 | 152.488 | 33.238 | 73.4 |
| 2016-03-0112:42:04 PM | 68.112 | 152.488 | 33.238 | 73.4 |
| 2016-03-0112:42:08 PM | 68.225 | 152.488 | 33.462 | 73.4 |
| 2016-03-0112:42:12 PM | 68.112 | 152.488 | 33.462 | 73.512 |
| 2016-03-0112:42:16 PM | 68.112 | 152.488 | 33.462 | 73.4 |
| 2016-03-0112:42:20 PM | 68.112 | 152.488 | 33.462 | 73.512 |
| 2016-03-0112:42:24 PM | 68.112 | 152.488 | 33.35 | 73.512 |
| 2016-03-0112:42:28 PM | 68.112 | 152.488 | 33.35 | 73.512 |
| 2016-03-0112:42:32 PM | 68.112 | 152.488 | 33.575 | 73.512 |
| 2016-03-0112:42:36 PM | 68.112 | 152.488 | 33.688 | 73.625 |
| 2016-03-0112:42:40 PM | 68.112 | 152.488 | 33.8 | 73.625 |
| 2016-03-0112:42:44 PM | 68.112 | 152.488 | 33.8 | 73.625 |
| 2016-03-0112:42:49 PM | 68.112 | 152.488 | 33.8 | 73.625 |
| 2016-03-0112:42:53 PM | 68.112 | 152.6 | 33.8 | 73.625 |
| 2016-03-0112:42:57 PM | 68.112 | 152.6 | 33.912 | 73.625 |
| 2016-03-0112:43:01 PM | 68.112 | 152.6 | 33.8 | 73.625 |
| 2016-03-0112:43:05 PM | 68.225 | 152.6 | 33.8 | 73.625 |
| 2016-03-0112:43:09 PM | 68.338 | 152.6 | 33.8 | 73.625 |
| 2016-03-0112:43:13 PM | 68.675 | 152.6 | 33.688 | 73.625 |
| 2016-03-0112:43:17 PM | 68.9 | 152.6 | 33.688 | 73.625 |
| 2016-03-0112:43:21 PM | 69.125 | 152.712 | 33.575 | 73.738 |
| 2016-03-0112:43:25 PM | 69.35 | 152.6 | 33.462 | 73.738 |
| 2016-03-0112:43:29 PM | 69.462 | 152.6 | 33.35 | 73.738 |
| 2016-03-0112:43:33 PM | 69.575 | 152.6 | 33.35 | 73.738 |
| 2016-03-0112:43:37 PM | 69.575 | 152.488 | 33.238 | 73.85 |
| 2016-03-0112:43:41 PM | 69.575 | 152.488 | 33.238 | 73.85 |
| 2016-03-0112:43:45 PM | 69.575 | 152.6 | 33.238 | 73.85 |
| 2016-03-0112:43:49 PM | 69.575 | 152.712 | 33.35 | 73.85 |
| 2016-03-0112:43:53 PM | 69.575 | 152.712 | 33.462 | 73.85 |
| 2016-03-0112:43:57 PM | 69.575 | 152.712 | 33.575 | 73.962 |
| 2016-03-0112:44:01 PM | 69.575 | 152.712 | 33.575 | 73.85 |
| 2016-03-0112:44:05 PM | 69.462 | 152.712 | 33.575 | 73.962 |
| 2016-03-0112:44:09 PM | 69.462 | 152.6 | 33.688 | 73.962 |
| 2016-03-0112:44:13 PM | 69.462 | 152.6 | 33.688 | 73.962 |
| 2016-03-0112:44:17 PM | 69.462 | 152.488 | 33.8 | 74.075 |
| 2016-03-0112:44:21 PM | 69.35 | 152.488 | 33.912 | 74.075 |
| 2016-03-0112:44:25 PM | 69.35 | 152.488 | 34.025 | 74.075 |
| 2016-03-0112:44:29 PM | 69.35 | 152.375 | 34.025 | 74.075 |
| 2016-03-0112:44:33 PM | 69.462 | 152.375 | 34.138 | 74.075 |
| 2016-03-0112:44:37 PM | 69.35 | 152.488 | 34.138 | 74.075 |
| 2016-03-0112:44:42 PM | 69.35 | 152.488 | 34.25 | 74.075 |
| 2016-03-0112:44:46 PM | 69.35 | 152.488 | 34.25 | 74.075 |
| 2016-03-0112:44:50 PM | 69.35 | 152.488 | 34.362 | 74.075 |
| 2016-03-0112:44:54 PM | 69.35 | 152.488 | 34.362 | 73.962 |
| 2016-03-0112:44:58 PM | 69.35 | 152.488 | 34.475 | 74.075 |
| 2016-03-0112:45:02 PM | 69.35 | 152.488 | 34.362 | 74.075 |
| 2016-03-0112:45:06 PM | 69.238 | 152.488 | 34.138 | 74.075 |
| 2016-03-0112:45:10 PM | 69.35 | 152.488 | 33.912 | 74.075 |
| 2016-03-0112:45:14 PM | 69.238 | 152.488 | 33.688 | 74.075 |
| 2016-03-0112:45:18 PM | 69.238 | 152.488 | 33.688 | 74.075 |
| 2016-03-0112:45:22 PM | 69.238 | 152.6 | 33.8 | 74.075 |
| 2016-03-0112:45:26 PM | 69.125 | 152.488 | 33.912 | 74.075 |
| 2016-03-0112:45:30 PM | 69.125 | 152.6 | 34.025 | 74.075 |
| 2016-03-0112:45:34 PM | 69.125 | 152.6 | 34.025 | 74.075 |
| 2016-03-0112:45:38 PM | 69.125 | 152.6 | 33.912 | 74.188 |
| 2016-03-0112:45:42 PM | 69.012 | 152.6 | 33.688 | 74.075 |
| 2016-03-0112:45:47 PM | 69.125 | 152.6 | 33.462 | 74.075 |
| 2016-03-0112:45:51 PM | 69.012 | 152.712 | 33.462 | 74.075 |
| 2016-03-0112:45:55 PM | 69.012 | 152.712 | 33.35 | 74.075 |
| 2016-03-0112:45:59 PM | 68.9 | 152.712 | 33.462 | 74.075 |
| 2016-03-0112:46:03 PM | 69.012 | 152.712 | 33.462 | 74.075 |
| 2016-03-0112:46:07 PM | 68.9 | 152.712 | 33.462 | 74.075 |
| 2016-03-0112:46:11 PM | 68.9 | 152.712 | 33.575 | 74.075 |
| 2016-03-0112:46:15 PM | 68.9 | 152.712 | 33.575 | 74.075 |
| 2016-03-0112:46:19 PM | 68.9 | 152.825 | 33.688 | 74.075 |
| 2016-03-0112:46:23 PM | 68.9 | 152.825 | 33.688 | 74.075 |
| 2016-03-0112:46:27 PM | 68.9 | 152.938 | 33.688 | 74.075 |
| 2016-03-0112:46:31 PM | 68.9 | 153.05 | 33.688 | 74.075 |
| 2016-03-0112:46:35 PM | 68.9 | 152.938 | 33.688 | 74.075 |
| 2016-03-0112:46:39 PM | 68.9 | 153.05 | 33.688 | 74.075 |
| 2016-03-0112:46:43 PM | 68.9 | 153.05 | 33.575 | 74.075 |
| 2016-03-0112:46:47 PM | 68.9 | 153.05 | 33.462 | 74.075 |
| 2016-03-0112:46:52 PM | 68.9 | 153.05 | 33.462 | 74.075 |
| 2016-03-0112:46:56 PM | 68.9 | 153.05 | 33.462 | 74.075 |
| 2016-03-0112:47:00 PM | 68.9 | 153.05 | 33.462 | 74.075 |
| 2016-03-0112:47:04 PM | 68.9 | 153.05 | 33.462 | 74.075 |
| 2016-03-0112:47:08 PM | 69.012 | 153.05 | 33.575 | 74.075 |
| 2016-03-0112:47:12 PM | 69.012 | 153.162 | 33.688 | 74.075 |
| 2016-03-0112:47:16 PM | 69.012 | 153.162 | 33.688 | 73.962 |
| 2016-03-0112:47:20 PM | 68.9 | 153.275 | 33.688 | 74.075 |
| 2016-03-0112:47:24 PM | 69.012 | 153.275 | 33.8 | 74.075 |
| 2016-03-0112:47:28 PM | 69.012 | 153.275 | 33.912 | 74.075 |
| 2016-03-0112:47:32 PM | 69.012 | 153.275 | 34.025 | 74.075 |
| 2016-03-0112:47:36 PM | 69.012 | 153.275 | 33.912 | 73.962 |
| 2016-03-0112:47:40 PM | 69.125 | 153.162 | 33.912 | 73.962 |
| 2016-03-0112:47:44 PM | 69.125 | 153.162 | 33.912 | 74.075 |
| 2016-03-0112:47:48 PM | 69.125 | 153.162 | 33.912 | 73.962 |
| 2016-03-0112:47:52 PM | 69.125 | 153.162 | 33.912 | 74.075 |
| 2016-03-0112:47:56 PM | 69.125 | 153.162 | 33.912 | 74.075 |
| 2016-03-0112:48:00 PM | 69.125 | 153.05 | 33.8 | 74.075 |
| 2016-03-0112:48:05 PM | 69.125 | 153.05 | 33.688 | 73.962 |
| 2016-03-0112:48:09 PM | 69.012 | 153.162 | 33.688 | 73.962 |
| 2016-03-0112:48:13 PM | 69.012 | 153.162 | 33.688 | 74.075 |
| 2016-03-0112:48:17 PM | 69.012 | 153.162 | 33.575 | 74.075 |
| 2016-03-0112:48:21 PM | 69.012 | 153.275 | 33.688 | 74.075 |
| 2016-03-0112:48:25 PM | 69.012 | 153.275 | 33.8 | 74.075 |
| 2016-03-0112:48:29 PM | 69.012 | 153.275 | 33.688 | 74.075 |
| 2016-03-0112:48:33 PM | 69.012 | 153.388 | 33.8 | 74.075 |
| 2016-03-0112:48:37 PM | 69.012 | 153.388 | 33.912 | 74.075 |
| 2016-03-0112:48:41 PM | 69.012 | 153.275 | 33.8 | 73.962 |
| 2016-03-0112:48:45 PM | 69.012 | 153.275 | 33.688 | 73.962 |
| 2016-03-0112:48:49 PM | 69.012 | 153.275 | 33.575 | 73.962 |
| 2016-03-0112:48:53 PM | 69.012 | 153.275 | 33.575 | 73.962 |
| 2016-03-0112:48:57 PM | 69.012 | 153.162 | 33.35 | 73.962 |
| 2016-03-0112:49:02 PM | 69.125 | 153.275 | 33.125 | 73.962 |
| 2016-03-0112:49:06 PM | 69.125 | 153.275 | 33.125 | 73.962 |
| 2016-03-0112:49:10 PM | 69.125 | 153.388 | 33.125 | 73.962 |
| 2016-03-0112:49:14 PM | 69.125 | 153.388 | 33.238 | 73.962 |
| 2016-03-0112:49:18 PM | 69.125 | 153.388 | 33.238 | 73.962 |
| 2016-03-0112:49:22 PM | 69.012 | 153.388 | 33.238 | 73.962 |
| 2016-03-0112:49:26 PM | 69.012 | 153.388 | 32.9 | 73.962 |
| 2016-03-0112:49:30 PM | 69.125 | 153.388 | 32.562 | 73.962 |
| 2016-03-0112:49:34 PM | 69.012 | 153.5 | 32.338 | 73.962 |
| 2016-03-0112:49:38 PM | 69.125 | 153.5 | 32.338 | 73.962 |
| 2016-03-0112:49:42 PM | 69.125 | 153.5 | 32.338 | 73.85 |
| 2016-03-0112:49:46 PM | 69.012 | 153.388 | 32.338 | 73.85 |
| 2016-03-0112:49:50 PM | 69.012 | 153.388 | 32.562 | 73.85 |
| 2016-03-0112:49:54 PM | 69.012 | 153.388 | 32.562 | 73.85 |
| 2016-03-0112:49:58 PM | 69.012 | 153.388 | 32.675 | 73.85 |
| 2016-03-0112:50:03 PM | 69.012 | 153.388 | 32.675 | 73.85 |
| 2016-03-0112:50:07 PM | 69.012 | 153.388 | 32.9 | 73.962 |
| 2016-03-0112:50:11 PM | 69.012 | 153.388 | 32.9 | 73.962 |
| 2016-03-0112:50:15 PM | 69.012 | 153.275 | 33.012 | 73.962 |
| 2016-03-0112:50:19 PM | 69.012 | 153.275 | 33.125 | 73.962 |
| 2016-03-0112:50:23 PM | 69.012 | 153.275 | 33.35 | 73.962 |
| 2016-03-0112:50:27 PM | 68.9 | 153.388 | 33.462 | 73.962 |
| 2016-03-0112:50:31 PM | 69.012 | 153.275 | 33.688 | 73.962 |
| 2016-03-0112:50:35 PM | 68.9 | 153.388 | 33.688 | 73.962 |
| 2016-03-0112:50:39 PM | 68.9 | 153.388 | 33.8 | 73.962 |
| 2016-03-0112:50:43 PM | 69.012 | 153.388 | 33.912 | 73.962 |
| 2016-03-0112:50:47 PM | 68.9 | 153.388 | 34.025 | 73.962 |
| 2016-03-0112:50:51 PM | 68.9 | 153.5 | 34.025 | 73.85 |
| 2016-03-0112:50:55 PM | 68.788 | 153.5 | 34.138 | 73.962 |
| 2016-03-0112:50:59 PM | 68.788 | 153.612 | 34.138 | 73.962 |
| 2016-03-0112:51:03 PM | 68.9 | 153.612 | 34.025 | 73.85 |
| 2016-03-0112:51:08 PM | 68.788 | 153.612 | 33.688 | 73.85 |
| 2016-03-0112:51:12 PM | 68.788 | 153.612 | 33.35 | 73.85 |
| 2016-03-0112:51:16 PM | 68.9 | 153.612 | 33.238 | 73.85 |
| 2016-03-0112:51:20 PM | 68.788 | 153.612 | 33.125 | 73.85 |
| 2016-03-0112:51:24 PM | 68.788 | 153.5 | 32.9 | 73.85 |
| 2016-03-0112:51:28 PM | 68.788 | 153.612 | 32.45 | 73.85 |
| 2016-03-0112:51:32 PM | 68.9 | 153.612 | 32.112 | 73.85 |
| 2016-03-0112:51:36 PM | 68.9 | 153.725 | 32.112 | 73.85 |
| 2016-03-0112:51:40 PM | 68.788 | 153.725 | 32.112 | 73.85 |
| 2016-03-0112:51:44 PM | 68.788 | 153.725 | 32.225 | 73.85 |
| 2016-03-0112:51:48 PM | 68.788 | 153.725 | 32.338 | 73.85 |
| 2016-03-0112:51:52 PM | 68.788 | 153.612 | 32.338 | 73.85 |
| 2016-03-0112:51:56 PM | 68.788 | 153.5 | 32.338 | 73.85 |
| 2016-03-0112:52:00 PM | 68.788 | 153.5 | 32.225 | 73.85 |
| 2016-03-0112:52:04 PM | 68.675 | 153.388 | 32.225 | 73.85 |
| 2016-03-0112:52:09 PM | 68.675 | 153.275 | 32.225 | 73.85 |
| 2016-03-0112:52:13 PM | 68.675 | 153.275 | 32.338 | 73.85 |
| 2016-03-0112:52:17 PM | 68.675 | 153.275 | 32.562 | 73.962 |
| 2016-03-0112:52:21 PM | 68.675 | 153.162 | 32.675 | 73.962 |
| 2016-03-0112:52:25 PM | 68.675 | 153.162 | 32.788 | 73.85 |
| 2016-03-0112:52:29 PM | 68.675 | 153.162 | 33.012 | 73.962 |
| 2016-03-0112:52:33 PM | 68.675 | 153.162 | 33.012 | 73.962 |
| 2016-03-0112:52:37 PM | 68.675 | 153.162 | 33.125 | 73.962 |
| 2016-03-0112:52:41 PM | 68.675 | 153.162 | 33.012 | 73.962 |
| 2016-03-0112:52:45 PM | 68.675 | 153.05 | 33.012 | 73.962 |
| 2016-03-0112:52:49 PM | 68.562 | 153.05 | 32.9 | 73.962 |
| 2016-03-0112:52:53 PM | 68.562 | 153.05 | 32.9 | 73.962 |
| 2016-03-0112:52:57 PM | 68.562 | 153.05 | 32.9 | 73.962 |
| 2016-03-0112:53:01 PM | 68.562 | 153.05 | 32.9 | 73.962 |
| 2016-03-0112:53:05 PM | 68.562 | 153.05 | 32.9 | 73.962 |
| 2016-03-0112:53:10 PM | 68.562 | 153.05 | 32.9 | 73.962 |
| 2016-03-0112:53:14 PM | 68.45 | 153.05 | 32.9 | 73.962 |
| 2016-03-0112:53:18 PM | 68.562 | 153.05 | 32.9 | 73.962 |
| 2016-03-0112:53:22 PM | 68.562 | 153.05 | 33.012 | 73.962 |
| 2016-03-0112:53:29 PM | 68.562 | 153.05 | 33.012 | 73.962 |
| 2016-03-0112:53:33 PM | 68.562 | 152.938 | 33.012 | 73.962 |
| 2016-03-0112:53:37 PM | 68.562 | 153.05 | 33.012 | 73.962 |
| 2016-03-0112:53:41 PM | 68.562 | 153.05 | 33.012 | 73.85 |
| 2016-03-0112:53:45 PM | 68.562 | 153.05 | 32.9 | 73.85 |
| 2016-03-0112:53:49 PM | 68.562 | 153.05 | 32.788 | 73.85 |
| 2016-03-0112:53:53 PM | 68.562 | 153.05 | 32.675 | 73.85 |
| 2016-03-0112:53:57 PM | 68.45 | 153.05 | 32.562 | 73.85 |
| 2016-03-0112:54:01 PM | 68.45 | 153.162 | 32.562 | 73.85 |
| 2016-03-0112:54:05 PM | 68.562 | 153.05 | 32.675 | 73.85 |
| 2016-03-0112:54:09 PM | 68.562 | 153.05 | 32.788 | 73.85 |
| 2016-03-0112:54:13 PM | 68.562 | 153.162 | 32.788 | 73.85 |
| 2016-03-0112:54:17 PM | 68.562 | 153.162 | 32.9 | 73.85 |
| 2016-03-0112:54:21 PM | 68.45 | 153.162 | 33.125 | 73.962 |
| 2016-03-0112:54:25 PM | 68.45 | 153.162 | 33.35 | 73.962 |
| 2016-03-0112:54:29 PM | 68.45 | 153.162 | 33.462 | 73.962 |
| 2016-03-0112:54:33 PM | 68.45 | 153.162 | 33.575 | 73.962 |
| 2016-03-0112:54:37 PM | 68.562 | 153.275 | 33.8 | 73.962 |
| 2016-03-0112:54:41 PM | 68.45 | 153.275 | 33.8 | 73.962 |
| 2016-03-0112:54:45 PM | 68.45 | 153.275 | 33.8 | 73.962 |
| 2016-03-0112:54:49 PM | 68.45 | 153.275 | 33.8 | 73.962 |
| 2016-03-0112:54:53 PM | 68.45 | 153.275 | 33.912 | 73.85 |
| 2016-03-0112:54:57 PM | 68.45 | 153.275 | 33.912 | 73.85 |
| 2016-03-0112:55:01 PM | 68.45 | 153.275 | 33.8 | 73.962 |
| 2016-03-0112:55:05 PM | 68.45 | 153.275 | 33.8 | 73.962 |
| 2016-03-0112:55:09 PM | 68.338 | 153.275 | 33.8 | 73.962 |
| 2016-03-0112:55:13 PM | 68.45 | 153.275 | 33.8 | 73.962 |
| 2016-03-0112:55:18 PM | 68.45 | 153.275 | 33.912 | 73.962 |
| 2016-03-0112:55:22 PM | 68.45 | 153.275 | 34.025 | 73.962 |
| 2016-03-0112:55:26 PM | 68.45 | 153.275 | 34.138 | 73.962 |
| 2016-03-0112:55:30 PM | 68.45 | 153.275 | 34.25 | 73.962 |
| 2016-03-0112:55:34 PM | 68.45 | 153.275 | 34.25 | 73.962 |
| 2016-03-0112:55:38 PM | 68.45 | 153.275 | 34.362 | 73.962 |
| 2016-03-0112:55:42 PM | 68.45 | 153.275 | 34.475 | 73.962 |
| 2016-03-0112:55:46 PM | 68.45 | 153.275 | 34.7 | 73.962 |
| 2016-03-0112:55:50 PM | 68.562 | 153.388 | 34.7 | 73.962 |
| 2016-03-0112:55:54 PM | 68.45 | 153.388 | 34.7 | 73.962 |
| 2016-03-0112:55:58 PM | 68.45 | 153.388 | 34.7 | 73.962 |
| 2016-03-0112:56:02 PM | 68.45 | 153.388 | 34.7 | 73.962 |
| 2016-03-0112:56:06 PM | 68.562 | 153.388 | 34.588 | 73.962 |
| 2016-03-0112:56:10 PM | 68.45 | 153.388 | 34.475 | 73.962 |
| 2016-03-0112:56:14 PM | 68.45 | 153.388 | 34.138 | 73.962 |
| 2016-03-0112:56:18 PM | 68.45 | 153.5 | 33.688 | 73.962 |
| 2016-03-0112:56:22 PM | 68.562 | 153.5 | 33.575 | 73.962 |
| 2016-03-0112:56:26 PM | 68.562 | 153.612 | 33.462 | 73.962 |
| 2016-03-0112:56:30 PM | 68.562 | 153.612 | 33.462 | 73.962 |
| 2016-03-0112:56:34 PM | 68.562 | 153.5 | 33.238 | 73.962 |
| 2016-03-0112:56:38 PM | 68.45 | 153.5 | 33.125 | 73.962 |
| 2016-03-0112:56:43 PM | 68.562 | 153.5 | 33.125 | 73.962 |
| 2016-03-0112:56:47 PM | 68.562 | 153.388 | 33.238 | 73.962 |
| 2016-03-0112:56:51 PM | 68.562 | 153.388 | 33.35 | 73.962 |
| 2016-03-0112:56:55 PM | 68.562 | 153.388 | 33.462 | 73.962 |
| 2016-03-0112:56:59 PM | 68.562 | 153.275 | 33.688 | 74.075 |
| 2016-03-0112:57:03 PM | 68.45 | 153.275 | 33.688 | 74.075 |
| 2016-03-0112:57:07 PM | 68.562 | 153.275 | 33.688 | 74.075 |
| 2016-03-0112:57:11 PM | 68.562 | 153.275 | 33.912 | 74.075 |
| 2016-03-0112:57:15 PM | 68.45 | 153.275 | 34.025 | 74.075 |
| 2016-03-0112:57:19 PM | 68.562 | 153.162 | 34.138 | 74.075 |
| 2016-03-0112:57:23 PM | 68.562 | 153.162 | 34.25 | 74.075 |
| 2016-03-0112:57:27 PM | 68.562 | 153.162 | 34.25 | 74.075 |
| 2016-03-0112:57:31 PM | 68.562 | 153.162 | 34.25 | 74.075 |
| 2016-03-0112:57:35 PM | 68.562 | 153.162 | 34.25 | 74.075 |
| 2016-03-0112:57:39 PM | 68.562 | 153.162 | 34.362 | 74.075 |
| 2016-03-0112:57:44 PM | 68.562 | 153.162 | 34.362 | 74.075 |
| 2016-03-0112:57:52 PM | 68.562 | 153.162 | 34.475 | 74.075 |
| 2016-03-0112:57:56 PM | 68.562 | 153.162 | 34.475 | 74.075 |
| 2016-03-0112:58:00 PM | 68.562 | 153.162 | 34.588 | 74.075 |
| 2016-03-0112:58:04 PM | 68.562 | 153.162 | 34.588 | 74.075 |
| 2016-03-0112:58:08 PM | 68.562 | 153.162 | 34.7 | 74.075 |
| 2016-03-0112:58:12 PM | 68.562 | 153.162 | 34.812 | 74.075 |
| 2016-03-0112:58:16 PM | 68.562 | 153.275 | 34.7 | 74.075 |
| 2016-03-0112:58:20 PM | 68.562 | 153.275 | 34.588 | 74.075 |
| 2016-03-0112:58:24 PM | 68.562 | 153.275 | 34.362 | 74.075 |
| 2016-03-0112:58:28 PM | 68.562 | 153.275 | 34.362 | 74.075 |
| 2016-03-0112:58:32 PM | 68.562 | 153.275 | 34.475 | 74.075 |
| 2016-03-0112:58:36 PM | 68.45 | 153.275 | 34.362 | 74.075 |
| 2016-03-0112:58:41 PM | 68.562 | 153.275 | 34.475 | 74.075 |
| 2016-03-0112:58:45 PM | 68.45 | 153.275 | 34.475 | 74.075 |
| 2016-03-0112:58:49 PM | 68.45 | 153.275 | 34.588 | 74.075 |
| 2016-03-0112:58:53 PM | 68.45 | 153.275 | 34.588 | 74.075 |
| 2016-03-0112:58:57 PM | 68.45 | 153.275 | 34.475 | 74.075 |
| 2016-03-0112:59:01 PM | 68.45 | 153.275 | 34.362 | 74.188 |
| 2016-03-0112:59:05 PM | 68.45 | 153.275 | 34.138 | 74.075 |
| 2016-03-0112:59:09 PM | 68.45 | 153.275 | 33.912 | 74.075 |
| 2016-03-0112:59:13 PM | 68.45 | 153.275 | 33.688 | 74.075 |
| 2016-03-0112:59:17 PM | 68.45 | 153.275 | 33.688 | 74.075 |
| 2016-03-0112:59:21 PM | 68.45 | 153.275 | 33.575 | 74.075 |
| 2016-03-0112:59:25 PM | 68.45 | 153.275 | 33.575 | 74.075 |
| 2016-03-0112:59:29 PM | 68.45 | 153.275 | 33.35 | 74.075 |
| 2016-03-0112:59:33 PM | 68.45 | 153.388 | 33.012 | 74.075 |
| 2016-03-0112:59:37 PM | 68.45 | 153.275 | 33.012 | 74.075 |
| 2016-03-0112:59:42 PM | 68.45 | 153.275 | 32.9 | 74.075 |
| 2016-03-0112:59:46 PM | 68.45 | 153.388 | 33.012 | 74.075 |
| 2016-03-0112:59:50 PM | 68.45 | 153.275 | 33.125 | 74.075 |
| 2016-03-0112:59:54 PM | 68.45 | 153.162 | 33.125 | 74.075 |
| 2016-03-0112:59:58 PM | 68.45 | 153.05 | 33.35 | 73.962 |
| 2016-03-011:00:02 PM | 68.45 | 153.05 | 33.238 | 73.962 |
| 2016-03-011:00:06 PM | 68.45 | 153.05 | 33.125 | 73.962 |
| 2016-03-011:00:10 PM | 68.45 | 152.938 | 33.012 | 74.075 |
| 2016-03-011:00:14 PM | 68.562 | 152.825 | 32.9 | 74.075 |
| 2016-03-011:00:18 PM | 68.562 | 152.825 | 32.9 | 74.075 |
| 2016-03-011:00:22 PM | 68.45 | 152.712 | 32.9 | 73.962 |
| 2016-03-011:00:26 PM | 68.45 | 152.712 | 32.788 | 74.075 |
| 2016-03-011:00:30 PM | 68.562 | 152.712 | 32.788 | 73.962 |
| 2016-03-011:00:34 PM | 68.562 | 152.712 | 33.012 | 73.962 |
| 2016-03-011:00:38 PM | 68.562 | 152.6 | 33.125 | 73.962 |
| 2016-03-011:00:42 PM | 68.562 | 152.6 | 33.238 | 73.962 |
| 2016-03-011:00:46 PM | 68.562 | 152.6 | 33.462 | 73.962 |
| 2016-03-011:00:50 PM | 68.562 | 152.6 | 33.462 | 73.962 |
| 2016-03-011:00:54 PM | 68.562 | 152.6 | 33.462 | 73.962 |
| 2016-03-011:00:58 PM | 68.45 | 152.6 | 33.462 | 74.075 |
| 2016-03-011:01:02 PM | 68.562 | 152.6 | 33.575 | 73.962 |
| 2016-03-011:01:06 PM | 68.45 | 152.6 | 33.688 | 74.075 |
| 2016-03-011:01:10 PM | 68.45 | 152.6 | 33.688 | 74.075 |
| 2016-03-011:01:14 PM | 68.562 | 152.6 | 33.575 | 74.075 |
| 2016-03-011:01:19 PM | 68.45 | 152.6 | 33.462 | 74.075 |
| 2016-03-011:01:23 PM | 68.45 | 152.6 | 33.35 | 73.962 |
| 2016-03-011:01:27 PM | 68.45 | 152.6 | 33.35 | 73.962 |
| 2016-03-011:01:31 PM | 68.45 | 152.488 | 33.238 | 73.962 |
| 2016-03-011:01:35 PM | 68.45 | 152.488 | 33.238 | 73.962 |
| 2016-03-011:01:39 PM | 68.45 | 152.488 | 33.35 | 73.962 |
| 2016-03-011:01:43 PM | 68.45 | 152.488 | 33.35 | 73.962 |
| 2016-03-011:01:47 PM | 68.45 | 152.375 | 33.35 | 73.962 |
| 2016-03-011:01:51 PM | 68.45 | 152.375 | 33.462 | 73.962 |
| 2016-03-011:01:55 PM | 68.45 | 152.375 | 33.575 | 73.962 |
| 2016-03-011:01:59 PM | 68.45 | 152.375 | 33.688 | 73.962 |
| 2016-03-011:02:03 PM | 68.45 | 152.375 | 33.8 | 73.962 |
| 2016-03-011:02:07 PM | 68.45 | 152.375 | 33.912 | 73.962 |
| 2016-03-011:02:11 PM | 68.562 | 152.375 | 34.025 | 73.962 |
| 2016-03-011:02:15 PM | 68.562 | 152.375 | 34.025 | 73.962 |
| 2016-03-011:02:20 PM | 68.562 | 152.263 | 34.025 | 73.962 |
| 2016-03-011:02:24 PM | 68.562 | 152.263 | 34.025 | 73.962 |
| 2016-03-011:02:28 PM | 68.562 | 152.263 | 34.025 | 73.962 |
| 2016-03-011:02:32 PM | 68.562 | 152.263 | 34.138 | 73.962 |
| 2016-03-011:02:36 PM | 68.562 | 152.263 | 34.362 | 73.962 |
| 2016-03-011:02:39 PM | 68.675 | 152.375 | 34.138 | 73.962 |
| 2016-03-011:02:43 PM | 68.675 | 152.375 | 33.912 | 73.962 |
| 2016-03-011:02:47 PM | 68.675 | 152.375 | 33.8 | 73.962 |
| 2016-03-011:02:51 PM | 68.675 | 152.375 | 33.688 | 73.962 |
| 2016-03-011:02:55 PM | 68.675 | 152.375 | 33.688 | 73.962 |
| 2016-03-011:02:59 PM | 68.675 | 152.375 | 33.688 | 73.962 |
| 2016-03-011:03:03 PM | 68.675 | 152.375 | 33.688 | 73.962 |
| 2016-03-011:03:07 PM | 68.788 | 152.488 | 33.575 | 73.962 |
| 2016-03-011:03:11 PM | 68.788 | 152.375 | 33.688 | 73.962 |
| 2016-03-011:03:15 PM | 68.675 | 152.488 | 33.8 | 73.962 |
| 2016-03-011:03:19 PM | 68.675 | 152.488 | 33.912 | 73.962 |
| 2016-03-011:03:24 PM | 68.675 | 152.488 | 33.8 | 73.962 |
| 2016-03-011:03:28 PM | 68.675 | 152.488 | 33.8 | 73.962 |
| 2016-03-011:03:32 PM | 68.675 | 152.488 | 33.912 | 74.075 |
| 2016-03-011:03:36 PM | 68.675 | 152.488 | 33.912 | 74.075 |
| 2016-03-011:03:40 PM | 68.675 | 152.6 | 34.025 | 73.962 |
| 2016-03-011:03:44 PM | 68.675 | 152.488 | 34.25 | 74.075 |
| 2016-03-011:03:48 PM | 68.675 | 152.488 | 34.362 | 74.075 |
| 2016-03-011:03:52 PM | 68.562 | 152.6 | 34.362 | 74.075 |
| 2016-03-011:03:56 PM | 68.675 | 152.6 | 34.475 | 74.075 |
| 2016-03-011:04:00 PM | 68.675 | 152.6 | 34.475 | 74.075 |
| 2016-03-011:04:04 PM | 68.675 | 152.712 | 34.588 | 74.075 |
| 2016-03-011:04:08 PM | 68.675 | 152.6 | 34.475 | 74.075 |
| 2016-03-011:04:12 PM | 68.675 | 152.6 | 34.475 | 74.075 |
| 2016-03-011:04:16 PM | 68.675 | 152.712 | 34.25 | 74.075 |
| 2016-03-011:04:20 PM | 68.675 | 152.712 | 34.138 | 74.075 |
| 2016-03-011:04:24 PM | 68.562 | 152.712 | 33.912 | 74.075 |
| 2016-03-011:04:28 PM | 68.675 | 152.712 | 33.912 | 74.075 |
| 2016-03-011:04:32 PM | 68.675 | 152.825 | 34.025 | 74.075 |
| 2016-03-011:04:37 PM | 68.675 | 152.825 | 34.025 | 74.075 |
| 2016-03-011:04:41 PM | 68.562 | 152.825 | 34.025 | 74.075 |
| 2016-03-011:04:45 PM | 68.562 | 152.825 | 33.912 | 74.075 |
| 2016-03-011:04:49 PM | 68.562 | 152.938 | 34.025 | 74.075 |
| 2016-03-011:04:53 PM | 68.562 | 152.938 | 34.025 | 74.075 |
| 2016-03-011:04:57 PM | 68.562 | 152.938 | 33.912 | 74.075 |
| 2016-03-011:05:01 PM | 68.562 | 152.938 | 33.8 | 74.075 |
| 2016-03-011:05:05 PM | 68.562 | 152.938 | 33.8 | 74.075 |
| 2016-03-011:05:09 PM | 68.562 | 152.938 | 33.575 | 74.075 |
| 2016-03-011:05:13 PM | 68.562 | 152.938 | 33.462 | 74.075 |
| 2016-03-011:05:17 PM | 68.562 | 152.938 | 33.462 | 74.075 |
| 2016-03-011:05:21 PM | 68.45 | 152.938 | 33.35 | 74.075 |
| 2016-03-011:05:25 PM | 68.562 | 153.05 | 33.35 | 74.075 |
| 2016-03-011:05:29 PM | 68.562 | 153.05 | 33.238 | 74.075 |
| 2016-03-011:05:33 PM | 68.562 | 152.938 | 33.125 | 74.075 |
| 2016-03-011:05:37 PM | 68.562 | 152.938 | 33.125 | 74.075 |
| 2016-03-011:05:42 PM | 68.562 | 152.938 | 33.125 | 74.075 |
| 2016-03-011:05:46 PM | 68.675 | 152.825 | 33.012 | 74.075 |
| 2016-03-011:05:50 PM | 68.675 | 152.712 | 32.788 | 74.075 |
| 2016-03-011:05:54 PM | 68.788 | 152.825 | 32.675 | 74.075 |
| 2016-03-011:05:58 PM | 68.788 | 152.712 | 32.562 | 74.075 |
| 2016-03-011:06:02 PM | 68.788 | 152.712 | 32.225 | 74.075 |
| 2016-03-011:06:06 PM | 68.788 | 152.6 | 31.888 | 74.075 |
| 2016-03-011:06:10 PM | 68.675 | 152.6 | 31.662 | 74.075 |
| 2016-03-011:06:14 PM | 68.788 | 152.488 | 31.438 | 74.075 |
| 2016-03-011:06:22 PM | 68.675 | 152.488 | 31.212 | 74.188 |
| 2016-03-011:06:26 PM | 68.675 | 152.488 | 31.212 | 74.075 |
| 2016-03-011:06:30 PM | 68.675 | 152.375 | 31.212 | 74.075 |
| 2016-03-011:06:38 PM | 68.675 | 152.263 | 31.55 | 74.075 |
| 2016-03-011:06:42 PM | 68.675 | 152.263 | 31.775 | 74.075 |
| 2016-03-011:06:46 PM | 68.675 | 152.263 | 31.775 | 74.075 |
| 2016-03-011:06:50 PM | 68.675 | 152.263 | 31.775 | 74.075 |
| 2016-03-011:06:54 PM | 68.675 | 152.15 | 31.775 | 74.075 |
| 2016-03-011:06:58 PM | 68.675 | 152.038 | 31.775 | 74.075 |
| 2016-03-011:07:02 PM | 68.675 | 151.925 | 31.55 | 74.075 |
| 2016-03-011:07:06 PM | 68.562 | 151.925 | 31.662 | 74.075 |
| 2016-03-011:07:10 PM | 68.675 | 151.925 | 31.775 | 74.075 |
| 2016-03-011:07:14 PM | 68.675 | 151.925 | 31.662 | 74.075 |
| 2016-03-011:07:18 PM | 68.675 | 151.812 | 31.662 | 74.075 |
| 2016-03-011:07:22 PM | 68.675 | 151.812 | 31.775 | 74.075 |
| 2016-03-011:07:26 PM | 68.675 | 151.7 | 31.775 | 74.075 |
| 2016-03-011:07:30 PM | 68.562 | 151.7 | 31.888 | 74.075 |
| 2016-03-011:07:34 PM | 68.562 | 151.7 | 31.888 | 74.075 |
| 2016-03-011:07:38 PM | 68.562 | 151.812 | 31.662 | 74.075 |
| 2016-03-011:07:42 PM | 68.562 | 151.812 | 31.438 | 74.075 |
| 2016-03-011:07:46 PM | 68.562 | 151.812 | 31.438 | 74.075 |
| 2016-03-011:07:50 PM | 68.562 | 151.7 | 31.55 | 74.188 |
| 2016-03-011:07:54 PM | 68.562 | 151.7 | 31.662 | 74.188 |
| 2016-03-011:07:58 PM | 68.562 | 151.588 | 31.888 | 74.075 |
| 2016-03-011:08:02 PM | 68.562 | 151.588 | 32 | 74.188 |
| 2016-03-011:08:06 PM | 68.562 | 151.588 | 32 | 74.188 |
| 2016-03-011:08:10 PM | 68.562 | 151.588 | 32.225 | 74.188 |
| 2016-03-011:08:15 PM | 68.562 | 151.475 | 32.225 | 74.188 |
| 2016-03-011:08:19 PM | 68.675 | 151.475 | 32.338 | 74.188 |
| 2016-03-011:08:23 PM | 68.675 | 151.362 | 32.45 | 74.188 |
| 2016-03-011:08:27 PM | 68.675 | 151.362 | 32.45 | 74.188 |
| 2016-03-011:08:31 PM | 68.562 | 151.25 | 32.45 | 74.188 |
| 2016-03-011:08:35 PM | 68.675 | 151.25 | 32.562 | 74.188 |
| 2016-03-011:08:39 PM | 68.562 | 151.25 | 32.788 | 74.188 |
| 2016-03-011:08:43 PM | 68.562 | 151.25 | 32.788 | 74.188 |
| 2016-03-011:08:47 PM | 68.562 | 151.25 | 32.9 | 74.188 |
| 2016-03-011:08:51 PM | 68.562 | 151.362 | 33.125 | 74.188 |
| 2016-03-011:08:55 PM | 68.562 | 151.362 | 33.238 | 74.188 |
| 2016-03-011:08:59 PM | 68.562 | 151.25 | 33.35 | 74.188 |
| 2016-03-011:09:03 PM | 68.562 | 151.138 | 33.575 | 74.188 |
| 2016-03-011:09:07 PM | 68.562 | 151.025 | 33.688 | 74.188 |
| 2016-03-011:09:11 PM | 68.562 | 151.025 | 33.912 | 74.188 |
| 2016-03-011:09:15 PM | 68.675 | 150.912 | 33.912 | 74.188 |
| 2016-03-011:09:19 PM | 68.675 | 150.912 | 34.025 | 74.188 |
| 2016-03-011:09:23 PM | 68.675 | 150.912 | 34.138 | 74.188 |
| 2016-03-011:09:27 PM | 68.675 | 150.912 | 34.138 | 74.188 |
| 2016-03-011:09:31 PM | 68.675 | 150.912 | 34.25 | 74.188 |
| 2016-03-011:09:35 PM | 68.788 | 150.912 | 34.362 | 74.188 |
| 2016-03-011:09:39 PM | 68.788 | 150.912 | 34.362 | 74.188 |
| 2016-03-011:09:43 PM | 68.788 | 150.912 | 34.475 | 74.188 |
| 2016-03-011:09:47 PM | 68.788 | 150.8 | 34.475 | 74.188 |
| 2016-03-011:09:51 PM | 68.788 | 150.912 | 34.475 | 74.188 |
| 2016-03-011:09:55 PM | 68.788 | 150.912 | 34.475 | 74.188 |
| 2016-03-011:09:59 PM | 68.788 | 150.912 | 34.475 | 74.188 |
| 2016-03-011:10:03 PM | 68.788 | 150.912 | 34.362 | 74.188 |
| 2016-03-011:10:07 PM | 68.788 | 150.912 | 34.362 | 74.075 |
| 2016-03-011:10:11 PM | 68.788 | 151.025 | 34.25 | 74.075 |
| 2016-03-011:10:16 PM | 68.788 | 151.025 | 33.912 | 74.075 |
| 2016-03-011:10:20 PM | 68.675 | 151.025 | 33.462 | 74.075 |
| 2016-03-011:10:24 PM | 68.788 | 151.025 | 33.238 | 74.075 |
| 2016-03-011:10:28 PM | 68.675 | 151.025 | 32.788 | 74.075 |
| 2016-03-011:10:32 PM | 68.675 | 151.138 | 32.338 | 74.075 |
| 2016-03-011:10:36 PM | 68.675 | 151.25 | 32.225 | 74.075 |
| 2016-03-011:10:40 PM | 68.675 | 151.25 | 32.338 | 74.075 |
| 2016-03-011:10:44 PM | 68.675 | 151.25 | 32.338 | 73.962 |
| 2016-03-011:10:48 PM | 68.675 | 151.138 | 32.45 | 74.075 |
| 2016-03-011:10:52 PM | 68.675 | 151.138 | 32.562 | 74.075 |
| 2016-03-011:10:56 PM | 68.675 | 151.138 | 32.675 | 74.075 |
| 2016-03-011:11:00 PM | 68.562 | 151.025 | 32.675 | 73.962 |
| 2016-03-011:11:04 PM | 68.675 | 151.025 | 32.675 | 73.962 |
| 2016-03-011:11:08 PM | 68.675 | 151.025 | 32.562 | 73.962 |
| 2016-03-011:11:12 PM | 68.675 | 151.025 | 32.675 | 73.962 |
| 2016-03-011:11:16 PM | 68.675 | 151.025 | 32.788 | 73.962 |
| 2016-03-011:11:20 PM | 68.675 | 151.025 | 33.012 | 73.962 |
| 2016-03-011:11:24 PM | 68.562 | 151.138 | 33.125 | 73.962 |
| 2016-03-011:11:28 PM | 68.675 | 151.025 | 33.125 | 73.962 |
| 2016-03-011:11:32 PM | 68.675 | 151.025 | 33.238 | 73.962 |
| 2016-03-011:11:36 PM | 68.675 | 150.912 | 33.462 | 73.962 |
| 2016-03-011:11:40 PM | 68.675 | 151.025 | 33.462 | 73.962 |
| 2016-03-011:11:44 PM | 68.675 | 150.912 | 33.575 | 73.962 |
| 2016-03-011:11:48 PM | 68.788 | 150.912 | 33.462 | 73.962 |
| 2016-03-011:11:52 PM | 68.788 | 150.912 | 33.35 | 73.962 |
| 2016-03-011:11:56 PM | 68.788 | 150.912 | 33.238 | 73.962 |
| 2016-03-011:12:00 PM | 68.788 | 150.912 | 33.238 | 73.962 |
| 2016-03-011:12:04 PM | 68.788 | 150.912 | 33.35 | 73.85 |
| 2016-03-011:12:08 PM | 68.788 | 150.912 | 33.35 | 73.85 |
| 2016-03-011:12:12 PM | 68.788 | 150.912 | 33.462 | 73.85 |
| 2016-03-011:12:17 PM | 68.788 | 150.912 | 33.35 | 73.85 |
| 2016-03-011:12:21 PM | 68.788 | 150.912 | 33.35 | 73.85 |
| 2016-03-011:12:25 PM | 68.788 | 150.912 | 33.238 | 73.85 |
| 2016-03-011:12:29 PM | 68.788 | 150.912 | 33.125 | 73.738 |
| 2016-03-011:12:33 PM | 68.788 | 150.912 | 32.788 | 73.85 |
| 2016-03-011:12:37 PM | 68.788 | 150.912 | 32.675 | 73.738 |
| 2016-03-011:12:41 PM | 68.788 | 151.025 | 32.338 | 73.738 |
| 2016-03-011:12:45 PM | 68.788 | 151.025 | 32.225 | 73.738 |
| 2016-03-011:12:49 PM | 68.788 | 151.138 | 32.338 | 73.85 |
| 2016-03-011:12:53 PM | 68.675 | 151.025 | 32.225 | 73.85 |
| 2016-03-011:12:57 PM | 68.675 | 151.138 | 32.225 | 73.85 |
| 2016-03-011:13:01 PM | 68.675 | 151.138 | 32.112 | 73.85 |
| 2016-03-011:13:05 PM | 68.675 | 151.138 | 32.338 | 73.85 |
| 2016-03-011:13:09 PM | 68.788 | 151.138 | 32.338 | 73.85 |
| 2016-03-011:13:13 PM | 68.788 | 151.025 | 32.45 | 73.85 |
| 2016-03-011:13:17 PM | 68.788 | 151.025 | 32.45 | 73.962 |
| 2016-03-011:13:21 PM | 68.788 | 151.025 | 32.562 | 73.962 |
| 2016-03-011:13:25 PM | 68.788 | 151.025 | 32.562 | 73.962 |
| 2016-03-011:13:29 PM | 68.788 | 150.912 | 32.675 | 73.962 |
| 2016-03-011:13:33 PM | 68.788 | 150.912 | 32.675 | 73.962 |
| 2016-03-011:13:37 PM | 68.788 | 150.912 | 32.675 | 73.962 |
| 2016-03-011:13:41 PM | 68.788 | 150.8 | 32.788 | 73.962 |
| 2016-03-011:13:45 PM | 68.788 | 150.912 | 32.9 | 73.962 |
| 2016-03-011:13:49 PM | 68.788 | 150.912 | 33.125 | 73.962 |
| 2016-03-011:13:53 PM | 68.788 | 150.912 | 33.238 | 73.962 |
| 2016-03-011:13:57 PM | 68.788 | 150.912 | 33.462 | 73.962 |
| 2016-03-011:14:01 PM | 68.788 | 150.912 | 33.575 | 73.962 |
| 2016-03-011:14:05 PM | 68.788 | 151.025 | 33.8 | 73.962 |
| 2016-03-011:14:09 PM | 68.788 | 151.025 | 33.912 | 73.962 |
| 2016-03-011:14:13 PM | 68.788 | 151.025 | 34.025 | 73.962 |
| 2016-03-011:14:17 PM | 68.788 | 151.025 | 34.025 | 73.962 |
| 2016-03-011:14:21 PM | 68.788 | 150.912 | 33.912 | 73.962 |
| 2016-03-011:14:26 PM | 68.788 | 151.025 | 33.8 | 73.962 |
| 2016-03-011:14:30 PM | 68.788 | 150.912 | 33.8 | 73.962 |
| 2016-03-011:14:34 PM | 68.675 | 150.912 | 33.8 | 73.962 |
| 2016-03-011:14:38 PM | 68.675 | 150.912 | 33.688 | 73.962 |
| 2016-03-011:14:42 PM | 68.788 | 150.912 | 33.688 | 73.962 |
| 2016-03-011:14:46 PM | 68.788 | 150.912 | 33.8 | 73.962 |
| 2016-03-011:14:50 PM | 68.675 | 151.025 | 34.025 | 74.075 |
| 2016-03-011:14:54 PM | 68.788 | 150.912 | 34.138 | 74.075 |
| 2016-03-011:14:58 PM | 68.675 | 150.912 | 34.138 | 73.962 |
| 2016-03-011:15:02 PM | 68.788 | 150.8 | 34.25 | 73.962 |
| 2016-03-011:15:06 PM | 68.788 | 150.8 | 34.25 | 74.075 |
| 2016-03-011:15:10 PM | 68.788 | 150.8 | 34.25 | 74.075 |
| 2016-03-011:15:14 PM | 68.788 | 150.8 | 34.25 | 74.075 |
| 2016-03-011:15:18 PM | 68.788 | 150.8 | 34.25 | 74.075 |
| 2016-03-011:15:26 PM | 68.788 | 150.8 | 34.362 | 74.075 |
| 2016-03-011:15:30 PM | 68.788 | 150.912 | 34.475 | 74.075 |
| 2016-03-011:15:34 PM | 68.788 | 150.8 | 34.588 | 74.075 |
| 2016-03-011:15:38 PM | 68.675 | 150.8 | 34.7 | 74.075 |
| 2016-03-011:15:42 PM | 68.675 | 150.8 | 34.812 | 74.075 |
| 2016-03-011:15:46 PM | 68.675 | 150.912 | 34.7 | 74.075 |
| 2016-03-011:15:50 PM | 68.675 | 150.8 | 34.7 | 74.075 |
| 2016-03-011:15:54 PM | 68.675 | 150.912 | 34.588 | 74.075 |
| 2016-03-011:15:58 PM | 68.675 | 150.912 | 34.588 | 74.075 |
| 2016-03-011:16:02 PM | 68.675 | 150.912 | 34.588 | 74.075 |
| 2016-03-011:16:06 PM | 68.675 | 150.912 | 34.475 | 74.075 |
| 2016-03-011:16:10 PM | 68.675 | 150.912 | 34.475 | 74.075 |
| 2016-03-011:16:14 PM | 68.675 | 150.8 | 34.362 | 74.075 |
| 2016-03-011:16:18 PM | 68.675 | 150.912 | 34.138 | 74.075 |
| 2016-03-011:16:22 PM | 68.675 | 150.8 | 34.025 | 74.075 |
| 2016-03-011:16:26 PM | 68.675 | 150.912 | 34.025 | 74.075 |
| 2016-03-011:16:30 PM | 68.675 | 150.912 | 34.025 | 74.075 |
| 2016-03-011:16:34 PM | 68.675 | 150.912 | 33.912 | 74.075 |
| 2016-03-011:16:39 PM | 68.788 | 150.912 | 33.8 | 74.075 |
| 2016-03-011:16:43 PM | 68.788 | 150.8 | 33.688 | 74.075 |
| 2016-03-011:16:47 PM | 68.675 | 150.8 | 33.575 | 74.075 |
| 2016-03-011:16:51 PM | 68.788 | 150.8 | 33.688 | 74.075 |
| 2016-03-011:16:55 PM | 68.788 | 150.8 | 33.8 | 74.075 |
| 2016-03-011:16:59 PM | 68.788 | 150.8 | 33.8 | 74.075 |
| 2016-03-011:17:03 PM | 68.788 | 150.8 | 33.8 | 74.075 |
| 2016-03-011:17:07 PM | 68.788 | 150.8 | 33.688 | 74.075 |
| 2016-03-011:17:11 PM | 68.788 | 150.912 | 33.688 | 74.075 |
| 2016-03-011:17:15 PM | 68.788 | 150.912 | 33.688 | 74.075 |
| 2016-03-011:17:19 PM | 68.788 | 150.912 | 33.575 | 74.075 |
| 2016-03-011:17:27 PM | 68.788 | 150.8 | 33.688 | 74.075 |
| 2016-03-011:17:31 PM | 68.788 | 150.8 | 33.8 | 74.075 |
| 2016-03-011:17:35 PM | 68.788 | 150.8 | 33.8 | 74.188 |
| 2016-03-011:17:39 PM | 68.675 | 150.912 | 33.912 | 74.188 |
| 2016-03-011:17:43 PM | 68.788 | 150.912 | 33.912 | 74.188 |
| 2016-03-011:17:47 PM | 68.788 | 150.912 | 34.025 | 74.188 |
| 2016-03-011:17:51 PM | 68.788 | 150.912 | 34.138 | 74.075 |
| 2016-03-011:17:55 PM | 68.788 | 150.912 | 34.138 | 74.188 |
| 2016-03-011:17:59 PM | 68.788 | 150.912 | 34.138 | 74.188 |
| 2016-03-011:18:03 PM | 68.675 | 150.912 | 33.912 | 74.188 |
| 2016-03-011:18:07 PM | 68.675 | 150.912 | 33.912 | 74.188 |
| 2016-03-011:18:11 PM | 68.675 | 150.912 | 34.025 | 74.188 |
| 2016-03-011:18:15 PM | 68.675 | 150.912 | 34.138 | 74.188 |
| 2016-03-011:18:19 PM | 68.675 | 151.025 | 34.25 | 74.188 |
| 2016-03-011:18:23 PM | 68.675 | 151.025 | 34.362 | 74.3 |
| 2016-03-011:18:27 PM | 68.562 | 151.025 | 34.475 | 74.188 |
| 2016-03-011:18:32 PM | 68.675 | 151.025 | 34.588 | 74.188 |
| 2016-03-011:18:36 PM | 68.675 | 151.025 | 34.7 | 74.188 |
| 2016-03-011:18:40 PM | 68.675 | 151.025 | 34.7 | 74.3 |
| 2016-03-011:18:44 PM | 68.675 | 151.138 | 34.812 | 74.3 |
| 2016-03-011:18:48 PM | 68.675 | 151.138 | 34.588 | 74.3 |
| 2016-03-011:18:52 PM | 68.675 | 151.138 | 34.362 | 74.3 |
| 2016-03-011:18:56 PM | 68.675 | 151.138 | 34.25 | 74.3 |
| 2016-03-011:19:00 PM | 68.562 | 151.25 | 34.025 | 74.3 |
| 2016-03-011:19:04 PM | 68.562 | 151.25 | 34.025 | 74.3 |
| 2016-03-011:19:08 PM | 68.675 | 151.362 | 33.912 | 74.412 |
| 2016-03-011:19:12 PM | 68.675 | 151.362 | 33.8 | 74.3 |
| 2016-03-011:19:16 PM | 68.562 | 151.362 | 33.8 | 74.412 |
| 2016-03-011:19:20 PM | 68.562 | 151.475 | 33.575 | 74.412 |
| 2016-03-011:19:24 PM | 68.675 | 151.475 | 33.462 | 74.412 |
| 2016-03-011:19:28 PM | 68.675 | 151.362 | 33.238 | 74.412 |
| 2016-03-011:19:32 PM | 68.675 | 151.362 | 33.238 | 74.412 |
| 2016-03-011:19:36 PM | 68.675 | 151.362 | 33.125 | 74.412 |
| 2016-03-011:19:40 PM | 68.675 | 151.362 | 33.012 | 74.412 |
| 2016-03-011:19:44 PM | 68.675 | 151.362 | 32.9 | 74.412 |
| 2016-03-011:19:48 PM | 68.675 | 151.25 | 32.9 | 74.525 |
| 2016-03-011:19:52 PM | 68.675 | 151.138 | 33.012 | 74.412 |
| 2016-03-011:19:56 PM | 68.675 | 151.138 | 32.9 | 74.412 |
| 2016-03-011:20:00 PM | 68.675 | 151.138 | 32.9 | 74.412 |
| 2016-03-011:20:04 PM | 68.788 | 151.138 | 33.012 | 74.412 |
| 2016-03-011:20:08 PM | 68.675 | 151.138 | 33.012 | 74.412 |
| 2016-03-011:20:12 PM | 68.675 | 151.025 | 33.012 | 74.412 |
| 2016-03-011:20:16 PM | 68.675 | 151.025 | 33.012 | 74.412 |
| 2016-03-011:20:20 PM | 68.788 | 151.025 | 33.125 | 74.412 |
| 2016-03-011:20:24 PM | 68.675 | 150.912 | 33.35 | 74.412 |
| 2016-03-011:20:28 PM | 68.675 | 150.912 | 33.462 | 74.412 |
| 2016-03-011:20:32 PM | 68.675 | 150.8 | 33.35 | 74.412 |
| 2016-03-011:20:36 PM | 68.788 | 150.8 | 33.125 | 74.412 |
| 2016-03-011:20:41 PM | 68.788 | 150.8 | 32.788 | 74.412 |
| 2016-03-011:20:45 PM | 68.788 | 150.688 | 32.562 | 74.412 |
| 2016-03-011:20:49 PM | 68.788 | 150.688 | 32.562 | 74.412 |
| 2016-03-011:20:53 PM | 68.788 | 150.688 | 32.338 | 74.412 |
| 2016-03-011:20:57 PM | 68.788 | 150.688 | 32.338 | 74.412 |
| 2016-03-011:21:01 PM | 68.788 | 150.575 | 32.225 | 74.412 |
| 2016-03-011:21:05 PM | 68.788 | 150.575 | 32.338 | 74.412 |
| 2016-03-011:21:09 PM | 68.788 | 150.575 | 32.338 | 74.412 |
| 2016-03-011:21:13 PM | 68.675 | 150.462 | 32.45 | 74.412 |
| 2016-03-011:21:17 PM | 68.675 | 150.462 | 32.338 | 74.412 |
| 2016-03-011:21:21 PM | 68.675 | 150.462 | 32.45 | 74.412 |
| 2016-03-011:21:25 PM | 68.675 | 150.462 | 32.562 | 74.412 |
| 2016-03-011:21:29 PM | 68.675 | 150.575 | 32.788 | 74.412 |
| 2016-03-011:21:33 PM | 68.675 | 150.462 | 32.788 | 74.412 |
| 2016-03-011:21:37 PM | 68.675 | 150.575 | 32.788 | 74.412 |
| 2016-03-011:21:41 PM | 68.675 | 150.575 | 32.9 | 74.412 |
| 2016-03-011:21:45 PM | 68.562 | 150.575 | 32.9 | 74.412 |
| 2016-03-011:21:49 PM | 68.675 | 150.462 | 32.788 | 74.412 |
| 2016-03-011:21:53 PM | 68.675 | 150.462 | 32.788 | 74.412 |
| 2016-03-011:21:57 PM | 68.675 | 150.462 | 32.788 | 74.412 |
| 2016-03-011:22:01 PM | 68.562 | 150.35 | 32.788 | 74.525 |
| 2016-03-011:22:05 PM | 68.675 | 150.35 | 32.675 | 74.412 |
| 2016-03-011:22:09 PM | 68.675 | 150.238 | 32.675 | 74.525 |
| 2016-03-011:22:13 PM | 68.675 | 150.238 | 32.675 | 74.412 |
| 2016-03-011:22:17 PM | 68.675 | 150.238 | 32.45 | 74.412 |
| 2016-03-011:22:21 PM | 68.675 | 150.238 | 32.45 | 74.412 |
| 2016-03-011:22:25 PM | 68.675 | 150.238 | 32.45 | 74.412 |
| 2016-03-011:22:29 PM | 68.675 | 150.125 | 32.562 | 74.412 |
| 2016-03-011:22:33 PM | 68.562 | 150.125 | 32.675 | 74.412 |
| 2016-03-011:22:37 PM | 68.675 | 150.013 | 32.675 | 74.412 |
| 2016-03-011:22:41 PM | 68.675 | 150.013 | 32.562 | 74.412 |
| 2016-03-011:22:46 PM | 68.562 | 150.013 | 32.562 | 74.412 |
| 2016-03-011:22:50 PM | 68.562 | 149.9 | 32.45 | 74.412 |
| 2016-03-011:22:54 PM | 68.675 | 149.9 | 32.45 | 74.412 |
| 2016-03-011:22:58 PM | 68.562 | 149.9 | 32.562 | 74.412 |
| 2016-03-011:23:02 PM | 68.675 | 149.788 | 32.675 | 74.412 |
| 2016-03-011:23:06 PM | 68.675 | 149.788 | 32.675 | 74.412 |
| 2016-03-011:23:10 PM | 68.562 | 149.788 | 32.675 | 74.412 |
| 2016-03-011:23:14 PM | 68.562 | 149.788 | 32.788 | 74.412 |
| 2016-03-011:23:18 PM | 68.562 | 149.9 | 32.9 | 74.412 |
| 2016-03-011:23:22 PM | 68.562 | 149.788 | 33.012 | 74.412 |
| 2016-03-011:23:26 PM | 68.675 | 149.9 | 33.125 | 74.3 |
| 2016-03-011:23:30 PM | 68.562 | 149.9 | 33.012 | 74.412 |
| 2016-03-011:23:34 PM | 68.562 | 149.9 | 33.125 | 74.3 |
| 2016-03-011:23:38 PM | 68.675 | 149.9 | 33.238 | 74.3 |
| 2016-03-011:23:42 PM | 68.562 | 149.788 | 33.238 | 74.3 |
| 2016-03-011:23:46 PM | 68.562 | 149.9 | 33.238 | 74.3 |
| 2016-03-011:23:50 PM | 68.675 | 149.9 | 33.238 | 74.3 |
| 2016-03-011:23:54 PM | 68.562 | 149.9 | 33.125 | 74.3 |
| 2016-03-011:23:58 PM | 68.562 | 149.788 | 33.012 | 74.3 |
| 2016-03-011:24:02 PM | 68.675 | 149.788 | 33.125 | 74.3 |
| 2016-03-011:24:06 PM | 68.562 | 149.788 | 33.238 | 74.3 |
| 2016-03-011:24:10 PM | 68.562 | 149.788 | 33.238 | 74.3 |
| 2016-03-011:24:14 PM | 68.562 | 149.788 | 33.238 | 74.3 |
| 2016-03-011:24:18 PM | 68.562 | 149.675 | 33.125 | 74.3 |
| 2016-03-011:24:22 PM | 68.562 | 149.675 | 33.125 | 74.3 |
| 2016-03-011:24:26 PM | 68.562 | 149.562 | 33.125 | 74.3 |
| 2016-03-011:24:30 PM | 68.675 | 149.562 | 33.012 | 74.3 |
| 2016-03-011:24:34 PM | 68.675 | 149.562 | 33.012 | 74.3 |
| 2016-03-011:24:38 PM | 68.675 | 149.562 | 32.9 | 74.3 |
| 2016-03-011:24:42 PM | 68.675 | 149.562 | 32.9 | 74.3 |
| 2016-03-011:24:46 PM | 68.562 | 149.562 | 32.9 | 74.3 |
| 2016-03-011:24:50 PM | 68.562 | 149.562 | 33.012 | 74.3 |
| 2016-03-011:24:54 PM | 68.562 | 149.562 | 33.125 | 74.3 |
| 2016-03-011:24:59 PM | 68.562 | 149.562 | 33.125 | 74.3 |
| 2016-03-011:25:03 PM | 68.562 | 149.562 | 33.012 | 74.3 |
| 2016-03-011:25:07 PM | 68.562 | 149.562 | 32.9 | 74.3 |
| 2016-03-011:25:11 PM | 68.562 | 149.562 | 32.675 | 74.3 |
| 2016-03-011:25:15 PM | 68.562 | 149.562 | 32.45 | 74.3 |
| 2016-03-011:25:19 PM | 68.562 | 149.675 | 32.338 | 74.3 |
| 2016-03-011:25:23 PM | 68.562 | 149.675 | 32.45 | 74.188 |
| 2016-03-011:25:27 PM | 68.562 | 149.562 | 32.45 | 74.3 |
| 2016-03-011:25:31 PM | 68.562 | 149.675 | 32.338 | 74.3 |
| 2016-03-011:25:35 PM | 68.562 | 149.562 | 32.225 | 74.188 |
| 2016-03-011:25:39 PM | 68.562 | 149.562 | 32.338 | 74.3 |
| 2016-03-011:25:43 PM | 68.562 | 149.675 | 32.45 | 74.3 |
| 2016-03-011:25:51 PM | 68.562 | 149.675 | 32.675 | 74.188 |
| 2016-03-011:25:55 PM | 68.562 | 149.675 | 32.788 | 74.3 |
| 2016-03-011:25:59 PM | 68.562 | 149.562 | 33.012 | 74.188 |
| 2016-03-011:26:03 PM | 68.562 | 149.562 | 33.012 | 74.3 |
| 2016-03-011:26:07 PM | 68.562 | 149.562 | 32.9 | 74.188 |
| 2016-03-011:26:11 PM | 68.562 | 149.562 | 32.9 | 74.188 |
| 2016-03-011:26:15 PM | 68.45 | 149.562 | 32.788 | 74.188 |
| 2016-03-011:26:19 PM | 68.562 | 149.562 | 32.562 | 74.188 |
| 2016-03-011:26:23 PM | 68.562 | 149.562 | 32.562 | 74.188 |
| 2016-03-011:26:27 PM | 68.562 | 149.562 | 32.562 | 74.188 |
| 2016-03-011:26:31 PM | 68.562 | 149.562 | 32.45 | 74.188 |
| 2016-03-011:26:35 PM | 68.562 | 149.562 | 32.338 | 74.188 |
| 2016-03-011:26:39 PM | 68.562 | 149.562 | 32.225 | 74.188 |
| 2016-03-011:26:43 PM | 68.562 | 149.562 | 32.112 | 74.188 |
| 2016-03-011:26:47 PM | 68.562 | 149.562 | 32.112 | 74.188 |
| 2016-03-011:26:51 PM | 68.562 | 149.562 | 32 | 74.188 |
| 2016-03-011:26:55 PM | 68.562 | 149.562 | 32.112 | 74.188 |
| 2016-03-011:26:59 PM | 68.45 | 149.562 | 32.112 | 74.188 |
| 2016-03-011:27:04 PM | 68.562 | 149.562 | 32.225 | 74.188 |
| 2016-03-011:27:08 PM | 68.562 | 149.562 | 32.338 | 74.188 |
| 2016-03-011:27:12 PM | 68.45 | 149.562 | 32.45 | 74.188 |
| 2016-03-011:27:16 PM | 68.45 | 149.675 | 32.562 | 74.188 |
| 2016-03-011:27:20 PM | 68.45 | 149.562 | 32.562 | 74.188 |
| 2016-03-011:27:24 PM | 68.45 | 149.562 | 32.45 | 74.188 |
| 2016-03-011:27:28 PM | 68.45 | 149.562 | 32.338 | 74.188 |
| 2016-03-011:27:32 PM | 68.45 | 149.45 | 32.562 | 74.3 |
| 2016-03-011:27:36 PM | 68.45 | 149.45 | 32.45 | 74.188 |
| 2016-03-011:27:40 PM | 68.45 | 149.562 | 32.45 | 74.3 |
| 2016-03-011:27:44 PM | 68.562 | 149.562 | 32.338 | 74.3 |
| 2016-03-011:27:48 PM | 68.562 | 149.562 | 32.338 | 74.3 |
| 2016-03-011:27:52 PM | 68.45 | 149.562 | 32.45 | 74.3 |
| 2016-03-011:27:56 PM | 68.45 | 149.562 | 32.45 | 74.3 |
| 2016-03-011:28:00 PM | 68.45 | 149.562 | 32.562 | 74.3 |
| 2016-03-011:28:04 PM | 68.45 | 149.45 | 32.45 | 74.3 |
| 2016-03-011:28:08 PM | 68.45 | 149.45 | 32.45 | 74.3 |
| 2016-03-011:28:12 PM | 68.45 | 149.45 | 32.338 | 74.3 |
| 2016-03-011:28:16 PM | 68.45 | 149.45 | 32.112 | 74.3 |
| 2016-03-011:28:20 PM | 68.45 | 149.45 | 31.888 | 74.3 |
| 2016-03-011:28:24 PM | 68.45 | 149.45 | 31.888 | 74.412 |
| 2016-03-011:28:28 PM | 68.45 | 149.45 | 31.888 | 74.412 |
| 2016-03-011:28:32 PM | 68.45 | 149.562 | 31.888 | 74.3 |
| 2016-03-011:28:36 PM | 68.45 | 149.45 | 31.775 | 74.412 |
| 2016-03-011:28:40 PM | 68.45 | 149.45 | 31.775 | 74.412 |
| 2016-03-011:28:44 PM | 68.45 | 149.45 | 31.888 | 74.412 |
| 2016-03-011:28:48 PM | 68.45 | 149.45 | 31.888 | 74.412 |
| 2016-03-011:28:52 PM | 68.45 | 149.45 | 31.888 | 74.3 |
| 2016-03-011:28:56 PM | 68.45 | 149.45 | 31.888 | 74.412 |
| 2016-03-011:29:00 PM | 68.45 | 149.45 | 31.662 | 74.3 |
| 2016-03-011:29:04 PM | 68.45 | 149.45 | 31.662 | 74.3 |
| 2016-03-011:29:09 PM | 68.45 | 149.338 | 31.662 | 74.3 |
| 2016-03-011:29:13 PM | 68.45 | 149.45 | 31.662 | 74.3 |
| 2016-03-011:29:17 PM | 68.45 | 149.45 | 31.888 | 74.3 |
| 2016-03-011:29:21 PM | 68.45 | 149.338 | 32 | 74.3 |
| 2016-03-011:29:25 PM | 68.45 | 149.338 | 32.112 | 74.3 |
| 2016-03-011:29:29 PM | 68.562 | 149.338 | 32.112 | 74.3 |
| 2016-03-011:29:33 PM | 68.45 | 149.45 | 32 | 74.3 |
| 2016-03-011:29:37 PM | 68.562 | 149.338 | 31.775 | 74.3 |
| 2016-03-011:29:41 PM | 68.562 | 149.338 | 31.662 | 74.3 |
| 2016-03-011:29:45 PM | 68.562 | 149.338 | 31.438 | 74.3 |
| 2016-03-011:29:49 PM | 68.562 | 149.225 | 31.325 | 74.3 |
| 2016-03-011:29:53 PM | 68.562 | 149.225 | 31.325 | 74.3 |
| 2016-03-011:29:57 PM | 68.562 | 149.225 | 31.438 | 74.3 |
| 2016-03-011:30:01 PM | 68.562 | 149.225 | 31.55 | 74.3 |
| 2016-03-011:30:05 PM | 68.562 | 149.225 | 31.662 | 74.3 |
| 2016-03-011:30:09 PM | 68.562 | 149.112 | 31.662 | 74.3 |
| 2016-03-011:30:13 PM | 68.562 | 149.112 | 31.775 | 74.3 |
| 2016-03-011:30:17 PM | 68.562 | 149 | 31.888 | 74.3 |
| 2016-03-011:30:21 PM | 68.562 | 149 | 31.775 | 74.3 |
| 2016-03-011:30:25 PM | 68.562 | 149 | 31.662 | 74.3 |
| 2016-03-011:30:29 PM | 68.562 | 148.888 | 31.775 | 74.3 |
| 2016-03-011:30:33 PM | 68.562 | 148.775 | 31.888 | 74.3 |
| 2016-03-011:30:37 PM | 68.562 | 148.775 | 31.888 | 74.3 |
| 2016-03-011:30:41 PM | 68.562 | 148.775 | 32 | 74.3 |
| 2016-03-011:30:45 PM | 68.562 | 148.775 | 32.112 | 74.3 |
| 2016-03-011:30:49 PM | 68.562 | 148.662 | 32.225 | 74.3 |
| 2016-03-011:30:53 PM | 68.562 | 148.662 | 32.45 | 74.3 |
| 2016-03-011:30:57 PM | 68.562 | 148.662 | 32.562 | 74.3 |
| 2016-03-011:31:01 PM | 68.562 | 148.55 | 32.675 | 74.188 |
| 2016-03-011:31:05 PM | 68.562 | 148.55 | 32.675 | 74.3 |
| 2016-03-011:31:09 PM | 68.45 | 148.55 | 32.788 | 74.3 |
| 2016-03-011:31:13 PM | 68.562 | 148.662 | 32.562 | 74.3 |
| 2016-03-011:31:17 PM | 68.562 | 148.55 | 32.225 | 74.3 |
| 2016-03-011:31:22 PM | 68.562 | 148.662 | 32.112 | 74.3 |
| 2016-03-011:31:26 PM | 68.45 | 148.662 | 32.112 | 74.3 |
| 2016-03-011:31:30 PM | 68.562 | 148.55 | 32.225 | 74.3 |
| 2016-03-011:31:34 PM | 68.562 | 148.662 | 32.225 | 74.3 |
| 2016-03-011:31:38 PM | 68.562 | 148.55 | 32.45 | 74.188 |
| 2016-03-011:31:42 PM | 68.562 | 148.55 | 32.45 | 74.3 |
| 2016-03-011:31:46 PM | 68.562 | 148.55 | 32.45 | 74.188 |
| 2016-03-011:31:50 PM | 68.562 | 148.438 | 32.562 | 74.3 |
| 2016-03-011:31:54 PM | 68.562 | 148.438 | 32.675 | 74.3 |
| 2016-03-011:31:58 PM | 68.562 | 148.438 | 32.675 | 74.3 |
| 2016-03-011:32:02 PM | 68.562 | 148.325 | 32.338 | 74.3 |
| 2016-03-011:32:06 PM | 68.675 | 148.325 | 32.225 | 74.3 |
| 2016-03-011:32:10 PM | 68.675 | 148.212 | 32.112 | 74.3 |
| 2016-03-011:32:14 PM | 68.675 | 148.212 | 32.112 | 74.3 |
| 2016-03-011:32:18 PM | 68.675 | 148.212 | 32.225 | 74.3 |
| 2016-03-011:32:22 PM | 68.675 | 148.1 | 32.338 | 74.3 |
| 2016-03-011:32:26 PM | 68.675 | 148.212 | 32.45 | 74.3 |
| 2016-03-011:32:30 PM | 68.675 | 148.212 | 32.45 | 74.412 |
| 2016-03-011:32:34 PM | 68.675 | 148.212 | 32.562 | 74.3 |
| 2016-03-011:32:38 PM | 68.675 | 148.1 | 32.45 | 74.412 |
| 2016-03-011:32:42 PM | 68.675 | 148.1 | 32.45 | 74.412 |
| 2016-03-011:32:46 PM | 68.562 | 148.1 | 32.562 | 74.412 |
| 2016-03-011:32:50 PM | 68.675 | 148.1 | 32.45 | 74.412 |
| 2016-03-011:32:54 PM | 68.562 | 148.1 | 32.45 | 74.412 |
| 2016-03-011:32:58 PM | 68.562 | 148.1 | 32.45 | 74.412 |
| 2016-03-011:33:02 PM | 68.562 | 148.1 | 32.45 | 74.412 |
| 2016-03-011:33:06 PM | 68.562 | 147.988 | 32.45 | 74.412 |
| 2016-03-011:33:10 PM | 68.562 | 147.988 | 32.45 | 74.412 |
| 2016-03-011:33:14 PM | 68.562 | 147.988 | 32.45 | 74.412 |
| 2016-03-011:33:18 PM | 68.562 | 147.988 | 32.562 | 74.3 |
| 2016-03-011:33:22 PM | 68.562 | 147.988 | 32.562 | 74.412 |
| 2016-03-011:33:26 PM | 68.562 | 147.988 | 32.788 | 74.3 |
| 2016-03-011:33:31 PM | 68.562 | 147.988 | 32.9 | 74.3 |
| 2016-03-011:33:35 PM | 68.562 | 147.988 | 32.9 | 74.3 |
| 2016-03-011:33:39 PM | 68.562 | 147.988 | 32.9 | 74.3 |
| 2016-03-011:33:43 PM | 68.562 | 148.1 | 33.012 | 74.3 |
| 2016-03-011:33:47 PM | 68.562 | 148.1 | 33.125 | 74.3 |
| 2016-03-011:33:51 PM | 68.562 | 148.1 | 33.125 | 74.3 |
| 2016-03-011:33:55 PM | 68.45 | 148.1 | 33.35 | 74.3 |
| 2016-03-011:33:59 PM | 68.45 | 148.1 | 33.238 | 74.3 |
| 2016-03-011:34:03 PM | 68.45 | 148.1 | 33.238 | 74.3 |
| 2016-03-011:34:07 PM | 68.45 | 148.1 | 33.35 | 74.3 |
| 2016-03-011:34:11 PM | 68.45 | 148.212 | 33.35 | 74.3 |
| 2016-03-011:34:15 PM | 68.45 | 148.212 | 33.238 | 74.3 |
| 2016-03-011:34:19 PM | 68.45 | 148.212 | 33.125 | 74.3 |
| 2016-03-011:34:23 PM | 68.45 | 148.212 | 33.125 | 74.3 |
| 2016-03-011:34:27 PM | 68.45 | 148.325 | 33.238 | 74.412 |
| 2016-03-011:34:31 PM | 68.45 | 148.325 | 33.238 | 74.412 |
| 2016-03-011:34:35 PM | 68.45 | 148.325 | 33.35 | 74.3 |
| 2016-03-011:34:39 PM | 68.45 | 148.438 | 33.462 | 74.3 |
| 2016-03-011:34:43 PM | 68.45 | 148.438 | 33.688 | 74.412 |
| 2016-03-011:34:47 PM | 68.45 | 148.438 | 33.8 | 74.3 |
| 2016-03-011:34:51 PM | 68.45 | 148.55 | 33.912 | 74.3 |
| 2016-03-011:34:55 PM | 68.45 | 148.55 | 34.025 | 74.3 |
| 2016-03-011:34:59 PM | 68.45 | 148.55 | 34.025 | 74.3 |
| 2016-03-011:35:03 PM | 68.45 | 148.55 | 34.138 | 74.3 |
| 2016-03-011:35:07 PM | 68.45 | 148.55 | 34.138 | 74.3 |
| 2016-03-011:35:11 PM | 68.45 | 148.662 | 34.25 | 74.3 |
| 2016-03-011:35:15 PM | 68.45 | 148.662 | 34.138 | 74.3 |
| 2016-03-011:35:19 PM | 68.45 | 148.662 | 34.25 | 74.3 |
| 2016-03-011:35:23 PM | 68.45 | 148.775 | 34.362 | 74.3 |
| 2016-03-011:35:27 PM | 68.338 | 148.662 | 34.475 | 74.3 |
| 2016-03-011:35:31 PM | 68.45 | 148.775 | 34.588 | 74.3 |
| 2016-03-011:35:35 PM | 68.45 | 148.775 | 34.475 | 74.3 |
| 2016-03-011:35:39 PM | 68.45 | 148.775 | 34.475 | 74.3 |
| 2016-03-011:35:43 PM | 68.45 | 148.775 | 34.475 | 74.3 |
| 2016-03-011:35:48 PM | 68.45 | 148.775 | 34.25 | 74.3 |
| 2016-03-011:35:52 PM | 68.45 | 148.775 | 34.138 | 74.3 |
| 2016-03-011:35:56 PM | 68.45 | 148.775 | 34.025 | 74.3 |
| 2016-03-011:36:00 PM | 68.45 | 148.775 | 33.912 | 74.3 |
| 2016-03-011:36:04 PM | 68.45 | 148.775 | 33.912 | 74.3 |
| 2016-03-011:36:08 PM | 68.562 | 148.775 | 33.8 | 74.3 |
| 2016-03-011:36:12 PM | 68.562 | 148.775 | 33.912 | 74.3 |
| 2016-03-011:36:16 PM | 68.562 | 148.775 | 34.025 | 74.3 |
| 2016-03-011:36:20 PM | 68.562 | 148.775 | 34.025 | 74.3 |
| 2016-03-011:36:24 PM | 68.562 | 148.775 | 34.025 | 74.3 |
| 2016-03-011:36:28 PM | 68.562 | 148.775 | 34.138 | 74.3 |
| 2016-03-011:36:32 PM | 68.562 | 148.775 | 33.912 | 74.3 |
| 2016-03-011:36:36 PM | 68.675 | 148.775 | 33.575 | 74.3 |
| 2016-03-011:36:40 PM | 68.562 | 148.775 | 33.35 | 74.3 |
| 2016-03-011:36:44 PM | 68.562 | 148.775 | 33.238 | 74.3 |
| 2016-03-011:36:48 PM | 68.675 | 148.775 | 33.125 | 74.3 |
| 2016-03-011:36:52 PM | 68.562 | 148.775 | 33.125 | 74.3 |
| 2016-03-011:36:56 PM | 68.675 | 148.662 | 33.125 | 74.3 |
| 2016-03-011:37:00 PM | 68.562 | 148.662 | 33.125 | 74.3 |
| 2016-03-011:37:04 PM | 68.675 | 148.662 | 33.238 | 74.3 |
| 2016-03-011:37:08 PM | 68.675 | 148.662 | 33.35 | 74.188 |
| 2016-03-011:37:12 PM | 68.562 | 148.662 | 33.462 | 74.188 |
| 2016-03-011:37:16 PM | 68.562 | 148.662 | 33.462 | 74.3 |
| 2016-03-011:37:21 PM | 68.562 | 148.662 | 33.462 | 74.3 |
| 2016-03-011:37:25 PM | 68.562 | 148.662 | 33.462 | 74.3 |
| 2016-03-011:37:29 PM | 68.562 | 148.662 | 33.35 | 74.3 |
| 2016-03-011:37:33 PM | 68.562 | 148.662 | 33.35 | 74.3 |
| 2016-03-011:37:37 PM | 68.562 | 148.55 | 33.238 | 74.3 |
| 2016-03-011:37:41 PM | 68.562 | 148.55 | 33.238 | 74.3 |
| 2016-03-011:37:45 PM | 68.562 | 148.55 | 33.125 | 74.3 |
| 2016-03-011:37:49 PM | 68.562 | 148.55 | 32.788 | 74.3 |
| 2016-03-011:37:53 PM | 68.562 | 148.55 | 32.562 | 74.3 |
| 2016-03-011:37:57 PM | 68.45 | 148.55 | 32.45 | 74.3 |
| 2016-03-011:38:01 PM | 68.45 | 148.55 | 32.338 | 74.3 |
| 2016-03-011:38:05 PM | 68.45 | 148.438 | 32.45 | 74.3 |
| 2016-03-011:38:09 PM | 68.45 | 148.438 | 32.45 | 74.3 |
| 2016-03-011:38:13 PM | 68.562 | 148.438 | 32.562 | 74.3 |
| 2016-03-011:38:17 PM | 68.45 | 148.325 | 32.562 | 74.3 |
| 2016-03-011:38:21 PM | 68.45 | 148.325 | 32.45 | 74.3 |
| 2016-03-011:38:25 PM | 68.45 | 148.325 | 32.338 | 74.3 |
| 2016-03-011:38:29 PM | 68.45 | 148.212 | 32.225 | 74.3 |
| 2016-03-011:38:33 PM | 68.45 | 148.212 | 32.112 | 74.3 |
| 2016-03-011:38:37 PM | 68.45 | 148.212 | 32 | 74.3 |
| 2016-03-011:38:41 PM | 68.45 | 148.212 | 32 | 74.3 |
| 2016-03-011:38:45 PM | 68.45 | 148.1 | 32.112 | 74.188 |
| 2016-03-011:38:49 PM | 68.45 | 148.1 | 32.112 | 74.188 |
| 2016-03-011:38:53 PM | 68.45 | 148.1 | 31.888 | 74.188 |
| 2016-03-011:38:57 PM | 68.45 | 147.988 | 31.775 | 74.188 |
| 2016-03-011:39:01 PM | 68.45 | 147.988 | 31.662 | 74.3 |
| 2016-03-011:39:05 PM | 68.45 | 147.988 | 31.55 | 74.188 |
| 2016-03-011:39:09 PM | 68.338 | 147.988 | 31.55 | 74.188 |
| 2016-03-011:39:13 PM | 68.338 | 147.988 | 31.662 | 74.188 |
| 2016-03-011:39:17 PM | 68.338 | 147.875 | 31.775 | 74.188 |
| 2016-03-011:39:21 PM | 68.45 | 147.988 | 32 | 74.3 |
| 2016-03-011:39:25 PM | 68.45 | 147.875 | 32.112 | 74.188 |
| 2016-03-011:39:30 PM | 68.45 | 147.875 | 32.225 | 74.188 |
| 2016-03-011:39:34 PM | 68.338 | 147.875 | 32.338 | 74.188 |
| 2016-03-011:39:38 PM | 68.338 | 147.875 | 32.338 | 74.188 |
| 2016-03-011:39:42 PM | 68.45 | 147.875 | 32.338 | 74.188 |
| 2016-03-011:39:46 PM | 68.338 | 147.875 | 32.338 | 74.188 |
| 2016-03-011:39:50 PM | 68.338 | 147.763 | 32.338 | 74.188 |
| 2016-03-011:39:54 PM | 68.338 | 147.875 | 32.45 | 74.188 |
| 2016-03-011:39:58 PM | 68.338 | 147.875 | 32.45 | 74.188 |
| 2016-03-011:40:02 PM | 68.338 | 147.763 | 32.562 | 74.188 |
| 2016-03-011:40:06 PM | 68.338 | 147.763 | 32.562 | 74.188 |
| 2016-03-011:40:10 PM | 68.338 | 147.763 | 32.788 | 74.188 |
| 2016-03-011:40:14 PM | 68.45 | 147.763 | 32.9 | 74.188 |
| 2016-03-011:40:18 PM | 68.45 | 147.763 | 32.9 | 74.188 |
| 2016-03-011:40:22 PM | 68.338 | 147.763 | 33.012 | 74.188 |
| 2016-03-011:40:26 PM | 68.338 | 147.65 | 33.125 | 74.188 |
| 2016-03-011:40:30 PM | 68.338 | 147.763 | 33.125 | 74.188 |
| 2016-03-011:40:34 PM | 68.45 | 147.65 | 33.125 | 74.188 |
| 2016-03-011:40:38 PM | 68.45 | 147.65 | 33.125 | 74.188 |
| 2016-03-011:40:42 PM | 68.338 | 147.763 | 33.125 | 74.188 |
| 2016-03-011:40:47 PM | 68.45 | 147.763 | 33.125 | 74.188 |
| 2016-03-011:40:51 PM | 68.338 | 147.763 | 33.012 | 74.188 |
| 2016-03-011:40:55 PM | 68.338 | 147.763 | 32.9 | 74.188 |
| 2016-03-011:40:59 PM | 68.45 | 147.65 | 32.9 | 74.188 |
| 2016-03-011:41:04 PM | 68.45 | 147.763 | 32.675 | 74.188 |
| 2016-03-011:41:08 PM | 68.45 | 147.763 | 32.675 | 74.075 |
| 2016-03-011:41:12 PM | 68.45 | 147.763 | 32.562 | 74.075 |
| 2016-03-011:41:15 PM | 68.45 | 147.763 | 32.338 | 74.075 |
| 2016-03-011:41:19 PM | 68.45 | 147.763 | 32.338 | 74.075 |
| 2016-03-011:41:23 PM | 68.45 | 147.763 | 32.225 | 74.188 |
| 2016-03-011:41:27 PM | 68.45 | 147.763 | 32.225 | 74.075 |
| 2016-03-011:41:31 PM | 68.562 | 147.65 | 32.225 | 74.075 |
| 2016-03-011:41:35 PM | 68.562 | 147.65 | 32.225 | 74.188 |
| 2016-03-011:41:39 PM | 68.675 | 147.65 | 32.225 | 74.075 |
| 2016-03-011:41:43 PM | 68.675 | 147.65 | 32.338 | 74.075 |
| 2016-03-011:41:47 PM | 68.675 | 147.65 | 32.338 | 74.075 |
| 2016-03-011:41:51 PM | 68.788 | 147.65 | 32.45 | 74.075 |
| 2016-03-011:41:55 PM | 68.788 | 147.65 | 32.45 | 74.075 |
| 2016-03-011:41:59 PM | 68.788 | 147.65 | 32.562 | 74.075 |
| 2016-03-011:42:03 PM | 68.788 | 147.763 | 32.675 | 74.075 |
| 2016-03-011:42:07 PM | 68.788 | 147.763 | 32.45 | 74.075 |
| 2016-03-011:42:11 PM | 68.788 | 147.763 | 32.338 | 74.075 |
| 2016-03-011:42:15 PM | 68.788 | 147.763 | 32.338 | 73.962 |
| 2016-03-011:42:19 PM | 68.675 | 147.65 | 32.45 | 73.962 |
| 2016-03-011:42:23 PM | 68.675 | 147.65 | 32.338 | 73.962 |
| 2016-03-011:42:27 PM | 68.675 | 147.65 | 32.45 | 73.962 |
| 2016-03-011:42:31 PM | 68.675 | 147.65 | 32.675 | 73.962 |
| 2016-03-011:42:35 PM | 68.675 | 147.65 | 32.788 | 73.962 |
| 2016-03-011:42:39 PM | 68.675 | 147.538 | 32.788 | 73.962 |
| 2016-03-011:42:43 PM | 68.675 | 147.425 | 32.9 | 73.962 |
| 2016-03-011:42:47 PM | 68.675 | 147.425 | 32.9 | 73.962 |
| 2016-03-011:42:52 PM | 68.675 | 147.425 | 32.9 | 73.962 |
| 2016-03-011:42:56 PM | 68.562 | 147.312 | 32.9 | 73.962 |
| 2016-03-011:43:00 PM | 68.562 | 147.312 | 33.012 | 73.962 |
| 2016-03-011:43:04 PM | 68.562 | 147.2 | 32.9 | 73.85 |
| 2016-03-011:43:08 PM | 68.562 | 147.2 | 32.9 | 73.85 |
| 2016-03-011:43:12 PM | 68.675 | 147.2 | 33.012 | 73.962 |
| 2016-03-011:43:16 PM | 68.675 | 147.2 | 33.012 | 73.85 |
| 2016-03-011:43:20 PM | 68.562 | 147.088 | 32.9 | 73.85 |
| 2016-03-011:43:24 PM | 68.562 | 147.088 | 32.9 | 73.85 |
| 2016-03-011:43:28 PM | 68.562 | 146.975 | 33.012 | 73.85 |
| 2016-03-011:43:32 PM | 68.562 | 146.975 | 33.012 | 73.85 |
| 2016-03-011:43:36 PM | 68.562 | 146.975 | 33.125 | 73.85 |
| 2016-03-011:43:40 PM | 68.45 | 146.862 | 33.125 | 73.85 |
| 2016-03-011:43:44 PM | 68.562 | 146.862 | 33.012 | 73.85 |
| 2016-03-011:43:48 PM | 68.562 | 146.862 | 32.9 | 73.85 |
| 2016-03-011:43:52 PM | 68.45 | 146.75 | 32.9 | 73.85 |
| 2016-03-011:43:56 PM | 68.45 | 146.75 | 32.9 | 73.85 |
| 2016-03-011:44:00 PM | 68.45 | 146.638 | 32.9 | 73.85 |
| 2016-03-011:44:04 PM | 68.45 | 146.638 | 32.9 | 73.85 |
| 2016-03-011:44:08 PM | 68.45 | 146.638 | 33.012 | 73.85 |
| 2016-03-011:44:12 PM | 68.45 | 146.525 | 32.9 | 73.85 |
| 2016-03-011:44:16 PM | 68.45 | 146.525 | 33.012 | 73.85 |
| 2016-03-011:44:20 PM | 68.45 | 146.525 | 33.238 | 73.85 |
| 2016-03-011:44:24 PM | 68.45 | 146.525 | 33.35 | 73.85 |
| 2016-03-011:44:28 PM | 68.338 | 146.412 | 33.462 | 73.85 |
| 2016-03-011:44:33 PM | 68.338 | 146.412 | 33.575 | 73.85 |
| 2016-03-011:44:37 PM | 68.338 | 146.412 | 33.575 | 73.85 |
| 2016-03-011:44:41 PM | 68.338 | 146.412 | 33.575 | 73.85 |
| 2016-03-011:44:45 PM | 68.338 | 146.3 | 33.575 | 73.85 |
| 2016-03-011:44:49 PM | 68.45 | 146.3 | 33.688 | 73.85 |
| 2016-03-011:44:53 PM | 68.338 | 146.188 | 33.688 | 73.85 |
| 2016-03-011:44:57 PM | 68.338 | 146.188 | 33.575 | 73.85 |
| 2016-03-011:45:01 PM | 68.338 | 146.188 | 33.462 | 73.85 |
| 2016-03-011:45:05 PM | 68.338 | 146.188 | 33.462 | 73.85 |
| 2016-03-011:45:09 PM | 68.338 | 146.188 | 33.35 | 73.85 |
| 2016-03-011:45:13 PM | 68.338 | 146.075 | 33.35 | 73.85 |
| 2016-03-011:45:17 PM | 68.45 | 146.188 | 33.462 | 73.85 |
| 2016-03-011:45:21 PM | 68.45 | 146.075 | 33.575 | 73.85 |
| 2016-03-011:45:25 PM | 68.338 | 146.075 | 33.688 | 73.85 |
| 2016-03-011:45:29 PM | 68.225 | 146.075 | 33.8 | 73.85 |
| 2016-03-011:45:33 PM | 68.225 | 146.075 | 33.912 | 73.85 |
| 2016-03-011:45:37 PM | 68.225 | 146.188 | 33.912 | 73.85 |
| 2016-03-011:45:41 PM | 68.112 | 146.075 | 33.912 | 73.85 |
| 2016-03-011:45:45 PM | 68.112 | 146.075 | 33.912 | 73.85 |
| 2016-03-011:45:49 PM | 68.112 | 146.075 | 33.912 | 73.85 |
| 2016-03-011:45:53 PM | 68.112 | 146.075 | 33.912 | 73.738 |
| 2016-03-011:45:57 PM | 68 | 146.075 | 33.912 | 73.738 |
| 2016-03-011:46:01 PM | 68 | 146.075 | 33.912 | 73.85 |
| 2016-03-011:46:05 PM | 67.888 | 146.075 | 33.912 | 73.738 |
| 2016-03-011:46:09 PM | 67.775 | 146.075 | 34.025 | 73.738 |
| 2016-03-011:46:13 PM | 67.662 | 145.962 | 34.025 | 73.738 |
| 2016-03-011:46:17 PM | 67.55 | 145.962 | 34.138 | 73.738 |
| 2016-03-011:46:21 PM | 67.55 | 145.962 | 34.138 | 73.738 |
| 2016-03-011:46:25 PM | 67.438 | 145.962 | 34.025 | 73.738 |
| 2016-03-011:46:29 PM | 67.438 | 145.85 | 33.912 | 73.738 |
| 2016-03-011:46:33 PM | 67.325 | 145.85 | 33.8 | 73.738 |
| 2016-03-011:46:37 PM | 67.212 | 145.962 | 33.688 | 73.738 |
| 2016-03-011:46:41 PM | 67.212 | 145.85 | 33.575 | 73.738 |
| 2016-03-011:46:45 PM | 67.212 | 145.85 | 33.35 | 73.738 |
| 2016-03-011:46:49 PM | 67.212 | 145.962 | 33.35 | 73.738 |
| 2016-03-011:46:53 PM | 67.212 | 145.962 | 33.35 | 73.738 |
| 2016-03-011:46:57 PM | 67.212 | 145.85 | 33.238 | 73.738 |
| 2016-03-011:47:01 PM | 67.212 | 145.85 | 33.125 | 73.738 |
| 2016-03-011:47:05 PM | 67.212 | 145.85 | 33.125 | 73.738 |
| 2016-03-011:47:09 PM | 67.212 | 145.85 | 33.125 | 73.738 |
| 2016-03-011:47:13 PM | 67.212 | 145.85 | 33.125 | 73.738 |
| 2016-03-011:47:17 PM | 67.1 | 145.85 | 33.238 | 73.738 |
| 2016-03-011:47:21 PM | 66.988 | 145.85 | 33.238 | 73.738 |
| 2016-03-011:47:25 PM | 66.988 | 145.738 | 33.238 | 73.738 |
| 2016-03-011:47:29 PM | 66.988 | 145.738 | 33.238 | 73.738 |
| 2016-03-011:47:33 PM | 66.988 | 145.738 | 33.238 | 73.738 |
| 2016-03-011:47:37 PM | 66.988 | 145.625 | 33.125 | 73.625 |
| 2016-03-011:47:41 PM | 66.988 | 145.625 | 33.012 | 73.738 |
| 2016-03-011:47:45 PM | 66.988 | 145.625 | 33.012 | 73.738 |
| 2016-03-011:47:49 PM | 66.988 | 145.625 | 33.012 | 73.625 |
| 2016-03-011:47:53 PM | 66.988 | 145.625 | 32.788 | 73.625 |
| 2016-03-011:47:57 PM | 66.988 | 145.512 | 32.45 | 73.625 |
| 2016-03-011:48:02 PM | 66.988 | 145.512 | 32.45 | 73.625 |
| 2016-03-011:48:06 PM | 66.988 | 145.512 | 32.338 | 73.738 |
| 2016-03-011:48:12 PM | 66.988 | 145.512 | 32.112 | 73.625 |
| 2016-03-011:48:16 PM | 67.1 | 145.4 | 32.112 | 73.625 |
| 2016-03-011:48:20 PM | 66.988 | 145.4 | 32 | 73.625 |
| 2016-03-011:48:24 PM | 66.988 | 145.4 | 32 | 73.625 |
| 2016-03-011:48:29 PM | 66.988 | 145.4 | 32.112 | 73.625 |
| 2016-03-011:48:33 PM | 66.988 | 145.288 | 32.225 | 73.625 |
| 2016-03-011:48:37 PM | 66.988 | 145.288 | 32.225 | 73.625 |
| 2016-03-011:48:41 PM | 66.988 | 145.175 | 32.225 | 73.625 |
| 2016-03-011:48:45 PM | 66.988 | 145.175 | 32.225 | 73.625 |
| 2016-03-011:48:49 PM | 66.988 | 145.175 | 32.338 | 73.625 |
| 2016-03-011:48:53 PM | 67.1 | 145.175 | 32.45 | 73.625 |
| 2016-03-011:48:57 PM | 67.1 | 145.175 | 32.338 | 73.625 |
| 2016-03-011:49:01 PM | 66.988 | 145.175 | 32.562 | 73.625 |
| 2016-03-011:49:05 PM | 67.1 | 145.175 | 32.562 | 73.625 |
| 2016-03-011:49:10 PM | 67.1 | 145.175 | 32.562 | 73.625 |
| 2016-03-011:49:14 PM | 67.1 | 145.062 | 32.338 | 73.625 |
| 2016-03-011:49:18 PM | 67.1 | 144.95 | 32.225 | 73.625 |
| 2016-03-011:49:22 PM | 67.1 | 144.95 | 32.338 | 73.625 |
| 2016-03-011:49:26 PM | 66.988 | 144.838 | 32.338 | 73.625 |
| 2016-03-011:49:30 PM | 66.988 | 144.838 | 32.45 | 73.625 |
| 2016-03-011:49:34 PM | 66.762 | 144.725 | 32.45 | 73.625 |
| 2016-03-011:49:38 PM | 66.762 | 144.838 | 32.562 | 73.625 |
| 2016-03-011:49:42 PM | 66.65 | 144.725 | 32.562 | 73.512 |
| 2016-03-011:49:46 PM | 66.538 | 144.725 | 32.562 | 73.625 |
| 2016-03-011:49:51 PM | 66.425 | 144.725 | 32.45 | 73.625 |
| 2016-03-011:49:55 PM | 66.425 | 144.725 | 32.562 | 73.512 |
| 2016-03-011:50:00 PM | 66.538 | 144.612 | 32.675 | 73.512 |
| 2016-03-011:50:04 PM | 66.538 | 144.612 | 32.675 | 73.512 |
| 2016-03-011:50:08 PM | 66.425 | 144.612 | 32.675 | 73.512 |
| 2016-03-011:50:12 PM | 66.425 | 144.612 | 32.788 | 73.512 |
| 2016-03-011:50:16 PM | 66.538 | 144.612 | 32.788 | 73.512 |
| 2016-03-011:50:20 PM | 66.425 | 144.612 | 32.9 | 73.4 |
| 2016-03-011:50:24 PM | 66.425 | 144.5 | 33.012 | 73.4 |
| 2016-03-011:50:28 PM | 66.312 | 144.5 | 33.125 | 73.4 |
| 2016-03-011:50:32 PM | 66.312 | 144.5 | 33.125 | 73.4 |
| 2016-03-011:50:36 PM | 66.2 | 144.5 | 33.012 | 73.4 |
| 2016-03-011:50:40 PM | 66.2 | 144.5 | 32.9 | 73.4 |
| 2016-03-011:50:44 PM | 66.2 | 144.388 | 32.9 | 73.4 |
| 2016-03-011:50:48 PM | 66.2 | 144.5 | 33.012 | 73.4 |
| 2016-03-011:50:52 PM | 66.2 | 144.5 | 33.012 | 73.288 |
| 2016-03-011:50:56 PM | 66.088 | 144.5 | 32.9 | 73.288 |
| 2016-03-011:51:00 PM | 66.088 | 144.5 | 33.012 | 73.288 |
| 2016-03-011:51:04 PM | 66.088 | 144.5 | 32.9 | 73.288 |
| 2016-03-011:51:08 PM | 66.2 | 144.5 | 32.9 | 73.288 |
| 2016-03-011:51:12 PM | 66.2 | 144.5 | 32.788 | 73.288 |
| 2016-03-011:51:16 PM | 66.2 | 144.5 | 32.788 | 73.175 |
| 2016-03-011:51:20 PM | 66.312 | 144.5 | 32.9 | 73.175 |
| 2016-03-011:51:24 PM | 66.312 | 144.5 | 32.788 | 73.175 |
| 2016-03-011:51:28 PM | 66.312 | 144.5 | 32.788 | 73.175 |
| 2016-03-011:51:32 PM | 66.425 | 144.5 | 32.788 | 73.175 |
| 2016-03-011:51:36 PM | 66.425 | 144.5 | 32.9 | 73.175 |
| 2016-03-011:51:40 PM | 66.425 | 144.5 | 32.788 | 73.062 |
| 2016-03-011:51:44 PM | 66.538 | 144.388 | 32.9 | 73.062 |
| 2016-03-011:51:48 PM | 66.538 | 144.5 | 32.9 | 73.062 |
| 2016-03-011:51:52 PM | 66.65 | 144.388 | 33.012 | 73.062 |
| 2016-03-011:51:56 PM | 66.65 | 144.5 | 33.125 | 73.062 |
| 2016-03-011:52:00 PM | 66.65 | 144.5 | 33.238 | 72.95 |
| 2016-03-011:52:04 PM | 66.65 | 144.388 | 33.238 | 72.95 |
| 2016-03-011:52:08 PM | 66.65 | 144.5 | 33.238 | 72.95 |
| 2016-03-011:52:12 PM | 66.762 | 144.5 | 33.35 | 72.95 |
| 2016-03-011:52:16 PM | 66.762 | 144.5 | 33.238 | 72.95 |
| 2016-03-011:52:20 PM | 66.762 | 144.388 | 33.238 | 72.838 |
| 2016-03-011:52:24 PM | 66.875 | 144.388 | 33.238 | 72.838 |
| 2016-03-011:52:28 PM | 66.875 | 144.388 | 33.238 | 72.95 |
| 2016-03-011:52:32 PM | 66.875 | 144.5 | 33.35 | 72.838 |
| 2016-03-011:52:37 PM | 66.875 | 144.5 | 33.238 | 72.838 |
| 2016-03-011:52:41 PM | 66.762 | 144.5 | 33.35 | 72.838 |
| 2016-03-011:52:45 PM | 66.762 | 144.5 | 33.35 | 72.838 |
| 2016-03-011:52:49 PM | 66.875 | 144.5 | 33.575 | 72.838 |
| 2016-03-011:52:53 PM | 66.762 | 144.5 | 33.688 | 72.838 |
| 2016-03-011:52:57 PM | 66.875 | 144.612 | 33.688 | 72.838 |
| 2016-03-011:53:01 PM | 66.762 | 144.612 | 33.8 | 72.838 |
| 2016-03-011:53:05 PM | 66.875 | 144.612 | 33.8 | 72.725 |
| 2016-03-011:53:09 PM | 66.875 | 144.612 | 33.912 | 72.725 |
| 2016-03-011:53:13 PM | 66.875 | 144.612 | 34.025 | 72.725 |
| 2016-03-011:53:17 PM | 66.762 | 144.612 | 34.138 | 72.838 |
| 2016-03-011:53:21 PM | 66.762 | 144.612 | 34.362 | 72.725 |
| 2016-03-011:53:25 PM | 66.65 | 144.612 | 34.475 | 72.725 |
| 2016-03-011:53:29 PM | 66.65 | 144.612 | 34.588 | 72.725 |
| 2016-03-011:53:33 PM | 66.65 | 144.612 | 34.7 | 72.725 |
| 2016-03-011:53:37 PM | 66.65 | 144.612 | 34.7 | 72.725 |
| 2016-03-011:53:41 PM | 66.65 | 144.612 | 34.7 | 72.725 |
| 2016-03-011:53:45 PM | 66.538 | 144.612 | 34.812 | 72.725 |
| 2016-03-011:53:49 PM | 66.538 | 144.612 | 34.925 | 72.725 |
| 2016-03-011:53:53 PM | 66.425 | 144.612 | 34.925 | 72.612 |
| 2016-03-011:53:57 PM | 66.312 | 144.612 | 35.038 | 72.612 |
| 2016-03-011:54:01 PM | 66.2 | 144.725 | 35.038 | 72.612 |
| 2016-03-011:54:05 PM | 66.2 | 144.725 | 34.925 | 72.5 |
| 2016-03-011:54:09 PM | 66.2 | 144.725 | 34.7 | 72.5 |
| 2016-03-011:54:13 PM | 66.2 | 144.725 | 34.7 | 72.5 |
| 2016-03-011:54:17 PM | 66.088 | 144.725 | 34.7 | 72.5 |
| 2016-03-011:54:21 PM | 66.088 | 144.612 | 34.812 | 72.5 |
| 2016-03-011:54:25 PM | 66.088 | 144.725 | 34.7 | 72.5 |
| 2016-03-011:54:29 PM | 66.2 | 144.725 | 34.7 | 72.5 |
| 2016-03-011:54:33 PM | 66.312 | 144.725 | 34.7 | 72.5 |
| 2016-03-011:54:37 PM | 66.312 | 144.725 | 34.588 | 72.5 |
| 2016-03-011:54:41 PM | 66.425 | 144.725 | 34.588 | 72.5 |
| 2016-03-011:54:46 PM | 66.538 | 144.725 | 34.7 | 72.5 |
| 2016-03-011:54:50 PM | 66.538 | 144.725 | 34.925 | 72.5 |
| 2016-03-011:54:54 PM | 66.65 | 144.725 | 34.925 | 72.5 |
| 2016-03-011:54:58 PM | 66.65 | 144.612 | 34.925 | 72.5 |
| 2016-03-011:55:02 PM | 66.65 | 144.612 | 35.15 | 72.5 |
| 2016-03-011:55:06 PM | 66.538 | 144.612 | 35.262 | 72.388 |
| 2016-03-011:55:10 PM | 66.312 | 144.612 | 35.15 | 72.5 |
| 2016-03-011:55:14 PM | 66.088 | 144.725 | 35.15 | 72.388 |
| 2016-03-011:55:18 PM | 65.862 | 144.612 | 34.925 | 72.5 |
| 2016-03-011:55:22 PM | 65.75 | 144.612 | 34.812 | 72.388 |
| 2016-03-011:55:26 PM | 65.638 | 144.612 | 34.588 | 72.388 |
| 2016-03-011:55:30 PM | 65.412 | 144.612 | 34.362 | 72.388 |
| 2016-03-011:55:34 PM | 65.3 | 144.612 | 33.912 | 72.388 |
| 2016-03-011:55:38 PM | 65.075 | 144.612 | 33.575 | 72.388 |
| 2016-03-011:55:42 PM | 64.963 | 144.612 | 33.462 | 72.275 |
| 2016-03-011:55:46 PM | 64.738 | 144.5 | 33.238 | 72.388 |
| 2016-03-011:55:50 PM | 64.512 | 144.5 | 33.125 | 72.275 |
| 2016-03-011:55:54 PM | 64.175 | 144.5 | 32.9 | 72.388 |
| 2016-03-011:55:58 PM | 63.95 | 144.5 | 32.788 | 72.388 |
| 2016-03-011:56:02 PM | 63.725 | 144.5 | 32.562 | 72.388 |
| 2016-03-011:56:06 PM | 63.5 | 144.5 | 32.225 | 72.388 |
| 2016-03-011:56:10 PM | 63.5 | 144.5 | 32.112 | 72.388 |
| 2016-03-011:56:14 PM | 63.275 | 144.5 | 32.112 | 72.275 |
| 2016-03-011:56:18 PM | 63.05 | 144.388 | 32.112 | 72.275 |
| 2016-03-011:56:22 PM | 62.825 | 144.388 | 31.888 | 72.275 |
| 2016-03-011:56:26 PM | 62.6 | 144.388 | 31.775 | 72.275 |
| 2016-03-011:56:30 PM | 62.375 | 144.388 | 31.775 | 72.275 |
| 2016-03-011:56:34 PM | 62.15 | 144.388 | 31.775 | 72.275 |
| 2016-03-011:56:38 PM | 61.925 | 144.388 | 31.888 | 72.275 |
| 2016-03-011:56:42 PM | 61.7 | 144.275 | 31.888 | 72.388 |
| 2016-03-011:56:46 PM | 61.475 | 144.275 | 31.662 | 72.388 |
| 2016-03-011:56:50 PM | 61.25 | 144.162 | 31.325 | 72.388 |
| 2016-03-011:56:54 PM | 61.025 | 144.162 | 30.875 | 72.388 |
| 2016-03-011:56:58 PM | 60.912 | 144.162 | 30.762 | 72.388 |
| 2016-03-011:57:02 PM | 60.8 | 144.162 | 30.762 | 72.388 |
| 2016-03-011:57:07 PM | 60.575 | 144.05 | 30.762 | 72.275 |
| 2016-03-011:57:11 PM | 60.462 | 144.05 | 30.875 | 72.275 |
| 2016-03-011:57:15 PM | 60.238 | 143.938 | 30.988 | 72.275 |
| 2016-03-011:57:19 PM | 60.012 | 143.938 | 31.1 | 72.275 |
| 2016-03-011:57:23 PM | 59.788 | 143.825 | 31.1 | 72.275 |
| 2016-03-011:57:27 PM | 59.562 | 143.825 | 30.988 | 72.275 |
| 2016-03-011:57:31 PM | 59.45 | 143.712 | 31.1 | 72.275 |
| 2016-03-011:57:35 PM | 59.338 | 143.712 | 30.988 | 72.275 |
| 2016-03-011:57:39 PM | 59.225 | 143.6 | 30.762 | 72.275 |
| 2016-03-011:57:43 PM | 59.112 | 143.6 | 30.762 | 72.275 |
| 2016-03-011:57:47 PM | 59 | 143.488 | 30.875 | 72.275 |
| 2016-03-011:57:51 PM | 58.888 | 143.488 | 31.1 | 72.162 |
| 2016-03-011:57:55 PM | 58.775 | 143.375 | 31.212 | 72.162 |
| 2016-03-011:57:59 PM | 58.662 | 143.262 | 31.325 | 72.162 |
| 2016-03-011:58:03 PM | 58.55 | 143.262 | 31.325 | 72.162 |
| 2016-03-011:58:07 PM | 58.55 | 143.15 | 31.438 | 72.05 |
| 2016-03-011:58:11 PM | 58.438 | 143.15 | 31.438 | 72.05 |
| 2016-03-011:58:15 PM | 58.212 | 143.038 | 31.55 | 71.938 |
| 2016-03-011:58:19 PM | 58.1 | 143.038 | 31.662 | 71.938 |
| 2016-03-011:58:23 PM | 57.875 | 142.925 | 31.888 | 71.825 |
| 2016-03-011:58:27 PM | 57.762 | 142.812 | 31.888 | 71.938 |
| 2016-03-011:58:31 PM | 57.762 | 142.812 | 32 | 71.825 |
| 2016-03-011:58:35 PM | 57.538 | 142.812 | 32.225 | 71.825 |
| 2016-03-011:58:39 PM | 57.425 | 142.7 | 32.225 | 71.825 |
| 2016-03-011:58:43 PM | 57.2 | 142.7 | 32.225 | 71.825 |
| 2016-03-011:58:47 PM | 57.2 | 142.7 | 32.225 | 71.6 |
| 2016-03-011:58:51 PM | 57.088 | 142.588 | 32.45 | 71.375 |
| 2016-03-011:58:55 PM | 56.862 | 142.475 | 32.562 | 71.15 |
| 2016-03-011:58:59 PM | 56.75 | 142.475 | 32.675 | 71.15 |
| 2016-03-011:59:03 PM | 56.638 | 142.362 | 32.675 | 71.15 |
| 2016-03-011:59:07 PM | 56.525 | 142.362 | 32.788 | 71.038 |
| 2016-03-011:59:11 PM | 56.412 | 142.25 | 32.9 | 71.038 |
| 2016-03-011:59:15 PM | 56.188 | 142.138 | 33.012 | 70.812 |
| 2016-03-011:59:23 PM | 56.075 | 142.25 | 32.9 | 70.588 |
| 2016-03-011:59:27 PM | 56.075 | 142.138 | 32.9 | 70.475 |
| 2016-03-011:59:31 PM | 55.962 | 142.138 | 32.788 | 70.588 |
| 2016-03-011:59:35 PM | 55.85 | 142.138 | 32.788 | 70.475 |
| 2016-03-011:59:40 PM | 55.85 | 142.025 | 32.675 | 69.912 |
| 2016-03-011:59:44 PM | 55.738 | 141.912 | 32.788 | 69.688 |
| 2016-03-011:59:48 PM | 55.625 | 141.912 | 32.788 | 69.575 |
| 2016-03-011:59:52 PM | 55.625 | 141.8 | 32.675 | 69.575 |
| 2016-03-011:59:56 PM | 55.625 | 141.8 | 32.675 | 69.575 |
| 2016-03-012:00:00 PM | 55.625 | 141.8 | 32.675 | 69.575 |
| 2016-03-012:00:04 PM | 55.625 | 141.8 | 32.788 | 69.462 |
| 2016-03-012:00:08 PM | 55.625 | 141.688 | 32.788 | 69.238 |
| 2016-03-012:00:12 PM | 55.738 | 141.688 | 32.9 | 68.675 |
| 2016-03-012:00:16 PM | 55.85 | 141.8 | 32.788 | 68.562 |
| 2016-03-012:00:20 PM | 55.85 | 141.688 | 32.788 | 68.45 |
| 2016-03-012:00:24 PM | 55.85 | 141.688 | 32.9 | 68.562 |
| 2016-03-012:00:28 PM | 55.85 | 141.688 | 32.9 | 68.562 |
| 2016-03-012:00:32 PM | 55.85 | 141.688 | 32.675 | 68.45 |
| 2016-03-012:00:36 PM | 55.738 | 141.688 | 32.788 | 68.45 |
| 2016-03-012:00:40 PM | 55.738 | 141.575 | 32.788 | 68.45 |
| 2016-03-012:00:44 PM | 55.625 | 141.688 | 32.9 | 68.45 |
| 2016-03-012:00:48 PM | 55.625 | 141.688 | 33.012 | 68.45 |
| 2016-03-012:00:52 PM | 55.512 | 141.688 | 32.9 | 68.338 |
| 2016-03-012:00:56 PM | 55.512 | 141.575 | 32.788 | 68.225 |
| 2016-03-012:01:00 PM | 55.512 | 141.688 | 32.788 | 68.112 |
| 2016-03-012:01:04 PM | 55.625 | 141.688 | 32.788 | 68 |
| 2016-03-012:01:08 PM | 55.738 | 141.688 | 32.9 | 68 |
| 2016-03-012:01:12 PM | 55.738 | 141.688 | 33.125 | 68 |
| 2016-03-012:01:16 PM | 55.738 | 141.688 | 33.012 | 67.888 |
| 2016-03-012:01:20 PM | 55.85 | 141.8 | 32.9 | 67.662 |
| 2016-03-012:01:24 PM | 55.85 | 141.8 | 32.788 | 67.662 |
| 2016-03-012:01:28 PM | 55.738 | 141.8 | 32.675 | 67.775 |
| 2016-03-012:01:32 PM | 55.85 | 141.8 | 32.562 | 67.662 |
| 2016-03-012:01:36 PM | 55.85 | 141.8 | 32.562 | 67.662 |
| 2016-03-012:01:40 PM | 55.85 | 141.8 | 32.562 | 67.438 |
| 2016-03-012:01:44 PM | 55.85 | 141.8 | 32.675 | 67.438 |
| 2016-03-012:01:48 PM | 55.85 | 141.688 | 32.675 | 67.438 |
| 2016-03-012:01:52 PM | 55.85 | 141.688 | 32.675 | 67.438 |
| 2016-03-012:01:56 PM | 55.738 | 141.688 | 32.675 | 67.438 |
| 2016-03-012:02:00 PM | 55.738 | 141.8 | 32.675 | 67.325 |
| 2016-03-012:02:04 PM | 55.738 | 141.8 | 32.675 | 67.325 |
| 2016-03-012:02:08 PM | 55.738 | 141.912 | 32.788 | 67.212 |
| 2016-03-012:02:12 PM | 55.738 | 141.912 | 32.9 | 67.212 |
| 2016-03-012:02:16 PM | 55.738 | 141.8 | 33.012 | 67.212 |
| 2016-03-012:02:20 PM | 55.85 | 141.8 | 33.012 | 67.212 |
| 2016-03-012:02:25 PM | 55.738 | 141.8 | 33.012 | 67.212 |
| 2016-03-012:02:29 PM | 55.738 | 141.8 | 33.125 | 66.988 |
| 2016-03-012:02:33 PM | 55.738 | 141.8 | 33.125 | 66.875 |
| 2016-03-012:02:37 PM | 55.738 | 141.8 | 33.238 | 66.875 |
| 2016-03-012:02:41 PM | 55.738 | 141.8 | 33.35 | 66.875 |
| 2016-03-012:02:45 PM | 55.738 | 141.8 | 33.35 | 66.875 |
| 2016-03-012:02:49 PM | 55.625 | 141.8 | 33.462 | 66.762 |
| 2016-03-012:02:53 PM | 55.625 | 141.8 | 33.575 | 66.762 |
| 2016-03-012:02:57 PM | 55.625 | 141.8 | 33.688 | 66.762 |
| 2016-03-012:03:01 PM | 55.625 | 141.912 | 33.688 | 66.762 |
| 2016-03-012:03:05 PM | 55.625 | 141.8 | 33.575 | 66.762 |
| 2016-03-012:03:09 PM | 55.512 | 141.8 | 33.688 | 66.762 |
| 2016-03-012:03:13 PM | 55.4 | 141.8 | 33.575 | 66.762 |
| 2016-03-012:03:17 PM | 55.4 | 141.8 | 33.462 | 66.762 |
| 2016-03-012:03:21 PM | 55.4 | 141.8 | 33.35 | 66.762 |
| 2016-03-012:03:25 PM | 55.175 | 141.8 | 33.462 | 66.762 |
| 2016-03-012:03:29 PM | 55.175 | 141.8 | 33.462 | 66.65 |
| 2016-03-012:03:33 PM | 55.062 | 141.8 | 33.575 | 66.762 |
| 2016-03-012:03:37 PM | 54.95 | 141.8 | 33.462 | 66.762 |
| 2016-03-012:03:41 PM | 54.838 | 141.688 | 33.688 | 66.65 |
| 2016-03-012:03:45 PM | 54.725 | 141.688 | 33.8 | 66.65 |
| 2016-03-012:03:49 PM | 54.725 | 141.688 | 34.025 | 66.538 |
| 2016-03-012:03:53 PM | 54.612 | 141.688 | 34.025 | 66.538 |
| 2016-03-012:03:57 PM | 54.388 | 141.688 | 34.138 | 66.538 |
| 2016-03-012:04:01 PM | 54.275 | 141.688 | 34.25 | 66.538 |
| 2016-03-012:04:05 PM | 54.162 | 141.688 | 34.025 | 66.538 |
| 2016-03-012:04:09 PM | 54.162 | 141.688 | 33.912 | 66.538 |
| 2016-03-012:04:13 PM | 54.05 | 141.688 | 33.688 | 66.538 |
| 2016-03-012:04:17 PM | 54.05 | 141.688 | 33.575 | 66.538 |
| 2016-03-012:04:21 PM | 54.05 | 141.688 | 33.35 | 66.538 |
| 2016-03-012:04:25 PM | 54.05 | 141.688 | 33.125 | 66.538 |
| 2016-03-012:04:29 PM | 54.05 | 141.688 | 33.012 | 66.538 |
| 2016-03-012:04:33 PM | 54.05 | 141.688 | 33.012 | 66.65 |
| 2016-03-012:04:37 PM | 53.938 | 141.575 | 32.9 | 66.65 |
| 2016-03-012:04:41 PM | 53.938 | 141.688 | 32.675 | 66.65 |
| 2016-03-012:04:45 PM | 53.825 | 141.688 | 32.45 | 66.65 |
| 2016-03-012:04:49 PM | 53.825 | 141.575 | 32.112 | 66.65 |
| 2016-03-012:04:54 PM | 53.825 | 141.575 | 32 | 66.762 |
| 2016-03-012:04:58 PM | 53.825 | 141.575 | 32 | 66.65 |
| 2016-03-012:05:02 PM | 53.825 | 141.575 | 31.888 | 66.65 |
| 2016-03-012:05:06 PM | 53.825 | 141.575 | 31.888 | 66.65 |
| 2016-03-012:05:10 PM | 53.938 | 141.462 | 32 | 66.65 |
| 2016-03-012:05:14 PM | 54.162 | 141.462 | 32.225 | 66.65 |
| 2016-03-012:05:18 PM | 54.388 | 141.462 | 32.45 | 66.762 |
| 2016-03-012:05:22 PM | 54.5 | 141.462 | 32.45 | 66.65 |
| 2016-03-012:05:26 PM | 54.612 | 141.35 | 32.45 | 66.762 |
| 2016-03-012:05:30 PM | 54.5 | 141.35 | 32.338 | 66.762 |
| 2016-03-012:05:34 PM | 54.5 | 141.238 | 32.338 | 66.65 |
| 2016-03-012:05:38 PM | 54.388 | 141.238 | 32.338 | 66.65 |
| 2016-03-012:05:42 PM | 54.388 | 141.238 | 32.338 | 66.65 |
| 2016-03-012:05:46 PM | 54.388 | 141.125 | 32.45 | 66.65 |
| 2016-03-012:05:50 PM | 54.388 | 141.125 | 32.562 | 66.65 |
| 2016-03-012:05:54 PM | 54.275 | 141.012 | 32.788 | 66.762 |
| 2016-03-012:05:58 PM | 54.275 | 140.9 | 32.9 | 66.762 |
| 2016-03-012:06:02 PM | 54.275 | 140.9 | 33.012 | 66.762 |
| 2016-03-012:06:06 PM | 54.162 | 140.788 | 33.125 | 66.762 |
| 2016-03-012:06:10 PM | 54.275 | 140.675 | 33.238 | 66.762 |
| 2016-03-012:06:14 PM | 54.162 | 140.675 | 33.125 | 66.65 |
| 2016-03-012:06:18 PM | 54.162 | 140.675 | 33.125 | 66.538 |
| 2016-03-012:06:22 PM | 54.05 | 140.562 | 33.238 | 66.425 |
| 2016-03-012:06:26 PM | 54.05 | 140.562 | 33.238 | 66.425 |
| 2016-03-012:06:30 PM | 53.938 | 140.45 | 33.238 | 66.2 |
| 2016-03-012:06:34 PM | 53.825 | 140.45 | 33.125 | 65.975 |
| 2016-03-012:06:38 PM | 53.825 | 140.338 | 32.788 | 65.862 |
| 2016-03-012:06:42 PM | 53.825 | 140.338 | 32.562 | 65.862 |
| 2016-03-012:06:46 PM | 53.825 | 140.338 | 32.45 | 65.862 |
| 2016-03-012:06:50 PM | 53.825 | 140.338 | 32.45 | 65.862 |
| 2016-03-012:06:54 PM | 53.825 | 140.338 | 32.45 | 65.862 |
| 2016-03-012:06:58 PM | 53.938 | 140.338 | 32.562 | 65.862 |
| 2016-03-012:07:02 PM | 53.712 | 140.338 | 32.562 | 65.862 |
| 2016-03-012:07:06 PM | 53.6 | 140.225 | 32.675 | 65.862 |
| 2016-03-012:07:10 PM | 53.488 | 140.225 | 32.788 | 65.975 |
| 2016-03-012:07:15 PM | 53.375 | 140.112 | 32.9 | 65.975 |
| 2016-03-012:07:19 PM | 53.262 | 140.112 | 32.9 | 65.975 |
| 2016-03-012:07:23 PM | 53.262 | 140.112 | 33.012 | 65.975 |
| 2016-03-012:07:27 PM | 53.15 | 140 | 33.125 | 65.975 |
| 2016-03-012:07:31 PM | 53.038 | 140 | 33.238 | 65.862 |
| 2016-03-012:07:35 PM | 52.925 | 140 | 33.238 | 65.75 |
| 2016-03-012:07:39 PM | 53.038 | 140 | 33.35 | 65.75 |
| 2016-03-012:07:43 PM | 52.925 | 139.888 | 33.462 | 65.75 |
| 2016-03-012:07:47 PM | 53.038 | 139.888 | 33.462 | 65.75 |
| 2016-03-012:07:51 PM | 53.038 | 139.888 | 33.462 | 65.75 |
| 2016-03-012:07:55 PM | 53.038 | 139.888 | 33.35 | 65.638 |
| 2016-03-012:07:59 PM | 53.038 | 139.888 | 33.35 | 65.638 |
| 2016-03-012:08:03 PM | 53.038 | 139.888 | 33.462 | 65.75 |
| 2016-03-012:08:07 PM | 53.038 | 139.775 | 33.462 | 65.75 |
| 2016-03-012:08:11 PM | 53.15 | 139.775 | 33.462 | 65.75 |
| 2016-03-012:08:15 PM | 53.15 | 139.775 | 33.462 | 65.638 |
| 2016-03-012:08:19 PM | 53.15 | 139.775 | 33.575 | 65.638 |
| 2016-03-012:08:23 PM | 53.038 | 139.775 | 33.688 | 65.525 |
| 2016-03-012:08:27 PM | 53.038 | 139.662 | 33.688 | 65.3 |
| 2016-03-012:08:31 PM | 52.925 | 139.662 | 33.8 | 65.075 |
| 2016-03-012:08:35 PM | 52.925 | 139.662 | 33.912 | 64.963 |
| 2016-03-012:08:39 PM | 52.925 | 139.662 | 33.912 | 64.85 |
| 2016-03-012:08:43 PM | 52.925 | 139.662 | 33.912 | 64.738 |
| 2016-03-012:08:47 PM | 52.925 | 139.662 | 33.912 | 64.738 |
| 2016-03-012:08:51 PM | 52.925 | 139.55 | 33.8 | 64.738 |
| 2016-03-012:08:55 PM | 52.925 | 139.662 | 33.8 | 64.738 |
| 2016-03-012:08:59 PM | 52.925 | 139.55 | 33.688 | 64.738 |
| 2016-03-012:09:03 PM | 52.925 | 139.662 | 33.575 | 64.738 |
| 2016-03-012:09:08 PM | 52.812 | 139.55 | 33.575 | 64.738 |
| 2016-03-012:09:12 PM | 52.7 | 139.55 | 33.688 | 64.738 |
| 2016-03-012:09:16 PM | 52.7 | 139.438 | 33.688 | 64.738 |
| 2016-03-012:09:20 PM | 52.588 | 139.55 | 33.688 | 64.738 |
| 2016-03-012:09:24 PM | 52.475 | 139.55 | 33.575 | 64.738 |
| 2016-03-012:09:28 PM | 52.475 | 139.55 | 33.575 | 64.738 |
| 2016-03-012:09:32 PM | 52.362 | 139.438 | 33.575 | 64.738 |
| 2016-03-012:09:36 PM | 52.362 | 139.55 | 33.688 | 64.738 |
| 2016-03-012:09:40 PM | 52.25 | 139.438 | 33.575 | 64.738 |
| 2016-03-012:09:44 PM | 52.25 | 139.325 | 33.575 | 64.738 |
| 2016-03-012:09:48 PM | 52.25 | 139.325 | 33.575 | 64.738 |
| 2016-03-012:09:52 PM | 52.362 | 139.325 | 33.575 | 64.85 |
| 2016-03-012:09:56 PM | 52.362 | 139.212 | 33.575 | 64.625 |
| 2016-03-012:10:00 PM | 52.475 | 139.212 | 33.575 | 64.4 |
| 2016-03-012:10:04 PM | 52.588 | 139.212 | 33.35 | 64.4 |
| 2016-03-012:10:08 PM | 52.588 | 139.212 | 33.238 | 64.4 |
| 2016-03-012:10:12 PM | 52.588 | 139.212 | 33.125 | 64.4 |
| 2016-03-012:10:16 PM | 52.588 | 139.1 | 33.125 | 64.4 |
| 2016-03-012:10:20 PM | 52.588 | 139.212 | 33.125 | 64.512 |
| 2016-03-012:10:24 PM | 52.588 | 139.212 | 33.238 | 64.512 |
| 2016-03-012:10:28 PM | 52.475 | 139.1 | 33.238 | 64.512 |
| 2016-03-012:10:32 PM | 52.475 | 139.1 | 33.35 | 64.625 |
| 2016-03-012:10:36 PM | 52.362 | 138.988 | 33.35 | 64.512 |
| 2016-03-012:10:40 PM | 52.25 | 138.988 | 33.35 | 64.512 |
| 2016-03-012:10:44 PM | 52.25 | 138.988 | 33.462 | 64.512 |
| 2016-03-012:10:48 PM | 52.025 | 138.988 | 33.575 | 64.512 |
| 2016-03-012:10:52 PM | 51.912 | 138.988 | 33.688 | 64.512 |
| 2016-03-012:10:56 PM | 51.912 | 138.988 | 33.912 | 64.512 |
| 2016-03-012:11:00 PM | 51.912 | 138.988 | 34.138 | 64.4 |
| 2016-03-012:11:04 PM | 51.912 | 138.875 | 34.25 | 64.4 |
| 2016-03-012:11:08 PM | 51.912 | 138.988 | 34.475 | 64.4 |
| 2016-03-012:11:12 PM | 51.912 | 138.988 | 34.588 | 64.287 |
| 2016-03-012:11:16 PM | 51.912 | 138.875 | 34.588 | 64.175 |
| 2016-03-012:11:20 PM | 52.025 | 138.875 | 34.475 | 64.287 |
| 2016-03-012:11:24 PM | 52.138 | 138.875 | 34.475 | 64.287 |
| 2016-03-012:11:28 PM | 52.25 | 138.875 | 34.475 | 64.287 |
| 2016-03-012:11:32 PM | 52.362 | 138.875 | 34.362 | 64.287 |
| 2016-03-012:11:36 PM | 52.362 | 138.762 | 34.475 | 64.4 |
| 2016-03-012:11:40 PM | 52.362 | 138.762 | 34.588 | 64.4 |
| 2016-03-012:11:44 PM | 52.475 | 138.762 | 34.475 | 64.4 |
| 2016-03-012:11:49 PM | 52.475 | 138.762 | 34.362 | 64.4 |
| 2016-03-012:11:53 PM | 52.588 | 138.762 | 34.138 | 64.4 |
| 2016-03-012:11:57 PM | 52.812 | 138.762 | 34.025 | 64.4 |
| 2016-03-012:12:01 PM | 52.812 | 138.875 | 34.025 | 64.287 |
| 2016-03-012:12:05 PM | 52.812 | 138.875 | 34.025 | 64.287 |
| 2016-03-012:12:10 PM | 52.7 | 138.875 | 34.138 | 64.287 |
| 2016-03-012:12:14 PM | 52.7 | 138.875 | 34.025 | 64.4 |
| 2016-03-012:12:19 PM | 52.7 | 138.875 | 34.025 | 64.287 |
| 2016-03-012:12:23 PM | 52.588 | 138.875 | 33.912 | 64.062 |
| 2016-03-012:12:27 PM | 52.7 | 138.988 | 34.025 | 63.95 |
| 2016-03-012:12:31 PM | 52.7 | 138.988 | 34.138 | 63.95 |
| 2016-03-012:12:35 PM | 52.812 | 138.988 | 33.912 | 63.95 |
| 2016-03-012:12:39 PM | 53.038 | 138.988 | 33.8 | 64.062 |
| 2016-03-012:12:43 PM | 53.15 | 138.988 | 33.912 | 64.062 |
| 2016-03-012:12:47 PM | 53.262 | 139.1 | 33.912 | 64.175 |
| 2016-03-012:12:51 PM | 53.262 | 139.1 | 33.912 | 64.062 |
| 2016-03-012:12:55 PM | 53.375 | 139.1 | 33.912 | 64.062 |
| 2016-03-012:12:59 PM | 53.375 | 139.1 | 33.912 | 64.062 |
| 2016-03-012:13:03 PM | 53.488 | 139.1 | 34.138 | 64.062 |
| 2016-03-012:13:07 PM | 53.488 | 139.1 | 34.25 | 64.062 |
| 2016-03-012:13:11 PM | 53.6 | 139.1 | 34.362 | 64.062 |
| 2016-03-012:13:15 PM | 53.6 | 139.212 | 34.475 | 63.95 |
| 2016-03-012:13:19 PM | 53.712 | 139.212 | 34.475 | 63.613 |
| 2016-03-012:13:23 PM | 53.825 | 139.1 | 34.588 | 63.5 |
| 2016-03-012:13:27 PM | 53.825 | 139.212 | 34.475 | 63.388 |
| 2016-03-012:13:31 PM | 53.825 | 139.1 | 34.25 | 63.275 |
| 2016-03-012:13:35 PM | 53.825 | 139.212 | 34.025 | 63.162 |
| 2016-03-012:13:39 PM | 53.825 | 139.212 | 33.912 | 62.938 |
| 2016-03-012:13:43 PM | 53.825 | 139.212 | 33.8 | 62.825 |
| 2016-03-012:13:47 PM | 53.938 | 139.212 | 33.575 | 62.825 |
| 2016-03-012:13:51 PM | 54.05 | 139.212 | 33.462 | 62.825 |
| 2016-03-012:13:55 PM | 54.05 | 139.212 | 33.462 | 62.825 |
| 2016-03-012:13:59 PM | 54.05 | 139.212 | 33.35 | 62.825 |
| 2016-03-012:14:03 PM | 53.938 | 139.212 | 33.125 | 62.825 |
| 2016-03-012:14:07 PM | 53.938 | 139.212 | 33.125 | 62.938 |
| 2016-03-012:14:11 PM | 53.825 | 139.212 | 33.125 | 62.938 |
| 2016-03-012:14:15 PM | 53.825 | 139.212 | 33.125 | 62.938 |
| 2016-03-012:14:19 PM | 53.825 | 139.212 | 33.125 | 62.938 |
| 2016-03-012:14:23 PM | 53.825 | 139.212 | 32.9 | 62.938 |
| 2016-03-012:14:27 PM | 53.938 | 139.212 | 32.788 | 62.938 |
| 2016-03-012:14:31 PM | 54.162 | 139.212 | 32.675 | 63.05 |
| 2016-03-012:14:35 PM | 54.275 | 139.212 | 32.788 | 63.05 |
| 2016-03-012:14:39 PM | 54.275 | 139.212 | 32.788 | 63.05 |
| 2016-03-012:14:43 PM | 54.275 | 139.212 | 32.788 | 63.162 |
| 2016-03-012:14:47 PM | 54.388 | 139.212 | 32.675 | 63.162 |
| 2016-03-012:14:51 PM | 54.5 | 139.212 | 32.45 | 63.162 |
| 2016-03-012:14:55 PM | 54.612 | 139.212 | 32.338 | 63.162 |
| 2016-03-012:14:59 PM | 54.725 | 139.212 | 32.338 | 63.275 |
| 2016-03-012:15:03 PM | 54.725 | 139.212 | 32.338 | 63.275 |
| 2016-03-012:15:07 PM | 54.725 | 139.212 | 32.338 | 63.275 |
| 2016-03-012:15:11 PM | 54.612 | 139.212 | 32.338 | 63.388 |
| 2016-03-012:15:15 PM | 54.388 | 139.212 | 32.45 | 63.388 |
| 2016-03-012:15:19 PM | 54.388 | 139.212 | 32.675 | 63.5 |
| 2016-03-012:15:23 PM | 54.162 | 139.212 | 32.788 | 63.5 |
| 2016-03-012:15:28 PM | 54.162 | 139.212 | 32.675 | 63.5 |
| 2016-03-012:15:32 PM | 54.05 | 139.1 | 32.562 | 63.613 |
| 2016-03-012:15:36 PM | 53.938 | 139.1 | 32.562 | 63.613 |
| 2016-03-012:15:40 PM | 53.938 | 139.1 | 32.562 | 63.613 |
| 2016-03-012:15:44 PM | 54.05 | 139.1 | 32.675 | 63.613 |
| 2016-03-012:15:48 PM | 54.162 | 139.1 | 32.675 | 63.725 |
| 2016-03-012:15:52 PM | 54.275 | 139.1 | 32.675 | 63.725 |
| 2016-03-012:15:56 PM | 54.5 | 138.988 | 32.675 | 63.838 |
| 2016-03-012:16:00 PM | 54.612 | 138.988 | 32.788 | 63.838 |
| 2016-03-012:16:04 PM | 54.838 | 138.988 | 32.9 | 63.838 |
| 2016-03-012:16:08 PM | 54.95 | 138.988 | 33.012 | 63.838 |
| 2016-03-012:16:12 PM | 55.062 | 138.988 | 33.012 | 63.725 |
| 2016-03-012:16:16 PM | 55.288 | 138.988 | 33.125 | 63.725 |
| 2016-03-012:16:20 PM | 55.4 | 138.988 | 33.238 | 63.725 |
| 2016-03-012:16:24 PM | 55.512 | 138.875 | 33.238 | 63.725 |
| 2016-03-012:16:28 PM | 55.738 | 138.875 | 33.238 | 63.613 |
| 2016-03-012:16:32 PM | 55.85 | 138.875 | 33.35 | 63.613 |
| 2016-03-012:16:36 PM | 56.075 | 138.875 | 33.238 | 63.388 |
| 2016-03-012:16:40 PM | 56.188 | 138.875 | 33.35 | 63.275 |
| 2016-03-012:16:44 PM | 56.412 | 138.875 | 33.462 | 63.162 |
| 2016-03-012:16:48 PM | 56.638 | 138.875 | 33.462 | 62.825 |
| 2016-03-012:16:52 PM | 56.862 | 138.762 | 33.35 | 62.6 |
| 2016-03-012:16:56 PM | 57.088 | 138.762 | 33.35 | 62.488 |
| 2016-03-012:17:00 PM | 57.312 | 138.762 | 33.462 | 62.375 |
| 2016-03-012:17:04 PM | 57.538 | 138.762 | 33.462 | 62.262 |
| 2016-03-012:17:08 PM | 57.762 | 138.762 | 33.575 | 62.262 |
| 2016-03-012:17:12 PM | 57.875 | 138.762 | 33.688 | 62.15 |
| 2016-03-012:17:16 PM | 58.1 | 138.762 | 33.8 | 62.15 |
| 2016-03-012:17:20 PM | 58.212 | 138.762 | 33.912 | 62.15 |
| 2016-03-012:17:24 PM | 58.212 | 138.762 | 33.912 | 62.038 |
| 2016-03-012:17:28 PM | 58.325 | 138.65 | 33.912 | 61.925 |
| 2016-03-012:17:32 PM | 58.325 | 138.65 | 33.912 | 61.7 |
| 2016-03-012:17:36 PM | 58.325 | 138.65 | 33.912 | 61.588 |
| 2016-03-012:17:40 PM | 58.325 | 138.538 | 33.912 | 61.475 |
| 2016-03-012:17:44 PM | 58.325 | 138.65 | 33.912 | 61.25 |
| 2016-03-012:17:48 PM | 58.325 | 138.65 | 34.025 | 61.025 |
| 2016-03-012:17:52 PM | 58.212 | 138.538 | 34.025 | 60.912 |
| 2016-03-012:17:57 PM | 58.212 | 138.538 | 34.138 | 60.575 |
| 2016-03-012:18:01 PM | 58.1 | 138.538 | 34.138 | 60.462 |
| 2016-03-012:18:05 PM | 58.1 | 138.425 | 34.25 | 60.238 |
| 2016-03-012:18:09 PM | 58.1 | 138.425 | 34.138 | 60.012 |
| 2016-03-012:18:13 PM | 58.1 | 138.425 | 34.138 | 59.9 |
| 2016-03-012:18:17 PM | 58.1 | 138.312 | 34.025 | 59.788 |
| 2016-03-012:18:21 PM | 58.212 | 138.312 | 34.025 | 59.562 |
| 2016-03-012:18:25 PM | 58.212 | 138.2 | 34.025 | 59.562 |
| 2016-03-012:18:29 PM | 58.212 | 138.2 | 34.138 | 59.338 |
| 2016-03-012:18:33 PM | 58.325 | 138.2 | 34.362 | 59.338 |
| 2016-03-012:18:37 PM | 58.325 | 138.088 | 34.362 | 59.338 |
| 2016-03-012:18:41 PM | 58.438 | 138.088 | 34.475 | 59.225 |
| 2016-03-012:18:45 PM | 58.438 | 138.088 | 34.475 | 59.225 |
| 2016-03-012:18:49 PM | 58.438 | 138.088 | 34.362 | 59.225 |
| 2016-03-012:18:53 PM | 58.55 | 137.975 | 34.362 | 59.225 |
| 2016-03-012:18:57 PM | 58.55 | 137.975 | 34.138 | 59.112 |
| 2016-03-012:19:01 PM | 58.55 | 137.975 | 33.912 | 59.112 |
| 2016-03-012:19:05 PM | 58.55 | 137.975 | 33.8 | 59.112 |
| 2016-03-012:19:09 PM | 58.55 | 137.862 | 33.8 | 59 |
| 2016-03-012:19:13 PM | 58.662 | 137.862 | 33.8 | 59.112 |
| 2016-03-012:19:17 PM | 58.55 | 137.862 | 33.688 | 59 |
| 2016-03-012:19:21 PM | 58.662 | 137.862 | 33.688 | 59.112 |
| 2016-03-012:19:25 PM | 58.662 | 137.862 | 33.688 | 59 |
| 2016-03-012:19:29 PM | 58.775 | 137.862 | 33.688 | 59 |
| 2016-03-012:19:33 PM | 58.888 | 137.75 | 33.688 | 59 |
| 2016-03-012:19:37 PM | 59.112 | 137.75 | 33.8 | 59 |
| 2016-03-012:19:41 PM | 59.338 | 137.75 | 33.688 | 59 |
| 2016-03-012:19:45 PM | 59.45 | 137.75 | 33.8 | 59 |
| 2016-03-012:19:49 PM | 59.675 | 137.75 | 33.8 | 59 |
| 2016-03-012:19:53 PM | 59.675 | 137.75 | 33.912 | 58.888 |
| 2016-03-012:19:57 PM | 59.675 | 137.638 | 33.912 | 58.888 |
| 2016-03-012:20:01 PM | 59.675 | 137.638 | 33.688 | 58.888 |
| 2016-03-012:20:09 PM | 59.675 | 137.638 | 33.125 | 59 |
| 2016-03-012:20:13 PM | 59.675 | 137.638 | 33.125 | 59 |
| 2016-03-012:20:17 PM | 59.675 | 137.638 | 33.125 | 59 |
| 2016-03-012:20:21 PM | 59.675 | 137.525 | 33.125 | 59 |
| 2016-03-012:20:25 PM | 59.562 | 137.525 | 33.238 | 58.888 |
| 2016-03-012:20:29 PM | 59.675 | 137.525 | 33.238 | 58.888 |
| 2016-03-012:20:33 PM | 59.562 | 137.525 | 33.238 | 58.888 |
| 2016-03-012:20:37 PM | 59.562 | 137.525 | 33.35 | 59 |
| 2016-03-012:20:41 PM | 59.562 | 137.525 | 33.35 | 59 |
| 2016-03-012:20:45 PM | 59.562 | 137.525 | 33.462 | 59 |
| 2016-03-012:20:49 PM | 59.562 | 137.638 | 33.462 | 59 |
| 2016-03-012:20:53 PM | 59.562 | 137.525 | 33.462 | 59 |
| 2016-03-012:20:57 PM | 59.562 | 137.525 | 33.575 | 59 |
| 2016-03-012:21:01 PM | 59.562 | 137.412 | 33.688 | 59 |
| 2016-03-012:21:05 PM | 59.675 | 137.412 | 33.688 | 59.112 |
| 2016-03-012:21:09 PM | 59.675 | 137.3 | 33.575 | 59.112 |
| 2016-03-012:21:13 PM | 59.675 | 137.3 | 33.462 | 59.112 |
| 2016-03-012:21:17 PM | 59.788 | 137.3 | 33.35 | 59.112 |
| 2016-03-012:21:21 PM | 59.788 | 137.3 | 33.125 | 59.225 |
| 2016-03-012:21:25 PM | 59.9 | 137.3 | 32.9 | 59.225 |
| 2016-03-012:21:29 PM | 59.9 | 137.3 | 32.9 | 59.338 |
| 2016-03-012:21:33 PM | 60.012 | 137.3 | 32.9 | 59.45 |
| 2016-03-012:21:37 PM | 60.012 | 137.3 | 33.012 | 59.45 |
| 2016-03-012:21:41 PM | 60.012 | 137.3 | 33.125 | 59.562 |
| 2016-03-012:21:45 PM | 60.125 | 137.3 | 33.238 | 59.562 |
| 2016-03-012:21:49 PM | 60.125 | 137.188 | 33.35 | 59.675 |
| 2016-03-012:21:53 PM | 60.125 | 137.188 | 33.35 | 59.675 |
| 2016-03-012:21:57 PM | 60.238 | 137.188 | 33.462 | 59.788 |
| 2016-03-012:22:01 PM | 60.238 | 137.188 | 33.462 | 59.9 |
| 2016-03-012:22:05 PM | 60.238 | 137.075 | 33.35 | 59.9 |
| 2016-03-012:22:09 PM | 60.35 | 137.075 | 33.35 | 60.012 |
| 2016-03-012:22:13 PM | 60.35 | 136.962 | 33.35 | 60.012 |
| 2016-03-012:22:17 PM | 60.35 | 137.075 | 33.35 | 60.125 |
| 2016-03-012:22:21 PM | 60.462 | 137.075 | 33.462 | 60.238 |
| 2016-03-012:22:25 PM | 60.462 | 137.075 | 33.462 | 60.238 |
| 2016-03-012:22:29 PM | 60.575 | 136.962 | 33.575 | 60.35 |
| 2016-03-012:22:33 PM | 60.575 | 136.962 | 33.575 | 60.462 |
| 2016-03-012:22:37 PM | 60.688 | 136.962 | 33.575 | 60.575 |
| 2016-03-012:22:41 PM | 60.688 | 136.85 | 33.575 | 60.575 |
| 2016-03-012:22:45 PM | 60.8 | 136.85 | 33.575 | 60.688 |
| 2016-03-012:22:49 PM | 60.8 | 136.85 | 33.462 | 60.688 |
| 2016-03-012:22:53 PM | 60.8 | 136.85 | 33.462 | 60.8 |
| 2016-03-012:22:57 PM | 60.912 | 136.85 | 33.462 | 60.912 |
| 2016-03-012:23:01 PM | 60.912 | 136.85 | 33.575 | 60.912 |
| 2016-03-012:23:05 PM | 61.025 | 136.85 | 33.688 | 61.025 |
| 2016-03-012:23:09 PM | 60.912 | 136.738 | 33.8 | 61.138 |
| 2016-03-012:23:13 PM | 61.025 | 136.738 | 33.912 | 61.138 |
| 2016-03-012:23:17 PM | 60.912 | 136.738 | 33.912 | 61.138 |
| 2016-03-012:23:21 PM | 61.025 | 136.738 | 33.912 | 61.25 |
| 2016-03-012:23:25 PM | 61.025 | 136.738 | 34.025 | 61.363 |
| 2016-03-012:23:29 PM | 61.025 | 136.625 | 34.025 | 61.363 |
| 2016-03-012:23:34 PM | 61.025 | 136.738 | 34.025 | 61.475 |
| 2016-03-012:23:38 PM | 61.138 | 136.625 | 33.912 | 61.475 |
| 2016-03-012:23:42 PM | 61.138 | 136.625 | 34.025 | 61.588 |
| 2016-03-012:23:46 PM | 61.138 | 136.625 | 34.138 | 61.588 |
| 2016-03-012:23:50 PM | 61.138 | 136.625 | 34.025 | 61.7 |
| 2016-03-012:23:54 PM | 61.25 | 136.625 | 34.138 | 61.7 |
| 2016-03-012:23:58 PM | 61.25 | 136.625 | 34.25 | 61.812 |
| 2016-03-012:24:02 PM | 61.25 | 136.625 | 34.362 | 61.925 |
| 2016-03-012:24:06 PM | 61.363 | 136.625 | 34.475 | 61.925 |
| 2016-03-012:24:10 PM | 61.475 | 136.625 | 34.588 | 62.038 |
| 2016-03-012:24:14 PM | 61.475 | 136.625 | 34.475 | 62.038 |
| 2016-03-012:24:18 PM | 61.588 | 136.625 | 34.475 | 62.038 |
| 2016-03-012:24:22 PM | 61.7 | 136.738 | 34.25 | 62.15 |
| 2016-03-012:24:26 PM | 61.7 | 136.625 | 34.138 | 62.15 |
| 2016-03-012:24:30 PM | 61.812 | 136.738 | 34.138 | 62.262 |
| 2016-03-012:24:34 PM | 61.925 | 136.738 | 34.138 | 62.262 |
| 2016-03-012:24:38 PM | 61.925 | 136.738 | 34.138 | 62.375 |
| 2016-03-012:24:42 PM | 61.925 | 136.738 | 34.138 | 62.375 |
| 2016-03-012:24:46 PM | 62.038 | 136.738 | 34.138 | 62.375 |
| 2016-03-012:24:50 PM | 62.15 | 136.738 | 33.912 | 62.488 |
| 2016-03-012:24:54 PM | 62.15 | 136.625 | 33.688 | 62.488 |
| 2016-03-012:24:58 PM | 62.15 | 136.625 | 33.575 | 62.488 |
| 2016-03-012:25:03 PM | 62.262 | 136.625 | 33.462 | 62.6 |
| 2016-03-012:25:07 PM | 62.262 | 136.625 | 33.35 | 62.6 |
| 2016-03-012:25:11 PM | 62.262 | 136.512 | 33.238 | 62.712 |
| 2016-03-012:25:15 PM | 62.375 | 136.512 | 33.125 | 62.712 |
| 2016-03-012:25:19 PM | 62.488 | 136.512 | 33.012 | 62.712 |
| 2016-03-012:25:23 PM | 62.488 | 136.512 | 33.012 | 62.825 |
| 2016-03-012:25:27 PM | 62.6 | 136.512 | 33.012 | 62.825 |
| 2016-03-012:25:31 PM | 62.6 | 136.512 | 33.012 | 62.938 |
| 2016-03-012:25:35 PM | 62.712 | 136.512 | 33.012 | 62.938 |
| 2016-03-012:25:39 PM | 62.712 | 136.4 | 32.9 | 62.938 |
| 2016-03-012:25:43 PM | 62.712 | 136.512 | 33.012 | 63.05 |
| 2016-03-012:25:47 PM | 62.712 | 136.4 | 33.238 | 63.162 |
| 2016-03-012:25:51 PM | 62.712 | 136.4 | 33.35 | 63.162 |
| 2016-03-012:25:55 PM | 62.712 | 136.4 | 33.462 | 63.275 |
| 2016-03-012:25:59 PM | 62.712 | 136.288 | 33.575 | 63.275 |
| 2016-03-012:26:03 PM | 62.712 | 136.175 | 33.688 | 63.388 |
| 2016-03-012:26:07 PM | 62.712 | 136.175 | 33.8 | 63.388 |
| 2016-03-012:26:11 PM | 62.825 | 136.175 | 33.8 | 63.5 |
| 2016-03-012:26:15 PM | 62.825 | 136.062 | 33.575 | 63.5 |
| 2016-03-012:26:19 PM | 62.938 | 136.062 | 33.462 | 63.613 |
| 2016-03-012:26:23 PM | 62.938 | 136.062 | 33.35 | 63.613 |
| 2016-03-012:26:27 PM | 62.938 | 136.062 | 33.238 | 63.613 |
| 2016-03-012:26:32 PM | 63.05 | 135.95 | 32.9 | 63.725 |
| 2016-03-012:26:36 PM | 63.05 | 135.95 | 32.45 | 63.725 |
| 2016-03-012:26:40 PM | 63.05 | 135.95 | 32.225 | 63.838 |
| 2016-03-012:26:44 PM | 63.05 | 135.95 | 32 | 63.838 |
| 2016-03-012:26:48 PM | 63.05 | 135.95 | 32 | 63.95 |
| 2016-03-012:26:52 PM | 63.162 | 135.95 | 32 | 63.95 |
| 2016-03-012:26:56 PM | 63.162 | 135.838 | 32 | 64.062 |
| 2016-03-012:27:00 PM | 63.275 | 135.838 | 32.112 | 64.062 |
| 2016-03-012:27:04 PM | 63.162 | 135.838 | 32.112 | 64.062 |
| 2016-03-012:27:08 PM | 63.275 | 135.725 | 31.888 | 64.175 |
| 2016-03-012:27:12 PM | 63.388 | 135.725 | 31.55 | 64.287 |
| 2016-03-012:27:16 PM | 63.388 | 135.612 | 31.438 | 64.287 |
| 2016-03-012:27:20 PM | 63.388 | 135.612 | 31.325 | 64.287 |
| 2016-03-012:27:24 PM | 63.388 | 135.612 | 31.212 | 64.4 |
| 2016-03-012:27:28 PM | 63.5 | 135.612 | 31.212 | 64.512 |
| 2016-03-012:27:32 PM | 63.5 | 135.5 | 31.438 | 64.512 |
| 2016-03-012:27:37 PM | 63.613 | 135.5 | 31.438 | 64.512 |
| 2016-03-012:27:41 PM | 63.5 | 135.388 | 31.438 | 64.625 |
| 2016-03-012:27:45 PM | 63.5 | 135.388 | 31.55 | 64.625 |
| 2016-03-012:27:49 PM | 63.5 | 135.388 | 31.55 | 64.738 |
| 2016-03-012:27:53 PM | 63.5 | 135.275 | 31.55 | 64.738 |
| 2016-03-012:27:57 PM | 63.5 | 135.162 | 31.662 | 64.85 |
| 2016-03-012:28:01 PM | 63.5 | 135.162 | 31.662 | 64.85 |
| 2016-03-012:28:05 PM | 63.613 | 135.05 | 31.775 | 64.85 |
| 2016-03-012:28:09 PM | 63.613 | 135.05 | 31.775 | 64.963 |
| 2016-03-012:28:13 PM | 63.613 | 134.938 | 31.775 | 65.075 |
| 2016-03-012:28:17 PM | 63.613 | 134.938 | 31.775 | 65.075 |
| 2016-03-012:28:21 PM | 63.613 | 134.938 | 32 | 65.188 |
| 2016-03-012:28:25 PM | 63.613 | 134.825 | 32.112 | 65.188 |
| 2016-03-012:28:29 PM | 63.725 | 134.712 | 32.225 | 65.3 |
| 2016-03-012:28:33 PM | 63.725 | 134.6 | 32.225 | 65.3 |
| 2016-03-012:28:38 PM | 63.725 | 134.6 | 32 | 65.412 |
| 2016-03-012:28:42 PM | 63.725 | 134.6 | 31.888 | 65.412 |
| 2016-03-012:28:46 PM | 63.838 | 134.488 | 31.775 | 65.412 |
| 2016-03-012:28:50 PM | 63.838 | 134.488 | 31.775 | 65.412 |
| 2016-03-012:28:54 PM | 63.95 | 134.488 | 31.775 | 65.525 |
| 2016-03-012:28:58 PM | 63.95 | 134.375 | 31.775 | 65.525 |
| 2016-03-012:29:02 PM | 63.95 | 134.375 | 31.775 | 65.638 |
| 2016-03-012:29:06 PM | 63.95 | 134.375 | 31.775 | 65.638 |
| 2016-03-012:29:10 PM | 64.062 | 134.262 | 31.775 | 65.75 |
| 2016-03-012:29:14 PM | 64.062 | 134.262 | 31.888 | 65.75 |
| 2016-03-012:29:18 PM | 64.062 | 134.262 | 32 | 65.75 |
| 2016-03-012:29:22 PM | 64.062 | 134.15 | 32 | 65.862 |
| 2016-03-012:29:26 PM | 64.062 | 134.15 | 32.112 | 65.862 |
| 2016-03-012:29:30 PM | 64.175 | 134.038 | 32.225 | 65.862 |
| 2016-03-012:29:34 PM | 64.175 | 133.925 | 32.225 | 65.975 |
| 2016-03-012:29:38 PM | 64.175 | 133.925 | 32.338 | 65.975 |
| 2016-03-012:29:42 PM | 64.287 | 133.925 | 32.45 | 65.975 |
| 2016-03-012:29:46 PM | 64.287 | 133.925 | 32.562 | 66.088 |
| 2016-03-012:29:50 PM | 64.287 | 133.925 | 32.675 | 66.088 |
| 2016-03-012:29:54 PM | 64.287 | 133.925 | 32.788 | 66.088 |
| 2016-03-012:29:58 PM | 64.287 | 133.925 | 32.788 | 66.088 |
| 2016-03-012:30:02 PM | 64.287 | 133.812 | 32.788 | 66.2 |
| 2016-03-012:30:06 PM | 64.287 | 133.812 | 32.788 | 66.2 |
| 2016-03-012:30:10 PM | 64.287 | 133.812 | 32.788 | 66.2 |
| 2016-03-012:30:14 PM | 64.287 | 133.812 | 32.9 | 66.312 |
| 2016-03-012:30:18 PM | 64.287 | 133.812 | 32.9 | 66.312 |
| 2016-03-012:30:22 PM | 64.287 | 133.812 | 33.012 | 66.425 |
| 2016-03-012:30:26 PM | 64.287 | 133.812 | 33.012 | 66.425 |
| 2016-03-012:30:30 PM | 64.287 | 133.7 | 33.238 | 66.425 |
| 2016-03-012:30:35 PM | 64.287 | 133.7 | 33.125 | 66.425 |
| 2016-03-012:30:39 PM | 64.175 | 133.812 | 32.788 | 66.538 |
| 2016-03-012:30:43 PM | 64.287 | 133.812 | 32.562 | 66.538 |
| 2016-03-012:30:47 PM | 64.175 | 133.812 | 32.338 | 66.65 |
| 2016-03-012:30:51 PM | 64.287 | 133.812 | 32.225 | 66.538 |
| 2016-03-012:30:55 PM | 64.287 | 133.812 | 31.888 | 66.65 |
| 2016-03-012:30:59 PM | 64.287 | 133.812 | 31.888 | 66.65 |
| 2016-03-012:31:03 PM | 64.287 | 133.812 | 31.888 | 66.65 |
| 2016-03-012:31:07 PM | 64.287 | 133.812 | 32 | 66.65 |
| 2016-03-012:31:11 PM | 64.287 | 133.812 | 32 | 66.762 |
| 2016-03-012:31:15 PM | 64.287 | 133.7 | 32.112 | 66.762 |
| 2016-03-012:31:19 PM | 64.287 | 133.7 | 32.225 | 66.875 |
| 2016-03-012:31:23 PM | 64.287 | 133.812 | 32.225 | 66.875 |
| 2016-03-012:31:27 PM | 64.287 | 133.7 | 32.338 | 66.875 |
| 2016-03-012:31:31 PM | 64.287 | 133.7 | 32.338 | 66.875 |
| 2016-03-012:31:36 PM | 64.4 | 133.812 | 32.45 | 66.988 |
| 2016-03-012:31:40 PM | 64.4 | 133.7 | 32.562 | 66.988 |
| 2016-03-012:31:44 PM | 64.4 | 133.7 | 32.788 | 66.988 |
| 2016-03-012:31:47 PM | 64.4 | 133.7 | 32.788 | 67.1 |
| 2016-03-012:31:51 PM | 64.4 | 133.7 | 32.9 | 67.1 |
| 2016-03-012:31:55 PM | 64.4 | 133.7 | 32.9 | 67.1 |
| 2016-03-012:31:59 PM | 64.4 | 133.588 | 33.125 | 67.1 |
| 2016-03-012:32:03 PM | 64.4 | 133.588 | 33.125 | 67.1 |
| 2016-03-012:32:07 PM | 64.4 | 133.588 | 33.238 | 67.1 |
| 2016-03-012:32:11 PM | 64.4 | 133.588 | 33.35 | 67.212 |
| 2016-03-012:32:15 PM | 64.4 | 133.588 | 33.35 | 67.212 |
| 2016-03-012:32:19 PM | 64.4 | 133.475 | 33.462 | 67.212 |
| 2016-03-012:32:23 PM | 64.4 | 133.588 | 33.462 | 67.212 |
| 2016-03-012:32:28 PM | 64.4 | 133.475 | 33.575 | 67.212 |
| 2016-03-012:32:32 PM | 64.512 | 133.588 | 33.575 | 67.325 |
| 2016-03-012:32:36 PM | 64.512 | 133.588 | 33.575 | 67.325 |
| 2016-03-012:32:40 PM | 64.512 | 133.475 | 33.575 | 67.325 |
| 2016-03-012:32:44 PM | 64.512 | 133.475 | 33.688 | 67.325 |
| 2016-03-012:32:48 PM | 64.512 | 133.475 | 33.575 | 67.438 |
| 2016-03-012:32:52 PM | 64.512 | 133.475 | 33.35 | 67.438 |
| 2016-03-012:32:56 PM | 64.512 | 133.475 | 33.125 | 67.438 |
| 2016-03-012:33:00 PM | 64.512 | 133.362 | 33.012 | 67.438 |
| 2016-03-012:33:04 PM | 64.4 | 133.475 | 33.012 | 67.55 |
| 2016-03-012:33:08 PM | 64.4 | 133.362 | 33.012 | 67.55 |
| 2016-03-012:33:12 PM | 64.4 | 133.362 | 33.238 | 67.55 |
| 2016-03-012:33:16 PM | 64.4 | 133.362 | 33.35 | 67.55 |
| 2016-03-012:33:20 PM | 64.287 | 133.362 | 33.35 | 67.55 |
| 2016-03-012:33:24 PM | 64.287 | 133.362 | 33.125 | 67.662 |
| 2016-03-012:33:29 PM | 64.287 | 133.362 | 32.9 | 67.662 |
| 2016-03-012:33:33 PM | 64.287 | 133.475 | 32.788 | 67.662 |
| 2016-03-012:33:37 PM | 64.287 | 133.362 | 32.788 | 67.662 |
| 2016-03-012:33:41 PM | 64.287 | 133.362 | 32.788 | 67.662 |
| 2016-03-012:33:45 PM | 64.287 | 133.362 | 32.9 | 67.662 |
| 2016-03-012:33:49 PM | 64.287 | 133.362 | 32.9 | 67.662 |
| 2016-03-012:33:53 PM | 64.287 | 133.362 | 33.012 | 67.775 |
| 2016-03-012:33:57 PM | 64.287 | 133.362 | 33.125 | 67.775 |
| 2016-03-012:34:01 PM | 64.287 | 133.25 | 33.012 | 67.775 |
| 2016-03-012:34:05 PM | 64.287 | 133.25 | 33.125 | 67.888 |
| 2016-03-012:34:09 PM | 64.287 | 133.25 | 33.125 | 67.775 |
| 2016-03-012:34:13 PM | 64.287 | 133.25 | 32.9 | 67.775 |
| 2016-03-012:34:17 PM | 64.287 | 133.25 | 32.675 | 67.888 |
| 2016-03-012:34:21 PM | 64.287 | 133.25 | 32.45 | 67.888 |
| 2016-03-012:34:25 PM | 64.287 | 133.138 | 32.562 | 67.888 |
| 2016-03-012:34:29 PM | 64.287 | 133.138 | 32.562 | 67.888 |
| 2016-03-012:34:33 PM | 64.287 | 133.138 | 32.562 | 67.888 |
| 2016-03-012:34:37 PM | 64.175 | 133.025 | 32.338 | 68 |
| 2016-03-012:34:41 PM | 64.175 | 133.025 | 32.338 | 68 |
| 2016-03-012:34:46 PM | 64.175 | 132.912 | 32.45 | 68 |
| 2016-03-012:34:50 PM | 64.175 | 132.912 | 32.45 | 68 |
| 2016-03-012:34:54 PM | 64.175 | 132.912 | 32.562 | 68 |
| 2016-03-012:34:58 PM | 64.175 | 132.8 | 32.562 | 68 |
| 2016-03-012:35:02 PM | 64.062 | 132.8 | 32.675 | 68 |
| 2016-03-012:35:06 PM | 64.175 | 132.8 | 32.9 | 68.112 |
| 2016-03-012:35:10 PM | 64.062 | 132.8 | 33.012 | 68.112 |
| 2016-03-012:35:14 PM | 64.062 | 132.688 | 33.125 | 68.112 |
| 2016-03-012:35:18 PM | 64.062 | 132.688 | 33.125 | 68.112 |
| 2016-03-012:35:22 PM | 64.062 | 132.688 | 32.9 | 68.112 |
| 2016-03-012:35:26 PM | 64.062 | 132.575 | 32.675 | 68.112 |
| 2016-03-012:35:30 PM | 64.062 | 132.575 | 32.675 | 68.112 |
| 2016-03-012:35:34 PM | 64.062 | 132.575 | 32.675 | 68.225 |
| 2016-03-012:35:38 PM | 63.95 | 132.575 | 32.562 | 68.225 |
| 2016-03-012:35:42 PM | 63.95 | 132.575 | 32.562 | 68.225 |
| 2016-03-012:35:47 PM | 63.95 | 132.462 | 32.45 | 68.225 |
| 2016-03-012:35:51 PM | 63.95 | 132.462 | 32.338 | 68.225 |
| 2016-03-012:35:55 PM | 63.95 | 132.462 | 32.225 | 68.338 |
| 2016-03-012:35:59 PM | 63.95 | 132.35 | 32.225 | 68.338 |
| 2016-03-012:36:03 PM | 63.95 | 132.35 | 32.225 | 68.338 |
| 2016-03-012:36:07 PM | 63.95 | 132.35 | 32.338 | 68.338 |
| 2016-03-012:36:11 PM | 63.838 | 132.238 | 32.338 | 68.338 |
| 2016-03-012:36:15 PM | 63.838 | 132.125 | 32.562 | 68.338 |
| 2016-03-012:36:19 PM | 63.838 | 132.125 | 32.562 | 68.45 |
| 2016-03-012:36:23 PM | 63.838 | 132.125 | 32.675 | 68.45 |
| 2016-03-012:36:27 PM | 63.95 | 132.125 | 32.788 | 68.45 |
| 2016-03-012:36:31 PM | 63.838 | 132.125 | 32.9 | 68.45 |
| 2016-03-012:36:35 PM | 63.838 | 132.125 | 32.788 | 68.45 |
| 2016-03-012:36:39 PM | 63.838 | 132.125 | 32.788 | 68.45 |
| 2016-03-012:36:44 PM | 63.838 | 132.012 | 32.675 | 68.562 |
| 2016-03-012:36:48 PM | 63.838 | 132.012 | 32.788 | 68.562 |
| 2016-03-012:36:52 PM | 63.838 | 132.012 | 32.675 | 68.562 |
| 2016-03-012:36:56 PM | 63.725 | 132.012 | 32.788 | 68.562 |
| 2016-03-012:37:00 PM | 63.838 | 132.125 | 32.9 | 68.562 |
| 2016-03-012:37:04 PM | 63.838 | 132.125 | 33.012 | 68.562 |
| 2016-03-012:37:08 PM | 63.838 | 132.125 | 33.012 | 68.562 |
| 2016-03-012:37:12 PM | 63.725 | 132.125 | 33.012 | 68.675 |
| 2016-03-012:37:16 PM | 63.725 | 132.125 | 33.125 | 68.562 |
| 2016-03-012:37:20 PM | 63.725 | 132.125 | 33.35 | 68.675 |
| 2016-03-012:37:24 PM | 63.725 | 132.125 | 33.462 | 68.675 |
| 2016-03-012:37:28 PM | 63.725 | 132.125 | 33.575 | 68.675 |
| 2016-03-012:37:32 PM | 63.725 | 132.125 | 33.688 | 68.675 |
| 2016-03-012:37:36 PM | 63.725 | 132.125 | 33.8 | 68.675 |
| 2016-03-012:37:41 PM | 63.725 | 132.125 | 33.912 | 68.675 |
| 2016-03-012:37:45 PM | 63.725 | 132.125 | 34.025 | 68.675 |
| 2016-03-012:37:49 PM | 63.725 | 132.125 | 34.138 | 68.675 |
| 2016-03-012:37:53 PM | 63.725 | 132.125 | 34.25 | 68.675 |
| 2016-03-012:37:57 PM | 63.725 | 132.125 | 34.138 | 68.675 |
| 2016-03-012:38:01 PM | 63.725 | 132.238 | 34.025 | 68.788 |
| 2016-03-012:38:05 PM | 63.725 | 132.238 | 34.025 | 68.788 |
| 2016-03-012:38:09 PM | 63.725 | 132.238 | 34.138 | 68.788 |
| 2016-03-012:38:13 PM | 63.725 | 132.125 | 34.025 | 68.788 |
| 2016-03-012:38:17 PM | 63.838 | 132.125 | 34.025 | 68.788 |
| 2016-03-012:38:21 PM | 63.725 | 132.125 | 34.025 | 68.788 |
| 2016-03-012:38:25 PM | 63.725 | 132.125 | 34.025 | 68.788 |
| 2016-03-012:38:29 PM | 63.725 | 132.238 | 33.912 | 68.788 |
| 2016-03-012:38:33 PM | 63.725 | 132.238 | 34.025 | 68.788 |
| 2016-03-012:38:38 PM | 63.725 | 132.125 | 34.025 | 68.788 |
| 2016-03-012:38:42 PM | 63.725 | 132.238 | 33.912 | 68.788 |
| 2016-03-012:38:46 PM | 63.838 | 132.238 | 33.8 | 68.788 |
| 2016-03-012:38:50 PM | 63.725 | 132.238 | 33.912 | 68.788 |
| 2016-03-012:38:54 PM | 63.838 | 132.238 | 34.025 | 68.788 |
| 2016-03-012:38:58 PM | 63.838 | 132.238 | 33.912 | 68.788 |
| 2016-03-012:39:02 PM | 63.838 | 132.238 | 34.025 | 68.788 |
| 2016-03-012:39:06 PM | 63.838 | 132.238 | 34.025 | 68.788 |
| 2016-03-012:39:10 PM | 63.838 | 132.238 | 34.025 | 68.788 |
| 2016-03-012:39:14 PM | 63.838 | 132.238 | 34.138 | 68.788 |
| 2016-03-012:39:18 PM | 63.838 | 132.238 | 34.25 | 68.788 |
| 2016-03-012:39:22 PM | 63.95 | 132.238 | 34.138 | 68.788 |
| 2016-03-012:39:26 PM | 63.95 | 132.125 | 34.138 | 68.788 |
| 2016-03-012:39:30 PM | 63.838 | 132.125 | 34.138 | 68.788 |
| 2016-03-012:39:34 PM | 63.838 | 132.125 | 34.138 | 68.788 |
| 2016-03-012:39:39 PM | 63.95 | 132.012 | 34.25 | 68.788 |
| 2016-03-012:39:43 PM | 63.838 | 132.012 | 34.138 | 68.788 |
| 2016-03-012:39:47 PM | 63.838 | 132.012 | 34.138 | 68.788 |
| 2016-03-012:39:51 PM | 63.838 | 132.012 | 34.138 | 68.788 |
| 2016-03-012:39:55 PM | 63.838 | 131.9 | 34.025 | 68.788 |
| 2016-03-012:39:59 PM | 63.838 | 131.9 | 34.025 | 68.788 |
| 2016-03-012:40:03 PM | 63.838 | 131.9 | 34.138 | 68.788 |
| 2016-03-012:40:07 PM | 63.838 | 131.9 | 34.138 | 68.788 |
| 2016-03-012:40:11 PM | 63.838 | 131.9 | 34.138 | 68.9 |
| 2016-03-012:40:15 PM | 63.838 | 131.9 | 34.138 | 68.9 |
| 2016-03-012:40:19 PM | 63.838 | 131.9 | 34.025 | 68.9 |
| 2016-03-012:40:23 PM | 63.838 | 131.9 | 34.025 | 68.9 |
| 2016-03-012:40:27 PM | 63.838 | 131.9 | 34.025 | 68.788 |
| 2016-03-012:40:31 PM | 63.838 | 131.9 | 34.025 | 68.9 |
| 2016-03-012:40:36 PM | 63.838 | 131.788 | 34.025 | 68.9 |
| 2016-03-012:40:40 PM | 63.838 | 131.788 | 33.912 | 68.9 |
| 2016-03-012:40:44 PM | 63.838 | 131.788 | 33.8 | 68.9 |
| 2016-03-012:40:48 PM | 63.838 | 131.9 | 33.8 | 68.9 |
| 2016-03-012:40:52 PM | 63.838 | 131.9 | 33.688 | 68.9 |
| 2016-03-012:40:56 PM | 63.838 | 131.788 | 33.575 | 68.9 |
| 2016-03-012:41:00 PM | 63.95 | 131.9 | 33.462 | 68.9 |
| 2016-03-012:41:04 PM | 63.95 | 131.9 | 33.35 | 68.9 |
| 2016-03-012:41:08 PM | 63.838 | 131.9 | 33.462 | 68.9 |
| 2016-03-012:41:12 PM | 63.838 | 131.9 | 33.462 | 68.9 |
| 2016-03-012:41:16 PM | 63.95 | 131.788 | 33.462 | 68.9 |
| 2016-03-012:41:20 PM | 63.95 | 131.788 | 33.575 | 68.9 |
| 2016-03-012:41:24 PM | 63.95 | 131.788 | 33.575 | 68.9 |
| 2016-03-012:41:28 PM | 63.838 | 131.788 | 33.575 | 68.9 |
| 2016-03-012:41:33 PM | 63.838 | 131.788 | 33.8 | 68.9 |
| 2016-03-012:41:37 PM | 63.838 | 131.788 | 33.8 | 68.9 |
| 2016-03-012:41:41 PM | 63.95 | 131.788 | 33.688 | 68.9 |
| 2016-03-012:41:45 PM | 63.95 | 131.675 | 33.575 | 68.9 |
| 2016-03-012:41:49 PM | 63.838 | 131.675 | 33.462 | 68.788 |
| 2016-03-012:41:53 PM | 63.95 | 131.675 | 33.575 | 68.9 |
| 2016-03-012:41:57 PM | 63.95 | 131.562 | 33.575 | 68.9 |
| 2016-03-012:42:01 PM | 63.95 | 131.562 | 33.688 | 68.9 |
| 2016-03-012:42:05 PM | 63.95 | 131.562 | 33.688 | 68.9 |
| 2016-03-012:42:09 PM | 63.95 | 131.562 | 33.575 | 69.012 |
| 2016-03-012:42:13 PM | 63.95 | 131.45 | 33.575 | 69.012 |
| 2016-03-012:42:17 PM | 63.95 | 131.45 | 33.575 | 68.9 |
| 2016-03-012:42:21 PM | 63.95 | 131.338 | 33.688 | 69.012 |
| 2016-03-012:42:25 PM | 63.95 | 131.338 | 33.688 | 68.9 |
| 2016-03-012:42:30 PM | 63.95 | 131.338 | 33.688 | 68.9 |
| 2016-03-012:42:34 PM | 63.95 | 131.338 | 33.35 | 68.9 |
| 2016-03-012:42:38 PM | 63.95 | 131.225 | 33.125 | 68.9 |
| 2016-03-012:42:42 PM | 63.95 | 131.225 | 33.125 | 69.012 |
| 2016-03-012:42:46 PM | 63.95 | 131.225 | 33.238 | 69.012 |
| 2016-03-012:42:50 PM | 63.95 | 131.225 | 33.125 | 69.012 |
| 2016-03-012:42:54 PM | 63.95 | 131.112 | 32.9 | 69.012 |
| 2016-03-012:42:58 PM | 63.95 | 131.112 | 32.9 | 69.012 |
| 2016-03-012:43:02 PM | 63.95 | 131.112 | 32.9 | 68.9 |
| 2016-03-012:43:06 PM | 63.95 | 131.112 | 33.012 | 68.9 |
| 2016-03-012:43:10 PM | 63.95 | 131 | 33.125 | 69.012 |
| 2016-03-012:43:14 PM | 63.95 | 131 | 33.238 | 69.012 |
| 2016-03-012:43:18 PM | 63.95 | 130.887 | 33.238 | 68.9 |
| 2016-03-012:43:23 PM | 63.95 | 130.775 | 33.238 | 69.012 |
| 2016-03-012:43:27 PM | 63.95 | 130.775 | 33.238 | 69.012 |
| 2016-03-012:43:31 PM | 63.95 | 130.662 | 33.238 | 69.012 |
| 2016-03-012:43:35 PM | 63.95 | 130.662 | 33.238 | 69.012 |
| 2016-03-012:43:39 PM | 63.95 | 130.662 | 33.238 | 69.012 |
| 2016-03-012:43:43 PM | 64.062 | 130.55 | 33.238 | 69.012 |
| 2016-03-012:43:47 PM | 64.062 | 130.55 | 33.35 | 69.012 |
| 2016-03-012:43:51 PM | 64.175 | 130.55 | 33.35 | 69.012 |
| 2016-03-012:43:55 PM | 64.175 | 130.55 | 33.462 | 69.012 |
| 2016-03-012:43:59 PM | 64.175 | 130.438 | 33.462 | 69.012 |
| 2016-03-012:44:03 PM | 64.175 | 130.438 | 33.688 | 69.012 |
| 2016-03-012:44:07 PM | 64.175 | 130.325 | 33.688 | 69.012 |
| 2016-03-012:44:11 PM | 64.175 | 130.325 | 33.8 | 69.012 |
| 2016-03-012:44:15 PM | 64.175 | 130.325 | 33.8 | 69.012 |
| 2016-03-012:44:19 PM | 64.287 | 130.212 | 33.688 | 69.125 |
| 2016-03-012:44:24 PM | 64.287 | 130.212 | 33.575 | 69.012 |
| 2016-03-012:44:28 PM | 64.287 | 130.212 | 33.35 | 69.012 |
| 2016-03-012:44:32 PM | 64.4 | 130.212 | 33.125 | 69.012 |
| 2016-03-012:44:36 PM | 64.4 | 130.1 | 33.125 | 69.012 |
| 2016-03-012:44:40 PM | 64.4 | 130.1 | 33.012 | 69.125 |
| 2016-03-012:44:44 PM | 64.4 | 130.1 | 32.9 | 69.125 |
| 2016-03-012:44:48 PM | 64.512 | 130.1 | 32.675 | 69.125 |
| 2016-03-012:44:52 PM | 64.512 | 130.1 | 32.45 | 69.125 |
| 2016-03-012:44:56 PM | 64.512 | 130.1 | 32.338 | 69.125 |
| 2016-03-012:45:00 PM | 64.625 | 129.988 | 32.338 | 69.125 |
| 2016-03-012:45:04 PM | 64.625 | 130.1 | 32.338 | 69.125 |
| 2016-03-012:45:08 PM | 64.625 | 129.988 | 32.45 | 69.125 |
| 2016-03-012:45:12 PM | 64.625 | 130.1 | 32.562 | 69.125 |
| 2016-03-012:45:16 PM | 64.512 | 129.988 | 32.562 | 69.125 |
| 2016-03-012:45:21 PM | 64.625 | 129.988 | 32.675 | 69.125 |
| 2016-03-012:45:25 PM | 64.512 | 129.988 | 32.675 | 69.125 |
| 2016-03-012:45:29 PM | 64.512 | 129.875 | 32.675 | 69.238 |
| 2016-03-012:45:33 PM | 64.512 | 129.875 | 32.675 | 69.125 |
| 2016-03-012:45:37 PM | 64.512 | 129.875 | 32.788 | 69.238 |
| 2016-03-012:45:41 PM | 64.512 | 129.762 | 32.788 | 69.125 |
| 2016-03-012:45:45 PM | 64.512 | 129.762 | 32.788 | 69.125 |
| 2016-03-012:45:49 PM | 64.4 | 129.762 | 32.9 | 69.125 |
| 2016-03-012:45:53 PM | 64.4 | 129.65 | 33.012 | 69.125 |
| 2016-03-012:45:57 PM | 64.512 | 129.65 | 33.012 | 69.125 |
| 2016-03-012:46:01 PM | 64.4 | 129.538 | 33.012 | 69.238 |
| 2016-03-012:46:05 PM | 64.4 | 129.538 | 33.012 | 69.238 |
| 2016-03-012:46:09 PM | 64.4 | 129.538 | 33.012 | 69.238 |
| 2016-03-012:46:13 PM | 64.4 | 129.538 | 33.012 | 69.238 |
| 2016-03-012:46:18 PM | 64.4 | 129.538 | 33.125 | 69.238 |
| 2016-03-012:46:22 PM | 64.4 | 129.425 | 33.012 | 69.238 |
| 2016-03-012:46:26 PM | 64.4 | 129.425 | 33.238 | 69.238 |
| 2016-03-012:46:30 PM | 64.4 | 129.425 | 33.238 | 69.238 |
| 2016-03-012:46:34 PM | 64.4 | 129.425 | 33.238 | 69.238 |
| 2016-03-012:46:38 PM | 64.287 | 129.425 | 33.35 | 69.238 |
| 2016-03-012:46:42 PM | 64.287 | 129.312 | 33.238 | 69.238 |
| 2016-03-012:46:46 PM | 64.287 | 129.425 | 33.35 | 69.238 |
| 2016-03-012:46:50 PM | 64.287 | 129.312 | 33.462 | 69.238 |
| 2016-03-012:46:54 PM | 64.287 | 129.312 | 33.462 | 69.238 |
| 2016-03-012:46:58 PM | 64.287 | 129.312 | 33.462 | 69.238 |
| 2016-03-012:47:02 PM | 64.287 | 129.312 | 33.688 | 69.238 |
| 2016-03-012:47:06 PM | 64.287 | 129.312 | 33.8 | 69.238 |
| 2016-03-012:47:10 PM | 64.287 | 129.312 | 33.912 | 69.238 |
| 2016-03-012:47:15 PM | 64.287 | 129.312 | 33.912 | 69.238 |
| 2016-03-012:47:19 PM | 64.175 | 129.312 | 33.688 | 69.238 |
| 2016-03-012:47:23 PM | 64.287 | 129.312 | 33.462 | 69.238 |
| 2016-03-012:47:27 PM | 64.287 | 129.312 | 33.35 | 69.35 |
| 2016-03-012:47:31 PM | 64.175 | 129.312 | 33.35 | 69.238 |
| 2016-03-012:47:35 PM | 64.175 | 129.312 | 33.462 | 69.35 |
| 2016-03-012:47:39 PM | 64.175 | 129.2 | 33.462 | 69.238 |
| 2016-03-012:47:43 PM | 64.175 | 129.312 | 33.238 | 69.238 |
| 2016-03-012:47:47 PM | 64.175 | 129.312 | 32.9 | 69.238 |
| 2016-03-012:47:51 PM | 64.175 | 129.312 | 32.675 | 69.35 |
| 2016-03-012:47:55 PM | 64.175 | 129.312 | 32.562 | 69.35 |
| 2016-03-012:48:00 PM | 64.175 | 129.2 | 32.562 | 69.238 |
| 2016-03-012:48:04 PM | 64.175 | 129.2 | 32.562 | 69.35 |
| 2016-03-012:48:08 PM | 64.175 | 129.088 | 32.675 | 69.35 |
| 2016-03-012:48:12 PM | 64.175 | 129.088 | 32.562 | 69.35 |
| 2016-03-012:48:16 PM | 64.175 | 129.088 | 32.675 | 69.35 |
| 2016-03-012:48:20 PM | 64.175 | 129.088 | 32.675 | 69.35 |
| 2016-03-012:48:24 PM | 64.175 | 128.975 | 32.562 | 69.35 |
| 2016-03-012:48:28 PM | 64.175 | 128.975 | 32.562 | 69.35 |
| 2016-03-012:48:32 PM | 64.175 | 128.863 | 32.562 | 69.35 |
| 2016-03-012:48:36 PM | 64.175 | 128.863 | 32.562 | 69.35 |
| 2016-03-012:48:40 PM | 64.175 | 128.863 | 32.562 | 69.35 |
| 2016-03-012:48:44 PM | 64.175 | 128.975 | 32.675 | 69.35 |
| 2016-03-012:48:48 PM | 64.175 | 128.863 | 32.788 | 69.35 |
| 2016-03-012:48:52 PM | 64.175 | 128.863 | 32.788 | 69.35 |
| 2016-03-012:48:57 PM | 64.175 | 128.75 | 32.675 | 69.462 |
| 2016-03-012:49:01 PM | 64.175 | 128.75 | 32.788 | 69.462 |
| 2016-03-012:49:05 PM | 64.287 | 128.75 | 32.788 | 69.35 |
| 2016-03-012:49:09 PM | 64.175 | 128.637 | 32.788 | 69.35 |
| 2016-03-012:49:13 PM | 64.287 | 128.637 | 32.788 | 69.35 |
| 2016-03-012:49:17 PM | 64.287 | 128.525 | 32.9 | 69.35 |
| 2016-03-012:49:21 PM | 64.287 | 128.525 | 32.9 | 69.35 |
| 2016-03-012:49:25 PM | 64.287 | 128.412 | 33.012 | 69.35 |
| 2016-03-012:49:29 PM | 64.287 | 128.412 | 33.012 | 69.35 |
| 2016-03-012:49:33 PM | 64.287 | 128.3 | 33.125 | 69.35 |
| 2016-03-012:49:37 PM | 64.4 | 128.3 | 33.125 | 69.35 |
| 2016-03-012:49:41 PM | 64.287 | 128.188 | 33.125 | 69.35 |
| 2016-03-012:49:45 PM | 64.4 | 128.188 | 33.238 | 69.35 |
| 2016-03-012:49:49 PM | 64.287 | 128.188 | 33.238 | 69.35 |
| 2016-03-012:49:54 PM | 64.287 | 128.188 | 33.238 | 69.35 |
| 2016-03-012:49:58 PM | 64.4 | 128.188 | 33.238 | 69.35 |
| 2016-03-012:50:02 PM | 64.4 | 128.075 | 33.238 | 69.35 |
| 2016-03-012:50:06 PM | 64.4 | 128.075 | 33.238 | 69.35 |
| 2016-03-012:50:10 PM | 64.512 | 128.075 | 33.125 | 69.462 |
| 2016-03-012:50:14 PM | 64.512 | 128.075 | 33.238 | 69.35 |
| 2016-03-012:50:18 PM | 64.512 | 127.962 | 33.35 | 69.35 |
| 2016-03-012:50:22 PM | 64.512 | 127.962 | 33.238 | 69.35 |
| 2016-03-012:50:26 PM | 64.512 | 127.85 | 33.125 | 69.462 |
| 2016-03-012:50:30 PM | 64.512 | 127.85 | 33.125 | 69.462 |
| 2016-03-012:50:34 PM | 64.512 | 127.738 | 33.125 | 69.462 |
| 2016-03-012:50:38 PM | 64.512 | 127.738 | 33.125 | 69.35 |
| 2016-03-012:50:42 PM | 64.4 | 127.625 | 33.125 | 69.462 |
| 2016-03-012:50:46 PM | 64.512 | 127.625 | 33.125 | 69.35 |
| 2016-03-012:50:51 PM | 64.512 | 127.512 | 33.012 | 69.35 |
| 2016-03-012:50:55 PM | 64.4 | 127.512 | 32.788 | 69.462 |
| 2016-03-012:50:59 PM | 64.4 | 127.512 | 32.675 | 69.462 |
| 2016-03-012:51:03 PM | 64.4 | 127.4 | 32.562 | 69.462 |
| 2016-03-012:51:07 PM | 64.4 | 127.288 | 32.45 | 69.35 |
| 2016-03-012:51:11 PM | 64.4 | 127.288 | 32.562 | 69.462 |
| 2016-03-012:51:15 PM | 64.4 | 127.288 | 32.675 | 69.35 |
| 2016-03-012:51:19 PM | 64.4 | 127.175 | 32.788 | 69.35 |
| 2016-03-012:51:23 PM | 64.4 | 127.175 | 32.9 | 69.35 |
| 2016-03-012:51:27 PM | 64.4 | 127.175 | 33.012 | 69.462 |
| 2016-03-012:51:31 PM | 64.4 | 127.062 | 33.012 | 69.35 |
| 2016-03-012:51:35 PM | 64.4 | 127.062 | 32.9 | 69.462 |
| 2016-03-012:51:39 PM | 64.4 | 126.95 | 32.9 | 69.35 |
| 2016-03-012:51:44 PM | 64.287 | 126.95 | 32.9 | 69.462 |
| 2016-03-012:51:48 PM | 64.287 | 126.838 | 33.012 | 69.462 |
| 2016-03-012:51:52 PM | 64.4 | 126.838 | 33.125 | 69.35 |
| 2016-03-012:51:56 PM | 64.4 | 126.838 | 33.238 | 69.462 |
| 2016-03-012:52:00 PM | 64.4 | 126.838 | 33.35 | 69.35 |
| 2016-03-012:52:04 PM | 64.4 | 126.725 | 33.35 | 69.462 |
| 2016-03-012:52:08 PM | 64.287 | 126.612 | 33.35 | 69.35 |
| 2016-03-012:52:12 PM | 64.4 | 126.612 | 33.462 | 69.35 |
| 2016-03-012:52:16 PM | 64.287 | 126.612 | 33.238 | 69.462 |
| 2016-03-012:52:20 PM | 64.287 | 126.5 | 33.012 | 69.462 |
| 2016-03-012:52:24 PM | 64.287 | 126.5 | 32.788 | 69.462 |
| 2016-03-012:52:28 PM | 64.4 | 126.5 | 32.562 | 69.462 |
| 2016-03-012:52:32 PM | 64.4 | 126.5 | 32.45 | 69.462 |
| 2016-03-012:52:36 PM | 64.287 | 126.388 | 32.225 | 69.462 |
| 2016-03-012:52:41 PM | 64.287 | 126.388 | 32.112 | 69.462 |
| 2016-03-012:52:45 PM | 64.287 | 126.275 | 32 | 69.462 |
| 2016-03-012:52:49 PM | 64.287 | 126.275 | 32 | 69.462 |
| 2016-03-012:52:53 PM | 64.287 | 126.275 | 31.888 | 69.462 |
| 2016-03-012:52:57 PM | 64.287 | 126.275 | 31.888 | 69.462 |
| 2016-03-012:53:01 PM | 64.287 | 126.163 | 31.888 | 69.462 |
| 2016-03-012:53:05 PM | 64.287 | 126.163 | 31.888 | 69.462 |
| 2016-03-012:53:09 PM | 64.287 | 126.163 | 32 | 69.462 |
| 2016-03-012:53:13 PM | 64.287 | 126.163 | 32 | 69.462 |
| 2016-03-012:53:17 PM | 64.287 | 126.163 | 32 | 69.462 |
| 2016-03-012:53:21 PM | 64.287 | 126.05 | 32 | 69.462 |
| 2016-03-012:53:25 PM | 64.287 | 126.05 | 31.888 | 69.462 |
| 2016-03-012:53:29 PM | 64.287 | 125.938 | 31.775 | 69.462 |
| 2016-03-012:53:33 PM | 64.287 | 125.938 | 31.775 | 69.462 |
| 2016-03-012:53:38 PM | 64.287 | 125.938 | 31.888 | 69.462 |
| 2016-03-012:53:42 PM | 64.287 | 125.825 | 31.888 | 69.462 |
| 2016-03-012:53:46 PM | 64.175 | 125.825 | 32 | 69.462 |
| 2016-03-012:53:50 PM | 64.175 | 125.825 | 32.225 | 69.575 |
| 2016-03-012:53:54 PM | 64.175 | 125.825 | 32.338 | 69.462 |
| 2016-03-012:53:58 PM | 64.175 | 125.712 | 32.338 | 69.575 |
| 2016-03-012:54:02 PM | 64.175 | 125.825 | 32.45 | 69.462 |
| 2016-03-012:54:06 PM | 64.175 | 125.825 | 32.562 | 69.575 |
| 2016-03-012:54:10 PM | 64.175 | 125.712 | 32.45 | 69.575 |
| 2016-03-012:54:14 PM | 64.287 | 125.825 | 32.562 | 69.575 |
| 2016-03-012:54:18 PM | 64.175 | 125.712 | 32.45 | 69.575 |
| 2016-03-012:54:22 PM | 64.175 | 125.712 | 32.45 | 69.575 |
| 2016-03-012:54:26 PM | 64.287 | 125.712 | 32.45 | 69.575 |
| 2016-03-012:54:30 PM | 64.175 | 125.712 | 32.45 | 69.575 |
| 2016-03-012:54:35 PM | 64.287 | 125.712 | 32.562 | 69.575 |
| 2016-03-012:54:39 PM | 64.287 | 125.6 | 32.675 | 69.575 |
| 2016-03-012:54:43 PM | 64.287 | 125.6 | 32.675 | 69.575 |
| 2016-03-012:54:47 PM | 64.175 | 125.6 | 32.562 | 69.462 |
| 2016-03-012:54:51 PM | 64.175 | 125.6 | 32.562 | 69.575 |
| 2016-03-012:54:55 PM | 64.287 | 125.488 | 32.562 | 69.575 |
| 2016-03-012:55:03 PM | 64.175 | 125.488 | 32.675 | 69.462 |
| 2016-03-012:55:07 PM | 64.287 | 125.488 | 32.675 | 69.575 |
| 2016-03-012:55:11 PM | 64.287 | 125.488 | 32.675 | 69.462 |
| 2016-03-012:55:15 PM | 64.287 | 125.488 | 32.675 | 69.575 |
| 2016-03-012:55:19 PM | 64.175 | 125.488 | 32.675 | 69.575 |
| 2016-03-012:55:23 PM | 64.287 | 125.488 | 32.675 | 69.575 |
| 2016-03-012:55:27 PM | 64.287 | 125.375 | 32.788 | 69.575 |
| 2016-03-012:55:31 PM | 64.175 | 125.375 | 32.9 | 69.575 |
| 2016-03-012:55:35 PM | 64.175 | 125.375 | 32.9 | 69.575 |
| 2016-03-012:55:39 PM | 64.175 | 125.375 | 33.012 | 69.575 |
| 2016-03-012:55:44 PM | 64.175 | 125.375 | 33.238 | 69.575 |
| 2016-03-012:55:48 PM | 64.175 | 125.375 | 33.238 | 69.575 |
| 2016-03-012:55:52 PM | 64.175 | 125.375 | 33.238 | 69.688 |
| 2016-03-012:55:56 PM | 64.175 | 125.375 | 33.35 | 69.575 |
| 2016-03-012:56:00 PM | 64.175 | 125.375 | 33.462 | 69.575 |
| 2016-03-012:56:04 PM | 64.062 | 125.375 | 33.575 | 69.575 |
| 2016-03-012:56:08 PM | 64.175 | 125.375 | 33.462 | 69.575 |
| 2016-03-012:56:12 PM | 64.175 | 125.375 | 33.575 | 69.575 |
| 2016-03-012:56:16 PM | 64.175 | 125.375 | 33.575 | 69.575 |
| 2016-03-012:56:20 PM | 64.175 | 125.375 | 33.8 | 69.575 |
| 2016-03-012:56:24 PM | 64.175 | 125.375 | 33.912 | 69.575 |
| 2016-03-012:56:28 PM | 64.175 | 125.375 | 34.025 | 69.575 |
| 2016-03-012:56:32 PM | 64.287 | 125.375 | 34.138 | 69.575 |
| 2016-03-012:56:36 PM | 64.287 | 125.375 | 34.25 | 69.575 |
| 2016-03-012:56:40 PM | 64.287 | 125.375 | 34.362 | 69.575 |
| 2016-03-012:56:45 PM | 64.287 | 125.375 | 34.362 | 69.575 |
| 2016-03-012:56:49 PM | 64.287 | 125.375 | 34.475 | 69.575 |
| 2016-03-012:56:53 PM | 64.287 | 125.375 | 34.588 | 69.575 |
| 2016-03-012:56:57 PM | 64.287 | 125.375 | 34.588 | 69.575 |
| 2016-03-012:57:01 PM | 64.287 | 125.375 | 34.7 | 69.688 |
| 2016-03-012:57:05 PM | 64.287 | 125.375 | 34.7 | 69.575 |
| 2016-03-012:57:09 PM | 64.287 | 125.375 | 34.7 | 69.688 |
| 2016-03-012:57:13 PM | 64.287 | 125.375 | 34.7 | 69.575 |
| 2016-03-012:57:17 PM | 64.287 | 125.375 | 34.7 | 69.688 |
| 2016-03-012:57:21 PM | 64.287 | 125.375 | 34.7 | 69.688 |
| 2016-03-012:57:25 PM | 64.287 | 125.375 | 34.7 | 69.688 |
| 2016-03-012:57:29 PM | 64.287 | 125.375 | 34.7 | 69.575 |
| 2016-03-012:57:33 PM | 64.287 | 125.375 | 34.7 | 69.575 |
| 2016-03-012:57:38 PM | 64.287 | 125.375 | 34.588 | 69.688 |
| 2016-03-012:57:42 PM | 64.287 | 125.375 | 34.588 | 69.688 |
| 2016-03-012:57:46 PM | 64.287 | 125.488 | 34.588 | 69.688 |
| 2016-03-012:57:50 PM | 64.287 | 125.488 | 34.588 | 69.688 |
| 2016-03-012:57:54 PM | 64.287 | 125.488 | 34.588 | 69.688 |
| 2016-03-012:57:58 PM | 64.287 | 125.488 | 34.588 | 69.688 |
| 2016-03-012:58:02 PM | 64.287 | 125.6 | 34.588 | 69.688 |
| 2016-03-012:58:06 PM | 64.287 | 125.488 | 34.588 | 69.688 |
| 2016-03-012:58:14 PM | 64.175 | 125.488 | 34.475 | 69.688 |
| 2016-03-012:58:18 PM | 64.287 | 125.488 | 34.588 | 69.688 |
| 2016-03-012:58:22 PM | 64.175 | 125.6 | 34.588 | 69.688 |
| 2016-03-012:58:26 PM | 64.287 | 125.6 | 34.588 | 69.688 |
| 2016-03-012:58:30 PM | 64.287 | 125.6 | 34.588 | 69.688 |
| 2016-03-012:58:35 PM | 64.175 | 125.6 | 34.362 | 69.688 |
| 2016-03-012:58:39 PM | 64.287 | 125.6 | 34.362 | 69.688 |
| 2016-03-012:58:43 PM | 64.175 | 125.6 | 34.25 | 69.688 |
| 2016-03-012:58:47 PM | 64.175 | 125.6 | 34.25 | 69.688 |
| 2016-03-012:58:51 PM | 64.175 | 125.6 | 34.362 | 69.688 |
| 2016-03-012:58:55 PM | 64.175 | 125.488 | 34.362 | 69.688 |
| 2016-03-012:58:59 PM | 64.175 | 125.488 | 34.362 | 69.688 |
| 2016-03-012:59:03 PM | 64.175 | 125.6 | 34.362 | 69.688 |
| 2016-03-012:59:07 PM | 64.175 | 125.488 | 34.588 | 69.688 |
| 2016-03-012:59:11 PM | 64.175 | 125.6 | 34.588 | 69.688 |
| 2016-03-012:59:15 PM | 64.175 | 125.6 | 34.475 | 69.688 |
| 2016-03-012:59:19 PM | 64.175 | 125.6 | 34.475 | 69.688 |
| 2016-03-012:59:23 PM | 64.175 | 125.6 | 34.362 | 69.688 |
| 2016-03-012:59:27 PM | 64.175 | 125.6 | 34.362 | 69.688 |
| 2016-03-012:59:32 PM | 64.175 | 125.6 | 34.362 | 69.688 |
| 2016-03-012:59:36 PM | 64.175 | 125.6 | 34.362 | 69.688 |
| 2016-03-012:59:40 PM | 64.175 | 125.6 | 34.362 | 69.688 |
| 2016-03-012:59:44 PM | 64.175 | 125.6 | 34.362 | 69.688 |
| 2016-03-012:59:48 PM | 64.175 | 125.488 | 34.475 | 69.688 |
| 2016-03-012:59:52 PM | 64.175 | 125.6 | 34.588 | 69.8 |
| 2016-03-012:59:56 PM | 64.287 | 125.6 | 34.588 | 69.688 |
| 2016-03-013:00:00 PM | 64.175 | 125.6 | 34.588 | 69.688 |
| 2016-03-013:00:04 PM | 64.175 | 125.6 | 34.7 | 69.8 |
| 2016-03-013:00:08 PM | 64.175 | 125.6 | 34.7 | 69.8 |
| 2016-03-013:00:12 PM | 64.175 | 125.6 | 34.588 | 69.8 |
| 2016-03-013:00:16 PM | 64.287 | 125.6 | 34.362 | 69.8 |
| 2016-03-013:00:20 PM | 64.175 | 125.6 | 34.25 | 69.8 |
| 2016-03-013:00:24 PM | 64.175 | 125.6 | 34.025 | 69.8 |
| 2016-03-013:00:28 PM | 64.287 | 125.6 | 33.912 | 69.688 |
| 2016-03-013:00:33 PM | 64.287 | 125.6 | 33.8 | 69.8 |
| 2016-03-013:00:37 PM | 64.287 | 125.6 | 33.8 | 69.8 |
| 2016-03-013:00:41 PM | 64.175 | 125.6 | 33.688 | 69.688 |
| 2016-03-013:00:45 PM | 64.287 | 125.6 | 33.688 | 69.688 |
| 2016-03-013:00:49 PM | 64.287 | 125.488 | 33.688 | 69.8 |
| 2016-03-013:00:53 PM | 64.287 | 125.488 | 33.688 | 69.688 |
| 2016-03-013:00:57 PM | 64.287 | 125.488 | 33.8 | 69.8 |
| 2016-03-013:01:01 PM | 64.175 | 125.488 | 33.8 | 69.8 |
| 2016-03-013:01:05 PM | 64.287 | 125.488 | 33.575 | 69.8 |
| 2016-03-013:01:09 PM | 64.287 | 125.375 | 33.575 | 69.8 |
| 2016-03-013:01:13 PM | 64.4 | 125.375 | 33.575 | 69.8 |
| 2016-03-013:01:17 PM | 64.512 | 125.488 | 33.462 | 69.8 |
| 2016-03-013:01:21 PM | 64.625 | 125.375 | 33.575 | 69.688 |
| 2016-03-013:01:25 PM | 64.738 | 125.375 | 33.462 | 69.688 |
| 2016-03-013:01:29 PM | 64.738 | 125.375 | 33.238 | 69.688 |
| 2016-03-013:01:34 PM | 64.738 | 125.375 | 32.9 | 69.688 |
| 2016-03-013:01:38 PM | 64.738 | 125.375 | 32.788 | 69.688 |
| 2016-03-013:01:42 PM | 64.738 | 125.375 | 32.675 | 69.688 |
| 2016-03-013:01:46 PM | 64.738 | 125.262 | 32.675 | 69.688 |
| 2016-03-013:01:50 PM | 64.738 | 125.262 | 32.675 | 69.688 |
| 2016-03-013:01:54 PM | 64.625 | 125.262 | 32.675 | 69.688 |
| 2016-03-013:01:58 PM | 64.625 | 125.262 | 32.675 | 69.688 |
| 2016-03-013:02:02 PM | 64.625 | 125.15 | 32.675 | 69.688 |
| 2016-03-013:02:06 PM | 64.625 | 125.15 | 32.788 | 69.688 |
| 2016-03-013:02:10 PM | 64.625 | 125.15 | 32.788 | 69.688 |
| 2016-03-013:02:14 PM | 64.625 | 125.15 | 32.788 | 69.688 |
| 2016-03-013:02:18 PM | 64.625 | 125.038 | 32.675 | 69.688 |
| 2016-03-013:02:22 PM | 64.625 | 125.038 | 32.562 | 69.688 |
| 2016-03-013:02:26 PM | 64.625 | 125.038 | 32.562 | 69.688 |
| 2016-03-013:02:31 PM | 64.625 | 124.925 | 32.675 | 69.688 |
| 2016-03-013:02:35 PM | 64.512 | 124.812 | 32.788 | 69.688 |
| 2016-03-013:02:39 PM | 64.625 | 124.925 | 32.788 | 69.688 |
| 2016-03-013:02:43 PM | 64.625 | 124.812 | 32.788 | 69.688 |
| 2016-03-013:02:47 PM | 64.625 | 124.7 | 32.675 | 69.688 |
| 2016-03-013:02:51 PM | 64.625 | 124.7 | 32.675 | 69.688 |
| 2016-03-013:02:55 PM | 64.512 | 124.588 | 32.675 | 69.688 |
| 2016-03-013:02:59 PM | 64.625 | 124.588 | 32.675 | 69.688 |
| 2016-03-013:03:03 PM | 64.625 | 124.588 | 32.675 | 69.688 |
| 2016-03-013:03:07 PM | 64.625 | 124.475 | 32.788 | 69.688 |
| 2016-03-013:03:11 PM | 64.625 | 124.475 | 32.788 | 69.688 |
| 2016-03-013:03:15 PM | 64.625 | 124.475 | 32.9 | 69.688 |
| 2016-03-013:03:19 PM | 64.625 | 124.475 | 33.125 | 69.688 |
| 2016-03-013:03:23 PM | 64.625 | 124.475 | 33.238 | 69.688 |
| 2016-03-013:03:31 PM | 64.625 | 124.362 | 33.238 | 69.688 |
| 2016-03-013:03:35 PM | 64.625 | 124.362 | 33.462 | 69.688 |
| 2016-03-013:03:39 PM | 64.738 | 124.362 | 33.462 | 69.688 |
| 2016-03-013:03:43 PM | 64.625 | 124.25 | 33.575 | 69.688 |
| 2016-03-013:03:47 PM | 64.625 | 124.25 | 33.8 | 69.8 |
| 2016-03-013:03:51 PM | 64.625 | 124.138 | 33.8 | 69.688 |
| 2016-03-013:03:55 PM | 64.625 | 124.138 | 33.912 | 69.688 |
| 2016-03-013:03:59 PM | 64.625 | 124.138 | 33.688 | 69.688 |
| 2016-03-013:04:03 PM | 64.625 | 124.138 | 33.688 | 69.688 |
| 2016-03-013:04:08 PM | 64.625 | 124.138 | 33.688 | 69.688 |
| 2016-03-013:04:12 PM | 64.625 | 124.138 | 33.688 | 69.8 |
| 2016-03-013:04:16 PM | 64.625 | 124.025 | 33.8 | 69.688 |
| 2016-03-013:04:20 PM | 64.625 | 124.138 | 33.8 | 69.688 |
| 2016-03-013:04:24 PM | 64.512 | 124.025 | 33.8 | 69.688 |
| 2016-03-013:04:28 PM | 64.512 | 124.025 | 33.688 | 69.688 |
| 2016-03-013:04:32 PM | 64.512 | 123.913 | 33.688 | 69.688 |
| 2016-03-013:04:36 PM | 64.512 | 123.913 | 33.462 | 69.688 |
| 2016-03-013:04:40 PM | 64.512 | 123.913 | 33.462 | 69.688 |
| 2016-03-013:04:44 PM | 64.512 | 123.913 | 33.35 | 69.688 |
| 2016-03-013:04:48 PM | 64.625 | 123.913 | 33.35 | 69.688 |
| 2016-03-013:04:52 PM | 64.512 | 123.8 | 33.125 | 69.688 |
| 2016-03-013:04:56 PM | 64.512 | 123.8 | 33.012 | 69.688 |
| 2016-03-013:05:00 PM | 64.512 | 123.8 | 32.788 | 69.688 |
| 2016-03-013:05:05 PM | 64.512 | 123.688 | 32.788 | 69.688 |
| 2016-03-013:05:09 PM | 64.512 | 123.688 | 32.788 | 69.688 |
| 2016-03-013:05:13 PM | 64.4 | 123.688 | 32.788 | 69.688 |
| 2016-03-013:05:17 PM | 64.4 | 123.575 | 32.675 | 69.688 |
| 2016-03-013:05:21 PM | 64.4 | 123.575 | 32.562 | 69.688 |
| 2016-03-013:05:25 PM | 64.4 | 123.575 | 32.562 | 69.688 |
| 2016-03-013:05:29 PM | 64.4 | 123.575 | 32.45 | 69.575 |
| 2016-03-013:05:33 PM | 64.4 | 123.575 | 32.562 | 69.575 |
| 2016-03-013:05:37 PM | 64.4 | 123.575 | 32.562 | 69.575 |
| 2016-03-013:05:41 PM | 64.4 | 123.575 | 32.562 | 69.575 |
| 2016-03-013:05:45 PM | 64.4 | 123.575 | 32.562 | 69.462 |
| 2016-03-013:05:49 PM | 64.4 | 123.575 | 32.562 | 69.462 |
| 2016-03-013:05:53 PM | 64.4 | 123.575 | 32.788 | 69.462 |
| 2016-03-013:05:57 PM | 64.4 | 123.462 | 32.788 | 69.575 |
| 2016-03-013:06:02 PM | 64.4 | 123.462 | 32.788 | 69.462 |
| 2016-03-013:06:06 PM | 64.4 | 123.35 | 32.9 | 69.462 |
| 2016-03-013:06:10 PM | 64.4 | 123.35 | 32.9 | 69.462 |
| 2016-03-013:06:14 PM | 64.287 | 123.35 | 33.012 | 69.462 |
| 2016-03-013:06:18 PM | 64.287 | 123.35 | 33.012 | 69.462 |
| 2016-03-013:06:22 PM | 64.287 | 123.238 | 33.012 | 69.462 |
| 2016-03-013:06:26 PM | 64.287 | 123.238 | 32.9 | 69.462 |
| 2016-03-013:06:30 PM | 64.287 | 123.125 | 32.9 | 69.462 |
| 2016-03-013:06:34 PM | 64.175 | 123.125 | 32.675 | 69.462 |
| 2016-03-013:06:38 PM | 64.175 | 123.125 | 32.675 | 69.462 |
| 2016-03-013:06:42 PM | 64.175 | 123.012 | 32.45 | 69.462 |
| 2016-03-013:06:46 PM | 64.175 | 123.125 | 32.338 | 69.35 |
| 2016-03-013:06:50 PM | 64.175 | 123.012 | 32.112 | 69.35 |
| 2016-03-013:06:54 PM | 64.175 | 123.012 | 32.112 | 69.35 |
| 2016-03-013:06:58 PM | 64.175 | 123.012 | 32.112 | 69.35 |
| 2016-03-013:07:03 PM | 64.175 | 123.012 | 32.112 | 69.35 |
| 2016-03-013:07:07 PM | 64.062 | 123.012 | 32.112 | 69.35 |
| 2016-03-013:07:11 PM | 64.062 | 123.012 | 32.225 | 69.35 |
| 2016-03-013:07:15 PM | 64.175 | 122.9 | 32.225 | 69.35 |
| 2016-03-013:07:19 PM | 64.062 | 122.9 | 32.112 | 69.35 |
| 2016-03-013:07:23 PM | 64.062 | 122.9 | 32 | 69.35 |
| 2016-03-013:07:27 PM | 64.175 | 122.9 | 32 | 69.238 |
| 2016-03-013:07:31 PM | 64.175 | 122.788 | 32 | 69.238 |
| 2016-03-013:07:35 PM | 64.175 | 122.788 | 32.112 | 69.35 |
| 2016-03-013:07:39 PM | 64.175 | 122.788 | 32.112 | 69.35 |
| 2016-03-013:07:43 PM | 64.175 | 122.675 | 32.225 | 69.238 |
| 2016-03-013:07:47 PM | 64.175 | 122.675 | 32.338 | 69.35 |
| 2016-03-013:07:51 PM | 64.175 | 122.562 | 32.45 | 69.238 |
| 2016-03-013:07:55 PM | 64.175 | 122.45 | 32.562 | 69.238 |
| 2016-03-013:07:59 PM | 64.175 | 122.45 | 32.675 | 69.238 |
| 2016-03-013:08:04 PM | 64.175 | 122.45 | 32.562 | 69.238 |
| 2016-03-013:08:08 PM | 64.175 | 122.338 | 32.675 | 69.238 |
| 2016-03-013:08:12 PM | 64.175 | 122.225 | 32.788 | 69.238 |
| 2016-03-013:08:16 PM | 64.175 | 122.112 | 32.788 | 69.238 |
| 2016-03-013:08:20 PM | 64.175 | 122.112 | 32.9 | 69.238 |
| 2016-03-013:08:24 PM | 64.175 | 122.112 | 33.012 | 69.238 |
| 2016-03-013:08:28 PM | 64.175 | 122 | 33.012 | 69.238 |
| 2016-03-013:08:32 PM | 64.175 | 121.888 | 32.9 | 69.238 |
| 2016-03-013:08:36 PM | 64.287 | 121.888 | 32.9 | 69.238 |
| 2016-03-013:08:40 PM | 64.287 | 121.888 | 32.9 | 69.238 |
| 2016-03-013:08:44 PM | 64.287 | 121.775 | 32.9 | 69.238 |
| 2016-03-013:08:48 PM | 64.287 | 121.775 | 32.788 | 69.125 |
| 2016-03-013:08:52 PM | 64.287 | 121.663 | 32.788 | 69.125 |
| 2016-03-013:08:56 PM | 64.287 | 121.55 | 32.788 | 69.125 |
| 2016-03-013:09:01 PM | 64.287 | 121.55 | 32.9 | 69.125 |
| 2016-03-013:09:05 PM | 64.287 | 121.55 | 32.788 | 69.125 |
| 2016-03-013:09:09 PM | 64.175 | 121.438 | 32.9 | 69.125 |
| 2016-03-013:09:13 PM | 64.287 | 121.438 | 32.9 | 69.125 |
| 2016-03-013:09:17 PM | 64.287 | 121.438 | 33.012 | 69.125 |
| 2016-03-013:09:21 PM | 64.287 | 121.438 | 33.012 | 69.125 |
| 2016-03-013:09:25 PM | 64.287 | 121.325 | 33.012 | 69.125 |
| 2016-03-013:09:29 PM | 64.287 | 121.325 | 33.012 | 69.125 |
| 2016-03-013:09:33 PM | 64.287 | 121.325 | 33.125 | 69.125 |
| 2016-03-013:09:37 PM | 64.287 | 121.212 | 33.238 | 69.125 |
| 2016-03-013:09:41 PM | 64.287 | 121.212 | 33.238 | 69.012 |
| 2016-03-013:09:45 PM | 64.287 | 121.1 | 33.238 | 69.012 |
| 2016-03-013:09:49 PM | 64.287 | 121.1 | 33.238 | 69.012 |
| 2016-03-013:09:53 PM | 64.287 | 121.1 | 33.238 | 69.012 |
| 2016-03-013:09:58 PM | 64.287 | 121.1 | 33.238 | 69.012 |
| 2016-03-013:10:02 PM | 64.287 | 120.988 | 33.012 | 69.012 |
| 2016-03-013:10:06 PM | 64.287 | 120.988 | 32.9 | 69.012 |
| 2016-03-013:10:10 PM | 64.287 | 120.875 | 32.675 | 69.012 |
| 2016-03-013:10:14 PM | 64.287 | 120.875 | 32.562 | 69.012 |
| 2016-03-013:10:18 PM | 64.4 | 120.875 | 32.45 | 69.012 |
| 2016-03-013:10:22 PM | 64.4 | 120.762 | 32.45 | 68.9 |
| 2016-03-013:10:26 PM | 64.4 | 120.762 | 32.338 | 68.9 |
| 2016-03-013:10:30 PM | 64.287 | 120.762 | 32.45 | 68.9 |
| 2016-03-013:10:34 PM | 64.4 | 120.762 | 32.45 | 68.9 |
| 2016-03-013:10:38 PM | 64.287 | 120.762 | 32.562 | 68.9 |
| 2016-03-013:10:42 PM | 64.4 | 120.762 | 32.675 | 68.9 |
| 2016-03-013:10:46 PM | 64.4 | 120.65 | 32.675 | 68.9 |
| 2016-03-013:10:50 PM | 64.287 | 120.65 | 32.788 | 68.9 |
| 2016-03-013:10:54 PM | 64.4 | 120.65 | 32.9 | 68.9 |
| 2016-03-013:10:59 PM | 64.287 | 120.65 | 33.125 | 68.9 |
| 2016-03-013:11:03 PM | 64.287 | 120.538 | 33.125 | 68.9 |
| 2016-03-013:11:07 PM | 64.4 | 120.538 | 33.125 | 68.9 |
| 2016-03-013:11:11 PM | 64.287 | 120.538 | 33.238 | 68.9 |
| 2016-03-013:11:15 PM | 64.287 | 120.538 | 33.238 | 68.9 |
| 2016-03-013:11:19 PM | 64.287 | 120.538 | 33.35 | 68.9 |
| 2016-03-013:11:23 PM | 64.287 | 120.538 | 33.35 | 68.9 |
| 2016-03-013:11:27 PM | 64.287 | 120.425 | 33.35 | 68.9 |
| 2016-03-013:11:31 PM | 64.287 | 120.425 | 33.462 | 68.9 |
| 2016-03-013:11:35 PM | 64.287 | 120.425 | 33.462 | 68.9 |
| 2016-03-013:11:39 PM | 64.287 | 120.538 | 33.462 | 69.012 |
| 2016-03-013:11:43 PM | 64.287 | 120.425 | 33.462 | 68.9 |
| 2016-03-013:11:47 PM | 64.287 | 120.425 | 33.575 | 68.9 |
| 2016-03-013:11:51 PM | 64.287 | 120.425 | 33.688 | 68.9 |
| 2016-03-013:11:56 PM | 64.4 | 120.425 | 33.688 | 68.9 |
| 2016-03-013:12:00 PM | 64.287 | 120.425 | 33.688 | 68.9 |
| 2016-03-013:12:04 PM | 64.4 | 120.425 | 33.688 | 68.9 |
| 2016-03-013:12:08 PM | 64.4 | 120.538 | 33.688 | 68.9 |
| 2016-03-013:12:12 PM | 64.4 | 120.425 | 33.688 | 68.9 |
| 2016-03-013:12:16 PM | 64.4 | 120.425 | 33.575 | 68.9 |
| 2016-03-013:12:20 PM | 64.4 | 120.425 | 33.575 | 68.788 |
| 2016-03-013:12:24 PM | 64.4 | 120.425 | 33.462 | 68.9 |
| 2016-03-013:12:28 PM | 64.4 | 120.425 | 33.238 | 68.9 |
| 2016-03-013:12:32 PM | 64.4 | 120.425 | 33.012 | 68.788 |
| 2016-03-013:12:36 PM | 64.4 | 120.425 | 32.788 | 68.9 |
| 2016-03-013:12:40 PM | 64.4 | 120.425 | 32.562 | 68.788 |
| 2016-03-013:12:44 PM | 64.287 | 120.425 | 32.45 | 68.788 |
| 2016-03-013:12:48 PM | 64.287 | 120.425 | 32.338 | 68.788 |
| 2016-03-013:12:52 PM | 64.287 | 120.312 | 32.338 | 68.788 |
| 2016-03-013:12:56 PM | 64.4 | 120.425 | 32.225 | 68.788 |
| 2016-03-013:13:00 PM | 64.4 | 120.312 | 32.112 | 68.788 |
| 2016-03-013:13:05 PM | 64.4 | 120.312 | 32 | 68.788 |
| 2016-03-013:13:09 PM | 64.4 | 120.312 | 31.775 | 68.788 |
| 2016-03-013:13:13 PM | 64.4 | 120.312 | 31.662 | 68.788 |
| 2016-03-013:13:17 PM | 64.287 | 120.312 | 31.55 | 68.788 |
| 2016-03-013:13:21 PM | 64.287 | 120.312 | 31.662 | 68.788 |
| 2016-03-013:13:25 PM | 64.287 | 120.2 | 31.662 | 68.788 |
| 2016-03-013:13:29 PM | 64.287 | 120.2 | 31.662 | 68.788 |
| 2016-03-013:13:33 PM | 64.287 | 120.2 | 31.662 | 68.788 |
| 2016-03-013:13:37 PM | 64.287 | 120.2 | 31.662 | 68.788 |
| 2016-03-013:13:41 PM | 64.287 | 120.2 | 31.888 | 68.788 |
| 2016-03-013:13:45 PM | 64.287 | 120.2 | 31.888 | 68.675 |
| 2016-03-013:13:49 PM | 64.287 | 120.2 | 31.775 | 68.788 |
| 2016-03-013:13:53 PM | 64.175 | 120.088 | 31.662 | 68.788 |
| 2016-03-013:13:58 PM | 64.287 | 120.088 | 31.55 | 68.788 |
| 2016-03-013:14:02 PM | 64.175 | 120.088 | 31.438 | 68.788 |
| 2016-03-013:14:06 PM | 64.175 | 119.975 | 31.438 | 68.675 |
| 2016-03-013:14:10 PM | 64.175 | 119.975 | 31.438 | 68.788 |
| 2016-03-013:14:14 PM | 64.287 | 119.975 | 31.55 | 68.788 |
| 2016-03-013:14:18 PM | 64.175 | 119.975 | 31.662 | 68.788 |
| 2016-03-013:14:22 PM | 64.175 | 119.975 | 31.775 | 68.788 |
| 2016-03-013:14:26 PM | 64.175 | 119.862 | 31.888 | 68.675 |
| 2016-03-013:14:30 PM | 64.062 | 119.862 | 31.888 | 68.788 |
| 2016-03-013:14:34 PM | 64.175 | 119.862 | 31.888 | 68.675 |
| 2016-03-013:14:38 PM | 64.175 | 119.862 | 32 | 68.675 |
| 2016-03-013:14:42 PM | 64.287 | 119.75 | 31.888 | 68.675 |
| 2016-03-013:14:46 PM | 64.175 | 119.75 | 32 | 68.675 |
| 2016-03-013:14:50 PM | 64.175 | 119.75 | 31.888 | 68.675 |
| 2016-03-013:14:54 PM | 64.287 | 119.638 | 31.888 | 68.788 |
| 2016-03-013:14:58 PM | 64.175 | 119.638 | 31.888 | 68.675 |
| 2016-03-013:15:03 PM | 64.287 | 119.638 | 32 | 68.675 |
| 2016-03-013:15:07 PM | 64.287 | 119.525 | 32 | 68.675 |
| 2016-03-013:15:11 PM | 64.287 | 119.413 | 31.888 | 68.788 |
| 2016-03-013:15:15 PM | 64.287 | 119.3 | 31.662 | 68.675 |
| 2016-03-013:15:19 PM | 64.287 | 119.3 | 31.438 | 68.675 |
| 2016-03-013:15:23 PM | 64.287 | 119.3 | 31.325 | 68.675 |
| 2016-03-013:15:27 PM | 64.287 | 119.3 | 31.325 | 68.675 |
| 2016-03-013:15:31 PM | 64.287 | 119.188 | 31.1 | 68.675 |
| 2016-03-013:15:35 PM | 64.287 | 119.188 | 30.988 | 68.675 |
| 2016-03-013:15:39 PM | 64.287 | 119.188 | 30.875 | 68.675 |
| 2016-03-013:15:43 PM | 64.287 | 119.075 | 30.875 | 68.675 |
| 2016-03-013:15:47 PM | 64.4 | 119.075 | 30.762 | 68.675 |
| 2016-03-013:15:51 PM | 64.287 | 119.075 | 30.762 | 68.675 |
| 2016-03-013:15:55 PM | 64.287 | 118.962 | 30.875 | 68.675 |
| 2016-03-013:16:00 PM | 64.4 | 118.962 | 30.988 | 68.675 |
| 2016-03-013:16:04 PM | 64.4 | 118.85 | 30.988 | 68.788 |
| 2016-03-013:16:08 PM | 64.4 | 118.85 | 30.988 | 68.788 |
| 2016-03-013:16:12 PM | 64.4 | 118.85 | 30.988 | 68.788 |
| 2016-03-013:16:16 PM | 64.4 | 118.85 | 31.1 | 68.788 |
| 2016-03-013:16:20 PM | 64.4 | 118.738 | 31.1 | 68.788 |
| 2016-03-013:16:24 PM | 64.4 | 118.738 | 31.1 | 68.788 |
| 2016-03-013:16:28 PM | 64.512 | 118.625 | 31.1 | 68.788 |
| 2016-03-013:16:32 PM | 64.512 | 118.512 | 31.212 | 68.788 |
| 2016-03-013:16:36 PM | 64.512 | 118.512 | 31.325 | 68.788 |
| 2016-03-013:16:40 PM | 64.512 | 118.4 | 31.438 | 68.788 |
| 2016-03-013:16:44 PM | 64.512 | 118.4 | 31.55 | 68.675 |
| 2016-03-013:16:48 PM | 64.512 | 118.288 | 31.662 | 68.788 |
| 2016-03-013:16:52 PM | 64.4 | 118.175 | 31.662 | 68.788 |
| 2016-03-013:16:56 PM | 64.4 | 118.062 | 31.55 | 68.788 |
| 2016-03-013:17:01 PM | 64.4 | 117.95 | 31.212 | 68.788 |
| 2016-03-013:17:05 PM | 64.4 | 117.95 | 31.212 | 68.788 |
| 2016-03-013:17:09 PM | 64.4 | 117.95 | 31.212 | 68.675 |
| 2016-03-013:17:13 PM | 64.512 | 117.95 | 31.1 | 68.788 |
| 2016-03-013:17:17 PM | 64.4 | 117.838 | 30.988 | 68.788 |
| 2016-03-013:17:21 PM | 64.512 | 117.838 | 31.1 | 68.788 |
| 2016-03-013:17:25 PM | 64.512 | 117.838 | 30.988 | 68.675 |
| 2016-03-013:17:29 PM | 64.512 | 117.838 | 30.988 | 68.675 |
| 2016-03-013:17:33 PM | 64.512 | 117.838 | 31.1 | 68.675 |
| 2016-03-013:17:37 PM | 64.512 | 117.838 | 31.212 | 68.788 |
| 2016-03-013:17:41 PM | 64.512 | 117.838 | 31.212 | 68.788 |
| 2016-03-013:17:45 PM | 64.512 | 117.838 | 31.325 | 68.675 |
| 2016-03-013:17:49 PM | 64.512 | 117.725 | 31.438 | 68.788 |
| 2016-03-013:17:54 PM | 64.512 | 117.725 | 31.55 | 68.675 |
| 2016-03-013:17:58 PM | 64.625 | 117.612 | 31.438 | 68.675 |
| 2016-03-013:18:02 PM | 64.625 | 117.5 | 31.325 | 68.788 |
| 2016-03-013:18:06 PM | 64.625 | 117.5 | 31.212 | 68.675 |
| 2016-03-013:18:10 PM | 64.738 | 117.388 | 31.212 | 68.788 |
| 2016-03-013:18:14 PM | 64.738 | 117.388 | 31.212 | 68.675 |
| 2016-03-013:18:18 PM | 64.738 | 117.388 | 31.325 | 68.788 |
| 2016-03-013:18:22 PM | 64.738 | 117.388 | 31.325 | 68.788 |
| 2016-03-013:18:26 PM | 64.738 | 117.388 | 31.438 | 68.788 |
| 2016-03-013:18:30 PM | 64.738 | 117.275 | 31.55 | 68.788 |
| 2016-03-013:18:34 PM | 64.625 | 117.275 | 31.55 | 68.788 |
| 2016-03-013:18:38 PM | 64.625 | 117.275 | 31.438 | 68.788 |
| 2016-03-013:18:42 PM | 64.625 | 117.275 | 31.55 | 68.788 |
| 2016-03-013:18:46 PM | 64.625 | 117.163 | 31.662 | 68.788 |
| 2016-03-013:18:51 PM | 64.625 | 117.163 | 31.775 | 68.788 |
| 2016-03-013:18:55 PM | 64.625 | 117.05 | 31.888 | 68.788 |
| 2016-03-013:19:03 PM | 64.625 | 117.05 | 32.112 | 68.788 |
| 2016-03-013:19:07 PM | 64.625 | 116.938 | 32.112 | 68.788 |
| 2016-03-013:19:11 PM | 64.625 | 116.825 | 32.112 | 68.9 |
| 2016-03-013:19:15 PM | 64.625 | 116.825 | 32.112 | 68.788 |
| 2016-03-013:19:19 PM | 64.625 | 116.825 | 32.225 | 68.788 |
| 2016-03-013:19:23 PM | 64.625 | 116.825 | 32.225 | 68.788 |
| 2016-03-013:19:27 PM | 64.625 | 116.825 | 32.225 | 68.788 |
| 2016-03-013:19:35 PM | 64.625 | 116.712 | 32.338 | 68.788 |
| 2016-03-013:19:39 PM | 64.738 | 116.6 | 32.562 | 68.788 |
| 2016-03-013:19:43 PM | 64.625 | 116.6 | 32.675 | 68.788 |
| 2016-03-013:19:47 PM | 64.625 | 116.488 | 32.562 | 68.788 |
| 2016-03-013:19:51 PM | 64.625 | 116.488 | 32.675 | 68.788 |
| 2016-03-013:19:55 PM | 64.625 | 116.488 | 32.675 | 68.788 |
| 2016-03-013:19:59 PM | 64.625 | 116.488 | 32.562 | 68.788 |
| 2016-03-013:20:03 PM | 64.625 | 116.488 | 32.562 | 68.788 |
| 2016-03-013:20:07 PM | 64.625 | 116.375 | 32.45 | 68.788 |
| 2016-03-013:20:12 PM | 64.625 | 116.375 | 32.562 | 68.788 |
| 2016-03-013:20:16 PM | 64.625 | 116.375 | 32.675 | 68.788 |
| 2016-03-013:20:20 PM | 64.625 | 116.375 | 32.675 | 68.788 |
| 2016-03-013:20:24 PM | 64.625 | 116.262 | 32.788 | 68.788 |
| 2016-03-013:20:28 PM | 64.625 | 116.262 | 32.788 | 68.788 |
| 2016-03-013:20:32 PM | 64.625 | 116.262 | 32.788 | 68.675 |
| 2016-03-013:20:36 PM | 64.625 | 116.262 | 32.9 | 68.788 |
| 2016-03-013:20:40 PM | 64.625 | 116.262 | 33.012 | 68.788 |
| 2016-03-013:20:44 PM | 64.625 | 116.262 | 33.012 | 68.788 |
| 2016-03-013:20:48 PM | 64.625 | 116.15 | 33.125 | 68.788 |
| 2016-03-013:20:52 PM | 64.512 | 116.262 | 33.238 | 68.675 |
| 2016-03-013:20:56 PM | 64.512 | 116.262 | 33.238 | 68.788 |
| 2016-03-013:21:00 PM | 64.512 | 116.15 | 33.238 | 68.788 |
| 2016-03-013:21:04 PM | 64.512 | 116.15 | 33.238 | 68.788 |
| 2016-03-013:21:09 PM | 64.512 | 116.15 | 33.35 | 68.788 |
| 2016-03-013:21:13 PM | 64.512 | 116.15 | 33.35 | 68.788 |
| 2016-03-013:21:17 PM | 64.512 | 116.15 | 33.575 | 68.788 |
| 2016-03-013:21:21 PM | 64.512 | 116.15 | 33.575 | 68.788 |
| 2016-03-013:21:25 PM | 64.512 | 116.15 | 33.688 | 68.788 |
| 2016-03-013:21:29 PM | 64.512 | 116.15 | 33.8 | 68.788 |
| 2016-03-013:21:33 PM | 64.512 | 116.15 | 33.912 | 68.788 |
| 2016-03-013:21:37 PM | 64.512 | 116.15 | 33.912 | 68.788 |
| 2016-03-013:21:41 PM | 64.512 | 116.038 | 33.912 | 68.788 |
| 2016-03-013:21:45 PM | 64.512 | 116.038 | 33.912 | 68.788 |
| 2016-03-013:21:49 PM | 64.512 | 116.038 | 33.688 | 68.788 |
| 2016-03-013:21:53 PM | 64.625 | 116.038 | 33.462 | 68.788 |
| 2016-03-013:21:57 PM | 64.625 | 116.038 | 33.35 | 68.788 |
| 2016-03-013:22:01 PM | 64.625 | 116.038 | 33.35 | 68.788 |
| 2016-03-013:22:05 PM | 64.738 | 116.038 | 33.35 | 68.788 |
| 2016-03-013:22:09 PM | 64.738 | 116.038 | 33.35 | 68.675 |
| 2016-03-013:22:13 PM | 64.85 | 116.038 | 33.238 | 68.675 |
| 2016-03-013:22:17 PM | 64.85 | 116.038 | 33.012 | 68.675 |
| 2016-03-013:22:21 PM | 64.963 | 116.038 | 32.788 | 68.675 |
| 2016-03-013:22:26 PM | 65.075 | 116.038 | 32.675 | 68.675 |
| 2016-03-013:22:30 PM | 65.075 | 116.038 | 32.562 | 68.788 |
| 2016-03-013:22:34 PM | 65.075 | 116.038 | 32.675 | 68.788 |
| 2016-03-013:22:38 PM | 65.075 | 116.038 | 32.788 | 68.788 |
| 2016-03-013:22:42 PM | 65.075 | 116.038 | 32.788 | 68.675 |
| 2016-03-013:22:50 PM | 65.075 | 116.038 | 32.675 | 68.675 |
| 2016-03-013:22:54 PM | 65.188 | 116.038 | 32.675 | 68.788 |
| 2016-03-013:22:58 PM | 65.188 | 116.038 | 32.675 | 68.675 |
| 2016-03-013:23:02 PM | 65.188 | 116.038 | 32.675 | 68.675 |
| 2016-03-013:23:06 PM | 65.075 | 116.038 | 32.562 | 68.675 |
| 2016-03-013:23:10 PM | 65.075 | 115.925 | 32.562 | 68.675 |
| 2016-03-013:23:14 PM | 65.188 | 115.925 | 32.675 | 68.675 |
| 2016-03-013:23:18 PM | 65.075 | 115.925 | 32.562 | 68.788 |
| 2016-03-013:23:22 PM | 65.075 | 115.925 | 32.675 | 68.675 |
| 2016-03-013:23:26 PM | 65.075 | 115.925 | 32.675 | 68.675 |
| 2016-03-013:23:30 PM | 65.075 | 115.925 | 32.675 | 68.675 |
| 2016-03-013:23:35 PM | 65.075 | 115.925 | 32.675 | 68.675 |
| 2016-03-013:23:39 PM | 65.075 | 115.925 | 32.562 | 68.675 |
| 2016-03-013:23:43 PM | 65.075 | 115.812 | 32.562 | 68.675 |
| 2016-03-013:23:47 PM | 65.075 | 115.812 | 32.562 | 68.675 |
| 2016-03-013:23:51 PM | 64.963 | 115.812 | 32.562 | 68.675 |
| 2016-03-013:23:55 PM | 64.963 | 115.812 | 32.675 | 68.675 |
| 2016-03-013:23:59 PM | 64.963 | 115.812 | 32.675 | 68.675 |
| 2016-03-013:24:03 PM | 64.963 | 115.812 | 32.675 | 68.675 |
| 2016-03-013:24:07 PM | 64.963 | 115.812 | 32.675 | 68.562 |
| 2016-03-013:24:11 PM | 64.85 | 115.812 | 32.562 | 68.675 |
| 2016-03-013:24:19 PM | 64.85 | 115.925 | 32.675 | 68.675 |
| 2016-03-013:24:23 PM | 64.85 | 115.812 | 32.788 | 68.675 |
| 2016-03-013:24:27 PM | 64.738 | 115.812 | 33.012 | 68.675 |
| 2016-03-013:24:31 PM | 64.738 | 115.812 | 33.125 | 68.675 |
| 2016-03-013:24:35 PM | 64.738 | 115.812 | 33.125 | 68.562 |
| 2016-03-013:24:39 PM | 64.738 | 115.812 | 33.238 | 68.562 |
| 2016-03-013:24:43 PM | 64.738 | 115.7 | 33.125 | 68.562 |
| 2016-03-013:24:47 PM | 64.625 | 115.7 | 33.238 | 68.562 |
| 2016-03-013:24:55 PM | 64.625 | 115.7 | 33.35 | 68.562 |
| 2016-03-013:24:59 PM | 64.625 | 115.7 | 33.35 | 68.45 |
| 2016-03-013:25:03 PM | 64.625 | 115.7 | 33.35 | 68.45 |
| 2016-03-013:25:07 PM | 64.512 | 115.7 | 33.462 | 68.45 |
| 2016-03-013:25:11 PM | 64.512 | 115.7 | 33.462 | 68.45 |
| 2016-03-013:25:15 PM | 64.512 | 115.7 | 33.462 | 68.338 |
| 2016-03-013:25:19 PM | 64.512 | 115.7 | 33.462 | 68.45 |
| 2016-03-013:25:23 PM | 64.512 | 115.7 | 33.35 | 68.45 |
| 2016-03-013:25:31 PM | 64.4 | 115.7 | 33.35 | 68.45 |
| 2016-03-013:25:35 PM | 64.4 | 115.588 | 33.125 | 68.45 |
| 2016-03-013:25:39 PM | 64.4 | 115.588 | 33.012 | 68.45 |
| 2016-03-013:25:43 PM | 64.512 | 115.588 | 32.9 | 68.338 |
| 2016-03-013:25:47 PM | 64.512 | 115.588 | 32.788 | 68.45 |
| 2016-03-013:25:51 PM | 64.512 | 115.588 | 32.675 | 68.338 |
| 2016-03-013:25:55 PM | 64.4 | 115.588 | 32.45 | 68.45 |
| 2016-03-013:25:59 PM | 64.4 | 115.588 | 32.562 | 68.338 |
| 2016-03-013:26:03 PM | 64.4 | 115.475 | 32.45 | 68.338 |
| 2016-03-013:26:15 PM | 64.4 | 115.475 | 32.675 | 68.338 |
| 2016-03-013:26:19 PM | 64.4 | 115.475 | 32.675 | 68.338 |
| 2016-03-013:26:24 PM | 64.4 | 115.475 | 32.562 | 68.338 |
| 2016-03-013:26:27 PM | 64.4 | 115.362 | 32.45 | 68.338 |
| 2016-03-013:26:31 PM | 64.4 | 115.362 | 32.45 | 68.45 |
| 2016-03-013:26:35 PM | 64.287 | 115.362 | 32.45 | 68.338 |
| 2016-03-013:26:39 PM | 64.287 | 115.25 | 32.45 | 68.338 |
| 2016-03-013:26:43 PM | 64.287 | 115.25 | 32.45 | 68.338 |
| 2016-03-013:26:51 PM | 64.4 | 115.25 | 32.562 | 68.338 |
| 2016-03-013:26:55 PM | 64.287 | 115.138 | 32.562 | 68.338 |
| 2016-03-013:26:59 PM | 64.4 | 115.138 | 32.562 | 68.45 |
| 2016-03-013:27:03 PM | 64.287 | 115.138 | 32.675 | 68.338 |
| 2016-03-013:27:07 PM | 64.287 | 115.138 | 32.675 | 68.45 |
| 2016-03-013:27:11 PM | 64.287 | 115.025 | 32.788 | 68.338 |
| 2016-03-013:27:15 PM | 64.175 | 115.025 | 32.788 | 68.338 |
| 2016-03-013:27:23 PM | 64.175 | 114.913 | 32.675 | 68.45 |
| 2016-03-013:27:27 PM | 64.175 | 114.913 | 32.675 | 68.45 |
| 2016-03-013:27:31 PM | 64.062 | 114.913 | 32.562 | 68.45 |
| 2016-03-013:27:35 PM | 64.062 | 114.913 | 32.338 | 68.45 |
| 2016-03-013:27:43 PM | 64.062 | 114.913 | 31.888 | 68.45 |
| 2016-03-013:27:47 PM | 64.062 | 114.8 | 31.775 | 68.45 |
| 2016-03-013:27:51 PM | 64.062 | 114.8 | 31.662 | 68.45 |
| 2016-03-013:27:55 PM | 63.95 | 114.688 | 31.55 | 68.45 |
| 2016-03-013:27:59 PM | 64.062 | 114.688 | 31.55 | 68.45 |
| 2016-03-013:28:03 PM | 63.95 | 114.688 | 31.55 | 68.45 |
| 2016-03-013:28:07 PM | 63.95 | 114.688 | 31.55 | 68.45 |
| 2016-03-013:28:11 PM | 63.95 | 114.575 | 31.55 | 68.45 |
| 2016-03-013:28:15 PM | 63.838 | 114.575 | 31.55 | 68.45 |
| 2016-03-013:28:19 PM | 63.95 | 114.575 | 31.662 | 68.45 |
| 2016-03-013:28:24 PM | 63.95 | 114.575 | 31.775 | 68.45 |
| 2016-03-013:28:28 PM | 63.838 | 114.575 | 31.888 | 68.45 |
| 2016-03-013:28:36 PM | 63.838 | 114.462 | 32 | 68.45 |
| 2016-03-013:28:40 PM | 63.838 | 114.462 | 32.112 | 68.45 |
| 2016-03-013:28:44 PM | 63.838 | 114.462 | 32.112 | 68.45 |
| 2016-03-013:28:49 PM | 63.838 | 114.462 | 32.112 | 68.562 |
| 2016-03-013:28:52 PM | 63.838 | 114.462 | 32.112 | 68.562 |
| 2016-03-013:28:56 PM | 63.838 | 114.35 | 32.112 | 68.45 |
| 2016-03-013:29:00 PM | 63.838 | 114.35 | 32 | 68.45 |
| 2016-03-013:29:04 PM | 63.838 | 114.35 | 31.888 | 68.45 |
| 2016-03-013:29:08 PM | 63.838 | 114.35 | 32 | 68.45 |
| 2016-03-013:29:12 PM | 63.838 | 114.35 | 31.888 | 68.562 |
| 2016-03-013:29:16 PM | 63.838 | 114.238 | 31.888 | 68.562 |
| 2016-03-013:29:20 PM | 63.838 | 114.238 | 31.888 | 68.562 |
| 2016-03-013:29:24 PM | 63.838 | 114.125 | 31.888 | 68.562 |
| 2016-03-013:29:28 PM | 63.838 | 114.125 | 31.888 | 68.562 |
| 2016-03-013:29:32 PM | 63.838 | 114.125 | 32 | 68.562 |
| 2016-03-013:29:36 PM | 63.838 | 114.125 | 32 | 68.562 |
| 2016-03-013:29:40 PM | 63.95 | 114.012 | 32 | 68.562 |
| 2016-03-013:29:45 PM | 63.838 | 113.9 | 31.888 | 68.562 |
| 2016-03-013:29:49 PM | 63.838 | 113.9 | 31.888 | 68.562 |
| 2016-03-013:29:53 PM | 63.838 | 113.9 | 31.888 | 68.562 |
| 2016-03-013:29:57 PM | 63.725 | 113.788 | 32 | 68.562 |
| 2016-03-013:30:01 PM | 63.838 | 113.675 | 32 | 68.562 |
| 2016-03-013:30:05 PM | 63.725 | 113.675 | 32.112 | 68.562 |
| 2016-03-013:30:09 PM | 63.838 | 113.675 | 32.112 | 68.562 |
| 2016-03-013:30:13 PM | 63.838 | 113.562 | 32.112 | 68.45 |
| 2016-03-013:30:17 PM | 63.838 | 113.562 | 31.888 | 68.45 |
| 2016-03-013:30:21 PM | 63.838 | 113.562 | 31.888 | 68.45 |
| 2016-03-013:30:25 PM | 63.838 | 113.562 | 31.888 | 68.45 |
| 2016-03-013:30:29 PM | 63.838 | 113.45 | 31.888 | 68.45 |
| 2016-03-013:30:33 PM | 63.838 | 113.45 | 31.662 | 68.45 |
| 2016-03-013:30:37 PM | 63.838 | 113.45 | 31.55 | 68.45 |
| 2016-03-013:30:41 PM | 63.838 | 113.45 | 31.55 | 68.45 |
| 2016-03-013:30:45 PM | 63.838 | 113.338 | 31.55 | 68.45 |
| 2016-03-013:30:49 PM | 63.838 | 113.338 | 31.55 | 68.45 |
| 2016-03-013:30:53 PM | 63.725 | 113.225 | 31.55 | 68.45 |
| 2016-03-013:30:57 PM | 63.838 | 113.225 | 31.662 | 68.45 |
| 2016-03-013:31:02 PM | 63.838 | 113.225 | 31.775 | 68.338 |
| 2016-03-013:31:06 PM | 63.838 | 113.225 | 31.888 | 68.338 |
| 2016-03-013:31:10 PM | 63.838 | 113.225 | 31.888 | 68.338 |
| 2016-03-013:31:14 PM | 63.838 | 113.112 | 32 | 68.338 |
| 2016-03-013:31:18 PM | 63.838 | 113.112 | 32.112 | 68.338 |
| 2016-03-013:31:22 PM | 63.838 | 113 | 32.225 | 68.338 |
| 2016-03-013:31:26 PM | 63.838 | 113 | 32.225 | 68.338 |
| 2016-03-013:31:34 PM | 63.95 | 113 | 32.45 | 68.338 |
| 2016-03-013:31:38 PM | 63.838 | 112.888 | 32.45 | 68.338 |
| 2016-03-013:31:42 PM | 63.838 | 112.888 | 32.675 | 68.225 |
| 2016-03-013:31:46 PM | 63.838 | 112.888 | 32.562 | 68.338 |
| 2016-03-013:31:50 PM | 63.838 | 112.775 | 32.45 | 68.338 |
| 2016-03-013:31:54 PM | 63.838 | 112.775 | 32.338 | 68.225 |
| 2016-03-013:32:02 PM | 63.95 | 112.663 | 32.225 | 68.225 |
| 2016-03-013:32:06 PM | 63.838 | 112.663 | 32.112 | 68.225 |
| 2016-03-013:32:10 PM | 63.838 | 112.663 | 32 | 68.225 |
| 2016-03-013:32:14 PM | 63.838 | 112.55 | 32 | 68.225 |
| 2016-03-013:32:19 PM | 63.95 | 112.55 | 32 | 68.225 |
| 2016-03-013:32:22 PM | 63.838 | 112.55 | 31.888 | 68.225 |
| 2016-03-013:32:26 PM | 63.838 | 112.55 | 31.662 | 68.225 |
| 2016-03-013:32:30 PM | 63.95 | 112.438 | 31.55 | 68.225 |
| 2016-03-013:32:34 PM | 63.838 | 112.438 | 31.55 | 68.225 |
| 2016-03-013:32:38 PM | 63.838 | 112.438 | 31.55 | 68.225 |
| 2016-03-013:32:42 PM | 63.838 | 112.438 | 31.55 | 68.225 |
| 2016-03-013:32:46 PM | 63.838 | 112.325 | 31.662 | 68.225 |
| 2016-03-013:32:50 PM | 63.838 | 112.325 | 31.662 | 68.225 |
| 2016-03-013:32:54 PM | 63.838 | 112.325 | 31.775 | 68.225 |
| 2016-03-013:32:59 PM | 63.725 | 112.325 | 31.775 | 68.225 |
| 2016-03-013:33:03 PM | 63.838 | 112.212 | 31.775 | 68.225 |
| 2016-03-013:33:07 PM | 63.838 | 112.212 | 31.888 | 68.225 |
| 2016-03-013:33:11 PM | 63.838 | 112.1 | 31.888 | 68.225 |
| 2016-03-013:33:15 PM | 63.838 | 112.1 | 32 | 68.225 |
| 2016-03-013:33:19 PM | 63.838 | 112.1 | 32.112 | 68.225 |
| 2016-03-013:33:23 PM | 63.838 | 111.988 | 32.225 | 68.225 |
| 2016-03-013:33:27 PM | 63.838 | 111.988 | 32.45 | 68.225 |
| 2016-03-013:33:31 PM | 63.838 | 111.988 | 32.45 | 68.225 |
| 2016-03-013:33:35 PM | 63.95 | 111.988 | 32.225 | 68.225 |
| 2016-03-013:33:39 PM | 63.95 | 111.762 | 32.112 | 68.225 |
| 2016-03-013:33:43 PM | 63.95 | 111.762 | 32.225 | 68.225 |
| 2016-03-013:33:47 PM | 63.95 | 111.65 | 32.112 | 68.225 |
| 2016-03-013:33:51 PM | 63.95 | 111.65 | 32.112 | 68.225 |
| 2016-03-013:33:55 PM | 63.95 | 111.65 | 32.112 | 68.225 |
| 2016-03-013:33:59 PM | 63.95 | 111.65 | 32.112 | 68.225 |
| 2016-03-013:34:04 PM | 63.838 | 111.538 | 32.112 | 68.225 |
| 2016-03-013:34:07 PM | 63.95 | 111.538 | 32.225 | 68.225 |
| 2016-03-013:34:15 PM | 63.95 | 111.538 | 32 | 68.225 |
| 2016-03-013:34:19 PM | 63.95 | 111.538 | 31.888 | 68.225 |
| 2016-03-013:34:23 PM | 63.95 | 111.425 | 31.775 | 68.225 |
| 2016-03-013:34:27 PM | 63.95 | 111.425 | 31.775 | 68.225 |
| 2016-03-013:34:31 PM | 63.95 | 111.425 | 31.662 | 68.225 |
| 2016-03-013:34:35 PM | 63.95 | 111.425 | 31.662 | 68.225 |
| 2016-03-013:34:39 PM | 63.95 | 111.312 | 31.775 | 68.225 |
| 2016-03-013:34:43 PM | 63.95 | 111.312 | 31.662 | 68.225 |
| 2016-03-013:34:48 PM | 63.95 | 111.312 | 31.662 | 68.225 |
| 2016-03-013:34:52 PM | 63.838 | 111.312 | 31.662 | 68.225 |
| 2016-03-013:35:00 PM | 63.838 | 111.2 | 31.55 | 68.225 |
| 2016-03-013:35:04 PM | 63.838 | 111.2 | 31.438 | 68.225 |
| 2016-03-013:35:08 PM | 63.838 | 111.2 | 31.438 | 68.225 |
| 2016-03-013:35:12 PM | 63.838 | 111.088 | 31.438 | 68.225 |
| 2016-03-013:35:16 PM | 63.725 | 111.088 | 31.438 | 68.225 |
| 2016-03-013:35:20 PM | 63.725 | 111.088 | 31.438 | 68.225 |
| 2016-03-013:35:24 PM | 63.725 | 110.975 | 31.55 | 68.225 |
| 2016-03-013:35:28 PM | 63.725 | 110.975 | 31.438 | 68.225 |
| 2016-03-013:35:32 PM | 63.613 | 110.975 | 31.55 | 68.225 |
| 2016-03-013:35:36 PM | 63.613 | 110.975 | 31.55 | 68.225 |
| 2016-03-013:35:40 PM | 63.613 | 110.862 | 31.55 | 68.225 |
| 2016-03-013:35:44 PM | 63.613 | 110.862 | 31.662 | 68.225 |
| 2016-03-013:35:49 PM | 63.613 | 110.862 | 31.888 | 68.338 |
| 2016-03-013:35:53 PM | 63.613 | 110.862 | 31.888 | 68.225 |
| 2016-03-013:35:57 PM | 63.613 | 110.75 | 32 | 68.225 |
| 2016-03-013:36:01 PM | 63.613 | 110.75 | 31.775 | 68.225 |
| 2016-03-013:36:05 PM | 63.613 | 110.75 | 31.662 | 68.225 |
| 2016-03-013:36:09 PM | 63.613 | 110.75 | 31.662 | 68.225 |
| 2016-03-013:36:13 PM | 63.613 | 110.638 | 31.775 | 68.225 |
| 2016-03-013:36:17 PM | 63.613 | 110.638 | 31.775 | 68.225 |
| 2016-03-013:36:21 PM | 63.613 | 110.638 | 31.662 | 68.225 |
| 2016-03-013:36:25 PM | 63.613 | 110.638 | 31.775 | 68.225 |
| 2016-03-013:36:29 PM | 63.613 | 110.525 | 31.662 | 68.225 |
| 2016-03-013:36:33 PM | 63.5 | 110.525 | 31.662 | 68.225 |
| 2016-03-013:36:37 PM | 63.5 | 110.525 | 31.662 | 68.225 |
| 2016-03-013:36:41 PM | 63.5 | 110.413 | 31.662 | 68.225 |
| 2016-03-013:36:45 PM | 63.5 | 110.413 | 31.662 | 68.225 |
| 2016-03-013:36:53 PM | 63.5 | 110.3 | 31.775 | 68.338 |
| 2016-03-013:36:57 PM | 63.5 | 110.3 | 31.888 | 68.338 |
| 2016-03-013:37:01 PM | 63.5 | 110.3 | 31.888 | 68.338 |
| 2016-03-013:37:05 PM | 63.5 | 110.3 | 32 | 68.338 |
| 2016-03-013:37:09 PM | 63.5 | 110.3 | 31.888 | 68.225 |
| 2016-03-013:37:13 PM | 63.613 | 110.3 | 31.888 | 68.225 |
| 2016-03-013:37:17 PM | 63.5 | 110.188 | 32 | 68.225 |
| 2016-03-013:37:21 PM | 63.613 | 110.188 | 31.888 | 68.225 |
| 2016-03-013:37:25 PM | 63.5 | 110.075 | 31.888 | 68.225 |
| 2016-03-013:37:29 PM | 63.5 | 110.075 | 32 | 68.225 |
| 2016-03-013:37:33 PM | 63.613 | 109.962 | 31.888 | 68.225 |
| 2016-03-013:37:37 PM | 63.5 | 109.85 | 32 | 68.225 |
| 2016-03-013:37:41 PM | 63.5 | 109.85 | 32.112 | 68.225 |
| 2016-03-013:37:45 PM | 63.5 | 109.85 | 32.112 | 68.225 |
| 2016-03-013:37:50 PM | 63.5 | 109.738 | 31.888 | 68.112 |
| 2016-03-013:37:54 PM | 63.5 | 109.738 | 31.775 | 68.112 |
| 2016-03-013:37:58 PM | 63.5 | 109.625 | 31.775 | 68.112 |
| 2016-03-013:38:05 PM | 63.5 | 109.625 | 31.775 | 68.112 |
| 2016-03-013:38:09 PM | 63.5 | 109.512 | 31.662 | 68.225 |
| 2016-03-013:38:13 PM | 63.5 | 109.512 | 31.662 | 68.225 |
| 2016-03-013:38:17 PM | 63.5 | 109.512 | 31.55 | 68.225 |
| 2016-03-013:38:25 PM | 63.5 | 109.512 | 31.325 | 68.225 |
| 2016-03-013:38:29 PM | 63.5 | 109.4 | 31.55 | 68.225 |
| 2016-03-013:38:33 PM | 63.5 | 109.4 | 31.55 | 68.225 |
| 2016-03-013:38:37 PM | 63.388 | 109.4 | 31.55 | 68.225 |
| 2016-03-013:38:41 PM | 63.388 | 109.288 | 31.438 | 68.225 |
| 2016-03-013:38:45 PM | 63.388 | 109.288 | 31.438 | 68.225 |
| 2016-03-013:38:49 PM | 63.388 | 109.288 | 31.438 | 68.225 |
| 2016-03-013:38:54 PM | 63.388 | 109.175 | 31.325 | 68.225 |
| 2016-03-013:38:58 PM | 63.388 | 109.175 | 31.325 | 68.225 |
| 2016-03-013:39:02 PM | 63.388 | 109.062 | 31.55 | 68.225 |
| 2016-03-013:39:06 PM | 63.388 | 109.062 | 31.55 | 68.225 |
| 2016-03-013:39:10 PM | 63.388 | 109.062 | 31.662 | 68.225 |
| 2016-03-013:39:14 PM | 63.275 | 109.062 | 31.662 | 68.225 |
| 2016-03-013:39:18 PM | 63.275 | 108.95 | 31.55 | 68.225 |
| 2016-03-013:39:22 PM | 63.275 | 108.95 | 31.55 | 68.225 |
| 2016-03-013:39:26 PM | 63.388 | 108.95 | 31.55 | 68.225 |
| 2016-03-013:39:30 PM | 63.275 | 108.838 | 31.662 | 68.225 |
| 2016-03-013:39:41 PM | 63.388 | 108.838 | 31.662 | 68.225 |
| 2016-03-013:39:45 PM | 63.275 | 108.838 | 31.662 | 68.225 |
| 2016-03-013:39:49 PM | 63.275 | 108.725 | 31.55 | 68.225 |
| 2016-03-013:39:53 PM | 63.275 | 108.725 | 31.55 | 68.225 |
| 2016-03-013:39:57 PM | 63.275 | 108.612 | 31.55 | 68.225 |
| 2016-03-013:40:01 PM | 63.275 | 108.612 | 31.775 | 68.225 |
| 2016-03-013:40:05 PM | 63.275 | 108.5 | 31.662 | 68.225 |
| 2016-03-013:40:09 PM | 63.275 | 108.5 | 31.775 | 68.225 |
| 2016-03-013:40:13 PM | 63.275 | 108.388 | 31.888 | 68.225 |
| 2016-03-013:40:17 PM | 63.275 | 108.5 | 31.888 | 68.225 |
| 2016-03-013:40:21 PM | 63.275 | 108.388 | 31.888 | 68.225 |
| 2016-03-013:40:25 PM | 63.275 | 108.275 | 31.888 | 68.225 |
| 2016-03-013:40:29 PM | 63.275 | 108.275 | 32 | 68.225 |
| 2016-03-013:40:33 PM | 63.162 | 108.275 | 31.888 | 68.225 |
| 2016-03-013:40:37 PM | 63.162 | 108.275 | 31.888 | 68.225 |
| 2016-03-013:40:41 PM | 63.275 | 108.163 | 31.888 | 68.225 |
| 2016-03-013:40:45 PM | 63.275 | 108.163 | 31.888 | 68.225 |
| 2016-03-013:40:49 PM | 63.162 | 108.163 | 32 | 68.225 |
| 2016-03-013:40:54 PM | 63.162 | 108.05 | 31.888 | 68.225 |
| 2016-03-013:40:58 PM | 63.162 | 107.938 | 31.888 | 68.225 |
| 2016-03-013:41:02 PM | 63.162 | 107.938 | 31.888 | 68.225 |
| 2016-03-013:41:06 PM | 63.162 | 107.825 | 32 | 68.225 |
| 2016-03-013:41:09 PM | 63.162 | 107.825 | 32 | 68.225 |
| 2016-03-013:41:13 PM | 63.162 | 107.712 | 31.888 | 68.225 |
| 2016-03-013:41:17 PM | 63.162 | 107.712 | 32 | 68.225 |
| 2016-03-013:41:21 PM | 63.162 | 107.6 | 32 | 68.112 |
| 2016-03-013:41:25 PM | 63.162 | 107.6 | 32 | 68.225 |
| 2016-03-013:41:29 PM | 63.162 | 107.488 | 32 | 68.225 |
| 2016-03-013:41:33 PM | 63.162 | 107.488 | 32 | 68.225 |
| 2016-03-013:41:37 PM | 63.162 | 107.375 | 32 | 68.225 |
| 2016-03-013:41:41 PM | 63.162 | 107.375 | 32.112 | 68.112 |
| 2016-03-013:41:45 PM | 63.162 | 107.262 | 32.112 | 68.225 |
| 2016-03-013:41:49 PM | 63.162 | 107.15 | 32.112 | 68.225 |
| 2016-03-013:41:53 PM | 63.162 | 107.15 | 32.112 | 68.225 |
| 2016-03-013:41:57 PM | 63.162 | 107.15 | 32.225 | 68.225 |
| 2016-03-013:42:05 PM | 63.162 | 107.038 | 32.338 | 68.112 |
| 2016-03-013:42:09 PM | 63.162 | 107.038 | 32.338 | 68.225 |
| 2016-03-013:42:17 PM | 63.162 | 106.925 | 32.338 | 68.225 |
| 2016-03-013:42:21 PM | 63.162 | 106.925 | 32.225 | 68.112 |
| 2016-03-013:42:25 PM | 63.275 | 106.812 | 32.112 | 68.112 |
| 2016-03-013:42:29 PM | 63.162 | 106.7 | 32.112 | 68.225 |
| 2016-03-013:42:37 PM | 63.162 | 106.7 | 32 | 68.225 |
| 2016-03-013:42:41 PM | 63.162 | 106.588 | 32 | 68.112 |
| 2016-03-013:42:45 PM | 63.162 | 106.588 | 31.775 | 68.112 |
| 2016-03-013:42:49 PM | 63.162 | 106.588 | 31.775 | 68.112 |
| 2016-03-013:42:53 PM | 63.162 | 106.475 | 31.662 | 68.112 |
| 2016-03-013:42:57 PM | 63.162 | 106.25 | 31.662 | 68.112 |
| 2016-03-013:43:01 PM | 63.162 | 106.138 | 31.662 | 68.112 |
| 2016-03-013:43:05 PM | 63.162 | 106.138 | 31.55 | 68.112 |
| 2016-03-013:43:09 PM | 63.162 | 106.025 | 31.55 | 68.112 |
| 2016-03-013:43:13 PM | 63.162 | 106.025 | 31.438 | 68.112 |
| 2016-03-013:43:17 PM | 63.162 | 105.913 | 31.438 | 68.112 |
| 2016-03-013:43:22 PM | 63.162 | 105.913 | 31.325 | 68.112 |
| 2016-03-013:43:26 PM | 63.05 | 105.913 | 31.325 | 68.112 |
| 2016-03-013:43:30 PM | 63.162 | 105.913 | 31.212 | 68.112 |
| 2016-03-013:43:34 PM | 63.05 | 105.8 | 31.212 | 68.112 |
| 2016-03-013:43:38 PM | 63.162 | 105.8 | 31.212 | 68.112 |
| 2016-03-013:43:42 PM | 63.05 | 105.688 | 31.212 | 68.112 |
| 2016-03-013:43:46 PM | 63.05 | 105.575 | 31.212 | 68.112 |
| 2016-03-013:43:50 PM | 63.05 | 105.462 | 31.212 | 68.112 |
| 2016-03-013:43:54 PM | 63.162 | 105.35 | 31.1 | 68.112 |
| 2016-03-013:43:58 PM | 63.162 | 105.35 | 31.212 | 68.112 |
| 2016-03-013:44:02 PM | 63.162 | 105.238 | 31.1 | 68.112 |
| 2016-03-013:44:06 PM | 63.162 | 105.125 | 30.988 | 68.112 |
| 2016-03-013:44:10 PM | 63.162 | 105.125 | 30.988 | 68.225 |
| 2016-03-013:44:14 PM | 63.162 | 105.012 | 30.875 | 68.225 |
| 2016-03-013:44:18 PM | 63.162 | 104.9 | 30.988 | 68.225 |
| 2016-03-013:44:22 PM | 63.162 | 104.9 | 31.1 | 68.225 |
| 2016-03-013:44:26 PM | 63.162 | 104.788 | 30.988 | 68.338 |
| 2016-03-013:44:31 PM | 63.275 | 104.675 | 30.875 | 68.225 |
| 2016-03-013:44:35 PM | 63.162 | 104.562 | 30.762 | 68.225 |
| 2016-03-013:44:39 PM | 63.162 | 104.562 | 30.762 | 68.225 |
| 2016-03-013:44:43 PM | 63.162 | 104.45 | 30.875 | 68.225 |
| 2016-03-013:44:47 PM | 63.162 | 104.338 | 30.762 | 68.225 |
| 2016-03-013:44:51 PM | 63.162 | 104.225 | 30.762 | 68.225 |
| 2016-03-013:44:55 PM | 63.162 | 104.225 | 30.762 | 68.225 |
| 2016-03-013:44:59 PM | 63.162 | 104.112 | 30.875 | 68.225 |
| 2016-03-013:45:03 PM | 63.162 | 104 | 30.875 | 68.225 |
| 2016-03-013:45:07 PM | 63.05 | 103.888 | 30.875 | 68.225 |
| 2016-03-013:45:11 PM | 63.162 | 103.888 | 30.875 | 68.225 |
| 2016-03-013:45:15 PM | 63.162 | 103.775 | 30.875 | 68.225 |
| 2016-03-013:45:19 PM | 63.05 | 103.663 | 30.875 | 68.225 |
| 2016-03-013:45:23 PM | 63.05 | 103.55 | 30.875 | 68.225 |
| 2016-03-013:45:28 PM | 63.05 | 103.438 | 30.988 | 68.225 |
| 2016-03-013:45:32 PM | 63.05 | 103.325 | 30.988 | 68.225 |
| 2016-03-013:45:36 PM | 63.05 | 103.212 | 30.988 | 68.112 |
| 2016-03-013:45:40 PM | 63.05 | 103.1 | 30.988 | 68.225 |
| 2016-03-013:45:44 PM | 63.05 | 102.988 | 30.875 | 68.225 |
| 2016-03-013:45:48 PM | 63.05 | 102.988 | 30.875 | 68.112 |
| 2016-03-013:45:52 PM | 63.05 | 102.875 | 30.875 | 68.225 |
| 2016-03-013:45:56 PM | 63.05 | 102.762 | 30.875 | 68.112 |
| 2016-03-013:46:00 PM | 63.05 | 102.65 | 30.875 | 68.112 |
| 2016-03-013:46:04 PM | 63.05 | 102.65 | 30.988 | 68.112 |
| 2016-03-013:46:08 PM | 63.05 | 102.538 | 30.875 | 68.112 |
| 2016-03-013:46:12 PM | 63.05 | 102.538 | 30.875 | 68.112 |
| 2016-03-013:46:16 PM | 63.05 | 102.425 | 30.762 | 68.112 |
| 2016-03-013:46:24 PM | 63.05 | 102.425 | 30.538 | 68.112 |
| 2016-03-013:46:29 PM | 63.05 | 102.312 | 30.538 | 68.112 |
| 2016-03-013:46:33 PM | 62.938 | 102.312 | 30.425 | 68.112 |
| 2016-03-013:46:37 PM | 63.05 | 102.312 | 30.312 | 68.112 |
| 2016-03-013:46:41 PM | 63.05 | 102.2 | 30.312 | 68.112 |
| 2016-03-013:46:45 PM | 63.05 | 102.2 | 30.425 | 68.112 |
| 2016-03-013:46:49 PM | 63.05 | 102.088 | 30.312 | 68.112 |
| 2016-03-013:46:53 PM | 63.05 | 102.088 | 30.2 | 68 |
| 2016-03-013:46:57 PM | 63.05 | 102.088 | 30.088 | 68 |
| 2016-03-013:47:01 PM | 63.05 | 102.088 | 30.088 | 68 |
| 2016-03-013:47:05 PM | 63.05 | 102.088 | 30.088 | 68 |
| 2016-03-013:47:09 PM | 63.05 | 101.975 | 30.2 | 68 |
| 2016-03-013:47:13 PM | 63.05 | 101.975 | 30.2 | 68 |
| 2016-03-013:47:17 PM | 63.05 | 101.862 | 30.2 | 68 |
| 2016-03-013:47:21 PM | 63.05 | 101.75 | 30.088 | 68 |
| 2016-03-013:47:25 PM | 63.05 | 101.638 | 30.088 | 68 |
| 2016-03-013:47:29 PM | 63.05 | 101.638 | 29.975 | 68 |
| 2016-03-013:47:33 PM | 63.05 | 101.525 | 30.088 | 68 |
| 2016-03-013:47:38 PM | 62.938 | 101.525 | 30.2 | 68 |
| 2016-03-013:47:42 PM | 63.05 | 101.413 | 30.2 | 68 |
| 2016-03-013:47:46 PM | 62.938 | 101.3 | 30.088 | 68 |
| 2016-03-013:47:50 PM | 62.938 | 101.188 | 29.975 | 68 |
| 2016-03-013:47:54 PM | 62.938 | 101.188 | 29.975 | 68 |
| 2016-03-013:47:58 PM | 62.938 | 100.962 | 29.862 | 68 |
| 2016-03-013:48:02 PM | 62.938 | 100.962 | 29.862 | 68 |
| 2016-03-013:48:06 PM | 62.938 | 100.85 | 29.975 | 67.888 |
| 2016-03-013:48:10 PM | 62.938 | 100.85 | 29.975 | 67.888 |
| 2016-03-013:48:14 PM | 62.938 | 100.738 | 29.975 | 68 |
| 2016-03-013:48:18 PM | 62.938 | 100.625 | 29.862 | 67.888 |
| 2016-03-013:48:22 PM | 62.938 | 100.512 | 29.862 | 68 |
| 2016-03-013:48:26 PM | 62.938 | 100.4 | 29.75 | 67.888 |
| 2016-03-013:48:30 PM | 62.938 | 100.4 | 29.75 | 67.888 |
| 2016-03-013:48:34 PM | 62.825 | 100.288 | 29.75 | 67.888 |
| 2016-03-013:48:38 PM | 62.938 | 100.175 | 29.862 | 67.888 |
| 2016-03-013:48:43 PM | 62.825 | 100.062 | 29.862 | 67.888 |
| 2016-03-013:48:47 PM | 62.938 | 99.95 | 29.975 | 67.888 |
| 2016-03-013:48:51 PM | 62.825 | 99.838 | 29.975 | 67.888 |
| 2016-03-013:48:55 PM | 62.825 | 99.725 | 30.088 | 67.888 |
| 2016-03-013:48:59 PM | 62.825 | 99.725 | 30.088 | 68 |
| 2016-03-013:49:03 PM | 62.825 | 99.5 | 30.088 | 67.888 |
| 2016-03-013:49:07 PM | 62.825 | 99.5 | 30.2 | 68 |
| 2016-03-013:49:11 PM | 62.825 | 99.388 | 30.2 | 68 |
| 2016-03-013:49:15 PM | 62.825 | 99.275 | 30.312 | 68 |
| 2016-03-013:49:19 PM | 62.825 | 99.163 | 30.312 | 68 |
| 2016-03-013:49:23 PM | 62.825 | 99.163 | 30.312 | 68.112 |
| 2016-03-013:49:27 PM | 62.825 | 99.05 | 30.425 | 68.112 |
| 2016-03-013:49:31 PM | 62.825 | 98.938 | 30.425 | 68.225 |
| 2016-03-013:49:35 PM | 62.825 | 98.825 | 30.425 | 68.112 |
| 2016-03-013:49:39 PM | 62.712 | 98.712 | 30.538 | 68.225 |
| 2016-03-013:49:43 PM | 62.825 | 98.6 | 30.538 | 68.225 |
| 2016-03-013:49:47 PM | 62.825 | 98.488 | 30.425 | 68.225 |
| 2016-03-013:49:55 PM | 62.712 | 98.488 | 30.312 | 68.225 |
| 2016-03-013:49:59 PM | 62.825 | 98.262 | 30.312 | 68.225 |
| 2016-03-013:50:03 PM | 62.825 | 98.262 | 30.2 | 68.225 |
| 2016-03-013:50:07 PM | 62.712 | 98.15 | 30.2 | 68.225 |
| 2016-03-013:50:11 PM | 62.712 | 98.038 | 30.312 | 68.225 |
| 2016-03-013:50:15 PM | 62.712 | 98.038 | 30.312 | 68.225 |
| 2016-03-013:50:19 PM | 62.712 | 97.925 | 30.425 | 68.225 |
| 2016-03-013:50:23 PM | 62.712 | 97.925 | 30.425 | 68.112 |
| 2016-03-013:50:28 PM | 62.712 | 97.812 | 30.425 | 68.225 |
| 2016-03-013:50:32 PM | 62.825 | 97.812 | 30.312 | 68.225 |
| 2016-03-013:50:36 PM | 62.938 | 97.7 | 30.312 | 68.225 |
| 2016-03-013:50:40 PM | 62.938 | 97.7 | 30.2 | 68.225 |
| 2016-03-013:50:44 PM | 62.938 | 97.588 | 30.2 | 68.225 |
| 2016-03-013:50:48 PM | 62.938 | 97.588 | 30.312 | 68.225 |
| 2016-03-013:50:52 PM | 63.05 | 97.475 | 30.312 | 68.112 |
| 2016-03-013:50:56 PM | 63.05 | 97.475 | 30.312 | 68.112 |
| 2016-03-013:51:00 PM | 62.938 | 97.475 | 30.312 | 68.225 |
| 2016-03-013:51:04 PM | 62.938 | 97.362 | 30.312 | 68.225 |
| 2016-03-013:51:08 PM | 62.938 | 97.362 | 30.425 | 68.112 |
| 2016-03-013:51:12 PM | 62.938 | 97.362 | 30.425 | 68.112 |
| 2016-03-013:51:20 PM | 62.825 | 97.25 | 30.312 | 68.112 |
| 2016-03-013:51:24 PM | 62.825 | 97.25 | 30.2 | 68.112 |
| 2016-03-013:51:29 PM | 62.712 | 97.25 | 30.2 | 68.112 |
| 2016-03-013:51:33 PM | 62.712 | 97.138 | 30.088 | 68.112 |
| 2016-03-013:51:37 PM | 62.712 | 97.138 | 30.088 | 68.112 |
| 2016-03-013:51:41 PM | 62.712 | 97.138 | 30.2 | 68.112 |
| 2016-03-013:51:45 PM | 62.712 | 97.138 | 30.2 | 68.112 |
| 2016-03-013:51:49 PM | 62.6 | 97.138 | 30.2 | 68.112 |
| 2016-03-013:51:53 PM | 62.6 | 97.138 | 30.088 | 68.112 |
| 2016-03-013:51:57 PM | 62.6 | 97.138 | 30.088 | 68.112 |
| 2016-03-013:52:01 PM | 62.6 | 97.025 | 30.088 | 68.112 |
| 2016-03-013:52:05 PM | 62.6 | 97.025 | 30.2 | 68.112 |
| 2016-03-013:52:09 PM | 62.6 | 97.138 | 30.088 | 68.112 |
| 2016-03-013:52:13 PM | 62.6 | 97.138 | 30.088 | 68 |
| 2016-03-013:52:17 PM | 62.488 | 97.025 | 29.975 | 68 |
| 2016-03-013:52:21 PM | 62.6 | 97.025 | 29.862 | 68 |
| 2016-03-013:52:25 PM | 62.6 | 97.025 | 29.862 | 68 |
| 2016-03-013:52:29 PM | 62.488 | 96.913 | 29.862 | 68 |
| 2016-03-013:52:33 PM | 62.6 | 96.913 | 29.862 | 68 |
| 2016-03-013:52:38 PM | 62.6 | 96.913 | 29.862 | 68 |
| 2016-03-013:52:42 PM | 62.488 | 96.8 | 29.975 | 68 |
| 2016-03-013:52:46 PM | 62.488 | 96.8 | 30.088 | 68 |
| 2016-03-013:52:50 PM | 62.488 | 96.8 | 29.862 | 68 |
| 2016-03-013:52:54 PM | 62.6 | 96.8 | 29.75 | 68 |
| 2016-03-013:52:58 PM | 62.488 | 96.688 | 29.638 | 68 |
| 2016-03-013:53:02 PM | 62.6 | 96.688 | 29.525 | 68 |
| 2016-03-013:53:06 PM | 62.6 | 96.575 | 29.412 | 67.888 |
| 2016-03-013:53:10 PM | 62.6 | 96.575 | 29.412 | 67.888 |
| 2016-03-013:53:14 PM | 62.712 | 96.575 | 29.412 | 67.888 |
| 2016-03-013:53:18 PM | 62.712 | 96.462 | 29.3 | 68 |
| 2016-03-013:53:22 PM | 62.712 | 96.462 | 29.188 | 68 |
| 2016-03-013:53:26 PM | 62.938 | 96.35 | 29.3 | 68 |
| 2016-03-013:53:30 PM | 62.938 | 96.35 | 29.188 | 68 |
| 2016-03-013:53:34 PM | 62.938 | 96.35 | 29.075 | 68 |
| 2016-03-013:53:38 PM | 62.825 | 96.238 | 28.962 | 68 |
| 2016-03-013:53:42 PM | 62.712 | 96.238 | 28.962 | 68.112 |
| 2016-03-013:53:46 PM | 62.825 | 96.238 | 28.85 | 68.112 |
| 2016-03-013:53:50 PM | 62.825 | 96.125 | 28.85 | 68.225 |
| 2016-03-013:53:54 PM | 62.825 | 96.125 | 28.85 | 68.225 |
| 2016-03-013:53:58 PM | 62.825 | 96.012 | 28.85 | 68.225 |
| 2016-03-013:54:02 PM | 62.825 | 96.012 | 28.738 | 68.225 |
| 2016-03-013:54:06 PM | 62.825 | 95.9 | 28.738 | 68.112 |
| 2016-03-013:54:10 PM | 62.825 | 95.9 | 28.738 | 68.112 |
| 2016-03-013:54:14 PM | 62.825 | 95.9 | 28.738 | 68.112 |
| 2016-03-013:54:18 PM | 62.712 | 95.788 | 28.738 | 68.112 |
| 2016-03-013:54:22 PM | 62.712 | 95.675 | 28.85 | 68.112 |
| 2016-03-013:54:26 PM | 62.712 | 95.675 | 28.85 | 68.112 |
| 2016-03-013:54:30 PM | 62.712 | 95.675 | 28.85 | 68.112 |
| 2016-03-013:54:35 PM | 62.825 | 95.562 | 28.85 | 68.112 |
| 2016-03-013:54:39 PM | 62.825 | 95.562 | 28.738 | 68.112 |
| 2016-03-013:54:43 PM | 62.825 | 95.45 | 28.625 | 68 |
| 2016-03-013:54:47 PM | 62.825 | 95.45 | 28.625 | 68 |
| 2016-03-013:54:51 PM | 62.825 | 95.45 | 28.738 | 68 |
| 2016-03-013:54:55 PM | 62.938 | 95.338 | 28.738 | 68 |
| 2016-03-013:54:59 PM | 62.938 | 95.225 | 28.85 | 68 |
| 2016-03-013:55:03 PM | 62.938 | 95.225 | 28.85 | 68 |
| 2016-03-013:55:07 PM | 62.938 | 95.112 | 28.738 | 68 |
| 2016-03-013:55:11 PM | 62.938 | 95.112 | 28.625 | 68 |
| 2016-03-013:55:15 PM | 62.938 | 95 | 28.625 | 68 |
| 2016-03-013:55:19 PM | 62.938 | 95 | 28.738 | 68 |
| 2016-03-013:55:23 PM | 62.938 | 94.888 | 28.738 | 68 |
| 2016-03-013:55:27 PM | 62.938 | 94.775 | 28.85 | 68 |
| 2016-03-013:55:31 PM | 62.938 | 94.775 | 28.962 | 68 |
| 2016-03-013:55:35 PM | 62.938 | 94.663 | 29.075 | 68 |
| 2016-03-013:55:39 PM | 62.938 | 94.55 | 29.075 | 68 |
| 2016-03-013:55:43 PM | 62.938 | 94.55 | 29.075 | 68 |
| 2016-03-013:55:47 PM | 62.938 | 94.438 | 28.962 | 68 |
| 2016-03-013:55:51 PM | 62.938 | 94.325 | 28.962 | 68 |
| 2016-03-013:55:55 PM | 62.938 | 94.325 | 28.962 | 68 |
| 2016-03-013:55:59 PM | 62.825 | 94.325 | 28.85 | 68 |
| 2016-03-013:56:03 PM | 62.712 | 94.212 | 28.85 | 68 |
| 2016-03-013:56:07 PM | 62.6 | 94.212 | 28.85 | 68 |
| 2016-03-013:56:11 PM | 62.6 | 94.1 | 28.738 | 68 |
| 2016-03-013:56:15 PM | 62.488 | 93.988 | 28.738 | 68 |
| 2016-03-013:56:19 PM | 62.488 | 93.875 | 28.738 | 68 |
| 2016-03-013:56:23 PM | 62.488 | 93.875 | 28.738 | 68 |
| 2016-03-013:56:27 PM | 62.488 | 93.762 | 28.85 | 68 |
| 2016-03-013:56:32 PM | 62.375 | 93.762 | 28.85 | 68 |
| 2016-03-013:56:36 PM | 62.488 | 93.65 | 28.85 | 68 |
| 2016-03-013:56:40 PM | 62.375 | 93.538 | 28.85 | 68 |
| 2016-03-013:56:44 PM | 62.375 | 93.425 | 28.738 | 68 |
| 2016-03-013:56:48 PM | 62.262 | 93.312 | 28.625 | 68 |
| 2016-03-013:56:52 PM | 62.375 | 93.312 | 28.625 | 68 |
| 2016-03-013:56:56 PM | 62.375 | 93.2 | 28.625 | 68 |
| 2016-03-013:57:00 PM | 62.375 | 93.2 | 28.738 | 68 |
| 2016-03-013:57:04 PM | 62.375 | 93.088 | 28.625 | 68 |
| 2016-03-013:57:08 PM | 62.375 | 93.088 | 28.625 | 68 |
| 2016-03-013:57:12 PM | 62.375 | 92.862 | 28.625 | 68 |
| 2016-03-013:57:16 PM | 62.375 | 92.862 | 28.625 | 68 |
| 2016-03-013:57:20 PM | 62.262 | 92.75 | 28.625 | 68 |
| 2016-03-013:57:24 PM | 62.262 | 92.75 | 28.512 | 68 |
| 2016-03-013:57:28 PM | 62.262 | 92.638 | 28.512 | 68 |
| 2016-03-013:57:32 PM | 62.262 | 92.525 | 28.625 | 68 |
| 2016-03-013:57:36 PM | 62.15 | 92.525 | 28.625 | 68 |
| 2016-03-013:57:40 PM | 62.038 | 92.413 | 28.625 | 68 |
| 2016-03-013:57:44 PM | 62.038 | 92.3 | 28.738 | 67.888 |
| 2016-03-013:57:48 PM | 61.925 | 92.3 | 28.738 | 67.888 |
| 2016-03-013:57:52 PM | 61.925 | 92.188 | 28.85 | 67.888 |
| 2016-03-013:57:56 PM | 61.812 | 92.075 | 28.85 | 67.888 |
| 2016-03-013:58:00 PM | 61.925 | 92.075 | 28.962 | 67.888 |
| 2016-03-013:58:04 PM | 61.812 | 91.962 | 28.85 | 67.888 |
| 2016-03-013:58:08 PM | 61.812 | 91.85 | 28.85 | 67.888 |
| 2016-03-013:58:12 PM | 61.812 | 91.85 | 28.85 | 67.888 |
| 2016-03-013:58:16 PM | 61.812 | 91.738 | 28.85 | 67.888 |
| 2016-03-013:58:20 PM | 61.925 | 91.625 | 28.85 | 67.888 |
| 2016-03-013:58:24 PM | 61.925 | 91.625 | 28.85 | 67.775 |
| 2016-03-013:58:28 PM | 62.038 | 91.512 | 28.85 | 67.888 |
| 2016-03-013:58:32 PM | 62.15 | 91.512 | 28.85 | 67.888 |
| 2016-03-013:58:36 PM | 62.262 | 91.4 | 28.738 | 67.888 |
| 2016-03-013:58:41 PM | 62.262 | 91.288 | 28.738 | 67.775 |
| 2016-03-013:58:45 PM | 62.375 | 91.288 | 28.738 | 67.888 |
| 2016-03-013:58:49 PM | 62.488 | 91.175 | 28.738 | 67.775 |
| 2016-03-013:58:53 PM | 62.6 | 91.175 | 28.738 | 67.775 |
| 2016-03-013:58:57 PM | 62.6 | 91.175 | 28.85 | 67.775 |
| 2016-03-013:59:01 PM | 62.712 | 91.062 | 28.85 | 67.775 |
| 2016-03-013:59:05 PM | 62.825 | 90.95 | 28.85 | 67.775 |
| 2016-03-013:59:09 PM | 62.825 | 90.95 | 28.85 | 67.775 |
| 2016-03-013:59:13 PM | 62.938 | 90.95 | 28.962 | 67.775 |
| 2016-03-013:59:17 PM | 63.05 | 90.95 | 28.962 | 67.775 |
| 2016-03-013:59:21 PM | 63.05 | 90.838 | 28.962 | 67.662 |
| 2016-03-013:59:25 PM | 63.162 | 90.725 | 28.962 | 67.662 |
| 2016-03-013:59:29 PM | 63.162 | 90.612 | 28.962 | 67.662 |
| 2016-03-013:59:33 PM | 63.275 | 90.612 | 28.962 | 67.662 |
| 2016-03-013:59:37 PM | 63.275 | 90.5 | 28.962 | 67.662 |
| 2016-03-013:59:41 PM | 63.388 | 90.5 | 28.962 | 67.662 |
| 2016-03-013:59:45 PM | 63.388 | 90.388 | 28.962 | 67.662 |
| 2016-03-013:59:49 PM | 63.5 | 90.275 | 28.85 | 67.662 |
| 2016-03-013:59:53 PM | 63.5 | 90.275 | 28.85 | 67.662 |
| 2016-03-013:59:57 PM | 63.613 | 90.163 | 28.738 | 67.662 |
| 2016-03-014:00:01 PM | 63.613 | 89.938 | 28.738 | 67.55 |
| 2016-03-014:00:06 PM | 63.725 | 89.938 | 28.85 | 67.55 |
| 2016-03-014:00:10 PM | 63.725 | 89.825 | 28.85 | 67.55 |
| 2016-03-014:00:14 PM | 63.838 | 89.712 | 28.962 | 67.55 |
| 2016-03-014:00:18 PM | 63.838 | 89.6 | 29.075 | 67.55 |
| 2016-03-014:00:22 PM | 63.95 | 89.488 | 29.075 | 67.55 |
| 2016-03-014:00:26 PM | 63.95 | 89.375 | 29.075 | 67.55 |
| 2016-03-014:00:30 PM | 63.95 | 89.262 | 28.962 | 67.55 |
| 2016-03-014:00:34 PM | 63.95 | 89.15 | 29.075 | 67.55 |
| 2016-03-014:00:38 PM | 63.838 | 89.038 | 29.075 | 67.55 |
| 2016-03-014:00:42 PM | 63.838 | 88.925 | 29.188 | 67.55 |
| 2016-03-014:00:46 PM | 63.838 | 88.812 | 29.188 | 67.55 |
| 2016-03-014:00:50 PM | 63.725 | 88.7 | 29.075 | 67.55 |
| 2016-03-014:00:54 PM | 63.725 | 88.588 | 29.188 | 67.438 |
| 2016-03-014:00:58 PM | 63.725 | 88.475 | 29.188 | 67.438 |
| 2016-03-014:01:02 PM | 63.725 | 88.362 | 29.188 | 67.438 |
| 2016-03-014:01:07 PM | 63.838 | 88.25 | 29.188 | 67.438 |
| 2016-03-014:01:11 PM | 63.838 | 88.138 | 29.188 | 67.438 |
| 2016-03-014:01:15 PM | 63.838 | 88.025 | 29.3 | 67.438 |
| 2016-03-014:01:19 PM | 63.95 | 87.912 | 29.3 | 67.438 |
| 2016-03-014:01:23 PM | 63.95 | 87.912 | 29.3 | 67.438 |
| 2016-03-014:01:27 PM | 63.95 | 87.8 | 29.412 | 67.438 |
| 2016-03-014:01:31 PM | 64.062 | 87.688 | 29.412 | 67.438 |
| 2016-03-014:01:35 PM | 64.062 | 87.688 | 29.3 | 67.438 |
| 2016-03-014:01:39 PM | 63.95 | 87.575 | 29.3 | 67.438 |
| 2016-03-014:01:43 PM | 63.95 | 87.575 | 29.188 | 67.438 |
| 2016-03-014:01:47 PM | 63.838 | 87.462 | 29.075 | 67.438 |
| 2016-03-014:01:51 PM | 63.725 | 87.462 | 28.962 | 67.438 |
| 2016-03-014:01:55 PM | 63.725 | 87.35 | 28.962 | 67.438 |
| 2016-03-014:01:59 PM | 63.838 | 87.35 | 28.85 | 67.438 |
| 2016-03-014:02:03 PM | 63.725 | 87.35 | 28.962 | 67.438 |
| 2016-03-014:02:08 PM | 63.613 | 87.35 | 28.962 | 67.438 |
| 2016-03-014:02:12 PM | 63.5 | 87.238 | 28.85 | 67.438 |
| 2016-03-014:02:16 PM | 63.5 | 87.238 | 28.962 | 67.438 |
| 2016-03-014:02:20 PM | 63.388 | 87.125 | 28.85 | 67.438 |
| 2016-03-014:02:24 PM | 63.275 | 87.125 | 28.738 | 67.438 |
| 2016-03-014:02:28 PM | 63.162 | 87.012 | 28.625 | 67.438 |
| 2016-03-014:02:32 PM | 63.05 | 87.012 | 28.4 | 67.438 |
| 2016-03-014:02:36 PM | 62.938 | 86.9 | 28.4 | 67.438 |
| 2016-03-014:02:44 PM | 62.938 | 86.788 | 28.288 | 67.438 |
| 2016-03-014:02:48 PM | 62.938 | 86.675 | 28.288 | 67.438 |
| 2016-03-014:02:52 PM | 62.938 | 86.675 | 28.288 | 67.438 |
| 2016-03-014:02:56 PM | 62.825 | 86.562 | 28.288 | 67.438 |
| 2016-03-014:03:00 PM | 62.825 | 86.45 | 28.175 | 67.325 |
| 2016-03-014:03:04 PM | 62.825 | 86.338 | 28.175 | 67.438 |
| 2016-03-014:03:08 PM | 62.825 | 86.225 | 28.062 | 67.325 |
| 2016-03-014:03:12 PM | 62.825 | 86.112 | 28.062 | 67.325 |
| 2016-03-014:03:16 PM | 62.825 | 85.888 | 28.175 | 67.325 |
| 2016-03-014:03:21 PM | 62.825 | 85.775 | 28.062 | 67.325 |
| 2016-03-014:03:25 PM | 62.712 | 85.55 | 28.062 | 67.325 |
| 2016-03-014:03:29 PM | 62.712 | 85.438 | 28.062 | 67.325 |
| 2016-03-014:03:33 PM | 62.712 | 85.325 | 28.175 | 67.325 |
| 2016-03-014:03:37 PM | 62.825 | 85.1 | 28.288 | 67.325 |
| 2016-03-014:03:41 PM | 62.825 | 84.988 | 28.288 | 67.325 |
| 2016-03-014:03:45 PM | 62.825 | 84.875 | 28.288 | 67.325 |
| 2016-03-014:03:49 PM | 62.825 | 84.65 | 28.175 | 67.325 |
| 2016-03-014:03:53 PM | 62.938 | 84.425 | 28.288 | 67.325 |
| 2016-03-014:03:57 PM | 63.05 | 84.312 | 28.288 | 67.325 |
| 2016-03-014:04:01 PM | 63.05 | 84.088 | 28.4 | 67.325 |
| 2016-03-014:04:05 PM | 63.05 | 83.862 | 28.4 | 67.325 |
| 2016-03-014:04:09 PM | 63.162 | 83.75 | 28.4 | 67.325 |
| 2016-03-014:04:13 PM | 63.275 | 83.525 | 28.4 | 67.212 |
| 2016-03-014:04:17 PM | 63.275 | 83.412 | 28.288 | 67.325 |
| 2016-03-014:04:21 PM | 63.388 | 83.188 | 28.288 | 67.212 |
| 2016-03-014:04:25 PM | 63.388 | 83.075 | 28.288 | 67.212 |
| 2016-03-014:04:29 PM | 63.5 | 82.85 | 28.175 | 67.212 |
| 2016-03-014:04:33 PM | 63.5 | 82.738 | 28.288 | 67.212 |
| 2016-03-014:04:37 PM | 63.613 | 82.625 | 28.288 | 67.212 |
| 2016-03-014:04:41 PM | 63.613 | 82.4 | 28.288 | 67.212 |
| 2016-03-014:04:45 PM | 63.725 | 82.175 | 28.4 | 67.212 |
| 2016-03-014:04:49 PM | 63.725 | 82.062 | 28.4 | 67.212 |
| 2016-03-014:04:53 PM | 63.725 | 81.838 | 28.4 | 67.212 |
| 2016-03-014:04:57 PM | 63.725 | 81.612 | 28.4 | 67.212 |
| 2016-03-014:05:01 PM | 63.725 | 81.5 | 28.288 | 67.212 |
| 2016-03-014:05:05 PM | 63.613 | 81.388 | 28.288 | 67.212 |
| 2016-03-014:05:09 PM | 63.613 | 81.162 | 28.4 | 67.212 |
| 2016-03-014:05:13 PM | 63.613 | 81.05 | 28.4 | 67.212 |
| 2016-03-014:05:17 PM | 63.613 | 80.825 | 28.4 | 67.212 |
| 2016-03-014:05:22 PM | 63.613 | 80.6 | 28.4 | 67.212 |
| 2016-03-014:05:26 PM | 63.5 | 80.488 | 28.288 | 67.1 |
| 2016-03-014:05:30 PM | 63.5 | 80.375 | 28.288 | 67.1 |
| 2016-03-014:05:34 PM | 63.5 | 80.262 | 28.288 | 67.1 |
| 2016-03-014:05:38 PM | 63.5 | 80.038 | 28.288 | 67.1 |
| 2016-03-014:05:42 PM | 63.388 | 79.925 | 28.288 | 67.1 |
| 2016-03-014:05:46 PM | 63.388 | 79.7 | 28.4 | 67.1 |
| 2016-03-014:05:50 PM | 63.388 | 79.7 | 28.4 | 67.1 |
| 2016-03-014:05:54 PM | 63.388 | 79.475 | 28.512 | 67.1 |
| 2016-03-014:05:58 PM | 63.275 | 79.362 | 28.512 | 67.1 |
| 2016-03-014:06:02 PM | 63.275 | 79.138 | 28.512 | 67.1 |
| 2016-03-014:06:06 PM | 63.275 | 79.025 | 28.4 | 67.1 |
| 2016-03-014:06:10 PM | 63.275 | 78.8 | 28.4 | 66.988 |
| 2016-03-014:06:14 PM | 63.275 | 78.575 | 28.288 | 66.988 |
| 2016-03-014:06:18 PM | 63.275 | 78.462 | 28.175 | 66.988 |
| 2016-03-014:06:22 PM | 63.162 | 78.35 | 28.175 | 66.988 |
| 2016-03-014:06:26 PM | 63.162 | 78.238 | 28.175 | 66.988 |
| 2016-03-014:06:30 PM | 63.162 | 78.012 | 28.175 | 66.988 |
| 2016-03-014:06:34 PM | 63.162 | 77.9 | 28.175 | 66.988 |
| 2016-03-014:06:38 PM | 63.162 | 77.788 | 28.175 | 66.988 |
| 2016-03-014:06:42 PM | 63.162 | 77.562 | 28.175 | 66.988 |
| 2016-03-014:06:47 PM | 63.162 | 77.45 | 28.288 | 66.988 |
| 2016-03-014:06:51 PM | 63.162 | 77.338 | 28.288 | 66.988 |
| 2016-03-014:06:55 PM | 63.162 | 77.112 | 28.288 | 66.988 |
| 2016-03-014:06:59 PM | 63.05 | 77 | 28.175 | 66.988 |
| 2016-03-014:07:03 PM | 63.05 | 76.888 | 28.062 | 66.875 |
| 2016-03-014:07:07 PM | 63.05 | 76.662 | 27.95 | 66.988 |
| 2016-03-014:07:11 PM | 62.938 | 76.55 | 27.838 | 66.988 |
| 2016-03-014:07:15 PM | 62.938 | 76.325 | 27.838 | 66.988 |
| 2016-03-014:07:19 PM | 62.938 | 76.212 | 27.838 | 66.988 |
| 2016-03-014:07:23 PM | 62.938 | 75.988 | 27.838 | 66.875 |
| 2016-03-014:07:27 PM | 62.938 | 75.762 | 27.838 | 66.875 |
| 2016-03-014:07:31 PM | 62.825 | 75.65 | 27.838 | 66.875 |
| 2016-03-014:07:35 PM | 62.825 | 75.425 | 27.838 | 66.875 |
| 2016-03-014:07:39 PM | 62.938 | 75.2 | 27.95 | 66.875 |
| 2016-03-014:07:43 PM | 62.938 | 74.975 | 27.838 | 66.875 |